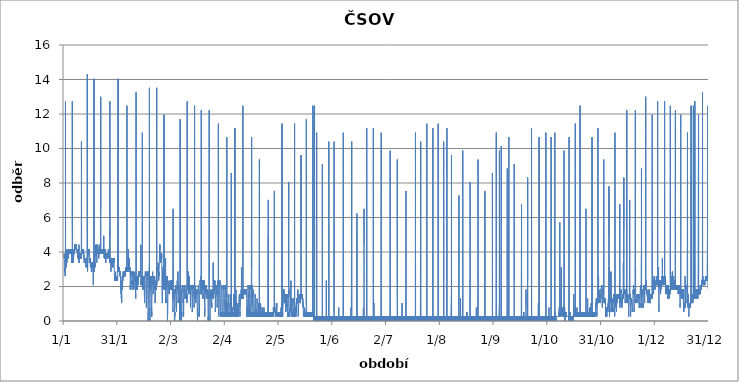
| Category | Series 0 |
|---|---|
| 2019-01-01 01:00:00 | 3.64 |
| 2019-01-01 02:00:00 | 3.64 |
| 2019-01-01 03:00:00 | 3.9 |
| 2019-01-01 04:00:00 | 3.9 |
| 2019-01-01 05:00:00 | 3.64 |
| 2019-01-01 06:00:00 | 3.64 |
| 2019-01-01 07:00:00 | 3.64 |
| 2019-01-01 08:00:00 | 3.64 |
| 2019-01-01 09:00:00 | 3.38 |
| 2019-01-01 10:00:00 | 3.38 |
| 2019-01-01 11:00:00 | 3.38 |
| 2019-01-01 12:00:00 | 3.38 |
| 2019-01-01 13:00:00 | 2.86 |
| 2019-01-01 14:00:00 | 3.12 |
| 2019-01-01 15:00:00 | 2.86 |
| 2019-01-01 16:00:00 | 2.6 |
| 2019-01-01 17:00:00 | 2.86 |
| 2019-01-01 18:00:00 | 2.86 |
| 2019-01-01 19:00:00 | 2.86 |
| 2019-01-01 20:00:00 | 3.12 |
| 2019-01-01 21:00:00 | 12.74 |
| 2019-01-01 22:00:00 | 3.9 |
| 2019-01-01 23:00:00 | 3.12 |
| 2019-01-02 | 3.12 |
| 2019-01-02 01:00:00 | 3.12 |
| 2019-01-02 02:00:00 | 3.12 |
| 2019-01-02 03:00:00 | 3.12 |
| 2019-01-02 04:00:00 | 3.38 |
| 2019-01-02 05:00:00 | 3.38 |
| 2019-01-02 06:00:00 | 3.12 |
| 2019-01-02 07:00:00 | 3.12 |
| 2019-01-02 08:00:00 | 3.38 |
| 2019-01-02 09:00:00 | 3.12 |
| 2019-01-02 10:00:00 | 3.12 |
| 2019-01-02 11:00:00 | 4.16 |
| 2019-01-02 12:00:00 | 3.9 |
| 2019-01-02 13:00:00 | 3.38 |
| 2019-01-02 14:00:00 | 3.64 |
| 2019-01-02 15:00:00 | 3.38 |
| 2019-01-02 16:00:00 | 3.64 |
| 2019-01-02 17:00:00 | 3.64 |
| 2019-01-02 18:00:00 | 3.64 |
| 2019-01-02 19:00:00 | 3.64 |
| 2019-01-02 20:00:00 | 3.64 |
| 2019-01-02 21:00:00 | 3.64 |
| 2019-01-02 22:00:00 | 3.9 |
| 2019-01-02 23:00:00 | 3.64 |
| 2019-01-03 | 3.9 |
| 2019-01-03 01:00:00 | 3.9 |
| 2019-01-03 02:00:00 | 3.9 |
| 2019-01-03 03:00:00 | 3.64 |
| 2019-01-03 04:00:00 | 3.9 |
| 2019-01-03 05:00:00 | 3.9 |
| 2019-01-03 06:00:00 | 3.9 |
| 2019-01-03 07:00:00 | 3.9 |
| 2019-01-03 08:00:00 | 4.16 |
| 2019-01-03 09:00:00 | 3.9 |
| 2019-01-03 10:00:00 | 3.9 |
| 2019-01-03 11:00:00 | 3.9 |
| 2019-01-03 12:00:00 | 3.64 |
| 2019-01-03 13:00:00 | 3.9 |
| 2019-01-03 14:00:00 | 3.64 |
| 2019-01-03 15:00:00 | 3.9 |
| 2019-01-03 16:00:00 | 3.9 |
| 2019-01-03 17:00:00 | 3.9 |
| 2019-01-03 18:00:00 | 3.9 |
| 2019-01-03 19:00:00 | 3.9 |
| 2019-01-03 20:00:00 | 4.16 |
| 2019-01-03 21:00:00 | 3.9 |
| 2019-01-03 22:00:00 | 4.16 |
| 2019-01-03 23:00:00 | 3.9 |
| 2019-01-04 | 4.16 |
| 2019-01-04 01:00:00 | 3.9 |
| 2019-01-04 02:00:00 | 4.16 |
| 2019-01-04 03:00:00 | 4.16 |
| 2019-01-04 04:00:00 | 4.16 |
| 2019-01-04 05:00:00 | 3.9 |
| 2019-01-04 06:00:00 | 4.16 |
| 2019-01-04 07:00:00 | 4.16 |
| 2019-01-04 08:00:00 | 4.16 |
| 2019-01-04 09:00:00 | 4.16 |
| 2019-01-04 10:00:00 | 4.16 |
| 2019-01-04 11:00:00 | 4.16 |
| 2019-01-04 12:00:00 | 3.9 |
| 2019-01-04 13:00:00 | 3.9 |
| 2019-01-04 14:00:00 | 4.16 |
| 2019-01-04 15:00:00 | 3.9 |
| 2019-01-04 16:00:00 | 4.16 |
| 2019-01-04 17:00:00 | 4.16 |
| 2019-01-04 18:00:00 | 4.16 |
| 2019-01-04 19:00:00 | 4.16 |
| 2019-01-04 20:00:00 | 4.16 |
| 2019-01-04 21:00:00 | 4.16 |
| 2019-01-04 22:00:00 | 4.16 |
| 2019-01-04 23:00:00 | 4.16 |
| 2019-01-05 | 3.9 |
| 2019-01-05 01:00:00 | 4.16 |
| 2019-01-05 02:00:00 | 4.16 |
| 2019-01-05 03:00:00 | 3.9 |
| 2019-01-05 04:00:00 | 4.16 |
| 2019-01-05 05:00:00 | 3.9 |
| 2019-01-05 06:00:00 | 4.16 |
| 2019-01-05 07:00:00 | 3.9 |
| 2019-01-05 08:00:00 | 3.9 |
| 2019-01-05 09:00:00 | 3.9 |
| 2019-01-05 10:00:00 | 3.64 |
| 2019-01-05 11:00:00 | 3.9 |
| 2019-01-05 12:00:00 | 3.38 |
| 2019-01-05 13:00:00 | 3.64 |
| 2019-01-05 14:00:00 | 3.38 |
| 2019-01-05 15:00:00 | 3.38 |
| 2019-01-05 16:00:00 | 3.38 |
| 2019-01-05 17:00:00 | 3.64 |
| 2019-01-05 18:00:00 | 12.74 |
| 2019-01-05 19:00:00 | 5.46 |
| 2019-01-05 20:00:00 | 3.64 |
| 2019-01-05 21:00:00 | 3.38 |
| 2019-01-05 22:00:00 | 3.64 |
| 2019-01-05 23:00:00 | 3.64 |
| 2019-01-06 | 3.38 |
| 2019-01-06 01:00:00 | 3.64 |
| 2019-01-06 02:00:00 | 3.38 |
| 2019-01-06 03:00:00 | 3.64 |
| 2019-01-06 04:00:00 | 3.64 |
| 2019-01-06 05:00:00 | 3.64 |
| 2019-01-06 06:00:00 | 3.9 |
| 2019-01-06 07:00:00 | 3.64 |
| 2019-01-06 08:00:00 | 3.64 |
| 2019-01-06 09:00:00 | 3.9 |
| 2019-01-06 10:00:00 | 3.64 |
| 2019-01-06 11:00:00 | 3.64 |
| 2019-01-06 12:00:00 | 3.64 |
| 2019-01-06 13:00:00 | 3.64 |
| 2019-01-06 14:00:00 | 3.9 |
| 2019-01-06 15:00:00 | 3.9 |
| 2019-01-06 16:00:00 | 3.9 |
| 2019-01-06 17:00:00 | 3.9 |
| 2019-01-06 18:00:00 | 4.16 |
| 2019-01-06 19:00:00 | 3.9 |
| 2019-01-06 20:00:00 | 4.16 |
| 2019-01-06 21:00:00 | 3.9 |
| 2019-01-06 22:00:00 | 3.9 |
| 2019-01-06 23:00:00 | 4.16 |
| 2019-01-07 | 3.9 |
| 2019-01-07 01:00:00 | 4.42 |
| 2019-01-07 02:00:00 | 4.16 |
| 2019-01-07 03:00:00 | 4.16 |
| 2019-01-07 04:00:00 | 4.42 |
| 2019-01-07 05:00:00 | 4.16 |
| 2019-01-07 06:00:00 | 4.16 |
| 2019-01-07 07:00:00 | 4.42 |
| 2019-01-07 08:00:00 | 4.16 |
| 2019-01-07 09:00:00 | 4.16 |
| 2019-01-07 10:00:00 | 4.16 |
| 2019-01-07 11:00:00 | 4.16 |
| 2019-01-07 12:00:00 | 4.42 |
| 2019-01-07 13:00:00 | 4.16 |
| 2019-01-07 14:00:00 | 4.16 |
| 2019-01-07 15:00:00 | 4.42 |
| 2019-01-07 16:00:00 | 4.42 |
| 2019-01-07 17:00:00 | 4.16 |
| 2019-01-07 18:00:00 | 4.16 |
| 2019-01-07 19:00:00 | 4.42 |
| 2019-01-07 20:00:00 | 4.16 |
| 2019-01-07 21:00:00 | 4.42 |
| 2019-01-07 22:00:00 | 4.16 |
| 2019-01-07 23:00:00 | 4.42 |
| 2019-01-08 | 4.16 |
| 2019-01-08 01:00:00 | 4.16 |
| 2019-01-08 02:00:00 | 4.42 |
| 2019-01-08 03:00:00 | 4.16 |
| 2019-01-08 04:00:00 | 4.16 |
| 2019-01-08 05:00:00 | 4.16 |
| 2019-01-08 06:00:00 | 4.16 |
| 2019-01-08 07:00:00 | 4.16 |
| 2019-01-08 08:00:00 | 4.16 |
| 2019-01-08 09:00:00 | 4.16 |
| 2019-01-08 10:00:00 | 4.16 |
| 2019-01-08 11:00:00 | 4.16 |
| 2019-01-08 12:00:00 | 4.16 |
| 2019-01-08 13:00:00 | 4.16 |
| 2019-01-08 14:00:00 | 3.9 |
| 2019-01-08 15:00:00 | 4.16 |
| 2019-01-08 16:00:00 | 3.9 |
| 2019-01-08 17:00:00 | 3.9 |
| 2019-01-08 18:00:00 | 3.9 |
| 2019-01-08 19:00:00 | 3.9 |
| 2019-01-08 20:00:00 | 3.9 |
| 2019-01-08 21:00:00 | 3.64 |
| 2019-01-08 22:00:00 | 3.9 |
| 2019-01-08 23:00:00 | 3.64 |
| 2019-01-09 | 3.9 |
| 2019-01-09 01:00:00 | 3.64 |
| 2019-01-09 02:00:00 | 3.64 |
| 2019-01-09 03:00:00 | 3.64 |
| 2019-01-09 04:00:00 | 3.64 |
| 2019-01-09 05:00:00 | 3.9 |
| 2019-01-09 06:00:00 | 3.64 |
| 2019-01-09 07:00:00 | 3.64 |
| 2019-01-09 08:00:00 | 3.64 |
| 2019-01-09 09:00:00 | 3.64 |
| 2019-01-09 10:00:00 | 3.64 |
| 2019-01-09 11:00:00 | 3.64 |
| 2019-01-09 12:00:00 | 4.42 |
| 2019-01-09 13:00:00 | 3.64 |
| 2019-01-09 14:00:00 | 3.38 |
| 2019-01-09 15:00:00 | 3.38 |
| 2019-01-09 16:00:00 | 3.64 |
| 2019-01-09 17:00:00 | 3.38 |
| 2019-01-09 18:00:00 | 3.64 |
| 2019-01-09 19:00:00 | 3.64 |
| 2019-01-09 20:00:00 | 3.64 |
| 2019-01-09 21:00:00 | 3.9 |
| 2019-01-09 22:00:00 | 3.64 |
| 2019-01-09 23:00:00 | 3.64 |
| 2019-01-10 | 3.64 |
| 2019-01-10 01:00:00 | 3.64 |
| 2019-01-10 02:00:00 | 3.9 |
| 2019-01-10 03:00:00 | 3.64 |
| 2019-01-10 04:00:00 | 3.9 |
| 2019-01-10 05:00:00 | 3.64 |
| 2019-01-10 06:00:00 | 3.64 |
| 2019-01-10 07:00:00 | 3.64 |
| 2019-01-10 08:00:00 | 3.64 |
| 2019-01-10 09:00:00 | 3.64 |
| 2019-01-10 10:00:00 | 3.64 |
| 2019-01-10 11:00:00 | 3.64 |
| 2019-01-10 12:00:00 | 3.64 |
| 2019-01-10 13:00:00 | 3.9 |
| 2019-01-10 14:00:00 | 3.64 |
| 2019-01-10 15:00:00 | 3.9 |
| 2019-01-10 16:00:00 | 3.9 |
| 2019-01-10 17:00:00 | 3.64 |
| 2019-01-10 18:00:00 | 3.9 |
| 2019-01-10 19:00:00 | 3.64 |
| 2019-01-10 20:00:00 | 3.9 |
| 2019-01-10 21:00:00 | 3.9 |
| 2019-01-10 22:00:00 | 10.4 |
| 2019-01-10 23:00:00 | 8.32 |
| 2019-01-11 | 4.16 |
| 2019-01-11 01:00:00 | 3.9 |
| 2019-01-11 02:00:00 | 3.9 |
| 2019-01-11 03:00:00 | 4.16 |
| 2019-01-11 04:00:00 | 3.9 |
| 2019-01-11 05:00:00 | 4.16 |
| 2019-01-11 06:00:00 | 4.16 |
| 2019-01-11 07:00:00 | 3.9 |
| 2019-01-11 08:00:00 | 4.16 |
| 2019-01-11 09:00:00 | 4.16 |
| 2019-01-11 10:00:00 | 4.16 |
| 2019-01-11 11:00:00 | 3.9 |
| 2019-01-11 12:00:00 | 4.16 |
| 2019-01-11 13:00:00 | 3.9 |
| 2019-01-11 14:00:00 | 4.16 |
| 2019-01-11 15:00:00 | 3.9 |
| 2019-01-11 16:00:00 | 4.16 |
| 2019-01-11 17:00:00 | 4.16 |
| 2019-01-11 18:00:00 | 3.9 |
| 2019-01-11 19:00:00 | 4.16 |
| 2019-01-11 20:00:00 | 4.16 |
| 2019-01-11 21:00:00 | 4.16 |
| 2019-01-11 22:00:00 | 4.16 |
| 2019-01-11 23:00:00 | 4.16 |
| 2019-01-12 | 4.16 |
| 2019-01-12 01:00:00 | 4.16 |
| 2019-01-12 02:00:00 | 3.9 |
| 2019-01-12 03:00:00 | 4.16 |
| 2019-01-12 04:00:00 | 3.64 |
| 2019-01-12 05:00:00 | 3.9 |
| 2019-01-12 06:00:00 | 3.9 |
| 2019-01-12 07:00:00 | 3.64 |
| 2019-01-12 08:00:00 | 3.64 |
| 2019-01-12 09:00:00 | 3.64 |
| 2019-01-12 10:00:00 | 3.64 |
| 2019-01-12 11:00:00 | 3.38 |
| 2019-01-12 12:00:00 | 3.38 |
| 2019-01-12 13:00:00 | 3.38 |
| 2019-01-12 14:00:00 | 3.38 |
| 2019-01-12 15:00:00 | 3.38 |
| 2019-01-12 16:00:00 | 3.38 |
| 2019-01-12 17:00:00 | 3.38 |
| 2019-01-12 18:00:00 | 3.38 |
| 2019-01-12 19:00:00 | 3.64 |
| 2019-01-12 20:00:00 | 3.64 |
| 2019-01-12 21:00:00 | 3.64 |
| 2019-01-12 22:00:00 | 3.38 |
| 2019-01-12 23:00:00 | 3.64 |
| 2019-01-13 | 3.38 |
| 2019-01-13 01:00:00 | 3.64 |
| 2019-01-13 02:00:00 | 3.38 |
| 2019-01-13 03:00:00 | 3.64 |
| 2019-01-13 04:00:00 | 3.64 |
| 2019-01-13 05:00:00 | 3.38 |
| 2019-01-13 06:00:00 | 3.38 |
| 2019-01-13 07:00:00 | 3.64 |
| 2019-01-13 08:00:00 | 3.38 |
| 2019-01-13 09:00:00 | 3.38 |
| 2019-01-13 10:00:00 | 3.64 |
| 2019-01-13 11:00:00 | 3.38 |
| 2019-01-13 12:00:00 | 3.38 |
| 2019-01-13 13:00:00 | 3.12 |
| 2019-01-13 14:00:00 | 3.12 |
| 2019-01-13 15:00:00 | 3.12 |
| 2019-01-13 16:00:00 | 3.38 |
| 2019-01-13 17:00:00 | 3.12 |
| 2019-01-13 18:00:00 | 3.38 |
| 2019-01-13 19:00:00 | 3.38 |
| 2019-01-13 20:00:00 | 3.12 |
| 2019-01-13 21:00:00 | 3.12 |
| 2019-01-13 22:00:00 | 3.38 |
| 2019-01-13 23:00:00 | 3.12 |
| 2019-01-14 | 3.38 |
| 2019-01-14 01:00:00 | 3.38 |
| 2019-01-14 02:00:00 | 3.12 |
| 2019-01-14 03:00:00 | 3.12 |
| 2019-01-14 04:00:00 | 3.38 |
| 2019-01-14 05:00:00 | 3.12 |
| 2019-01-14 06:00:00 | 14.3 |
| 2019-01-14 07:00:00 | 3.12 |
| 2019-01-14 08:00:00 | 3.12 |
| 2019-01-14 09:00:00 | 2.86 |
| 2019-01-14 10:00:00 | 3.12 |
| 2019-01-14 11:00:00 | 3.12 |
| 2019-01-14 12:00:00 | 3.12 |
| 2019-01-14 13:00:00 | 3.12 |
| 2019-01-14 14:00:00 | 3.12 |
| 2019-01-14 15:00:00 | 3.38 |
| 2019-01-14 16:00:00 | 3.38 |
| 2019-01-14 17:00:00 | 3.64 |
| 2019-01-14 18:00:00 | 3.64 |
| 2019-01-14 19:00:00 | 3.64 |
| 2019-01-14 20:00:00 | 3.64 |
| 2019-01-14 21:00:00 | 3.9 |
| 2019-01-14 22:00:00 | 3.9 |
| 2019-01-14 23:00:00 | 3.9 |
| 2019-01-15 | 3.9 |
| 2019-01-15 01:00:00 | 4.16 |
| 2019-01-15 02:00:00 | 4.16 |
| 2019-01-15 03:00:00 | 4.16 |
| 2019-01-15 04:00:00 | 4.16 |
| 2019-01-15 05:00:00 | 3.9 |
| 2019-01-15 06:00:00 | 4.16 |
| 2019-01-15 07:00:00 | 3.9 |
| 2019-01-15 08:00:00 | 4.16 |
| 2019-01-15 09:00:00 | 3.9 |
| 2019-01-15 10:00:00 | 3.9 |
| 2019-01-15 11:00:00 | 3.9 |
| 2019-01-15 12:00:00 | 3.9 |
| 2019-01-15 13:00:00 | 3.64 |
| 2019-01-15 14:00:00 | 3.64 |
| 2019-01-15 15:00:00 | 3.38 |
| 2019-01-15 16:00:00 | 3.38 |
| 2019-01-15 17:00:00 | 3.64 |
| 2019-01-15 18:00:00 | 3.38 |
| 2019-01-15 19:00:00 | 3.64 |
| 2019-01-15 20:00:00 | 3.38 |
| 2019-01-15 21:00:00 | 3.38 |
| 2019-01-15 22:00:00 | 3.64 |
| 2019-01-15 23:00:00 | 3.38 |
| 2019-01-16 | 3.12 |
| 2019-01-16 01:00:00 | 3.12 |
| 2019-01-16 02:00:00 | 3.12 |
| 2019-01-16 03:00:00 | 3.12 |
| 2019-01-16 04:00:00 | 3.38 |
| 2019-01-16 05:00:00 | 3.38 |
| 2019-01-16 06:00:00 | 3.12 |
| 2019-01-16 07:00:00 | 3.38 |
| 2019-01-16 08:00:00 | 3.38 |
| 2019-01-16 09:00:00 | 3.38 |
| 2019-01-16 10:00:00 | 3.38 |
| 2019-01-16 11:00:00 | 3.12 |
| 2019-01-16 12:00:00 | 3.12 |
| 2019-01-16 13:00:00 | 2.86 |
| 2019-01-16 14:00:00 | 3.12 |
| 2019-01-16 15:00:00 | 2.86 |
| 2019-01-16 16:00:00 | 3.12 |
| 2019-01-16 17:00:00 | 2.86 |
| 2019-01-16 18:00:00 | 3.38 |
| 2019-01-16 19:00:00 | 3.12 |
| 2019-01-16 20:00:00 | 3.12 |
| 2019-01-16 21:00:00 | 3.38 |
| 2019-01-16 22:00:00 | 3.38 |
| 2019-01-16 23:00:00 | 3.12 |
| 2019-01-17 | 3.38 |
| 2019-01-17 01:00:00 | 3.38 |
| 2019-01-17 02:00:00 | 3.38 |
| 2019-01-17 03:00:00 | 3.12 |
| 2019-01-17 04:00:00 | 3.38 |
| 2019-01-17 05:00:00 | 3.38 |
| 2019-01-17 06:00:00 | 3.12 |
| 2019-01-17 07:00:00 | 3.12 |
| 2019-01-17 08:00:00 | 3.38 |
| 2019-01-17 09:00:00 | 3.12 |
| 2019-01-17 10:00:00 | 3.12 |
| 2019-01-17 11:00:00 | 3.12 |
| 2019-01-17 12:00:00 | 2.6 |
| 2019-01-17 13:00:00 | 2.6 |
| 2019-01-17 14:00:00 | 2.34 |
| 2019-01-17 15:00:00 | 2.08 |
| 2019-01-17 16:00:00 | 2.6 |
| 2019-01-17 17:00:00 | 2.6 |
| 2019-01-17 18:00:00 | 2.86 |
| 2019-01-17 19:00:00 | 2.86 |
| 2019-01-17 20:00:00 | 3.12 |
| 2019-01-17 21:00:00 | 2.86 |
| 2019-01-17 22:00:00 | 3.12 |
| 2019-01-17 23:00:00 | 2.86 |
| 2019-01-18 | 14.04 |
| 2019-01-18 01:00:00 | 2.86 |
| 2019-01-18 02:00:00 | 2.86 |
| 2019-01-18 03:00:00 | 3.12 |
| 2019-01-18 04:00:00 | 3.12 |
| 2019-01-18 05:00:00 | 3.12 |
| 2019-01-18 06:00:00 | 2.86 |
| 2019-01-18 07:00:00 | 3.12 |
| 2019-01-18 08:00:00 | 3.12 |
| 2019-01-18 09:00:00 | 3.12 |
| 2019-01-18 10:00:00 | 3.9 |
| 2019-01-18 11:00:00 | 3.38 |
| 2019-01-18 12:00:00 | 3.12 |
| 2019-01-18 13:00:00 | 3.38 |
| 2019-01-18 14:00:00 | 3.12 |
| 2019-01-18 15:00:00 | 3.38 |
| 2019-01-18 16:00:00 | 3.38 |
| 2019-01-18 17:00:00 | 3.64 |
| 2019-01-18 18:00:00 | 3.64 |
| 2019-01-18 19:00:00 | 3.64 |
| 2019-01-18 20:00:00 | 3.9 |
| 2019-01-18 21:00:00 | 3.9 |
| 2019-01-18 22:00:00 | 4.16 |
| 2019-01-18 23:00:00 | 3.9 |
| 2019-01-19 | 4.16 |
| 2019-01-19 01:00:00 | 4.16 |
| 2019-01-19 02:00:00 | 4.42 |
| 2019-01-19 03:00:00 | 4.16 |
| 2019-01-19 04:00:00 | 4.16 |
| 2019-01-19 05:00:00 | 4.16 |
| 2019-01-19 06:00:00 | 4.16 |
| 2019-01-19 07:00:00 | 4.42 |
| 2019-01-19 08:00:00 | 4.16 |
| 2019-01-19 09:00:00 | 4.42 |
| 2019-01-19 10:00:00 | 4.16 |
| 2019-01-19 11:00:00 | 3.9 |
| 2019-01-19 12:00:00 | 3.64 |
| 2019-01-19 13:00:00 | 3.64 |
| 2019-01-19 14:00:00 | 3.38 |
| 2019-01-19 15:00:00 | 3.38 |
| 2019-01-19 16:00:00 | 3.64 |
| 2019-01-19 17:00:00 | 3.9 |
| 2019-01-19 18:00:00 | 3.9 |
| 2019-01-19 19:00:00 | 4.16 |
| 2019-01-19 20:00:00 | 4.16 |
| 2019-01-19 21:00:00 | 3.9 |
| 2019-01-19 22:00:00 | 4.16 |
| 2019-01-19 23:00:00 | 4.42 |
| 2019-01-20 | 4.16 |
| 2019-01-20 01:00:00 | 4.16 |
| 2019-01-20 02:00:00 | 4.16 |
| 2019-01-20 03:00:00 | 4.16 |
| 2019-01-20 04:00:00 | 4.16 |
| 2019-01-20 05:00:00 | 4.16 |
| 2019-01-20 06:00:00 | 4.16 |
| 2019-01-20 07:00:00 | 3.9 |
| 2019-01-20 08:00:00 | 4.16 |
| 2019-01-20 09:00:00 | 4.16 |
| 2019-01-20 10:00:00 | 3.9 |
| 2019-01-20 11:00:00 | 3.9 |
| 2019-01-20 12:00:00 | 3.9 |
| 2019-01-20 13:00:00 | 3.9 |
| 2019-01-20 14:00:00 | 3.64 |
| 2019-01-20 15:00:00 | 3.9 |
| 2019-01-20 16:00:00 | 3.64 |
| 2019-01-20 17:00:00 | 3.9 |
| 2019-01-20 18:00:00 | 3.9 |
| 2019-01-20 19:00:00 | 3.9 |
| 2019-01-20 20:00:00 | 4.16 |
| 2019-01-20 21:00:00 | 3.9 |
| 2019-01-20 22:00:00 | 4.16 |
| 2019-01-20 23:00:00 | 4.42 |
| 2019-01-21 | 4.16 |
| 2019-01-21 01:00:00 | 4.16 |
| 2019-01-21 02:00:00 | 4.16 |
| 2019-01-21 03:00:00 | 4.16 |
| 2019-01-21 04:00:00 | 4.42 |
| 2019-01-21 05:00:00 | 4.16 |
| 2019-01-21 06:00:00 | 4.16 |
| 2019-01-21 07:00:00 | 3.9 |
| 2019-01-21 08:00:00 | 4.16 |
| 2019-01-21 09:00:00 | 3.9 |
| 2019-01-21 10:00:00 | 4.16 |
| 2019-01-21 11:00:00 | 3.9 |
| 2019-01-21 12:00:00 | 4.16 |
| 2019-01-21 13:00:00 | 4.16 |
| 2019-01-21 14:00:00 | 3.9 |
| 2019-01-21 15:00:00 | 4.16 |
| 2019-01-21 16:00:00 | 4.16 |
| 2019-01-21 17:00:00 | 3.9 |
| 2019-01-21 18:00:00 | 4.16 |
| 2019-01-21 19:00:00 | 4.16 |
| 2019-01-21 20:00:00 | 13 |
| 2019-01-21 21:00:00 | 6.5 |
| 2019-01-21 22:00:00 | 4.16 |
| 2019-01-21 23:00:00 | 4.16 |
| 2019-01-22 | 4.16 |
| 2019-01-22 01:00:00 | 4.16 |
| 2019-01-22 02:00:00 | 3.9 |
| 2019-01-22 03:00:00 | 4.16 |
| 2019-01-22 04:00:00 | 4.16 |
| 2019-01-22 05:00:00 | 3.9 |
| 2019-01-22 06:00:00 | 3.9 |
| 2019-01-22 07:00:00 | 4.16 |
| 2019-01-22 08:00:00 | 3.9 |
| 2019-01-22 09:00:00 | 4.16 |
| 2019-01-22 10:00:00 | 4.16 |
| 2019-01-22 11:00:00 | 4.16 |
| 2019-01-22 12:00:00 | 4.16 |
| 2019-01-22 13:00:00 | 3.9 |
| 2019-01-22 14:00:00 | 3.9 |
| 2019-01-22 15:00:00 | 3.9 |
| 2019-01-22 16:00:00 | 3.9 |
| 2019-01-22 17:00:00 | 3.9 |
| 2019-01-22 18:00:00 | 3.9 |
| 2019-01-22 19:00:00 | 4.16 |
| 2019-01-22 20:00:00 | 4.16 |
| 2019-01-22 21:00:00 | 4.16 |
| 2019-01-22 22:00:00 | 4.16 |
| 2019-01-22 23:00:00 | 4.16 |
| 2019-01-23 | 4.16 |
| 2019-01-23 01:00:00 | 4.16 |
| 2019-01-23 02:00:00 | 4.16 |
| 2019-01-23 03:00:00 | 4.16 |
| 2019-01-23 04:00:00 | 3.9 |
| 2019-01-23 05:00:00 | 4.16 |
| 2019-01-23 06:00:00 | 4.16 |
| 2019-01-23 07:00:00 | 3.9 |
| 2019-01-23 08:00:00 | 4.16 |
| 2019-01-23 09:00:00 | 3.9 |
| 2019-01-23 10:00:00 | 4.16 |
| 2019-01-23 11:00:00 | 3.9 |
| 2019-01-23 12:00:00 | 4.94 |
| 2019-01-23 13:00:00 | 4.16 |
| 2019-01-23 14:00:00 | 3.9 |
| 2019-01-23 15:00:00 | 4.16 |
| 2019-01-23 16:00:00 | 3.9 |
| 2019-01-23 17:00:00 | 3.9 |
| 2019-01-23 18:00:00 | 3.9 |
| 2019-01-23 19:00:00 | 3.9 |
| 2019-01-23 20:00:00 | 3.64 |
| 2019-01-23 21:00:00 | 4.16 |
| 2019-01-23 22:00:00 | 3.64 |
| 2019-01-23 23:00:00 | 4.16 |
| 2019-01-24 | 3.64 |
| 2019-01-24 01:00:00 | 4.16 |
| 2019-01-24 02:00:00 | 3.9 |
| 2019-01-24 03:00:00 | 3.9 |
| 2019-01-24 04:00:00 | 3.9 |
| 2019-01-24 05:00:00 | 3.9 |
| 2019-01-24 06:00:00 | 3.9 |
| 2019-01-24 07:00:00 | 3.9 |
| 2019-01-24 08:00:00 | 3.64 |
| 2019-01-24 09:00:00 | 4.16 |
| 2019-01-24 10:00:00 | 3.9 |
| 2019-01-24 11:00:00 | 3.64 |
| 2019-01-24 12:00:00 | 3.64 |
| 2019-01-24 13:00:00 | 3.38 |
| 2019-01-24 14:00:00 | 3.64 |
| 2019-01-24 15:00:00 | 3.38 |
| 2019-01-24 16:00:00 | 3.64 |
| 2019-01-24 17:00:00 | 3.64 |
| 2019-01-24 18:00:00 | 3.64 |
| 2019-01-24 19:00:00 | 3.64 |
| 2019-01-24 20:00:00 | 3.9 |
| 2019-01-24 21:00:00 | 3.64 |
| 2019-01-24 22:00:00 | 3.64 |
| 2019-01-24 23:00:00 | 3.9 |
| 2019-01-25 | 3.9 |
| 2019-01-25 01:00:00 | 3.9 |
| 2019-01-25 02:00:00 | 3.9 |
| 2019-01-25 03:00:00 | 3.9 |
| 2019-01-25 04:00:00 | 3.9 |
| 2019-01-25 05:00:00 | 3.9 |
| 2019-01-25 06:00:00 | 3.9 |
| 2019-01-25 07:00:00 | 3.9 |
| 2019-01-25 08:00:00 | 3.9 |
| 2019-01-25 09:00:00 | 3.9 |
| 2019-01-25 10:00:00 | 3.64 |
| 2019-01-25 11:00:00 | 3.9 |
| 2019-01-25 12:00:00 | 3.9 |
| 2019-01-25 13:00:00 | 3.64 |
| 2019-01-25 14:00:00 | 3.9 |
| 2019-01-25 15:00:00 | 3.64 |
| 2019-01-25 16:00:00 | 3.9 |
| 2019-01-25 17:00:00 | 3.64 |
| 2019-01-25 18:00:00 | 3.64 |
| 2019-01-25 19:00:00 | 3.9 |
| 2019-01-25 20:00:00 | 3.9 |
| 2019-01-25 21:00:00 | 3.9 |
| 2019-01-25 22:00:00 | 3.9 |
| 2019-01-25 23:00:00 | 3.9 |
| 2019-01-26 | 3.9 |
| 2019-01-26 01:00:00 | 3.9 |
| 2019-01-26 02:00:00 | 3.9 |
| 2019-01-26 03:00:00 | 3.9 |
| 2019-01-26 04:00:00 | 4.16 |
| 2019-01-26 05:00:00 | 3.9 |
| 2019-01-26 06:00:00 | 3.9 |
| 2019-01-26 07:00:00 | 3.9 |
| 2019-01-26 08:00:00 | 3.9 |
| 2019-01-26 09:00:00 | 3.9 |
| 2019-01-26 10:00:00 | 3.9 |
| 2019-01-26 11:00:00 | 3.9 |
| 2019-01-26 12:00:00 | 3.64 |
| 2019-01-26 13:00:00 | 3.9 |
| 2019-01-26 14:00:00 | 3.64 |
| 2019-01-26 15:00:00 | 3.9 |
| 2019-01-26 16:00:00 | 3.64 |
| 2019-01-26 17:00:00 | 3.64 |
| 2019-01-26 18:00:00 | 3.9 |
| 2019-01-26 19:00:00 | 3.38 |
| 2019-01-26 20:00:00 | 3.9 |
| 2019-01-26 21:00:00 | 3.64 |
| 2019-01-26 22:00:00 | 3.64 |
| 2019-01-26 23:00:00 | 5.46 |
| 2019-01-27 | 12.74 |
| 2019-01-27 01:00:00 | 3.64 |
| 2019-01-27 02:00:00 | 3.38 |
| 2019-01-27 03:00:00 | 3.64 |
| 2019-01-27 04:00:00 | 3.64 |
| 2019-01-27 05:00:00 | 3.38 |
| 2019-01-27 06:00:00 | 3.64 |
| 2019-01-27 07:00:00 | 3.64 |
| 2019-01-27 08:00:00 | 3.38 |
| 2019-01-27 09:00:00 | 3.38 |
| 2019-01-27 10:00:00 | 3.38 |
| 2019-01-27 11:00:00 | 3.38 |
| 2019-01-27 12:00:00 | 3.38 |
| 2019-01-27 13:00:00 | 3.12 |
| 2019-01-27 14:00:00 | 3.12 |
| 2019-01-27 15:00:00 | 2.86 |
| 2019-01-27 16:00:00 | 2.86 |
| 2019-01-27 17:00:00 | 3.12 |
| 2019-01-27 18:00:00 | 3.64 |
| 2019-01-27 19:00:00 | 3.38 |
| 2019-01-27 20:00:00 | 3.38 |
| 2019-01-27 21:00:00 | 3.38 |
| 2019-01-27 22:00:00 | 3.38 |
| 2019-01-27 23:00:00 | 3.64 |
| 2019-01-28 | 3.38 |
| 2019-01-28 01:00:00 | 3.38 |
| 2019-01-28 02:00:00 | 3.38 |
| 2019-01-28 03:00:00 | 3.38 |
| 2019-01-28 04:00:00 | 3.38 |
| 2019-01-28 05:00:00 | 3.38 |
| 2019-01-28 06:00:00 | 3.38 |
| 2019-01-28 07:00:00 | 3.38 |
| 2019-01-28 08:00:00 | 3.12 |
| 2019-01-28 09:00:00 | 3.64 |
| 2019-01-28 10:00:00 | 3.12 |
| 2019-01-28 11:00:00 | 3.38 |
| 2019-01-28 12:00:00 | 3.38 |
| 2019-01-28 13:00:00 | 3.38 |
| 2019-01-28 14:00:00 | 3.38 |
| 2019-01-28 15:00:00 | 3.38 |
| 2019-01-28 16:00:00 | 3.38 |
| 2019-01-28 17:00:00 | 3.38 |
| 2019-01-28 18:00:00 | 3.38 |
| 2019-01-28 19:00:00 | 3.12 |
| 2019-01-28 20:00:00 | 3.38 |
| 2019-01-28 21:00:00 | 3.38 |
| 2019-01-28 22:00:00 | 3.64 |
| 2019-01-28 23:00:00 | 3.38 |
| 2019-01-29 | 3.64 |
| 2019-01-29 01:00:00 | 3.38 |
| 2019-01-29 02:00:00 | 3.64 |
| 2019-01-29 03:00:00 | 3.38 |
| 2019-01-29 04:00:00 | 3.64 |
| 2019-01-29 05:00:00 | 3.38 |
| 2019-01-29 06:00:00 | 3.64 |
| 2019-01-29 07:00:00 | 3.38 |
| 2019-01-29 08:00:00 | 3.64 |
| 2019-01-29 09:00:00 | 3.38 |
| 2019-01-29 10:00:00 | 3.38 |
| 2019-01-29 11:00:00 | 3.38 |
| 2019-01-29 12:00:00 | 3.38 |
| 2019-01-29 13:00:00 | 3.38 |
| 2019-01-29 14:00:00 | 2.6 |
| 2019-01-29 15:00:00 | 2.34 |
| 2019-01-29 16:00:00 | 2.34 |
| 2019-01-29 17:00:00 | 2.34 |
| 2019-01-29 18:00:00 | 2.34 |
| 2019-01-29 19:00:00 | 2.6 |
| 2019-01-29 20:00:00 | 2.6 |
| 2019-01-29 21:00:00 | 2.34 |
| 2019-01-29 22:00:00 | 2.6 |
| 2019-01-29 23:00:00 | 2.6 |
| 2019-01-30 | 2.34 |
| 2019-01-30 01:00:00 | 2.6 |
| 2019-01-30 02:00:00 | 2.6 |
| 2019-01-30 03:00:00 | 2.6 |
| 2019-01-30 04:00:00 | 2.34 |
| 2019-01-30 05:00:00 | 2.6 |
| 2019-01-30 06:00:00 | 2.86 |
| 2019-01-30 07:00:00 | 2.34 |
| 2019-01-30 08:00:00 | 2.6 |
| 2019-01-30 09:00:00 | 2.6 |
| 2019-01-30 10:00:00 | 2.34 |
| 2019-01-30 11:00:00 | 2.6 |
| 2019-01-30 12:00:00 | 2.6 |
| 2019-01-30 13:00:00 | 2.34 |
| 2019-01-30 14:00:00 | 2.34 |
| 2019-01-30 15:00:00 | 2.34 |
| 2019-01-30 16:00:00 | 2.34 |
| 2019-01-30 17:00:00 | 2.6 |
| 2019-01-30 18:00:00 | 2.34 |
| 2019-01-30 19:00:00 | 2.6 |
| 2019-01-30 20:00:00 | 2.6 |
| 2019-01-30 21:00:00 | 2.6 |
| 2019-01-30 22:00:00 | 2.6 |
| 2019-01-30 23:00:00 | 2.6 |
| 2019-01-31 | 2.34 |
| 2019-01-31 01:00:00 | 2.6 |
| 2019-01-31 02:00:00 | 2.6 |
| 2019-01-31 03:00:00 | 2.6 |
| 2019-01-31 04:00:00 | 2.6 |
| 2019-01-31 05:00:00 | 2.6 |
| 2019-01-31 06:00:00 | 2.6 |
| 2019-01-31 07:00:00 | 2.6 |
| 2019-01-31 08:00:00 | 2.6 |
| 2019-01-31 09:00:00 | 2.34 |
| 2019-01-31 10:00:00 | 2.6 |
| 2019-01-31 11:00:00 | 2.6 |
| 2019-01-31 12:00:00 | 4.16 |
| 2019-01-31 13:00:00 | 3.12 |
| 2019-01-31 14:00:00 | 2.86 |
| 2019-01-31 15:00:00 | 2.86 |
| 2019-01-31 16:00:00 | 14.04 |
| 2019-01-31 17:00:00 | 2.86 |
| 2019-01-31 18:00:00 | 3.12 |
| 2019-01-31 19:00:00 | 2.86 |
| 2019-01-31 20:00:00 | 2.86 |
| 2019-01-31 21:00:00 | 3.12 |
| 2019-01-31 22:00:00 | 2.86 |
| 2019-01-31 23:00:00 | 3.12 |
| 2019-02-01 | 2.86 |
| 2019-02-01 01:00:00 | 3.12 |
| 2019-02-01 02:00:00 | 2.86 |
| 2019-02-01 03:00:00 | 3.12 |
| 2019-02-01 04:00:00 | 2.86 |
| 2019-02-01 05:00:00 | 3.12 |
| 2019-02-01 06:00:00 | 3.12 |
| 2019-02-01 07:00:00 | 2.86 |
| 2019-02-01 08:00:00 | 2.86 |
| 2019-02-01 09:00:00 | 3.12 |
| 2019-02-01 10:00:00 | 2.86 |
| 2019-02-01 11:00:00 | 2.86 |
| 2019-02-01 12:00:00 | 2.86 |
| 2019-02-01 13:00:00 | 2.86 |
| 2019-02-01 14:00:00 | 2.6 |
| 2019-02-01 15:00:00 | 2.6 |
| 2019-02-01 16:00:00 | 2.6 |
| 2019-02-01 17:00:00 | 2.6 |
| 2019-02-01 18:00:00 | 2.86 |
| 2019-02-01 19:00:00 | 2.6 |
| 2019-02-01 20:00:00 | 2.6 |
| 2019-02-01 21:00:00 | 2.86 |
| 2019-02-01 22:00:00 | 2.6 |
| 2019-02-01 23:00:00 | 2.86 |
| 2019-02-02 | 2.6 |
| 2019-02-02 01:00:00 | 2.6 |
| 2019-02-02 02:00:00 | 2.08 |
| 2019-02-02 03:00:00 | 2.08 |
| 2019-02-02 04:00:00 | 2.08 |
| 2019-02-02 05:00:00 | 1.82 |
| 2019-02-02 06:00:00 | 2.08 |
| 2019-02-02 07:00:00 | 2.08 |
| 2019-02-02 08:00:00 | 2.34 |
| 2019-02-02 09:00:00 | 2.34 |
| 2019-02-02 10:00:00 | 1.56 |
| 2019-02-02 11:00:00 | 1.82 |
| 2019-02-02 12:00:00 | 1.3 |
| 2019-02-02 13:00:00 | 1.3 |
| 2019-02-02 14:00:00 | 1.56 |
| 2019-02-02 15:00:00 | 1.3 |
| 2019-02-02 16:00:00 | 1.04 |
| 2019-02-02 17:00:00 | 1.56 |
| 2019-02-02 18:00:00 | 1.56 |
| 2019-02-02 19:00:00 | 1.56 |
| 2019-02-02 20:00:00 | 2.34 |
| 2019-02-02 21:00:00 | 1.82 |
| 2019-02-02 22:00:00 | 2.34 |
| 2019-02-02 23:00:00 | 2.6 |
| 2019-02-03 | 2.6 |
| 2019-02-03 01:00:00 | 2.6 |
| 2019-02-03 02:00:00 | 2.6 |
| 2019-02-03 03:00:00 | 2.6 |
| 2019-02-03 04:00:00 | 2.08 |
| 2019-02-03 05:00:00 | 2.6 |
| 2019-02-03 06:00:00 | 2.6 |
| 2019-02-03 07:00:00 | 2.6 |
| 2019-02-03 08:00:00 | 2.6 |
| 2019-02-03 09:00:00 | 2.34 |
| 2019-02-03 10:00:00 | 2.6 |
| 2019-02-03 11:00:00 | 2.6 |
| 2019-02-03 12:00:00 | 2.86 |
| 2019-02-03 13:00:00 | 2.6 |
| 2019-02-03 14:00:00 | 2.6 |
| 2019-02-03 15:00:00 | 2.6 |
| 2019-02-03 16:00:00 | 2.6 |
| 2019-02-03 17:00:00 | 2.6 |
| 2019-02-03 18:00:00 | 2.6 |
| 2019-02-03 19:00:00 | 2.86 |
| 2019-02-03 20:00:00 | 2.6 |
| 2019-02-03 21:00:00 | 2.86 |
| 2019-02-03 22:00:00 | 2.6 |
| 2019-02-03 23:00:00 | 2.6 |
| 2019-02-04 | 2.86 |
| 2019-02-04 01:00:00 | 2.6 |
| 2019-02-04 02:00:00 | 2.86 |
| 2019-02-04 03:00:00 | 2.6 |
| 2019-02-04 04:00:00 | 2.86 |
| 2019-02-04 05:00:00 | 2.6 |
| 2019-02-04 06:00:00 | 2.86 |
| 2019-02-04 07:00:00 | 2.86 |
| 2019-02-04 08:00:00 | 2.6 |
| 2019-02-04 09:00:00 | 2.86 |
| 2019-02-04 10:00:00 | 2.6 |
| 2019-02-04 11:00:00 | 2.86 |
| 2019-02-04 12:00:00 | 2.6 |
| 2019-02-04 13:00:00 | 2.86 |
| 2019-02-04 14:00:00 | 2.6 |
| 2019-02-04 15:00:00 | 2.6 |
| 2019-02-04 16:00:00 | 2.6 |
| 2019-02-04 17:00:00 | 2.86 |
| 2019-02-04 18:00:00 | 2.6 |
| 2019-02-04 19:00:00 | 2.86 |
| 2019-02-04 20:00:00 | 2.86 |
| 2019-02-04 21:00:00 | 2.86 |
| 2019-02-04 22:00:00 | 2.86 |
| 2019-02-04 23:00:00 | 2.86 |
| 2019-02-05 | 2.86 |
| 2019-02-05 01:00:00 | 2.86 |
| 2019-02-05 02:00:00 | 3.12 |
| 2019-02-05 03:00:00 | 2.86 |
| 2019-02-05 04:00:00 | 3.12 |
| 2019-02-05 05:00:00 | 2.86 |
| 2019-02-05 06:00:00 | 3.12 |
| 2019-02-05 07:00:00 | 2.86 |
| 2019-02-05 08:00:00 | 2.86 |
| 2019-02-05 09:00:00 | 3.12 |
| 2019-02-05 10:00:00 | 2.86 |
| 2019-02-05 11:00:00 | 2.86 |
| 2019-02-05 12:00:00 | 2.86 |
| 2019-02-05 13:00:00 | 2.86 |
| 2019-02-05 14:00:00 | 2.86 |
| 2019-02-05 15:00:00 | 3.9 |
| 2019-02-05 16:00:00 | 12.48 |
| 2019-02-05 17:00:00 | 2.86 |
| 2019-02-05 18:00:00 | 2.86 |
| 2019-02-05 19:00:00 | 3.12 |
| 2019-02-05 20:00:00 | 2.86 |
| 2019-02-05 21:00:00 | 3.12 |
| 2019-02-05 22:00:00 | 2.86 |
| 2019-02-05 23:00:00 | 3.12 |
| 2019-02-06 | 2.86 |
| 2019-02-06 01:00:00 | 2.86 |
| 2019-02-06 02:00:00 | 3.12 |
| 2019-02-06 03:00:00 | 2.86 |
| 2019-02-06 04:00:00 | 2.86 |
| 2019-02-06 05:00:00 | 3.12 |
| 2019-02-06 06:00:00 | 2.86 |
| 2019-02-06 07:00:00 | 2.86 |
| 2019-02-06 08:00:00 | 2.86 |
| 2019-02-06 09:00:00 | 2.86 |
| 2019-02-06 10:00:00 | 2.86 |
| 2019-02-06 11:00:00 | 3.12 |
| 2019-02-06 12:00:00 | 4.16 |
| 2019-02-06 13:00:00 | 2.86 |
| 2019-02-06 14:00:00 | 2.86 |
| 2019-02-06 15:00:00 | 2.86 |
| 2019-02-06 16:00:00 | 2.86 |
| 2019-02-06 17:00:00 | 2.86 |
| 2019-02-06 18:00:00 | 2.86 |
| 2019-02-06 19:00:00 | 2.86 |
| 2019-02-06 20:00:00 | 3.12 |
| 2019-02-06 21:00:00 | 3.12 |
| 2019-02-06 22:00:00 | 3.12 |
| 2019-02-06 23:00:00 | 3.64 |
| 2019-02-07 | 3.38 |
| 2019-02-07 01:00:00 | 3.38 |
| 2019-02-07 02:00:00 | 3.64 |
| 2019-02-07 03:00:00 | 3.12 |
| 2019-02-07 04:00:00 | 3.12 |
| 2019-02-07 05:00:00 | 3.12 |
| 2019-02-07 06:00:00 | 2.86 |
| 2019-02-07 07:00:00 | 2.86 |
| 2019-02-07 08:00:00 | 3.12 |
| 2019-02-07 09:00:00 | 2.86 |
| 2019-02-07 10:00:00 | 2.86 |
| 2019-02-07 11:00:00 | 2.6 |
| 2019-02-07 12:00:00 | 2.34 |
| 2019-02-07 13:00:00 | 1.82 |
| 2019-02-07 14:00:00 | 2.08 |
| 2019-02-07 15:00:00 | 1.82 |
| 2019-02-07 16:00:00 | 2.34 |
| 2019-02-07 17:00:00 | 2.6 |
| 2019-02-07 18:00:00 | 2.6 |
| 2019-02-07 19:00:00 | 2.86 |
| 2019-02-07 20:00:00 | 2.6 |
| 2019-02-07 21:00:00 | 2.6 |
| 2019-02-07 22:00:00 | 2.86 |
| 2019-02-07 23:00:00 | 2.86 |
| 2019-02-08 | 2.86 |
| 2019-02-08 01:00:00 | 2.86 |
| 2019-02-08 02:00:00 | 2.86 |
| 2019-02-08 03:00:00 | 2.86 |
| 2019-02-08 04:00:00 | 2.6 |
| 2019-02-08 05:00:00 | 2.86 |
| 2019-02-08 06:00:00 | 2.86 |
| 2019-02-08 07:00:00 | 2.86 |
| 2019-02-08 08:00:00 | 2.6 |
| 2019-02-08 09:00:00 | 2.86 |
| 2019-02-08 10:00:00 | 2.86 |
| 2019-02-08 11:00:00 | 2.6 |
| 2019-02-08 12:00:00 | 2.08 |
| 2019-02-08 13:00:00 | 2.34 |
| 2019-02-08 14:00:00 | 2.08 |
| 2019-02-08 15:00:00 | 1.82 |
| 2019-02-08 16:00:00 | 2.08 |
| 2019-02-08 17:00:00 | 2.6 |
| 2019-02-08 18:00:00 | 2.6 |
| 2019-02-08 19:00:00 | 2.6 |
| 2019-02-08 20:00:00 | 2.86 |
| 2019-02-08 21:00:00 | 2.86 |
| 2019-02-08 22:00:00 | 2.86 |
| 2019-02-08 23:00:00 | 2.86 |
| 2019-02-09 | 2.86 |
| 2019-02-09 01:00:00 | 2.86 |
| 2019-02-09 02:00:00 | 2.86 |
| 2019-02-09 03:00:00 | 2.86 |
| 2019-02-09 04:00:00 | 2.86 |
| 2019-02-09 05:00:00 | 2.86 |
| 2019-02-09 06:00:00 | 2.86 |
| 2019-02-09 07:00:00 | 2.6 |
| 2019-02-09 08:00:00 | 2.86 |
| 2019-02-09 09:00:00 | 2.6 |
| 2019-02-09 10:00:00 | 2.34 |
| 2019-02-09 11:00:00 | 2.08 |
| 2019-02-09 12:00:00 | 2.34 |
| 2019-02-09 13:00:00 | 2.08 |
| 2019-02-09 14:00:00 | 1.82 |
| 2019-02-09 15:00:00 | 1.82 |
| 2019-02-09 16:00:00 | 1.82 |
| 2019-02-09 17:00:00 | 2.08 |
| 2019-02-09 18:00:00 | 2.6 |
| 2019-02-09 19:00:00 | 2.34 |
| 2019-02-09 20:00:00 | 2.34 |
| 2019-02-09 21:00:00 | 2.6 |
| 2019-02-09 22:00:00 | 2.34 |
| 2019-02-09 23:00:00 | 2.6 |
| 2019-02-10 | 2.34 |
| 2019-02-10 01:00:00 | 2.6 |
| 2019-02-10 02:00:00 | 2.6 |
| 2019-02-10 03:00:00 | 2.86 |
| 2019-02-10 04:00:00 | 2.34 |
| 2019-02-10 05:00:00 | 2.6 |
| 2019-02-10 06:00:00 | 2.6 |
| 2019-02-10 07:00:00 | 2.6 |
| 2019-02-10 08:00:00 | 2.6 |
| 2019-02-10 09:00:00 | 2.34 |
| 2019-02-10 10:00:00 | 2.34 |
| 2019-02-10 11:00:00 | 1.82 |
| 2019-02-10 12:00:00 | 1.82 |
| 2019-02-10 13:00:00 | 1.82 |
| 2019-02-10 14:00:00 | 1.56 |
| 2019-02-10 15:00:00 | 1.3 |
| 2019-02-10 16:00:00 | 1.56 |
| 2019-02-10 17:00:00 | 1.82 |
| 2019-02-10 18:00:00 | 2.08 |
| 2019-02-10 19:00:00 | 2.34 |
| 2019-02-10 20:00:00 | 13.26 |
| 2019-02-10 21:00:00 | 2.08 |
| 2019-02-10 22:00:00 | 1.82 |
| 2019-02-10 23:00:00 | 2.08 |
| 2019-02-11 | 2.08 |
| 2019-02-11 01:00:00 | 2.08 |
| 2019-02-11 02:00:00 | 1.82 |
| 2019-02-11 03:00:00 | 2.08 |
| 2019-02-11 04:00:00 | 2.34 |
| 2019-02-11 05:00:00 | 2.34 |
| 2019-02-11 06:00:00 | 2.08 |
| 2019-02-11 07:00:00 | 2.6 |
| 2019-02-11 08:00:00 | 2.34 |
| 2019-02-11 09:00:00 | 2.34 |
| 2019-02-11 10:00:00 | 2.08 |
| 2019-02-11 11:00:00 | 1.82 |
| 2019-02-11 12:00:00 | 2.34 |
| 2019-02-11 13:00:00 | 2.34 |
| 2019-02-11 14:00:00 | 2.08 |
| 2019-02-11 15:00:00 | 1.82 |
| 2019-02-11 16:00:00 | 2.34 |
| 2019-02-11 17:00:00 | 2.08 |
| 2019-02-11 18:00:00 | 2.6 |
| 2019-02-11 19:00:00 | 2.34 |
| 2019-02-11 20:00:00 | 2.6 |
| 2019-02-11 21:00:00 | 2.34 |
| 2019-02-11 22:00:00 | 2.08 |
| 2019-02-11 23:00:00 | 2.6 |
| 2019-02-12 | 2.6 |
| 2019-02-12 01:00:00 | 2.6 |
| 2019-02-12 02:00:00 | 2.6 |
| 2019-02-12 03:00:00 | 2.6 |
| 2019-02-12 04:00:00 | 2.6 |
| 2019-02-12 05:00:00 | 2.6 |
| 2019-02-12 06:00:00 | 2.86 |
| 2019-02-12 07:00:00 | 2.6 |
| 2019-02-12 08:00:00 | 2.6 |
| 2019-02-12 09:00:00 | 2.86 |
| 2019-02-12 10:00:00 | 2.6 |
| 2019-02-12 11:00:00 | 2.86 |
| 2019-02-12 12:00:00 | 2.6 |
| 2019-02-12 13:00:00 | 2.6 |
| 2019-02-12 14:00:00 | 2.86 |
| 2019-02-12 15:00:00 | 2.6 |
| 2019-02-12 16:00:00 | 2.6 |
| 2019-02-12 17:00:00 | 2.6 |
| 2019-02-12 18:00:00 | 2.86 |
| 2019-02-12 19:00:00 | 2.6 |
| 2019-02-12 20:00:00 | 2.6 |
| 2019-02-12 21:00:00 | 2.86 |
| 2019-02-12 22:00:00 | 2.6 |
| 2019-02-12 23:00:00 | 2.6 |
| 2019-02-13 | 2.86 |
| 2019-02-13 01:00:00 | 2.6 |
| 2019-02-13 02:00:00 | 2.86 |
| 2019-02-13 03:00:00 | 2.86 |
| 2019-02-13 04:00:00 | 2.86 |
| 2019-02-13 05:00:00 | 2.86 |
| 2019-02-13 06:00:00 | 2.86 |
| 2019-02-13 07:00:00 | 2.86 |
| 2019-02-13 08:00:00 | 2.86 |
| 2019-02-13 09:00:00 | 2.86 |
| 2019-02-13 10:00:00 | 2.86 |
| 2019-02-13 11:00:00 | 2.6 |
| 2019-02-13 12:00:00 | 4.42 |
| 2019-02-13 13:00:00 | 3.64 |
| 2019-02-13 14:00:00 | 3.12 |
| 2019-02-13 15:00:00 | 2.08 |
| 2019-02-13 16:00:00 | 2.34 |
| 2019-02-13 17:00:00 | 2.34 |
| 2019-02-13 18:00:00 | 2.08 |
| 2019-02-13 19:00:00 | 2.6 |
| 2019-02-13 20:00:00 | 2.34 |
| 2019-02-13 21:00:00 | 2.6 |
| 2019-02-13 22:00:00 | 2.08 |
| 2019-02-13 23:00:00 | 2.34 |
| 2019-02-14 | 2.6 |
| 2019-02-14 01:00:00 | 2.6 |
| 2019-02-14 02:00:00 | 2.6 |
| 2019-02-14 03:00:00 | 2.08 |
| 2019-02-14 04:00:00 | 2.6 |
| 2019-02-14 05:00:00 | 2.34 |
| 2019-02-14 06:00:00 | 2.6 |
| 2019-02-14 07:00:00 | 2.6 |
| 2019-02-14 08:00:00 | 2.6 |
| 2019-02-14 09:00:00 | 10.92 |
| 2019-02-14 10:00:00 | 4.42 |
| 2019-02-14 11:00:00 | 2.08 |
| 2019-02-14 12:00:00 | 1.82 |
| 2019-02-14 13:00:00 | 2.08 |
| 2019-02-14 14:00:00 | 1.82 |
| 2019-02-14 15:00:00 | 2.34 |
| 2019-02-14 16:00:00 | 1.82 |
| 2019-02-14 17:00:00 | 2.34 |
| 2019-02-14 18:00:00 | 2.08 |
| 2019-02-14 19:00:00 | 2.08 |
| 2019-02-14 20:00:00 | 2.08 |
| 2019-02-14 21:00:00 | 2.34 |
| 2019-02-14 22:00:00 | 2.08 |
| 2019-02-14 23:00:00 | 2.08 |
| 2019-02-15 | 2.34 |
| 2019-02-15 01:00:00 | 2.08 |
| 2019-02-15 02:00:00 | 2.34 |
| 2019-02-15 03:00:00 | 2.6 |
| 2019-02-15 04:00:00 | 2.34 |
| 2019-02-15 05:00:00 | 2.08 |
| 2019-02-15 06:00:00 | 2.34 |
| 2019-02-15 07:00:00 | 2.6 |
| 2019-02-15 08:00:00 | 2.34 |
| 2019-02-15 09:00:00 | 2.08 |
| 2019-02-15 10:00:00 | 2.08 |
| 2019-02-15 11:00:00 | 1.82 |
| 2019-02-15 12:00:00 | 1.56 |
| 2019-02-15 13:00:00 | 1.56 |
| 2019-02-15 14:00:00 | 1.3 |
| 2019-02-15 15:00:00 | 1.04 |
| 2019-02-15 16:00:00 | 1.04 |
| 2019-02-15 17:00:00 | 1.04 |
| 2019-02-15 18:00:00 | 2.08 |
| 2019-02-15 19:00:00 | 2.08 |
| 2019-02-15 20:00:00 | 2.34 |
| 2019-02-15 21:00:00 | 2.6 |
| 2019-02-15 22:00:00 | 2.6 |
| 2019-02-15 23:00:00 | 2.6 |
| 2019-02-16 | 2.6 |
| 2019-02-16 01:00:00 | 2.6 |
| 2019-02-16 02:00:00 | 2.86 |
| 2019-02-16 03:00:00 | 2.6 |
| 2019-02-16 04:00:00 | 2.6 |
| 2019-02-16 05:00:00 | 2.86 |
| 2019-02-16 06:00:00 | 2.86 |
| 2019-02-16 07:00:00 | 2.6 |
| 2019-02-16 08:00:00 | 2.86 |
| 2019-02-16 09:00:00 | 2.86 |
| 2019-02-16 10:00:00 | 2.6 |
| 2019-02-16 11:00:00 | 1.82 |
| 2019-02-16 12:00:00 | 1.82 |
| 2019-02-16 13:00:00 | 1.56 |
| 2019-02-16 14:00:00 | 1.3 |
| 2019-02-16 15:00:00 | 0.78 |
| 2019-02-16 16:00:00 | 0.78 |
| 2019-02-16 17:00:00 | 0.78 |
| 2019-02-16 18:00:00 | 1.56 |
| 2019-02-16 19:00:00 | 2.08 |
| 2019-02-16 20:00:00 | 2.34 |
| 2019-02-16 21:00:00 | 2.34 |
| 2019-02-16 22:00:00 | 2.6 |
| 2019-02-16 23:00:00 | 2.6 |
| 2019-02-17 | 2.6 |
| 2019-02-17 01:00:00 | 2.6 |
| 2019-02-17 02:00:00 | 2.6 |
| 2019-02-17 03:00:00 | 2.86 |
| 2019-02-17 04:00:00 | 2.6 |
| 2019-02-17 05:00:00 | 2.6 |
| 2019-02-17 06:00:00 | 2.86 |
| 2019-02-17 07:00:00 | 2.6 |
| 2019-02-17 08:00:00 | 2.6 |
| 2019-02-17 09:00:00 | 2.6 |
| 2019-02-17 10:00:00 | 2.08 |
| 2019-02-17 11:00:00 | 1.82 |
| 2019-02-17 12:00:00 | 1.56 |
| 2019-02-17 13:00:00 | 1.04 |
| 2019-02-17 14:00:00 | 0.78 |
| 2019-02-17 15:00:00 | 0.26 |
| 2019-02-17 16:00:00 | 0 |
| 2019-02-17 17:00:00 | 0.52 |
| 2019-02-17 18:00:00 | 1.04 |
| 2019-02-17 19:00:00 | 1.82 |
| 2019-02-17 20:00:00 | 2.34 |
| 2019-02-17 21:00:00 | 2.34 |
| 2019-02-17 22:00:00 | 2.6 |
| 2019-02-17 23:00:00 | 2.6 |
| 2019-02-18 | 2.6 |
| 2019-02-18 01:00:00 | 2.86 |
| 2019-02-18 02:00:00 | 2.6 |
| 2019-02-18 03:00:00 | 2.86 |
| 2019-02-18 04:00:00 | 2.86 |
| 2019-02-18 05:00:00 | 2.6 |
| 2019-02-18 06:00:00 | 2.86 |
| 2019-02-18 07:00:00 | 2.6 |
| 2019-02-18 08:00:00 | 3.38 |
| 2019-02-18 09:00:00 | 13.52 |
| 2019-02-18 10:00:00 | 2.08 |
| 2019-02-18 11:00:00 | 1.82 |
| 2019-02-18 12:00:00 | 1.56 |
| 2019-02-18 13:00:00 | 1.3 |
| 2019-02-18 14:00:00 | 0.78 |
| 2019-02-18 15:00:00 | 0.26 |
| 2019-02-18 16:00:00 | 0 |
| 2019-02-18 17:00:00 | 0.78 |
| 2019-02-18 18:00:00 | 1.3 |
| 2019-02-18 19:00:00 | 1.56 |
| 2019-02-18 20:00:00 | 2.34 |
| 2019-02-18 21:00:00 | 2.34 |
| 2019-02-18 22:00:00 | 2.34 |
| 2019-02-18 23:00:00 | 2.08 |
| 2019-02-19 | 2.34 |
| 2019-02-19 01:00:00 | 2.6 |
| 2019-02-19 02:00:00 | 2.6 |
| 2019-02-19 03:00:00 | 1.82 |
| 2019-02-19 04:00:00 | 2.08 |
| 2019-02-19 05:00:00 | 2.6 |
| 2019-02-19 06:00:00 | 2.34 |
| 2019-02-19 07:00:00 | 2.6 |
| 2019-02-19 08:00:00 | 1.82 |
| 2019-02-19 09:00:00 | 1.82 |
| 2019-02-19 10:00:00 | 1.56 |
| 2019-02-19 11:00:00 | 1.3 |
| 2019-02-19 12:00:00 | 1.04 |
| 2019-02-19 13:00:00 | 0.52 |
| 2019-02-19 14:00:00 | 0.26 |
| 2019-02-19 15:00:00 | 0.52 |
| 2019-02-19 16:00:00 | 0.26 |
| 2019-02-19 17:00:00 | 0.78 |
| 2019-02-19 18:00:00 | 1.04 |
| 2019-02-19 19:00:00 | 1.3 |
| 2019-02-19 20:00:00 | 1.82 |
| 2019-02-19 21:00:00 | 1.82 |
| 2019-02-19 22:00:00 | 2.34 |
| 2019-02-19 23:00:00 | 2.08 |
| 2019-02-20 | 2.34 |
| 2019-02-20 01:00:00 | 2.34 |
| 2019-02-20 02:00:00 | 2.34 |
| 2019-02-20 03:00:00 | 2.34 |
| 2019-02-20 04:00:00 | 2.6 |
| 2019-02-20 05:00:00 | 2.86 |
| 2019-02-20 06:00:00 | 2.6 |
| 2019-02-20 07:00:00 | 2.6 |
| 2019-02-20 08:00:00 | 2.6 |
| 2019-02-20 09:00:00 | 2.6 |
| 2019-02-20 10:00:00 | 2.34 |
| 2019-02-20 11:00:00 | 1.82 |
| 2019-02-20 12:00:00 | 1.56 |
| 2019-02-20 13:00:00 | 1.82 |
| 2019-02-20 14:00:00 | 1.82 |
| 2019-02-20 15:00:00 | 1.82 |
| 2019-02-20 16:00:00 | 1.56 |
| 2019-02-20 17:00:00 | 2.08 |
| 2019-02-20 18:00:00 | 1.82 |
| 2019-02-20 19:00:00 | 2.08 |
| 2019-02-20 20:00:00 | 2.08 |
| 2019-02-20 21:00:00 | 2.34 |
| 2019-02-20 22:00:00 | 2.6 |
| 2019-02-20 23:00:00 | 2.34 |
| 2019-02-21 | 2.08 |
| 2019-02-21 01:00:00 | 2.34 |
| 2019-02-21 02:00:00 | 2.08 |
| 2019-02-21 03:00:00 | 2.08 |
| 2019-02-21 04:00:00 | 2.34 |
| 2019-02-21 05:00:00 | 2.08 |
| 2019-02-21 06:00:00 | 2.08 |
| 2019-02-21 07:00:00 | 2.34 |
| 2019-02-21 08:00:00 | 2.6 |
| 2019-02-21 09:00:00 | 2.34 |
| 2019-02-21 10:00:00 | 1.82 |
| 2019-02-21 11:00:00 | 2.34 |
| 2019-02-21 12:00:00 | 1.82 |
| 2019-02-21 13:00:00 | 1.3 |
| 2019-02-21 14:00:00 | 1.04 |
| 2019-02-21 15:00:00 | 1.04 |
| 2019-02-21 16:00:00 | 1.04 |
| 2019-02-21 17:00:00 | 1.56 |
| 2019-02-21 18:00:00 | 1.56 |
| 2019-02-21 19:00:00 | 2.08 |
| 2019-02-21 20:00:00 | 1.56 |
| 2019-02-21 21:00:00 | 2.08 |
| 2019-02-21 22:00:00 | 2.08 |
| 2019-02-21 23:00:00 | 1.82 |
| 2019-02-22 | 2.08 |
| 2019-02-22 01:00:00 | 2.08 |
| 2019-02-22 02:00:00 | 1.82 |
| 2019-02-22 03:00:00 | 2.08 |
| 2019-02-22 04:00:00 | 1.82 |
| 2019-02-22 05:00:00 | 2.08 |
| 2019-02-22 06:00:00 | 1.82 |
| 2019-02-22 07:00:00 | 2.34 |
| 2019-02-22 08:00:00 | 2.08 |
| 2019-02-22 09:00:00 | 2.6 |
| 2019-02-22 10:00:00 | 2.6 |
| 2019-02-22 11:00:00 | 2.6 |
| 2019-02-22 12:00:00 | 13.52 |
| 2019-02-22 13:00:00 | 2.34 |
| 2019-02-22 14:00:00 | 2.08 |
| 2019-02-22 15:00:00 | 2.08 |
| 2019-02-22 16:00:00 | 2.34 |
| 2019-02-22 17:00:00 | 2.6 |
| 2019-02-22 18:00:00 | 2.6 |
| 2019-02-22 19:00:00 | 2.86 |
| 2019-02-22 20:00:00 | 2.86 |
| 2019-02-22 21:00:00 | 3.12 |
| 2019-02-22 22:00:00 | 2.86 |
| 2019-02-22 23:00:00 | 3.12 |
| 2019-02-23 | 2.86 |
| 2019-02-23 01:00:00 | 3.12 |
| 2019-02-23 02:00:00 | 3.12 |
| 2019-02-23 03:00:00 | 2.86 |
| 2019-02-23 04:00:00 | 3.12 |
| 2019-02-23 05:00:00 | 3.12 |
| 2019-02-23 06:00:00 | 3.12 |
| 2019-02-23 07:00:00 | 3.12 |
| 2019-02-23 08:00:00 | 3.38 |
| 2019-02-23 09:00:00 | 3.38 |
| 2019-02-23 10:00:00 | 3.12 |
| 2019-02-23 11:00:00 | 2.86 |
| 2019-02-23 12:00:00 | 2.86 |
| 2019-02-23 13:00:00 | 2.6 |
| 2019-02-23 14:00:00 | 2.6 |
| 2019-02-23 15:00:00 | 2.34 |
| 2019-02-23 16:00:00 | 2.34 |
| 2019-02-23 17:00:00 | 2.6 |
| 2019-02-23 18:00:00 | 2.86 |
| 2019-02-23 19:00:00 | 2.6 |
| 2019-02-23 20:00:00 | 2.86 |
| 2019-02-23 21:00:00 | 2.86 |
| 2019-02-23 22:00:00 | 2.86 |
| 2019-02-23 23:00:00 | 2.86 |
| 2019-02-24 | 3.38 |
| 2019-02-24 01:00:00 | 3.38 |
| 2019-02-24 02:00:00 | 3.9 |
| 2019-02-24 03:00:00 | 3.64 |
| 2019-02-24 04:00:00 | 4.16 |
| 2019-02-24 05:00:00 | 4.42 |
| 2019-02-24 06:00:00 | 4.16 |
| 2019-02-24 07:00:00 | 4.16 |
| 2019-02-24 08:00:00 | 4.42 |
| 2019-02-24 09:00:00 | 4.16 |
| 2019-02-24 10:00:00 | 4.16 |
| 2019-02-24 11:00:00 | 4.16 |
| 2019-02-24 12:00:00 | 4.16 |
| 2019-02-24 13:00:00 | 3.9 |
| 2019-02-24 14:00:00 | 3.9 |
| 2019-02-24 15:00:00 | 3.64 |
| 2019-02-24 16:00:00 | 3.38 |
| 2019-02-24 17:00:00 | 3.38 |
| 2019-02-24 18:00:00 | 3.64 |
| 2019-02-24 19:00:00 | 3.38 |
| 2019-02-24 20:00:00 | 3.38 |
| 2019-02-24 21:00:00 | 3.64 |
| 2019-02-24 22:00:00 | 3.9 |
| 2019-02-24 23:00:00 | 3.64 |
| 2019-02-25 | 3.64 |
| 2019-02-25 01:00:00 | 3.64 |
| 2019-02-25 02:00:00 | 3.64 |
| 2019-02-25 03:00:00 | 3.64 |
| 2019-02-25 04:00:00 | 3.64 |
| 2019-02-25 05:00:00 | 3.9 |
| 2019-02-25 06:00:00 | 3.64 |
| 2019-02-25 07:00:00 | 3.9 |
| 2019-02-25 08:00:00 | 3.9 |
| 2019-02-25 09:00:00 | 3.64 |
| 2019-02-25 10:00:00 | 3.38 |
| 2019-02-25 11:00:00 | 2.08 |
| 2019-02-25 12:00:00 | 1.82 |
| 2019-02-25 13:00:00 | 1.82 |
| 2019-02-25 14:00:00 | 1.56 |
| 2019-02-25 15:00:00 | 1.3 |
| 2019-02-25 16:00:00 | 1.3 |
| 2019-02-25 17:00:00 | 1.04 |
| 2019-02-25 18:00:00 | 1.82 |
| 2019-02-25 19:00:00 | 2.08 |
| 2019-02-25 20:00:00 | 2.6 |
| 2019-02-25 21:00:00 | 2.34 |
| 2019-02-25 22:00:00 | 2.6 |
| 2019-02-25 23:00:00 | 2.6 |
| 2019-02-26 | 2.6 |
| 2019-02-26 01:00:00 | 2.86 |
| 2019-02-26 02:00:00 | 2.6 |
| 2019-02-26 03:00:00 | 3.12 |
| 2019-02-26 04:00:00 | 2.86 |
| 2019-02-26 05:00:00 | 3.12 |
| 2019-02-26 06:00:00 | 2.86 |
| 2019-02-26 07:00:00 | 2.08 |
| 2019-02-26 08:00:00 | 2.6 |
| 2019-02-26 09:00:00 | 2.08 |
| 2019-02-26 10:00:00 | 2.08 |
| 2019-02-26 11:00:00 | 2.34 |
| 2019-02-26 12:00:00 | 2.08 |
| 2019-02-26 13:00:00 | 2.08 |
| 2019-02-26 14:00:00 | 1.82 |
| 2019-02-26 15:00:00 | 11.96 |
| 2019-02-26 16:00:00 | 2.6 |
| 2019-02-26 17:00:00 | 2.08 |
| 2019-02-26 18:00:00 | 1.82 |
| 2019-02-26 19:00:00 | 1.82 |
| 2019-02-26 20:00:00 | 2.34 |
| 2019-02-26 21:00:00 | 2.08 |
| 2019-02-26 22:00:00 | 2.34 |
| 2019-02-26 23:00:00 | 2.6 |
| 2019-02-27 | 2.34 |
| 2019-02-27 01:00:00 | 2.6 |
| 2019-02-27 02:00:00 | 2.6 |
| 2019-02-27 03:00:00 | 2.6 |
| 2019-02-27 04:00:00 | 2.6 |
| 2019-02-27 05:00:00 | 2.34 |
| 2019-02-27 06:00:00 | 2.08 |
| 2019-02-27 07:00:00 | 2.6 |
| 2019-02-27 08:00:00 | 2.34 |
| 2019-02-27 09:00:00 | 2.08 |
| 2019-02-27 10:00:00 | 2.08 |
| 2019-02-27 11:00:00 | 1.82 |
| 2019-02-27 12:00:00 | 3.64 |
| 2019-02-27 13:00:00 | 1.56 |
| 2019-02-27 14:00:00 | 1.56 |
| 2019-02-27 15:00:00 | 1.04 |
| 2019-02-27 16:00:00 | 1.3 |
| 2019-02-27 17:00:00 | 1.04 |
| 2019-02-27 18:00:00 | 1.56 |
| 2019-02-27 19:00:00 | 2.08 |
| 2019-02-27 20:00:00 | 1.82 |
| 2019-02-27 21:00:00 | 2.08 |
| 2019-02-27 22:00:00 | 2.08 |
| 2019-02-27 23:00:00 | 2.08 |
| 2019-02-28 | 2.34 |
| 2019-02-28 01:00:00 | 2.34 |
| 2019-02-28 02:00:00 | 2.34 |
| 2019-02-28 03:00:00 | 2.34 |
| 2019-02-28 04:00:00 | 2.08 |
| 2019-02-28 05:00:00 | 2.6 |
| 2019-02-28 06:00:00 | 2.08 |
| 2019-02-28 07:00:00 | 2.6 |
| 2019-02-28 08:00:00 | 2.34 |
| 2019-02-28 09:00:00 | 2.08 |
| 2019-02-28 10:00:00 | 1.82 |
| 2019-02-28 11:00:00 | 1.82 |
| 2019-02-28 12:00:00 | 1.04 |
| 2019-02-28 13:00:00 | 0.52 |
| 2019-02-28 14:00:00 | 0 |
| 2019-02-28 15:00:00 | 0.26 |
| 2019-02-28 16:00:00 | 0.26 |
| 2019-02-28 17:00:00 | 0.26 |
| 2019-02-28 18:00:00 | 0.52 |
| 2019-02-28 19:00:00 | 1.04 |
| 2019-02-28 20:00:00 | 1.56 |
| 2019-02-28 21:00:00 | 1.82 |
| 2019-02-28 22:00:00 | 2.08 |
| 2019-02-28 23:00:00 | 2.08 |
| 2019-03-01 | 2.34 |
| 2019-03-01 01:00:00 | 2.08 |
| 2019-03-01 02:00:00 | 2.08 |
| 2019-03-01 03:00:00 | 1.82 |
| 2019-03-01 04:00:00 | 2.08 |
| 2019-03-01 05:00:00 | 2.08 |
| 2019-03-01 06:00:00 | 2.08 |
| 2019-03-01 07:00:00 | 2.08 |
| 2019-03-01 08:00:00 | 2.08 |
| 2019-03-01 09:00:00 | 2.08 |
| 2019-03-01 10:00:00 | 1.82 |
| 2019-03-01 11:00:00 | 1.82 |
| 2019-03-01 12:00:00 | 1.82 |
| 2019-03-01 13:00:00 | 1.82 |
| 2019-03-01 14:00:00 | 1.56 |
| 2019-03-01 15:00:00 | 2.08 |
| 2019-03-01 16:00:00 | 1.56 |
| 2019-03-01 17:00:00 | 1.82 |
| 2019-03-01 18:00:00 | 2.08 |
| 2019-03-01 19:00:00 | 1.82 |
| 2019-03-01 20:00:00 | 2.08 |
| 2019-03-01 21:00:00 | 2.08 |
| 2019-03-01 22:00:00 | 1.82 |
| 2019-03-01 23:00:00 | 2.08 |
| 2019-03-02 | 1.82 |
| 2019-03-02 01:00:00 | 2.08 |
| 2019-03-02 02:00:00 | 2.34 |
| 2019-03-02 03:00:00 | 2.08 |
| 2019-03-02 04:00:00 | 2.08 |
| 2019-03-02 05:00:00 | 2.34 |
| 2019-03-02 06:00:00 | 2.34 |
| 2019-03-02 07:00:00 | 2.34 |
| 2019-03-02 08:00:00 | 2.08 |
| 2019-03-02 09:00:00 | 2.34 |
| 2019-03-02 10:00:00 | 2.08 |
| 2019-03-02 11:00:00 | 2.34 |
| 2019-03-02 12:00:00 | 2.08 |
| 2019-03-02 13:00:00 | 2.08 |
| 2019-03-02 14:00:00 | 2.08 |
| 2019-03-02 15:00:00 | 2.08 |
| 2019-03-02 16:00:00 | 1.82 |
| 2019-03-02 17:00:00 | 2.34 |
| 2019-03-02 18:00:00 | 1.82 |
| 2019-03-02 19:00:00 | 2.08 |
| 2019-03-02 20:00:00 | 2.08 |
| 2019-03-02 21:00:00 | 2.34 |
| 2019-03-02 22:00:00 | 2.08 |
| 2019-03-02 23:00:00 | 2.08 |
| 2019-03-03 | 2.08 |
| 2019-03-03 01:00:00 | 2.08 |
| 2019-03-03 02:00:00 | 2.34 |
| 2019-03-03 03:00:00 | 2.08 |
| 2019-03-03 04:00:00 | 2.08 |
| 2019-03-03 05:00:00 | 2.08 |
| 2019-03-03 06:00:00 | 2.08 |
| 2019-03-03 07:00:00 | 2.08 |
| 2019-03-03 08:00:00 | 1.82 |
| 2019-03-03 09:00:00 | 2.34 |
| 2019-03-03 10:00:00 | 1.56 |
| 2019-03-03 11:00:00 | 1.82 |
| 2019-03-03 12:00:00 | 1.3 |
| 2019-03-03 13:00:00 | 1.3 |
| 2019-03-03 14:00:00 | 1.04 |
| 2019-03-03 15:00:00 | 0.78 |
| 2019-03-03 16:00:00 | 0.52 |
| 2019-03-03 17:00:00 | 0.78 |
| 2019-03-03 18:00:00 | 6.5 |
| 2019-03-03 19:00:00 | 6.5 |
| 2019-03-03 20:00:00 | 1.3 |
| 2019-03-03 21:00:00 | 1.56 |
| 2019-03-03 22:00:00 | 1.56 |
| 2019-03-03 23:00:00 | 1.82 |
| 2019-03-04 | 1.56 |
| 2019-03-04 01:00:00 | 1.56 |
| 2019-03-04 02:00:00 | 1.82 |
| 2019-03-04 03:00:00 | 1.56 |
| 2019-03-04 04:00:00 | 1.82 |
| 2019-03-04 05:00:00 | 1.56 |
| 2019-03-04 06:00:00 | 1.56 |
| 2019-03-04 07:00:00 | 1.56 |
| 2019-03-04 08:00:00 | 1.82 |
| 2019-03-04 09:00:00 | 1.82 |
| 2019-03-04 10:00:00 | 1.04 |
| 2019-03-04 11:00:00 | 1.04 |
| 2019-03-04 12:00:00 | 0.52 |
| 2019-03-04 13:00:00 | 0 |
| 2019-03-04 14:00:00 | 0.52 |
| 2019-03-04 15:00:00 | 0 |
| 2019-03-04 16:00:00 | 0.52 |
| 2019-03-04 17:00:00 | 0.26 |
| 2019-03-04 18:00:00 | 0.52 |
| 2019-03-04 19:00:00 | 0.52 |
| 2019-03-04 20:00:00 | 1.04 |
| 2019-03-04 21:00:00 | 1.3 |
| 2019-03-04 22:00:00 | 1.56 |
| 2019-03-04 23:00:00 | 1.56 |
| 2019-03-05 | 1.82 |
| 2019-03-05 01:00:00 | 1.82 |
| 2019-03-05 02:00:00 | 1.56 |
| 2019-03-05 03:00:00 | 2.08 |
| 2019-03-05 04:00:00 | 1.56 |
| 2019-03-05 05:00:00 | 2.08 |
| 2019-03-05 06:00:00 | 1.82 |
| 2019-03-05 07:00:00 | 2.08 |
| 2019-03-05 08:00:00 | 1.82 |
| 2019-03-05 09:00:00 | 1.56 |
| 2019-03-05 10:00:00 | 1.56 |
| 2019-03-05 11:00:00 | 1.56 |
| 2019-03-05 12:00:00 | 1.3 |
| 2019-03-05 13:00:00 | 1.3 |
| 2019-03-05 14:00:00 | 1.04 |
| 2019-03-05 15:00:00 | 0.78 |
| 2019-03-05 16:00:00 | 1.04 |
| 2019-03-05 17:00:00 | 0.52 |
| 2019-03-05 18:00:00 | 1.04 |
| 2019-03-05 19:00:00 | 1.56 |
| 2019-03-05 20:00:00 | 1.56 |
| 2019-03-05 21:00:00 | 1.82 |
| 2019-03-05 22:00:00 | 1.82 |
| 2019-03-05 23:00:00 | 1.82 |
| 2019-03-06 | 2.08 |
| 2019-03-06 01:00:00 | 2.08 |
| 2019-03-06 02:00:00 | 2.08 |
| 2019-03-06 03:00:00 | 2.34 |
| 2019-03-06 04:00:00 | 2.08 |
| 2019-03-06 05:00:00 | 2.08 |
| 2019-03-06 06:00:00 | 2.08 |
| 2019-03-06 07:00:00 | 2.08 |
| 2019-03-06 08:00:00 | 1.82 |
| 2019-03-06 09:00:00 | 2.08 |
| 2019-03-06 10:00:00 | 1.82 |
| 2019-03-06 11:00:00 | 2.86 |
| 2019-03-06 12:00:00 | 2.86 |
| 2019-03-06 13:00:00 | 1.56 |
| 2019-03-06 14:00:00 | 1.3 |
| 2019-03-06 15:00:00 | 1.04 |
| 2019-03-06 16:00:00 | 1.04 |
| 2019-03-06 17:00:00 | 1.04 |
| 2019-03-06 18:00:00 | 1.3 |
| 2019-03-06 19:00:00 | 1.56 |
| 2019-03-06 20:00:00 | 1.82 |
| 2019-03-06 21:00:00 | 1.82 |
| 2019-03-06 22:00:00 | 1.82 |
| 2019-03-06 23:00:00 | 2.08 |
| 2019-03-07 | 2.08 |
| 2019-03-07 01:00:00 | 2.08 |
| 2019-03-07 02:00:00 | 1.82 |
| 2019-03-07 03:00:00 | 1.82 |
| 2019-03-07 04:00:00 | 1.82 |
| 2019-03-07 05:00:00 | 1.82 |
| 2019-03-07 06:00:00 | 1.82 |
| 2019-03-07 07:00:00 | 1.56 |
| 2019-03-07 08:00:00 | 1.56 |
| 2019-03-07 09:00:00 | 1.56 |
| 2019-03-07 10:00:00 | 1.04 |
| 2019-03-07 11:00:00 | 0.78 |
| 2019-03-07 12:00:00 | 0.52 |
| 2019-03-07 13:00:00 | 0.52 |
| 2019-03-07 14:00:00 | 0 |
| 2019-03-07 15:00:00 | 0.52 |
| 2019-03-07 16:00:00 | 0 |
| 2019-03-07 17:00:00 | 0.52 |
| 2019-03-07 18:00:00 | 0.26 |
| 2019-03-07 19:00:00 | 11.7 |
| 2019-03-07 20:00:00 | 0.52 |
| 2019-03-07 21:00:00 | 0.78 |
| 2019-03-07 22:00:00 | 1.04 |
| 2019-03-07 23:00:00 | 1.04 |
| 2019-03-08 | 1.3 |
| 2019-03-08 01:00:00 | 1.56 |
| 2019-03-08 02:00:00 | 1.56 |
| 2019-03-08 03:00:00 | 1.56 |
| 2019-03-08 04:00:00 | 1.82 |
| 2019-03-08 05:00:00 | 1.56 |
| 2019-03-08 06:00:00 | 1.56 |
| 2019-03-08 07:00:00 | 1.56 |
| 2019-03-08 08:00:00 | 1.82 |
| 2019-03-08 09:00:00 | 1.3 |
| 2019-03-08 10:00:00 | 1.3 |
| 2019-03-08 11:00:00 | 0.52 |
| 2019-03-08 12:00:00 | 0.52 |
| 2019-03-08 13:00:00 | 0 |
| 2019-03-08 14:00:00 | 0.26 |
| 2019-03-08 15:00:00 | 0.52 |
| 2019-03-08 16:00:00 | 0.26 |
| 2019-03-08 17:00:00 | 0.26 |
| 2019-03-08 18:00:00 | 0.52 |
| 2019-03-08 19:00:00 | 1.04 |
| 2019-03-08 20:00:00 | 1.04 |
| 2019-03-08 21:00:00 | 1.82 |
| 2019-03-08 22:00:00 | 1.82 |
| 2019-03-08 23:00:00 | 1.82 |
| 2019-03-09 | 2.08 |
| 2019-03-09 01:00:00 | 1.82 |
| 2019-03-09 02:00:00 | 2.08 |
| 2019-03-09 03:00:00 | 2.08 |
| 2019-03-09 04:00:00 | 2.08 |
| 2019-03-09 05:00:00 | 1.82 |
| 2019-03-09 06:00:00 | 2.08 |
| 2019-03-09 07:00:00 | 1.82 |
| 2019-03-09 08:00:00 | 1.82 |
| 2019-03-09 09:00:00 | 1.56 |
| 2019-03-09 10:00:00 | 1.56 |
| 2019-03-09 11:00:00 | 1.3 |
| 2019-03-09 12:00:00 | 1.04 |
| 2019-03-09 13:00:00 | 1.3 |
| 2019-03-09 14:00:00 | 1.04 |
| 2019-03-09 15:00:00 | 0.52 |
| 2019-03-09 16:00:00 | 0.52 |
| 2019-03-09 17:00:00 | 0.26 |
| 2019-03-09 18:00:00 | 0.52 |
| 2019-03-09 19:00:00 | 0.78 |
| 2019-03-09 20:00:00 | 1.3 |
| 2019-03-09 21:00:00 | 1.3 |
| 2019-03-09 22:00:00 | 1.3 |
| 2019-03-09 23:00:00 | 1.82 |
| 2019-03-10 | 1.56 |
| 2019-03-10 01:00:00 | 1.56 |
| 2019-03-10 02:00:00 | 1.82 |
| 2019-03-10 03:00:00 | 1.56 |
| 2019-03-10 04:00:00 | 2.08 |
| 2019-03-10 05:00:00 | 1.82 |
| 2019-03-10 06:00:00 | 2.08 |
| 2019-03-10 07:00:00 | 1.82 |
| 2019-03-10 08:00:00 | 1.82 |
| 2019-03-10 09:00:00 | 1.56 |
| 2019-03-10 10:00:00 | 1.56 |
| 2019-03-10 11:00:00 | 1.56 |
| 2019-03-10 12:00:00 | 1.56 |
| 2019-03-10 13:00:00 | 1.3 |
| 2019-03-10 14:00:00 | 1.3 |
| 2019-03-10 15:00:00 | 1.56 |
| 2019-03-10 16:00:00 | 1.56 |
| 2019-03-10 17:00:00 | 1.3 |
| 2019-03-10 18:00:00 | 1.3 |
| 2019-03-10 19:00:00 | 1.3 |
| 2019-03-10 20:00:00 | 1.56 |
| 2019-03-10 21:00:00 | 1.56 |
| 2019-03-10 22:00:00 | 1.3 |
| 2019-03-10 23:00:00 | 1.3 |
| 2019-03-11 | 1.3 |
| 2019-03-11 01:00:00 | 1.3 |
| 2019-03-11 02:00:00 | 1.56 |
| 2019-03-11 03:00:00 | 1.82 |
| 2019-03-11 04:00:00 | 1.82 |
| 2019-03-11 05:00:00 | 1.56 |
| 2019-03-11 06:00:00 | 2.08 |
| 2019-03-11 07:00:00 | 1.82 |
| 2019-03-11 08:00:00 | 1.82 |
| 2019-03-11 09:00:00 | 1.82 |
| 2019-03-11 10:00:00 | 1.82 |
| 2019-03-11 11:00:00 | 1.56 |
| 2019-03-11 12:00:00 | 1.3 |
| 2019-03-11 13:00:00 | 1.56 |
| 2019-03-11 14:00:00 | 1.3 |
| 2019-03-11 15:00:00 | 1.04 |
| 2019-03-11 16:00:00 | 1.56 |
| 2019-03-11 17:00:00 | 1.56 |
| 2019-03-11 18:00:00 | 12.74 |
| 2019-03-11 19:00:00 | 1.82 |
| 2019-03-11 20:00:00 | 1.82 |
| 2019-03-11 21:00:00 | 2.08 |
| 2019-03-11 22:00:00 | 2.08 |
| 2019-03-11 23:00:00 | 2.08 |
| 2019-03-12 | 2.08 |
| 2019-03-12 01:00:00 | 2.08 |
| 2019-03-12 02:00:00 | 1.82 |
| 2019-03-12 03:00:00 | 2.08 |
| 2019-03-12 04:00:00 | 2.08 |
| 2019-03-12 05:00:00 | 2.08 |
| 2019-03-12 06:00:00 | 2.08 |
| 2019-03-12 07:00:00 | 2.08 |
| 2019-03-12 08:00:00 | 2.08 |
| 2019-03-12 09:00:00 | 2.08 |
| 2019-03-12 10:00:00 | 1.82 |
| 2019-03-12 11:00:00 | 2.86 |
| 2019-03-12 12:00:00 | 2.86 |
| 2019-03-12 13:00:00 | 2.08 |
| 2019-03-12 14:00:00 | 1.56 |
| 2019-03-12 15:00:00 | 1.56 |
| 2019-03-12 16:00:00 | 1.56 |
| 2019-03-12 17:00:00 | 1.82 |
| 2019-03-12 18:00:00 | 1.56 |
| 2019-03-12 19:00:00 | 2.34 |
| 2019-03-12 20:00:00 | 2.34 |
| 2019-03-12 21:00:00 | 2.34 |
| 2019-03-12 22:00:00 | 2.6 |
| 2019-03-12 23:00:00 | 2.6 |
| 2019-03-13 | 2.08 |
| 2019-03-13 01:00:00 | 2.08 |
| 2019-03-13 02:00:00 | 2.08 |
| 2019-03-13 03:00:00 | 2.08 |
| 2019-03-13 04:00:00 | 1.82 |
| 2019-03-13 05:00:00 | 2.08 |
| 2019-03-13 06:00:00 | 2.08 |
| 2019-03-13 07:00:00 | 1.82 |
| 2019-03-13 08:00:00 | 1.82 |
| 2019-03-13 09:00:00 | 1.56 |
| 2019-03-13 10:00:00 | 2.08 |
| 2019-03-13 11:00:00 | 1.82 |
| 2019-03-13 12:00:00 | 1.56 |
| 2019-03-13 13:00:00 | 1.56 |
| 2019-03-13 14:00:00 | 1.04 |
| 2019-03-13 15:00:00 | 0.78 |
| 2019-03-13 16:00:00 | 0.78 |
| 2019-03-13 17:00:00 | 1.04 |
| 2019-03-13 18:00:00 | 1.3 |
| 2019-03-13 19:00:00 | 1.3 |
| 2019-03-13 20:00:00 | 1.56 |
| 2019-03-13 21:00:00 | 1.82 |
| 2019-03-13 22:00:00 | 2.08 |
| 2019-03-13 23:00:00 | 2.08 |
| 2019-03-14 | 1.82 |
| 2019-03-14 01:00:00 | 2.08 |
| 2019-03-14 02:00:00 | 2.08 |
| 2019-03-14 03:00:00 | 2.08 |
| 2019-03-14 04:00:00 | 2.08 |
| 2019-03-14 05:00:00 | 1.82 |
| 2019-03-14 06:00:00 | 2.08 |
| 2019-03-14 07:00:00 | 2.08 |
| 2019-03-14 08:00:00 | 2.08 |
| 2019-03-14 09:00:00 | 1.82 |
| 2019-03-14 10:00:00 | 1.82 |
| 2019-03-14 11:00:00 | 1.56 |
| 2019-03-14 12:00:00 | 1.3 |
| 2019-03-14 13:00:00 | 1.3 |
| 2019-03-14 14:00:00 | 1.04 |
| 2019-03-14 15:00:00 | 0.52 |
| 2019-03-14 16:00:00 | 0.78 |
| 2019-03-14 17:00:00 | 0.78 |
| 2019-03-14 18:00:00 | 0.78 |
| 2019-03-14 19:00:00 | 1.3 |
| 2019-03-14 20:00:00 | 1.82 |
| 2019-03-14 21:00:00 | 1.82 |
| 2019-03-14 22:00:00 | 1.82 |
| 2019-03-14 23:00:00 | 2.08 |
| 2019-03-15 | 1.82 |
| 2019-03-15 01:00:00 | 1.82 |
| 2019-03-15 02:00:00 | 2.08 |
| 2019-03-15 03:00:00 | 1.82 |
| 2019-03-15 04:00:00 | 1.82 |
| 2019-03-15 05:00:00 | 1.82 |
| 2019-03-15 06:00:00 | 1.82 |
| 2019-03-15 07:00:00 | 1.82 |
| 2019-03-15 08:00:00 | 1.82 |
| 2019-03-15 09:00:00 | 1.82 |
| 2019-03-15 10:00:00 | 1.56 |
| 2019-03-15 11:00:00 | 1.56 |
| 2019-03-15 12:00:00 | 1.3 |
| 2019-03-15 13:00:00 | 1.3 |
| 2019-03-15 14:00:00 | 1.3 |
| 2019-03-15 15:00:00 | 1.04 |
| 2019-03-15 16:00:00 | 0.78 |
| 2019-03-15 17:00:00 | 0.78 |
| 2019-03-15 18:00:00 | 1.04 |
| 2019-03-15 19:00:00 | 1.04 |
| 2019-03-15 20:00:00 | 1.56 |
| 2019-03-15 21:00:00 | 1.3 |
| 2019-03-15 22:00:00 | 12.48 |
| 2019-03-15 23:00:00 | 1.56 |
| 2019-03-16 | 1.56 |
| 2019-03-16 01:00:00 | 1.82 |
| 2019-03-16 02:00:00 | 1.56 |
| 2019-03-16 03:00:00 | 1.82 |
| 2019-03-16 04:00:00 | 1.82 |
| 2019-03-16 05:00:00 | 1.82 |
| 2019-03-16 06:00:00 | 2.08 |
| 2019-03-16 07:00:00 | 1.56 |
| 2019-03-16 08:00:00 | 1.82 |
| 2019-03-16 09:00:00 | 1.82 |
| 2019-03-16 10:00:00 | 1.56 |
| 2019-03-16 11:00:00 | 1.82 |
| 2019-03-16 12:00:00 | 1.3 |
| 2019-03-16 13:00:00 | 1.56 |
| 2019-03-16 14:00:00 | 1.3 |
| 2019-03-16 15:00:00 | 1.04 |
| 2019-03-16 16:00:00 | 1.04 |
| 2019-03-16 17:00:00 | 1.04 |
| 2019-03-16 18:00:00 | 1.3 |
| 2019-03-16 19:00:00 | 1.3 |
| 2019-03-16 20:00:00 | 1.56 |
| 2019-03-16 21:00:00 | 1.82 |
| 2019-03-16 22:00:00 | 1.56 |
| 2019-03-16 23:00:00 | 1.82 |
| 2019-03-17 | 1.56 |
| 2019-03-17 01:00:00 | 1.56 |
| 2019-03-17 02:00:00 | 1.82 |
| 2019-03-17 03:00:00 | 1.82 |
| 2019-03-17 04:00:00 | 1.56 |
| 2019-03-17 05:00:00 | 1.82 |
| 2019-03-17 06:00:00 | 1.82 |
| 2019-03-17 07:00:00 | 1.82 |
| 2019-03-17 08:00:00 | 1.82 |
| 2019-03-17 09:00:00 | 1.56 |
| 2019-03-17 10:00:00 | 1.04 |
| 2019-03-17 11:00:00 | 0.52 |
| 2019-03-17 12:00:00 | 0.26 |
| 2019-03-17 13:00:00 | 0.26 |
| 2019-03-17 14:00:00 | 0 |
| 2019-03-17 15:00:00 | 0.26 |
| 2019-03-17 16:00:00 | 0.26 |
| 2019-03-17 17:00:00 | 0.26 |
| 2019-03-17 18:00:00 | 0.26 |
| 2019-03-17 19:00:00 | 0.52 |
| 2019-03-17 20:00:00 | 0.26 |
| 2019-03-17 21:00:00 | 0.78 |
| 2019-03-17 22:00:00 | 1.04 |
| 2019-03-17 23:00:00 | 1.56 |
| 2019-03-18 | 1.82 |
| 2019-03-18 01:00:00 | 2.08 |
| 2019-03-18 02:00:00 | 1.82 |
| 2019-03-18 03:00:00 | 1.82 |
| 2019-03-18 04:00:00 | 1.82 |
| 2019-03-18 05:00:00 | 1.56 |
| 2019-03-18 06:00:00 | 1.82 |
| 2019-03-18 07:00:00 | 1.82 |
| 2019-03-18 08:00:00 | 1.82 |
| 2019-03-18 09:00:00 | 1.56 |
| 2019-03-18 10:00:00 | 1.56 |
| 2019-03-18 11:00:00 | 1.3 |
| 2019-03-18 12:00:00 | 1.04 |
| 2019-03-18 13:00:00 | 0.78 |
| 2019-03-18 14:00:00 | 0.78 |
| 2019-03-18 15:00:00 | 0.52 |
| 2019-03-18 16:00:00 | 0.52 |
| 2019-03-18 17:00:00 | 0.26 |
| 2019-03-18 18:00:00 | 1.04 |
| 2019-03-18 19:00:00 | 1.04 |
| 2019-03-18 20:00:00 | 1.56 |
| 2019-03-18 21:00:00 | 1.82 |
| 2019-03-18 22:00:00 | 1.82 |
| 2019-03-18 23:00:00 | 1.82 |
| 2019-03-19 | 2.08 |
| 2019-03-19 01:00:00 | 2.34 |
| 2019-03-19 02:00:00 | 2.08 |
| 2019-03-19 03:00:00 | 2.08 |
| 2019-03-19 04:00:00 | 2.34 |
| 2019-03-19 05:00:00 | 2.34 |
| 2019-03-19 06:00:00 | 2.34 |
| 2019-03-19 07:00:00 | 2.08 |
| 2019-03-19 08:00:00 | 2.34 |
| 2019-03-19 09:00:00 | 2.08 |
| 2019-03-19 10:00:00 | 1.82 |
| 2019-03-19 11:00:00 | 1.82 |
| 2019-03-19 12:00:00 | 1.82 |
| 2019-03-19 13:00:00 | 1.56 |
| 2019-03-19 14:00:00 | 1.56 |
| 2019-03-19 15:00:00 | 2.6 |
| 2019-03-19 16:00:00 | 2.08 |
| 2019-03-19 17:00:00 | 1.56 |
| 2019-03-19 18:00:00 | 12.22 |
| 2019-03-19 19:00:00 | 1.56 |
| 2019-03-19 20:00:00 | 1.82 |
| 2019-03-19 21:00:00 | 1.56 |
| 2019-03-19 22:00:00 | 1.82 |
| 2019-03-19 23:00:00 | 1.82 |
| 2019-03-20 | 1.82 |
| 2019-03-20 01:00:00 | 1.82 |
| 2019-03-20 02:00:00 | 2.08 |
| 2019-03-20 03:00:00 | 1.82 |
| 2019-03-20 04:00:00 | 2.08 |
| 2019-03-20 05:00:00 | 1.82 |
| 2019-03-20 06:00:00 | 2.34 |
| 2019-03-20 07:00:00 | 2.08 |
| 2019-03-20 08:00:00 | 2.08 |
| 2019-03-20 09:00:00 | 2.08 |
| 2019-03-20 10:00:00 | 1.82 |
| 2019-03-20 11:00:00 | 1.82 |
| 2019-03-20 12:00:00 | 2.34 |
| 2019-03-20 13:00:00 | 1.82 |
| 2019-03-20 14:00:00 | 1.3 |
| 2019-03-20 15:00:00 | 1.56 |
| 2019-03-20 16:00:00 | 1.56 |
| 2019-03-20 17:00:00 | 1.3 |
| 2019-03-20 18:00:00 | 1.56 |
| 2019-03-20 19:00:00 | 1.56 |
| 2019-03-20 20:00:00 | 1.82 |
| 2019-03-20 21:00:00 | 1.82 |
| 2019-03-20 22:00:00 | 2.08 |
| 2019-03-20 23:00:00 | 1.82 |
| 2019-03-21 | 2.08 |
| 2019-03-21 01:00:00 | 2.08 |
| 2019-03-21 02:00:00 | 2.08 |
| 2019-03-21 03:00:00 | 2.08 |
| 2019-03-21 04:00:00 | 2.34 |
| 2019-03-21 05:00:00 | 2.08 |
| 2019-03-21 06:00:00 | 2.34 |
| 2019-03-21 07:00:00 | 2.08 |
| 2019-03-21 08:00:00 | 2.34 |
| 2019-03-21 09:00:00 | 2.08 |
| 2019-03-21 10:00:00 | 1.82 |
| 2019-03-21 11:00:00 | 2.08 |
| 2019-03-21 12:00:00 | 1.56 |
| 2019-03-21 13:00:00 | 1.56 |
| 2019-03-21 14:00:00 | 1.56 |
| 2019-03-21 15:00:00 | 0.78 |
| 2019-03-21 16:00:00 | 0.26 |
| 2019-03-21 17:00:00 | 0.26 |
| 2019-03-21 18:00:00 | 0.26 |
| 2019-03-21 19:00:00 | 0.78 |
| 2019-03-21 20:00:00 | 1.3 |
| 2019-03-21 21:00:00 | 1.56 |
| 2019-03-21 22:00:00 | 1.82 |
| 2019-03-21 23:00:00 | 1.82 |
| 2019-03-22 | 2.08 |
| 2019-03-22 01:00:00 | 2.08 |
| 2019-03-22 02:00:00 | 2.08 |
| 2019-03-22 03:00:00 | 2.08 |
| 2019-03-22 04:00:00 | 2.08 |
| 2019-03-22 05:00:00 | 2.08 |
| 2019-03-22 06:00:00 | 2.08 |
| 2019-03-22 07:00:00 | 1.82 |
| 2019-03-22 08:00:00 | 2.08 |
| 2019-03-22 09:00:00 | 2.08 |
| 2019-03-22 10:00:00 | 1.56 |
| 2019-03-22 11:00:00 | 1.82 |
| 2019-03-22 12:00:00 | 1.56 |
| 2019-03-22 13:00:00 | 1.56 |
| 2019-03-22 14:00:00 | 1.56 |
| 2019-03-22 15:00:00 | 1.3 |
| 2019-03-22 16:00:00 | 1.3 |
| 2019-03-22 17:00:00 | 1.3 |
| 2019-03-22 18:00:00 | 1.3 |
| 2019-03-22 19:00:00 | 1.3 |
| 2019-03-22 20:00:00 | 1.56 |
| 2019-03-22 21:00:00 | 1.3 |
| 2019-03-22 22:00:00 | 1.56 |
| 2019-03-22 23:00:00 | 1.56 |
| 2019-03-23 | 1.56 |
| 2019-03-23 01:00:00 | 1.56 |
| 2019-03-23 02:00:00 | 1.56 |
| 2019-03-23 03:00:00 | 1.82 |
| 2019-03-23 04:00:00 | 1.56 |
| 2019-03-23 05:00:00 | 1.82 |
| 2019-03-23 06:00:00 | 1.82 |
| 2019-03-23 07:00:00 | 1.82 |
| 2019-03-23 08:00:00 | 1.82 |
| 2019-03-23 09:00:00 | 1.82 |
| 2019-03-23 10:00:00 | 1.82 |
| 2019-03-23 11:00:00 | 1.56 |
| 2019-03-23 12:00:00 | 1.04 |
| 2019-03-23 13:00:00 | 0.52 |
| 2019-03-23 14:00:00 | 0.26 |
| 2019-03-23 15:00:00 | 0 |
| 2019-03-23 16:00:00 | 0.26 |
| 2019-03-23 17:00:00 | 0.26 |
| 2019-03-23 18:00:00 | 0.26 |
| 2019-03-23 19:00:00 | 0 |
| 2019-03-23 20:00:00 | 0.52 |
| 2019-03-23 21:00:00 | 0.78 |
| 2019-03-23 22:00:00 | 1.04 |
| 2019-03-23 23:00:00 | 1.56 |
| 2019-03-24 | 1.3 |
| 2019-03-24 01:00:00 | 1.82 |
| 2019-03-24 02:00:00 | 1.82 |
| 2019-03-24 03:00:00 | 1.82 |
| 2019-03-24 04:00:00 | 1.82 |
| 2019-03-24 05:00:00 | 12.22 |
| 2019-03-24 06:00:00 | 2.08 |
| 2019-03-24 07:00:00 | 1.56 |
| 2019-03-24 08:00:00 | 1.56 |
| 2019-03-24 09:00:00 | 1.56 |
| 2019-03-24 10:00:00 | 1.56 |
| 2019-03-24 11:00:00 | 1.3 |
| 2019-03-24 12:00:00 | 1.04 |
| 2019-03-24 13:00:00 | 0.78 |
| 2019-03-24 14:00:00 | 0.52 |
| 2019-03-24 15:00:00 | 0 |
| 2019-03-24 16:00:00 | 0.26 |
| 2019-03-24 17:00:00 | 0.26 |
| 2019-03-24 18:00:00 | 0.52 |
| 2019-03-24 19:00:00 | 1.04 |
| 2019-03-24 20:00:00 | 1.04 |
| 2019-03-24 21:00:00 | 1.3 |
| 2019-03-24 22:00:00 | 1.3 |
| 2019-03-24 23:00:00 | 1.56 |
| 2019-03-25 | 1.56 |
| 2019-03-25 01:00:00 | 1.56 |
| 2019-03-25 02:00:00 | 1.82 |
| 2019-03-25 03:00:00 | 1.56 |
| 2019-03-25 04:00:00 | 1.56 |
| 2019-03-25 05:00:00 | 1.56 |
| 2019-03-25 06:00:00 | 1.56 |
| 2019-03-25 07:00:00 | 1.3 |
| 2019-03-25 08:00:00 | 1.56 |
| 2019-03-25 09:00:00 | 1.56 |
| 2019-03-25 10:00:00 | 1.56 |
| 2019-03-25 11:00:00 | 1.3 |
| 2019-03-25 12:00:00 | 1.04 |
| 2019-03-25 13:00:00 | 0.78 |
| 2019-03-25 14:00:00 | 1.04 |
| 2019-03-25 15:00:00 | 0.78 |
| 2019-03-25 16:00:00 | 1.04 |
| 2019-03-25 17:00:00 | 1.04 |
| 2019-03-25 18:00:00 | 1.56 |
| 2019-03-25 19:00:00 | 1.3 |
| 2019-03-25 20:00:00 | 1.56 |
| 2019-03-25 21:00:00 | 1.82 |
| 2019-03-25 22:00:00 | 1.56 |
| 2019-03-25 23:00:00 | 1.82 |
| 2019-03-26 | 1.82 |
| 2019-03-26 01:00:00 | 1.82 |
| 2019-03-26 02:00:00 | 1.82 |
| 2019-03-26 03:00:00 | 1.82 |
| 2019-03-26 04:00:00 | 1.56 |
| 2019-03-26 05:00:00 | 1.82 |
| 2019-03-26 06:00:00 | 1.82 |
| 2019-03-26 07:00:00 | 1.82 |
| 2019-03-26 08:00:00 | 1.82 |
| 2019-03-26 09:00:00 | 1.56 |
| 2019-03-26 10:00:00 | 1.82 |
| 2019-03-26 11:00:00 | 1.56 |
| 2019-03-26 12:00:00 | 3.38 |
| 2019-03-26 13:00:00 | 2.34 |
| 2019-03-26 14:00:00 | 1.82 |
| 2019-03-26 15:00:00 | 1.82 |
| 2019-03-26 16:00:00 | 1.3 |
| 2019-03-26 17:00:00 | 1.3 |
| 2019-03-26 18:00:00 | 1.82 |
| 2019-03-26 19:00:00 | 1.56 |
| 2019-03-26 20:00:00 | 1.82 |
| 2019-03-26 21:00:00 | 1.82 |
| 2019-03-26 22:00:00 | 2.08 |
| 2019-03-26 23:00:00 | 2.08 |
| 2019-03-27 | 1.82 |
| 2019-03-27 01:00:00 | 2.34 |
| 2019-03-27 02:00:00 | 2.08 |
| 2019-03-27 03:00:00 | 2.08 |
| 2019-03-27 04:00:00 | 2.08 |
| 2019-03-27 05:00:00 | 2.08 |
| 2019-03-27 06:00:00 | 2.34 |
| 2019-03-27 07:00:00 | 2.08 |
| 2019-03-27 08:00:00 | 2.08 |
| 2019-03-27 09:00:00 | 2.08 |
| 2019-03-27 10:00:00 | 2.34 |
| 2019-03-27 11:00:00 | 1.82 |
| 2019-03-27 12:00:00 | 1.82 |
| 2019-03-27 13:00:00 | 1.82 |
| 2019-03-27 14:00:00 | 1.82 |
| 2019-03-27 15:00:00 | 1.3 |
| 2019-03-27 16:00:00 | 0.52 |
| 2019-03-27 17:00:00 | 0.52 |
| 2019-03-27 18:00:00 | 0.78 |
| 2019-03-27 19:00:00 | 0.78 |
| 2019-03-27 20:00:00 | 1.04 |
| 2019-03-27 21:00:00 | 1.56 |
| 2019-03-27 22:00:00 | 1.56 |
| 2019-03-27 23:00:00 | 1.82 |
| 2019-03-28 | 2.08 |
| 2019-03-28 01:00:00 | 2.08 |
| 2019-03-28 02:00:00 | 1.82 |
| 2019-03-28 03:00:00 | 2.08 |
| 2019-03-28 04:00:00 | 1.82 |
| 2019-03-28 05:00:00 | 2.08 |
| 2019-03-28 06:00:00 | 1.82 |
| 2019-03-28 07:00:00 | 1.82 |
| 2019-03-28 08:00:00 | 2.08 |
| 2019-03-28 09:00:00 | 1.56 |
| 2019-03-28 10:00:00 | 1.82 |
| 2019-03-28 11:00:00 | 1.56 |
| 2019-03-28 12:00:00 | 1.56 |
| 2019-03-28 13:00:00 | 1.3 |
| 2019-03-28 14:00:00 | 1.3 |
| 2019-03-28 15:00:00 | 1.3 |
| 2019-03-28 16:00:00 | 1.04 |
| 2019-03-28 17:00:00 | 0.78 |
| 2019-03-28 18:00:00 | 1.04 |
| 2019-03-28 19:00:00 | 1.04 |
| 2019-03-28 20:00:00 | 1.04 |
| 2019-03-28 21:00:00 | 1.56 |
| 2019-03-28 22:00:00 | 1.56 |
| 2019-03-28 23:00:00 | 1.82 |
| 2019-03-29 | 1.82 |
| 2019-03-29 01:00:00 | 1.82 |
| 2019-03-29 02:00:00 | 2.08 |
| 2019-03-29 03:00:00 | 2.08 |
| 2019-03-29 04:00:00 | 2.08 |
| 2019-03-29 05:00:00 | 2.34 |
| 2019-03-29 06:00:00 | 2.08 |
| 2019-03-29 07:00:00 | 2.34 |
| 2019-03-29 08:00:00 | 2.08 |
| 2019-03-29 09:00:00 | 1.82 |
| 2019-03-29 10:00:00 | 11.44 |
| 2019-03-29 11:00:00 | 2.6 |
| 2019-03-29 12:00:00 | 1.3 |
| 2019-03-29 13:00:00 | 1.04 |
| 2019-03-29 14:00:00 | 0.52 |
| 2019-03-29 15:00:00 | 0.52 |
| 2019-03-29 16:00:00 | 0.26 |
| 2019-03-29 17:00:00 | 0.52 |
| 2019-03-29 18:00:00 | 0.52 |
| 2019-03-29 19:00:00 | 0.52 |
| 2019-03-29 20:00:00 | 0.78 |
| 2019-03-29 21:00:00 | 1.3 |
| 2019-03-29 22:00:00 | 1.56 |
| 2019-03-29 23:00:00 | 1.82 |
| 2019-03-30 | 1.82 |
| 2019-03-30 01:00:00 | 2.08 |
| 2019-03-30 02:00:00 | 2.08 |
| 2019-03-30 03:00:00 | 2.08 |
| 2019-03-30 04:00:00 | 2.34 |
| 2019-03-30 05:00:00 | 2.08 |
| 2019-03-30 06:00:00 | 2.34 |
| 2019-03-30 07:00:00 | 2.08 |
| 2019-03-30 08:00:00 | 2.08 |
| 2019-03-30 09:00:00 | 2.08 |
| 2019-03-30 10:00:00 | 1.56 |
| 2019-03-30 11:00:00 | 1.3 |
| 2019-03-30 12:00:00 | 0.52 |
| 2019-03-30 13:00:00 | 0.52 |
| 2019-03-30 14:00:00 | 0.52 |
| 2019-03-30 15:00:00 | 0.26 |
| 2019-03-30 16:00:00 | 0.52 |
| 2019-03-30 17:00:00 | 0.26 |
| 2019-03-30 18:00:00 | 0.52 |
| 2019-03-30 19:00:00 | 0.52 |
| 2019-03-30 20:00:00 | 0.52 |
| 2019-03-30 21:00:00 | 1.04 |
| 2019-03-30 22:00:00 | 1.04 |
| 2019-03-30 23:00:00 | 1.56 |
| 2019-03-31 | 1.56 |
| 2019-03-31 01:00:00 | 1.82 |
| 2019-03-31 03:00:00 | 2.08 |
| 2019-03-31 04:00:00 | 1.82 |
| 2019-03-31 05:00:00 | 2.08 |
| 2019-03-31 06:00:00 | 2.08 |
| 2019-03-31 07:00:00 | 2.08 |
| 2019-03-31 08:00:00 | 1.82 |
| 2019-03-31 09:00:00 | 2.08 |
| 2019-03-31 10:00:00 | 1.82 |
| 2019-03-31 11:00:00 | 1.3 |
| 2019-03-31 12:00:00 | 0.52 |
| 2019-03-31 13:00:00 | 0.26 |
| 2019-03-31 14:00:00 | 0.52 |
| 2019-03-31 15:00:00 | 0.26 |
| 2019-03-31 16:00:00 | 0.52 |
| 2019-03-31 17:00:00 | 0.52 |
| 2019-03-31 18:00:00 | 0.26 |
| 2019-03-31 19:00:00 | 0.52 |
| 2019-03-31 20:00:00 | 0.52 |
| 2019-03-31 21:00:00 | 0.52 |
| 2019-03-31 22:00:00 | 0.78 |
| 2019-03-31 23:00:00 | 1.04 |
| 2019-04-01 | 1.3 |
| 2019-04-01 01:00:00 | 1.3 |
| 2019-04-01 02:00:00 | 1.56 |
| 2019-04-01 03:00:00 | 1.56 |
| 2019-04-01 04:00:00 | 1.56 |
| 2019-04-01 05:00:00 | 1.82 |
| 2019-04-01 06:00:00 | 1.82 |
| 2019-04-01 07:00:00 | 1.82 |
| 2019-04-01 08:00:00 | 2.08 |
| 2019-04-01 09:00:00 | 1.82 |
| 2019-04-01 10:00:00 | 1.82 |
| 2019-04-01 11:00:00 | 1.56 |
| 2019-04-01 12:00:00 | 1.3 |
| 2019-04-01 13:00:00 | 0.78 |
| 2019-04-01 14:00:00 | 0.26 |
| 2019-04-01 15:00:00 | 0.52 |
| 2019-04-01 16:00:00 | 0.52 |
| 2019-04-01 17:00:00 | 0.26 |
| 2019-04-01 18:00:00 | 0.52 |
| 2019-04-01 19:00:00 | 0.52 |
| 2019-04-01 20:00:00 | 0.52 |
| 2019-04-01 21:00:00 | 0.52 |
| 2019-04-01 22:00:00 | 1.04 |
| 2019-04-01 23:00:00 | 1.3 |
| 2019-04-02 | 1.3 |
| 2019-04-02 01:00:00 | 1.56 |
| 2019-04-02 02:00:00 | 1.56 |
| 2019-04-02 03:00:00 | 1.82 |
| 2019-04-02 04:00:00 | 1.82 |
| 2019-04-02 05:00:00 | 2.08 |
| 2019-04-02 06:00:00 | 2.08 |
| 2019-04-02 07:00:00 | 1.82 |
| 2019-04-02 08:00:00 | 2.08 |
| 2019-04-02 09:00:00 | 2.08 |
| 2019-04-02 10:00:00 | 1.82 |
| 2019-04-02 11:00:00 | 1.56 |
| 2019-04-02 12:00:00 | 1.3 |
| 2019-04-02 13:00:00 | 0.52 |
| 2019-04-02 14:00:00 | 0.52 |
| 2019-04-02 15:00:00 | 0.26 |
| 2019-04-02 16:00:00 | 0.52 |
| 2019-04-02 17:00:00 | 0.52 |
| 2019-04-02 18:00:00 | 0.26 |
| 2019-04-02 19:00:00 | 0.52 |
| 2019-04-02 20:00:00 | 0.26 |
| 2019-04-02 21:00:00 | 0.78 |
| 2019-04-02 22:00:00 | 0.52 |
| 2019-04-02 23:00:00 | 1.04 |
| 2019-04-03 | 1.04 |
| 2019-04-03 01:00:00 | 1.3 |
| 2019-04-03 02:00:00 | 1.56 |
| 2019-04-03 03:00:00 | 1.82 |
| 2019-04-03 04:00:00 | 4.16 |
| 2019-04-03 05:00:00 | 10.66 |
| 2019-04-03 06:00:00 | 1.82 |
| 2019-04-03 07:00:00 | 1.82 |
| 2019-04-03 08:00:00 | 1.82 |
| 2019-04-03 09:00:00 | 1.82 |
| 2019-04-03 10:00:00 | 1.56 |
| 2019-04-03 11:00:00 | 1.04 |
| 2019-04-03 12:00:00 | 0.78 |
| 2019-04-03 13:00:00 | 0.26 |
| 2019-04-03 14:00:00 | 1.04 |
| 2019-04-03 15:00:00 | 0.26 |
| 2019-04-03 16:00:00 | 0.52 |
| 2019-04-03 17:00:00 | 0.26 |
| 2019-04-03 18:00:00 | 0.52 |
| 2019-04-03 19:00:00 | 0.26 |
| 2019-04-03 20:00:00 | 0.52 |
| 2019-04-03 21:00:00 | 0.52 |
| 2019-04-03 22:00:00 | 0.52 |
| 2019-04-03 23:00:00 | 0.52 |
| 2019-04-04 | 0.52 |
| 2019-04-04 01:00:00 | 0.78 |
| 2019-04-04 02:00:00 | 1.04 |
| 2019-04-04 03:00:00 | 1.04 |
| 2019-04-04 04:00:00 | 1.04 |
| 2019-04-04 05:00:00 | 1.3 |
| 2019-04-04 06:00:00 | 1.3 |
| 2019-04-04 07:00:00 | 1.56 |
| 2019-04-04 08:00:00 | 1.56 |
| 2019-04-04 09:00:00 | 1.3 |
| 2019-04-04 10:00:00 | 1.04 |
| 2019-04-04 11:00:00 | 0.52 |
| 2019-04-04 12:00:00 | 0.52 |
| 2019-04-04 13:00:00 | 0.26 |
| 2019-04-04 14:00:00 | 0.52 |
| 2019-04-04 15:00:00 | 0.26 |
| 2019-04-04 16:00:00 | 0.52 |
| 2019-04-04 17:00:00 | 0.26 |
| 2019-04-04 18:00:00 | 0.52 |
| 2019-04-04 19:00:00 | 0.52 |
| 2019-04-04 20:00:00 | 0.26 |
| 2019-04-04 21:00:00 | 0.52 |
| 2019-04-04 22:00:00 | 0.52 |
| 2019-04-04 23:00:00 | 0.52 |
| 2019-04-05 | 0.52 |
| 2019-04-05 01:00:00 | 0.52 |
| 2019-04-05 02:00:00 | 1.04 |
| 2019-04-05 03:00:00 | 0.78 |
| 2019-04-05 04:00:00 | 1.04 |
| 2019-04-05 05:00:00 | 1.3 |
| 2019-04-05 06:00:00 | 1.3 |
| 2019-04-05 07:00:00 | 1.3 |
| 2019-04-05 08:00:00 | 1.56 |
| 2019-04-05 09:00:00 | 1.3 |
| 2019-04-05 10:00:00 | 1.04 |
| 2019-04-05 11:00:00 | 0.26 |
| 2019-04-05 12:00:00 | 0.52 |
| 2019-04-05 13:00:00 | 0.26 |
| 2019-04-05 14:00:00 | 0.52 |
| 2019-04-05 15:00:00 | 0.26 |
| 2019-04-05 16:00:00 | 0.52 |
| 2019-04-05 17:00:00 | 3.12 |
| 2019-04-05 18:00:00 | 8.58 |
| 2019-04-05 19:00:00 | 0.52 |
| 2019-04-05 20:00:00 | 0.26 |
| 2019-04-05 21:00:00 | 0.52 |
| 2019-04-05 22:00:00 | 0.26 |
| 2019-04-05 23:00:00 | 0.52 |
| 2019-04-06 | 0.52 |
| 2019-04-06 01:00:00 | 0.52 |
| 2019-04-06 02:00:00 | 0.78 |
| 2019-04-06 03:00:00 | 0.78 |
| 2019-04-06 04:00:00 | 0.52 |
| 2019-04-06 05:00:00 | 0.78 |
| 2019-04-06 06:00:00 | 0.78 |
| 2019-04-06 07:00:00 | 0.78 |
| 2019-04-06 08:00:00 | 0.78 |
| 2019-04-06 09:00:00 | 0.78 |
| 2019-04-06 10:00:00 | 0.52 |
| 2019-04-06 11:00:00 | 0.26 |
| 2019-04-06 12:00:00 | 0.52 |
| 2019-04-06 13:00:00 | 0.52 |
| 2019-04-06 14:00:00 | 0.26 |
| 2019-04-06 15:00:00 | 0.52 |
| 2019-04-06 16:00:00 | 0.52 |
| 2019-04-06 17:00:00 | 0.26 |
| 2019-04-06 18:00:00 | 0.52 |
| 2019-04-06 19:00:00 | 0.52 |
| 2019-04-06 20:00:00 | 0.52 |
| 2019-04-06 21:00:00 | 0.52 |
| 2019-04-06 22:00:00 | 0.52 |
| 2019-04-06 23:00:00 | 0.78 |
| 2019-04-07 | 1.04 |
| 2019-04-07 01:00:00 | 0.78 |
| 2019-04-07 02:00:00 | 1.3 |
| 2019-04-07 03:00:00 | 1.3 |
| 2019-04-07 04:00:00 | 1.3 |
| 2019-04-07 05:00:00 | 1.56 |
| 2019-04-07 06:00:00 | 1.3 |
| 2019-04-07 07:00:00 | 1.56 |
| 2019-04-07 08:00:00 | 1.56 |
| 2019-04-07 09:00:00 | 1.56 |
| 2019-04-07 10:00:00 | 1.3 |
| 2019-04-07 11:00:00 | 0.78 |
| 2019-04-07 12:00:00 | 0.52 |
| 2019-04-07 13:00:00 | 0.26 |
| 2019-04-07 14:00:00 | 0.52 |
| 2019-04-07 15:00:00 | 0.52 |
| 2019-04-07 16:00:00 | 0.26 |
| 2019-04-07 17:00:00 | 0.52 |
| 2019-04-07 18:00:00 | 0.26 |
| 2019-04-07 19:00:00 | 11.18 |
| 2019-04-07 20:00:00 | 0.52 |
| 2019-04-07 21:00:00 | 0.26 |
| 2019-04-07 22:00:00 | 0.52 |
| 2019-04-07 23:00:00 | 0.78 |
| 2019-04-08 | 0.52 |
| 2019-04-08 01:00:00 | 0.78 |
| 2019-04-08 02:00:00 | 0.78 |
| 2019-04-08 03:00:00 | 1.04 |
| 2019-04-08 04:00:00 | 0.78 |
| 2019-04-08 05:00:00 | 1.3 |
| 2019-04-08 06:00:00 | 1.04 |
| 2019-04-08 07:00:00 | 1.3 |
| 2019-04-08 08:00:00 | 1.3 |
| 2019-04-08 09:00:00 | 1.82 |
| 2019-04-08 10:00:00 | 1.82 |
| 2019-04-08 11:00:00 | 1.3 |
| 2019-04-08 12:00:00 | 0.52 |
| 2019-04-08 13:00:00 | 0.52 |
| 2019-04-08 14:00:00 | 0.26 |
| 2019-04-08 15:00:00 | 0.52 |
| 2019-04-08 16:00:00 | 0.26 |
| 2019-04-08 17:00:00 | 0.52 |
| 2019-04-08 18:00:00 | 0.26 |
| 2019-04-08 19:00:00 | 0.52 |
| 2019-04-08 20:00:00 | 0.26 |
| 2019-04-08 21:00:00 | 0.52 |
| 2019-04-08 22:00:00 | 0.26 |
| 2019-04-08 23:00:00 | 0.52 |
| 2019-04-09 | 0.52 |
| 2019-04-09 01:00:00 | 0.78 |
| 2019-04-09 02:00:00 | 0.52 |
| 2019-04-09 03:00:00 | 1.04 |
| 2019-04-09 04:00:00 | 0.78 |
| 2019-04-09 05:00:00 | 1.04 |
| 2019-04-09 06:00:00 | 0.78 |
| 2019-04-09 07:00:00 | 1.04 |
| 2019-04-09 08:00:00 | 1.04 |
| 2019-04-09 09:00:00 | 1.04 |
| 2019-04-09 10:00:00 | 1.04 |
| 2019-04-09 11:00:00 | 0.78 |
| 2019-04-09 12:00:00 | 0.78 |
| 2019-04-09 13:00:00 | 0.52 |
| 2019-04-09 14:00:00 | 0.26 |
| 2019-04-09 15:00:00 | 0.52 |
| 2019-04-09 16:00:00 | 0.26 |
| 2019-04-09 17:00:00 | 0.52 |
| 2019-04-09 18:00:00 | 0.26 |
| 2019-04-09 19:00:00 | 0.52 |
| 2019-04-09 20:00:00 | 0.52 |
| 2019-04-09 21:00:00 | 0.78 |
| 2019-04-09 22:00:00 | 0.78 |
| 2019-04-09 23:00:00 | 0.78 |
| 2019-04-10 | 1.04 |
| 2019-04-10 01:00:00 | 1.3 |
| 2019-04-10 02:00:00 | 1.3 |
| 2019-04-10 03:00:00 | 1.3 |
| 2019-04-10 04:00:00 | 1.3 |
| 2019-04-10 05:00:00 | 1.3 |
| 2019-04-10 06:00:00 | 1.3 |
| 2019-04-10 07:00:00 | 1.3 |
| 2019-04-10 08:00:00 | 1.56 |
| 2019-04-10 09:00:00 | 1.3 |
| 2019-04-10 10:00:00 | 1.04 |
| 2019-04-10 11:00:00 | 1.3 |
| 2019-04-10 12:00:00 | 0.78 |
| 2019-04-10 13:00:00 | 0.52 |
| 2019-04-10 14:00:00 | 0.52 |
| 2019-04-10 15:00:00 | 0.52 |
| 2019-04-10 16:00:00 | 0.26 |
| 2019-04-10 17:00:00 | 0.52 |
| 2019-04-10 18:00:00 | 0.52 |
| 2019-04-10 19:00:00 | 0.78 |
| 2019-04-10 20:00:00 | 0.78 |
| 2019-04-10 21:00:00 | 0.78 |
| 2019-04-10 22:00:00 | 1.04 |
| 2019-04-10 23:00:00 | 1.3 |
| 2019-04-11 | 1.3 |
| 2019-04-11 01:00:00 | 1.3 |
| 2019-04-11 02:00:00 | 1.3 |
| 2019-04-11 03:00:00 | 1.56 |
| 2019-04-11 04:00:00 | 1.3 |
| 2019-04-11 05:00:00 | 1.56 |
| 2019-04-11 06:00:00 | 1.56 |
| 2019-04-11 07:00:00 | 1.56 |
| 2019-04-11 08:00:00 | 1.56 |
| 2019-04-11 09:00:00 | 1.82 |
| 2019-04-11 10:00:00 | 1.56 |
| 2019-04-11 11:00:00 | 1.82 |
| 2019-04-11 12:00:00 | 3.12 |
| 2019-04-11 13:00:00 | 2.34 |
| 2019-04-11 14:00:00 | 1.82 |
| 2019-04-11 15:00:00 | 1.82 |
| 2019-04-11 16:00:00 | 1.56 |
| 2019-04-11 17:00:00 | 1.56 |
| 2019-04-11 18:00:00 | 1.3 |
| 2019-04-11 19:00:00 | 1.56 |
| 2019-04-11 20:00:00 | 1.3 |
| 2019-04-11 21:00:00 | 1.3 |
| 2019-04-11 22:00:00 | 1.56 |
| 2019-04-11 23:00:00 | 1.3 |
| 2019-04-12 | 1.56 |
| 2019-04-12 01:00:00 | 1.56 |
| 2019-04-12 02:00:00 | 1.3 |
| 2019-04-12 03:00:00 | 1.82 |
| 2019-04-12 04:00:00 | 1.56 |
| 2019-04-12 05:00:00 | 1.56 |
| 2019-04-12 06:00:00 | 1.82 |
| 2019-04-12 07:00:00 | 12.48 |
| 2019-04-12 08:00:00 | 1.56 |
| 2019-04-12 09:00:00 | 1.82 |
| 2019-04-12 10:00:00 | 1.56 |
| 2019-04-12 11:00:00 | 1.82 |
| 2019-04-12 12:00:00 | 1.56 |
| 2019-04-12 13:00:00 | 1.56 |
| 2019-04-12 14:00:00 | 1.3 |
| 2019-04-12 15:00:00 | 1.56 |
| 2019-04-12 16:00:00 | 1.56 |
| 2019-04-12 17:00:00 | 1.56 |
| 2019-04-12 18:00:00 | 1.56 |
| 2019-04-12 19:00:00 | 1.56 |
| 2019-04-12 20:00:00 | 1.56 |
| 2019-04-12 21:00:00 | 1.56 |
| 2019-04-12 22:00:00 | 1.56 |
| 2019-04-12 23:00:00 | 1.56 |
| 2019-04-13 | 1.56 |
| 2019-04-13 01:00:00 | 1.82 |
| 2019-04-13 02:00:00 | 1.56 |
| 2019-04-13 03:00:00 | 1.82 |
| 2019-04-13 04:00:00 | 1.82 |
| 2019-04-13 05:00:00 | 1.56 |
| 2019-04-13 06:00:00 | 1.82 |
| 2019-04-13 07:00:00 | 1.82 |
| 2019-04-13 08:00:00 | 1.82 |
| 2019-04-13 09:00:00 | 1.82 |
| 2019-04-13 10:00:00 | 1.82 |
| 2019-04-13 11:00:00 | 1.56 |
| 2019-04-13 12:00:00 | 1.82 |
| 2019-04-13 13:00:00 | 1.82 |
| 2019-04-13 14:00:00 | 1.56 |
| 2019-04-13 15:00:00 | 1.82 |
| 2019-04-13 16:00:00 | 1.82 |
| 2019-04-13 17:00:00 | 1.56 |
| 2019-04-13 18:00:00 | 1.56 |
| 2019-04-13 19:00:00 | 1.82 |
| 2019-04-13 20:00:00 | 1.56 |
| 2019-04-13 21:00:00 | 1.56 |
| 2019-04-13 22:00:00 | 1.82 |
| 2019-04-13 23:00:00 | 1.56 |
| 2019-04-14 | 1.82 |
| 2019-04-14 01:00:00 | 1.56 |
| 2019-04-14 02:00:00 | 1.56 |
| 2019-04-14 03:00:00 | 1.56 |
| 2019-04-14 04:00:00 | 1.82 |
| 2019-04-14 05:00:00 | 1.56 |
| 2019-04-14 06:00:00 | 1.82 |
| 2019-04-14 07:00:00 | 1.56 |
| 2019-04-14 08:00:00 | 1.56 |
| 2019-04-14 09:00:00 | 1.56 |
| 2019-04-14 10:00:00 | 1.56 |
| 2019-04-14 11:00:00 | 1.3 |
| 2019-04-14 12:00:00 | 1.3 |
| 2019-04-14 13:00:00 | 0.52 |
| 2019-04-14 14:00:00 | 0.78 |
| 2019-04-14 15:00:00 | 0.26 |
| 2019-04-14 16:00:00 | 0.52 |
| 2019-04-14 17:00:00 | 0.26 |
| 2019-04-14 18:00:00 | 0.52 |
| 2019-04-14 19:00:00 | 0.52 |
| 2019-04-14 20:00:00 | 0.26 |
| 2019-04-14 21:00:00 | 0.78 |
| 2019-04-14 22:00:00 | 0.78 |
| 2019-04-14 23:00:00 | 0.78 |
| 2019-04-15 | 1.04 |
| 2019-04-15 01:00:00 | 1.3 |
| 2019-04-15 02:00:00 | 1.56 |
| 2019-04-15 03:00:00 | 1.56 |
| 2019-04-15 04:00:00 | 1.82 |
| 2019-04-15 05:00:00 | 1.82 |
| 2019-04-15 06:00:00 | 2.08 |
| 2019-04-15 07:00:00 | 1.82 |
| 2019-04-15 08:00:00 | 1.82 |
| 2019-04-15 09:00:00 | 1.82 |
| 2019-04-15 10:00:00 | 1.82 |
| 2019-04-15 11:00:00 | 1.56 |
| 2019-04-15 12:00:00 | 1.56 |
| 2019-04-15 13:00:00 | 0.78 |
| 2019-04-15 14:00:00 | 0.52 |
| 2019-04-15 15:00:00 | 0.26 |
| 2019-04-15 16:00:00 | 0.52 |
| 2019-04-15 17:00:00 | 0.52 |
| 2019-04-15 18:00:00 | 0.26 |
| 2019-04-15 19:00:00 | 0.52 |
| 2019-04-15 20:00:00 | 0.26 |
| 2019-04-15 21:00:00 | 0.78 |
| 2019-04-15 22:00:00 | 0.52 |
| 2019-04-15 23:00:00 | 1.04 |
| 2019-04-16 | 1.3 |
| 2019-04-16 01:00:00 | 1.3 |
| 2019-04-16 02:00:00 | 1.82 |
| 2019-04-16 03:00:00 | 1.82 |
| 2019-04-16 04:00:00 | 1.82 |
| 2019-04-16 05:00:00 | 2.08 |
| 2019-04-16 06:00:00 | 2.08 |
| 2019-04-16 07:00:00 | 1.82 |
| 2019-04-16 08:00:00 | 2.08 |
| 2019-04-16 09:00:00 | 1.82 |
| 2019-04-16 10:00:00 | 1.82 |
| 2019-04-16 11:00:00 | 1.56 |
| 2019-04-16 12:00:00 | 1.3 |
| 2019-04-16 13:00:00 | 0.52 |
| 2019-04-16 14:00:00 | 0.52 |
| 2019-04-16 15:00:00 | 0.26 |
| 2019-04-16 16:00:00 | 0.52 |
| 2019-04-16 17:00:00 | 0.52 |
| 2019-04-16 18:00:00 | 0.26 |
| 2019-04-16 19:00:00 | 0.52 |
| 2019-04-16 20:00:00 | 0.26 |
| 2019-04-16 21:00:00 | 0.52 |
| 2019-04-16 22:00:00 | 0.78 |
| 2019-04-16 23:00:00 | 0.78 |
| 2019-04-17 | 1.04 |
| 2019-04-17 01:00:00 | 1.04 |
| 2019-04-17 02:00:00 | 1.56 |
| 2019-04-17 03:00:00 | 1.56 |
| 2019-04-17 04:00:00 | 1.56 |
| 2019-04-17 05:00:00 | 1.56 |
| 2019-04-17 06:00:00 | 10.66 |
| 2019-04-17 07:00:00 | 3.12 |
| 2019-04-17 08:00:00 | 1.56 |
| 2019-04-17 09:00:00 | 1.56 |
| 2019-04-17 10:00:00 | 1.3 |
| 2019-04-17 11:00:00 | 2.08 |
| 2019-04-17 12:00:00 | 0.78 |
| 2019-04-17 13:00:00 | 0.52 |
| 2019-04-17 14:00:00 | 0.26 |
| 2019-04-17 15:00:00 | 0.52 |
| 2019-04-17 16:00:00 | 0.26 |
| 2019-04-17 17:00:00 | 0.52 |
| 2019-04-17 18:00:00 | 0.26 |
| 2019-04-17 19:00:00 | 0.52 |
| 2019-04-17 20:00:00 | 0.26 |
| 2019-04-17 21:00:00 | 0.52 |
| 2019-04-17 22:00:00 | 0.52 |
| 2019-04-17 23:00:00 | 0.78 |
| 2019-04-18 | 0.78 |
| 2019-04-18 01:00:00 | 1.3 |
| 2019-04-18 02:00:00 | 1.3 |
| 2019-04-18 03:00:00 | 1.3 |
| 2019-04-18 04:00:00 | 1.56 |
| 2019-04-18 05:00:00 | 1.82 |
| 2019-04-18 06:00:00 | 1.82 |
| 2019-04-18 07:00:00 | 1.82 |
| 2019-04-18 08:00:00 | 1.82 |
| 2019-04-18 09:00:00 | 1.82 |
| 2019-04-18 10:00:00 | 1.56 |
| 2019-04-18 11:00:00 | 1.3 |
| 2019-04-18 12:00:00 | 0.52 |
| 2019-04-18 13:00:00 | 0.26 |
| 2019-04-18 14:00:00 | 0.52 |
| 2019-04-18 15:00:00 | 0.26 |
| 2019-04-18 16:00:00 | 0.52 |
| 2019-04-18 17:00:00 | 0.26 |
| 2019-04-18 18:00:00 | 0.52 |
| 2019-04-18 19:00:00 | 0.26 |
| 2019-04-18 20:00:00 | 0.52 |
| 2019-04-18 21:00:00 | 0.26 |
| 2019-04-18 22:00:00 | 0.52 |
| 2019-04-18 23:00:00 | 0.52 |
| 2019-04-19 | 0.52 |
| 2019-04-19 01:00:00 | 0.78 |
| 2019-04-19 02:00:00 | 0.78 |
| 2019-04-19 03:00:00 | 0.78 |
| 2019-04-19 04:00:00 | 1.04 |
| 2019-04-19 05:00:00 | 1.3 |
| 2019-04-19 06:00:00 | 1.56 |
| 2019-04-19 07:00:00 | 1.56 |
| 2019-04-19 08:00:00 | 1.56 |
| 2019-04-19 09:00:00 | 1.3 |
| 2019-04-19 10:00:00 | 1.3 |
| 2019-04-19 11:00:00 | 0.78 |
| 2019-04-19 12:00:00 | 0.26 |
| 2019-04-19 13:00:00 | 0.52 |
| 2019-04-19 14:00:00 | 0.26 |
| 2019-04-19 15:00:00 | 0.52 |
| 2019-04-19 16:00:00 | 0.26 |
| 2019-04-19 17:00:00 | 0.52 |
| 2019-04-19 18:00:00 | 0.26 |
| 2019-04-19 19:00:00 | 0.52 |
| 2019-04-19 20:00:00 | 0.26 |
| 2019-04-19 21:00:00 | 0.52 |
| 2019-04-19 22:00:00 | 0.26 |
| 2019-04-19 23:00:00 | 0.52 |
| 2019-04-20 | 0.52 |
| 2019-04-20 01:00:00 | 0.52 |
| 2019-04-20 02:00:00 | 0.52 |
| 2019-04-20 03:00:00 | 0.52 |
| 2019-04-20 04:00:00 | 0.78 |
| 2019-04-20 05:00:00 | 1.04 |
| 2019-04-20 06:00:00 | 1.04 |
| 2019-04-20 07:00:00 | 1.3 |
| 2019-04-20 08:00:00 | 1.3 |
| 2019-04-20 09:00:00 | 1.3 |
| 2019-04-20 10:00:00 | 1.04 |
| 2019-04-20 11:00:00 | 0.52 |
| 2019-04-20 12:00:00 | 0.26 |
| 2019-04-20 13:00:00 | 0.52 |
| 2019-04-20 14:00:00 | 0.26 |
| 2019-04-20 15:00:00 | 0.52 |
| 2019-04-20 16:00:00 | 0.26 |
| 2019-04-20 17:00:00 | 0.26 |
| 2019-04-20 18:00:00 | 0.52 |
| 2019-04-20 19:00:00 | 0.26 |
| 2019-04-20 20:00:00 | 0.52 |
| 2019-04-20 21:00:00 | 0.26 |
| 2019-04-20 22:00:00 | 0.52 |
| 2019-04-20 23:00:00 | 0.26 |
| 2019-04-21 | 0.52 |
| 2019-04-21 01:00:00 | 0.52 |
| 2019-04-21 02:00:00 | 0.52 |
| 2019-04-21 03:00:00 | 0.52 |
| 2019-04-21 04:00:00 | 0.78 |
| 2019-04-21 05:00:00 | 0.78 |
| 2019-04-21 06:00:00 | 1.04 |
| 2019-04-21 07:00:00 | 0.78 |
| 2019-04-21 08:00:00 | 1.04 |
| 2019-04-21 09:00:00 | 1.04 |
| 2019-04-21 10:00:00 | 0.78 |
| 2019-04-21 11:00:00 | 0.52 |
| 2019-04-21 12:00:00 | 0.26 |
| 2019-04-21 13:00:00 | 0.52 |
| 2019-04-21 14:00:00 | 0.26 |
| 2019-04-21 15:00:00 | 0.26 |
| 2019-04-21 16:00:00 | 9.36 |
| 2019-04-21 17:00:00 | 2.34 |
| 2019-04-21 18:00:00 | 0.26 |
| 2019-04-21 19:00:00 | 0.52 |
| 2019-04-21 20:00:00 | 0.26 |
| 2019-04-21 21:00:00 | 0.52 |
| 2019-04-21 22:00:00 | 0.26 |
| 2019-04-21 23:00:00 | 0.52 |
| 2019-04-22 | 0.26 |
| 2019-04-22 01:00:00 | 0.52 |
| 2019-04-22 02:00:00 | 0.78 |
| 2019-04-22 03:00:00 | 0.52 |
| 2019-04-22 04:00:00 | 0.78 |
| 2019-04-22 05:00:00 | 0.78 |
| 2019-04-22 06:00:00 | 0.78 |
| 2019-04-22 07:00:00 | 1.04 |
| 2019-04-22 08:00:00 | 1.04 |
| 2019-04-22 09:00:00 | 1.04 |
| 2019-04-22 10:00:00 | 0.78 |
| 2019-04-22 11:00:00 | 0.52 |
| 2019-04-22 12:00:00 | 0.52 |
| 2019-04-22 13:00:00 | 0.26 |
| 2019-04-22 14:00:00 | 0.52 |
| 2019-04-22 15:00:00 | 0.26 |
| 2019-04-22 16:00:00 | 0.52 |
| 2019-04-22 17:00:00 | 0.26 |
| 2019-04-22 18:00:00 | 0.52 |
| 2019-04-22 19:00:00 | 0.26 |
| 2019-04-22 20:00:00 | 0.26 |
| 2019-04-22 21:00:00 | 0.52 |
| 2019-04-22 22:00:00 | 0.26 |
| 2019-04-22 23:00:00 | 0.52 |
| 2019-04-23 | 0.52 |
| 2019-04-23 01:00:00 | 0.26 |
| 2019-04-23 02:00:00 | 0.52 |
| 2019-04-23 03:00:00 | 0.52 |
| 2019-04-23 04:00:00 | 0.52 |
| 2019-04-23 05:00:00 | 0.52 |
| 2019-04-23 06:00:00 | 0.78 |
| 2019-04-23 07:00:00 | 0.78 |
| 2019-04-23 08:00:00 | 0.52 |
| 2019-04-23 09:00:00 | 0.78 |
| 2019-04-23 10:00:00 | 0.26 |
| 2019-04-23 11:00:00 | 0.52 |
| 2019-04-23 12:00:00 | 0.26 |
| 2019-04-23 13:00:00 | 0.26 |
| 2019-04-23 14:00:00 | 0.52 |
| 2019-04-23 15:00:00 | 0.52 |
| 2019-04-23 16:00:00 | 0.26 |
| 2019-04-23 17:00:00 | 0.52 |
| 2019-04-23 18:00:00 | 0.26 |
| 2019-04-23 19:00:00 | 0.26 |
| 2019-04-23 20:00:00 | 0.52 |
| 2019-04-23 21:00:00 | 0.52 |
| 2019-04-23 22:00:00 | 0.26 |
| 2019-04-23 23:00:00 | 0.52 |
| 2019-04-24 | 0.26 |
| 2019-04-24 01:00:00 | 0.52 |
| 2019-04-24 02:00:00 | 0.52 |
| 2019-04-24 03:00:00 | 0.52 |
| 2019-04-24 04:00:00 | 0.52 |
| 2019-04-24 05:00:00 | 0.52 |
| 2019-04-24 06:00:00 | 0.78 |
| 2019-04-24 07:00:00 | 0.78 |
| 2019-04-24 08:00:00 | 0.52 |
| 2019-04-24 09:00:00 | 0.52 |
| 2019-04-24 10:00:00 | 0.52 |
| 2019-04-24 11:00:00 | 0.26 |
| 2019-04-24 12:00:00 | 0.52 |
| 2019-04-24 13:00:00 | 0.26 |
| 2019-04-24 14:00:00 | 0.52 |
| 2019-04-24 15:00:00 | 0.26 |
| 2019-04-24 16:00:00 | 0.52 |
| 2019-04-24 17:00:00 | 0.26 |
| 2019-04-24 18:00:00 | 0.26 |
| 2019-04-24 19:00:00 | 0.52 |
| 2019-04-24 20:00:00 | 0.26 |
| 2019-04-24 21:00:00 | 0.52 |
| 2019-04-24 22:00:00 | 0.26 |
| 2019-04-24 23:00:00 | 0.52 |
| 2019-04-25 | 0.26 |
| 2019-04-25 01:00:00 | 0.52 |
| 2019-04-25 02:00:00 | 0.26 |
| 2019-04-25 03:00:00 | 0.52 |
| 2019-04-25 04:00:00 | 0.52 |
| 2019-04-25 05:00:00 | 0.52 |
| 2019-04-25 06:00:00 | 0.52 |
| 2019-04-25 07:00:00 | 0.52 |
| 2019-04-25 08:00:00 | 0.26 |
| 2019-04-25 09:00:00 | 0.52 |
| 2019-04-25 10:00:00 | 0.26 |
| 2019-04-25 11:00:00 | 0.52 |
| 2019-04-25 12:00:00 | 0.26 |
| 2019-04-25 13:00:00 | 0.52 |
| 2019-04-25 14:00:00 | 0.26 |
| 2019-04-25 15:00:00 | 0.26 |
| 2019-04-25 16:00:00 | 0.52 |
| 2019-04-25 17:00:00 | 0.26 |
| 2019-04-25 18:00:00 | 0.52 |
| 2019-04-25 19:00:00 | 0.26 |
| 2019-04-25 20:00:00 | 0.26 |
| 2019-04-25 21:00:00 | 0.26 |
| 2019-04-25 22:00:00 | 0.52 |
| 2019-04-25 23:00:00 | 0.26 |
| 2019-04-26 | 0.26 |
| 2019-04-26 01:00:00 | 0.52 |
| 2019-04-26 02:00:00 | 0.52 |
| 2019-04-26 03:00:00 | 0.26 |
| 2019-04-26 04:00:00 | 0.52 |
| 2019-04-26 05:00:00 | 0.26 |
| 2019-04-26 06:00:00 | 0.26 |
| 2019-04-26 07:00:00 | 0.52 |
| 2019-04-26 08:00:00 | 0.26 |
| 2019-04-26 09:00:00 | 0.52 |
| 2019-04-26 10:00:00 | 0.26 |
| 2019-04-26 11:00:00 | 0.52 |
| 2019-04-26 12:00:00 | 0.26 |
| 2019-04-26 13:00:00 | 0.26 |
| 2019-04-26 14:00:00 | 0.26 |
| 2019-04-26 15:00:00 | 4.94 |
| 2019-04-26 16:00:00 | 7.02 |
| 2019-04-26 17:00:00 | 0.26 |
| 2019-04-26 18:00:00 | 0.26 |
| 2019-04-26 19:00:00 | 0.26 |
| 2019-04-26 20:00:00 | 0.52 |
| 2019-04-26 21:00:00 | 0.26 |
| 2019-04-26 22:00:00 | 0.26 |
| 2019-04-26 23:00:00 | 0.52 |
| 2019-04-27 | 0.26 |
| 2019-04-27 01:00:00 | 0.26 |
| 2019-04-27 02:00:00 | 0.52 |
| 2019-04-27 03:00:00 | 0.26 |
| 2019-04-27 04:00:00 | 0.26 |
| 2019-04-27 05:00:00 | 0.52 |
| 2019-04-27 06:00:00 | 0.26 |
| 2019-04-27 07:00:00 | 0.52 |
| 2019-04-27 08:00:00 | 0.26 |
| 2019-04-27 09:00:00 | 0.26 |
| 2019-04-27 10:00:00 | 0.26 |
| 2019-04-27 11:00:00 | 0.52 |
| 2019-04-27 12:00:00 | 0.26 |
| 2019-04-27 13:00:00 | 0.26 |
| 2019-04-27 14:00:00 | 0.52 |
| 2019-04-27 15:00:00 | 0.26 |
| 2019-04-27 16:00:00 | 0.52 |
| 2019-04-27 17:00:00 | 0.26 |
| 2019-04-27 18:00:00 | 0.26 |
| 2019-04-27 19:00:00 | 0.26 |
| 2019-04-27 20:00:00 | 0.52 |
| 2019-04-27 21:00:00 | 0.26 |
| 2019-04-27 22:00:00 | 0.52 |
| 2019-04-27 23:00:00 | 0.26 |
| 2019-04-28 | 0.26 |
| 2019-04-28 01:00:00 | 0.52 |
| 2019-04-28 02:00:00 | 0.26 |
| 2019-04-28 03:00:00 | 0.52 |
| 2019-04-28 04:00:00 | 0.26 |
| 2019-04-28 05:00:00 | 0.52 |
| 2019-04-28 06:00:00 | 0.26 |
| 2019-04-28 07:00:00 | 0.52 |
| 2019-04-28 08:00:00 | 0.26 |
| 2019-04-28 09:00:00 | 0.52 |
| 2019-04-28 10:00:00 | 0.26 |
| 2019-04-28 11:00:00 | 0.26 |
| 2019-04-28 12:00:00 | 0.52 |
| 2019-04-28 13:00:00 | 0.26 |
| 2019-04-28 14:00:00 | 0.52 |
| 2019-04-28 15:00:00 | 0.26 |
| 2019-04-28 16:00:00 | 0.52 |
| 2019-04-28 17:00:00 | 0.26 |
| 2019-04-28 18:00:00 | 0.26 |
| 2019-04-28 19:00:00 | 0.52 |
| 2019-04-28 20:00:00 | 0.52 |
| 2019-04-28 21:00:00 | 0.26 |
| 2019-04-28 22:00:00 | 0.52 |
| 2019-04-28 23:00:00 | 0.26 |
| 2019-04-29 | 0.52 |
| 2019-04-29 01:00:00 | 0.26 |
| 2019-04-29 02:00:00 | 0.52 |
| 2019-04-29 03:00:00 | 0.52 |
| 2019-04-29 04:00:00 | 0.26 |
| 2019-04-29 05:00:00 | 0.52 |
| 2019-04-29 06:00:00 | 0.52 |
| 2019-04-29 07:00:00 | 0.52 |
| 2019-04-29 08:00:00 | 0.26 |
| 2019-04-29 09:00:00 | 0.52 |
| 2019-04-29 10:00:00 | 0.52 |
| 2019-04-29 11:00:00 | 0.26 |
| 2019-04-29 12:00:00 | 0.52 |
| 2019-04-29 13:00:00 | 0.78 |
| 2019-04-29 14:00:00 | 0.78 |
| 2019-04-29 15:00:00 | 0.52 |
| 2019-04-29 16:00:00 | 0.52 |
| 2019-04-29 17:00:00 | 0.78 |
| 2019-04-29 18:00:00 | 0.52 |
| 2019-04-29 19:00:00 | 0.78 |
| 2019-04-29 20:00:00 | 0.52 |
| 2019-04-29 21:00:00 | 0.52 |
| 2019-04-29 22:00:00 | 0.52 |
| 2019-04-29 23:00:00 | 0.52 |
| 2019-04-30 | 0.78 |
| 2019-04-30 01:00:00 | 0.52 |
| 2019-04-30 02:00:00 | 0.52 |
| 2019-04-30 03:00:00 | 7.54 |
| 2019-04-30 04:00:00 | 4.42 |
| 2019-04-30 05:00:00 | 0.52 |
| 2019-04-30 06:00:00 | 0.78 |
| 2019-04-30 07:00:00 | 0.52 |
| 2019-04-30 08:00:00 | 0.78 |
| 2019-04-30 09:00:00 | 0.78 |
| 2019-04-30 10:00:00 | 0.78 |
| 2019-04-30 11:00:00 | 0.78 |
| 2019-04-30 12:00:00 | 0.78 |
| 2019-04-30 13:00:00 | 0.78 |
| 2019-04-30 14:00:00 | 0.78 |
| 2019-04-30 15:00:00 | 0.78 |
| 2019-04-30 16:00:00 | 0.78 |
| 2019-04-30 17:00:00 | 0.26 |
| 2019-04-30 18:00:00 | 0.52 |
| 2019-04-30 19:00:00 | 0.26 |
| 2019-04-30 20:00:00 | 0.52 |
| 2019-04-30 21:00:00 | 0.26 |
| 2019-04-30 22:00:00 | 0.52 |
| 2019-04-30 23:00:00 | 0.52 |
| 2019-05-01 | 0.52 |
| 2019-05-01 01:00:00 | 0.52 |
| 2019-05-01 02:00:00 | 0.52 |
| 2019-05-01 03:00:00 | 0.52 |
| 2019-05-01 04:00:00 | 0.78 |
| 2019-05-01 05:00:00 | 0.78 |
| 2019-05-01 06:00:00 | 1.04 |
| 2019-05-01 07:00:00 | 0.78 |
| 2019-05-01 08:00:00 | 1.04 |
| 2019-05-01 09:00:00 | 1.04 |
| 2019-05-01 10:00:00 | 0.78 |
| 2019-05-01 11:00:00 | 1.04 |
| 2019-05-01 12:00:00 | 0.52 |
| 2019-05-01 13:00:00 | 0.52 |
| 2019-05-01 14:00:00 | 0.52 |
| 2019-05-01 15:00:00 | 0.26 |
| 2019-05-01 16:00:00 | 0.52 |
| 2019-05-01 17:00:00 | 0.26 |
| 2019-05-01 18:00:00 | 0.26 |
| 2019-05-01 19:00:00 | 0.52 |
| 2019-05-01 20:00:00 | 0.52 |
| 2019-05-01 21:00:00 | 0.26 |
| 2019-05-01 22:00:00 | 0.26 |
| 2019-05-01 23:00:00 | 0.52 |
| 2019-05-02 | 0.26 |
| 2019-05-02 01:00:00 | 0.52 |
| 2019-05-02 02:00:00 | 0.26 |
| 2019-05-02 03:00:00 | 0.52 |
| 2019-05-02 04:00:00 | 0.52 |
| 2019-05-02 05:00:00 | 0.52 |
| 2019-05-02 06:00:00 | 0.52 |
| 2019-05-02 07:00:00 | 0.52 |
| 2019-05-02 08:00:00 | 0.52 |
| 2019-05-02 09:00:00 | 0.52 |
| 2019-05-02 10:00:00 | 0.26 |
| 2019-05-02 11:00:00 | 0.52 |
| 2019-05-02 12:00:00 | 0.26 |
| 2019-05-02 13:00:00 | 0.52 |
| 2019-05-02 14:00:00 | 0.26 |
| 2019-05-02 15:00:00 | 0.52 |
| 2019-05-02 16:00:00 | 0.26 |
| 2019-05-02 17:00:00 | 0.52 |
| 2019-05-02 18:00:00 | 0.26 |
| 2019-05-02 19:00:00 | 0.26 |
| 2019-05-02 20:00:00 | 0.52 |
| 2019-05-02 21:00:00 | 0.26 |
| 2019-05-02 22:00:00 | 0.52 |
| 2019-05-02 23:00:00 | 0.26 |
| 2019-05-03 | 0.26 |
| 2019-05-03 01:00:00 | 0.52 |
| 2019-05-03 02:00:00 | 0.52 |
| 2019-05-03 03:00:00 | 0.26 |
| 2019-05-03 04:00:00 | 0.52 |
| 2019-05-03 05:00:00 | 0.26 |
| 2019-05-03 06:00:00 | 0.52 |
| 2019-05-03 07:00:00 | 0.26 |
| 2019-05-03 08:00:00 | 0.26 |
| 2019-05-03 09:00:00 | 0.52 |
| 2019-05-03 10:00:00 | 0.26 |
| 2019-05-03 11:00:00 | 0.52 |
| 2019-05-03 12:00:00 | 0.26 |
| 2019-05-03 13:00:00 | 0.52 |
| 2019-05-03 14:00:00 | 0.52 |
| 2019-05-03 15:00:00 | 0.26 |
| 2019-05-03 16:00:00 | 0.52 |
| 2019-05-03 17:00:00 | 0.26 |
| 2019-05-03 18:00:00 | 0.52 |
| 2019-05-03 19:00:00 | 0.26 |
| 2019-05-03 20:00:00 | 0.52 |
| 2019-05-03 21:00:00 | 0.26 |
| 2019-05-03 22:00:00 | 0.52 |
| 2019-05-03 23:00:00 | 0.52 |
| 2019-05-04 | 0.78 |
| 2019-05-04 01:00:00 | 0.52 |
| 2019-05-04 02:00:00 | 0.78 |
| 2019-05-04 03:00:00 | 0.52 |
| 2019-05-04 04:00:00 | 0.78 |
| 2019-05-04 05:00:00 | 0.78 |
| 2019-05-04 06:00:00 | 1.04 |
| 2019-05-04 07:00:00 | 0.78 |
| 2019-05-04 08:00:00 | 1.04 |
| 2019-05-04 09:00:00 | 0.78 |
| 2019-05-04 10:00:00 | 0.52 |
| 2019-05-04 11:00:00 | 11.44 |
| 2019-05-04 12:00:00 | 0.52 |
| 2019-05-04 13:00:00 | 0.52 |
| 2019-05-04 14:00:00 | 0.26 |
| 2019-05-04 15:00:00 | 0.52 |
| 2019-05-04 16:00:00 | 0.26 |
| 2019-05-04 17:00:00 | 0.26 |
| 2019-05-04 18:00:00 | 0.52 |
| 2019-05-04 19:00:00 | 0.26 |
| 2019-05-04 20:00:00 | 0.52 |
| 2019-05-04 21:00:00 | 0.52 |
| 2019-05-04 22:00:00 | 0.52 |
| 2019-05-04 23:00:00 | 0.52 |
| 2019-05-05 | 0.78 |
| 2019-05-05 01:00:00 | 0.78 |
| 2019-05-05 02:00:00 | 0.78 |
| 2019-05-05 03:00:00 | 1.04 |
| 2019-05-05 04:00:00 | 1.04 |
| 2019-05-05 05:00:00 | 1.56 |
| 2019-05-05 06:00:00 | 1.56 |
| 2019-05-05 07:00:00 | 1.82 |
| 2019-05-05 08:00:00 | 1.56 |
| 2019-05-05 09:00:00 | 1.82 |
| 2019-05-05 10:00:00 | 1.82 |
| 2019-05-05 11:00:00 | 1.56 |
| 2019-05-05 12:00:00 | 1.82 |
| 2019-05-05 13:00:00 | 1.56 |
| 2019-05-05 14:00:00 | 1.3 |
| 2019-05-05 15:00:00 | 1.56 |
| 2019-05-05 16:00:00 | 1.3 |
| 2019-05-05 17:00:00 | 1.3 |
| 2019-05-05 18:00:00 | 1.04 |
| 2019-05-05 19:00:00 | 1.3 |
| 2019-05-05 20:00:00 | 1.04 |
| 2019-05-05 21:00:00 | 1.3 |
| 2019-05-05 22:00:00 | 1.3 |
| 2019-05-05 23:00:00 | 1.04 |
| 2019-05-06 | 1.3 |
| 2019-05-06 01:00:00 | 1.3 |
| 2019-05-06 02:00:00 | 1.04 |
| 2019-05-06 03:00:00 | 1.3 |
| 2019-05-06 04:00:00 | 1.3 |
| 2019-05-06 05:00:00 | 1.56 |
| 2019-05-06 06:00:00 | 1.3 |
| 2019-05-06 07:00:00 | 1.56 |
| 2019-05-06 08:00:00 | 1.3 |
| 2019-05-06 09:00:00 | 1.56 |
| 2019-05-06 10:00:00 | 1.3 |
| 2019-05-06 11:00:00 | 1.3 |
| 2019-05-06 12:00:00 | 1.3 |
| 2019-05-06 13:00:00 | 1.04 |
| 2019-05-06 14:00:00 | 1.04 |
| 2019-05-06 15:00:00 | 0.78 |
| 2019-05-06 16:00:00 | 0.52 |
| 2019-05-06 17:00:00 | 0.78 |
| 2019-05-06 18:00:00 | 0.78 |
| 2019-05-06 19:00:00 | 1.04 |
| 2019-05-06 20:00:00 | 0.78 |
| 2019-05-06 21:00:00 | 1.04 |
| 2019-05-06 22:00:00 | 1.04 |
| 2019-05-06 23:00:00 | 1.3 |
| 2019-05-07 | 1.04 |
| 2019-05-07 01:00:00 | 1.3 |
| 2019-05-07 02:00:00 | 1.56 |
| 2019-05-07 03:00:00 | 1.3 |
| 2019-05-07 04:00:00 | 1.56 |
| 2019-05-07 05:00:00 | 1.3 |
| 2019-05-07 06:00:00 | 1.56 |
| 2019-05-07 07:00:00 | 1.56 |
| 2019-05-07 08:00:00 | 1.56 |
| 2019-05-07 09:00:00 | 1.56 |
| 2019-05-07 10:00:00 | 1.3 |
| 2019-05-07 11:00:00 | 1.3 |
| 2019-05-07 12:00:00 | 1.3 |
| 2019-05-07 13:00:00 | 0.78 |
| 2019-05-07 14:00:00 | 0.78 |
| 2019-05-07 15:00:00 | 0.52 |
| 2019-05-07 16:00:00 | 0.26 |
| 2019-05-07 17:00:00 | 0.52 |
| 2019-05-07 18:00:00 | 0.26 |
| 2019-05-07 19:00:00 | 0.52 |
| 2019-05-07 20:00:00 | 0.26 |
| 2019-05-07 21:00:00 | 0.52 |
| 2019-05-07 22:00:00 | 0.78 |
| 2019-05-07 23:00:00 | 0.78 |
| 2019-05-08 | 1.04 |
| 2019-05-08 01:00:00 | 1.3 |
| 2019-05-08 02:00:00 | 1.3 |
| 2019-05-08 03:00:00 | 1.82 |
| 2019-05-08 04:00:00 | 1.56 |
| 2019-05-08 05:00:00 | 8.06 |
| 2019-05-08 06:00:00 | 7.02 |
| 2019-05-08 07:00:00 | 1.82 |
| 2019-05-08 08:00:00 | 1.56 |
| 2019-05-08 09:00:00 | 1.82 |
| 2019-05-08 10:00:00 | 1.3 |
| 2019-05-08 11:00:00 | 1.04 |
| 2019-05-08 12:00:00 | 0.78 |
| 2019-05-08 13:00:00 | 0.52 |
| 2019-05-08 14:00:00 | 0.26 |
| 2019-05-08 15:00:00 | 0.52 |
| 2019-05-08 16:00:00 | 0.26 |
| 2019-05-08 17:00:00 | 0.26 |
| 2019-05-08 18:00:00 | 0.52 |
| 2019-05-08 19:00:00 | 0.26 |
| 2019-05-08 20:00:00 | 0.26 |
| 2019-05-08 21:00:00 | 0.52 |
| 2019-05-08 22:00:00 | 0.52 |
| 2019-05-08 23:00:00 | 0.52 |
| 2019-05-09 | 0.52 |
| 2019-05-09 01:00:00 | 0.78 |
| 2019-05-09 02:00:00 | 0.78 |
| 2019-05-09 03:00:00 | 0.52 |
| 2019-05-09 04:00:00 | 0.78 |
| 2019-05-09 05:00:00 | 0.78 |
| 2019-05-09 06:00:00 | 0.78 |
| 2019-05-09 07:00:00 | 0.78 |
| 2019-05-09 08:00:00 | 0.78 |
| 2019-05-09 09:00:00 | 0.78 |
| 2019-05-09 10:00:00 | 0.78 |
| 2019-05-09 11:00:00 | 0.78 |
| 2019-05-09 12:00:00 | 2.34 |
| 2019-05-09 13:00:00 | 0.78 |
| 2019-05-09 14:00:00 | 1.04 |
| 2019-05-09 15:00:00 | 0.78 |
| 2019-05-09 16:00:00 | 0.78 |
| 2019-05-09 17:00:00 | 0.52 |
| 2019-05-09 18:00:00 | 0.52 |
| 2019-05-09 19:00:00 | 0.26 |
| 2019-05-09 20:00:00 | 0.52 |
| 2019-05-09 21:00:00 | 0.52 |
| 2019-05-09 22:00:00 | 0.52 |
| 2019-05-09 23:00:00 | 0.78 |
| 2019-05-10 | 0.78 |
| 2019-05-10 01:00:00 | 0.78 |
| 2019-05-10 02:00:00 | 1.04 |
| 2019-05-10 03:00:00 | 1.04 |
| 2019-05-10 04:00:00 | 1.04 |
| 2019-05-10 05:00:00 | 1.3 |
| 2019-05-10 06:00:00 | 1.04 |
| 2019-05-10 07:00:00 | 1.3 |
| 2019-05-10 08:00:00 | 1.04 |
| 2019-05-10 09:00:00 | 1.04 |
| 2019-05-10 10:00:00 | 0.78 |
| 2019-05-10 11:00:00 | 0.52 |
| 2019-05-10 12:00:00 | 0.26 |
| 2019-05-10 13:00:00 | 0.52 |
| 2019-05-10 14:00:00 | 0.26 |
| 2019-05-10 15:00:00 | 0.52 |
| 2019-05-10 16:00:00 | 0.26 |
| 2019-05-10 17:00:00 | 0.52 |
| 2019-05-10 18:00:00 | 0.26 |
| 2019-05-10 19:00:00 | 0.52 |
| 2019-05-10 20:00:00 | 0.26 |
| 2019-05-10 21:00:00 | 0.52 |
| 2019-05-10 22:00:00 | 0.26 |
| 2019-05-10 23:00:00 | 0.52 |
| 2019-05-11 | 0.52 |
| 2019-05-11 01:00:00 | 0.78 |
| 2019-05-11 02:00:00 | 0.78 |
| 2019-05-11 03:00:00 | 0.78 |
| 2019-05-11 04:00:00 | 1.04 |
| 2019-05-11 05:00:00 | 1.3 |
| 2019-05-11 06:00:00 | 1.04 |
| 2019-05-11 07:00:00 | 1.3 |
| 2019-05-11 08:00:00 | 1.3 |
| 2019-05-11 09:00:00 | 1.3 |
| 2019-05-11 10:00:00 | 1.04 |
| 2019-05-11 11:00:00 | 0.52 |
| 2019-05-11 12:00:00 | 0.26 |
| 2019-05-11 13:00:00 | 11.44 |
| 2019-05-11 14:00:00 | 0.52 |
| 2019-05-11 15:00:00 | 0.26 |
| 2019-05-11 16:00:00 | 0.52 |
| 2019-05-11 17:00:00 | 0.26 |
| 2019-05-11 18:00:00 | 0.26 |
| 2019-05-11 19:00:00 | 0.52 |
| 2019-05-11 20:00:00 | 0.26 |
| 2019-05-11 21:00:00 | 0.26 |
| 2019-05-11 22:00:00 | 0.52 |
| 2019-05-11 23:00:00 | 0.52 |
| 2019-05-12 | 0.26 |
| 2019-05-12 01:00:00 | 0.52 |
| 2019-05-12 02:00:00 | 0.52 |
| 2019-05-12 03:00:00 | 0.52 |
| 2019-05-12 04:00:00 | 0.78 |
| 2019-05-12 05:00:00 | 0.52 |
| 2019-05-12 06:00:00 | 0.52 |
| 2019-05-12 07:00:00 | 0.78 |
| 2019-05-12 08:00:00 | 0.52 |
| 2019-05-12 09:00:00 | 0.26 |
| 2019-05-12 10:00:00 | 0.52 |
| 2019-05-12 11:00:00 | 0.78 |
| 2019-05-12 12:00:00 | 0.52 |
| 2019-05-12 13:00:00 | 1.04 |
| 2019-05-12 14:00:00 | 0.78 |
| 2019-05-12 15:00:00 | 1.04 |
| 2019-05-12 16:00:00 | 1.04 |
| 2019-05-12 17:00:00 | 1.3 |
| 2019-05-12 18:00:00 | 1.04 |
| 2019-05-12 19:00:00 | 1.3 |
| 2019-05-12 20:00:00 | 1.3 |
| 2019-05-12 21:00:00 | 1.04 |
| 2019-05-12 22:00:00 | 1.3 |
| 2019-05-12 23:00:00 | 1.3 |
| 2019-05-13 | 1.04 |
| 2019-05-13 01:00:00 | 1.3 |
| 2019-05-13 02:00:00 | 1.3 |
| 2019-05-13 03:00:00 | 1.04 |
| 2019-05-13 04:00:00 | 1.3 |
| 2019-05-13 05:00:00 | 1.3 |
| 2019-05-13 06:00:00 | 1.04 |
| 2019-05-13 07:00:00 | 1.3 |
| 2019-05-13 08:00:00 | 1.04 |
| 2019-05-13 09:00:00 | 1.56 |
| 2019-05-13 10:00:00 | 1.82 |
| 2019-05-13 11:00:00 | 1.3 |
| 2019-05-13 12:00:00 | 1.04 |
| 2019-05-13 13:00:00 | 0.78 |
| 2019-05-13 14:00:00 | 0.52 |
| 2019-05-13 15:00:00 | 0.26 |
| 2019-05-13 16:00:00 | 0.52 |
| 2019-05-13 17:00:00 | 0.78 |
| 2019-05-13 18:00:00 | 0.52 |
| 2019-05-13 19:00:00 | 0.78 |
| 2019-05-13 20:00:00 | 0.78 |
| 2019-05-13 21:00:00 | 0.78 |
| 2019-05-13 22:00:00 | 0.78 |
| 2019-05-13 23:00:00 | 1.04 |
| 2019-05-14 | 1.04 |
| 2019-05-14 01:00:00 | 1.04 |
| 2019-05-14 02:00:00 | 1.3 |
| 2019-05-14 03:00:00 | 1.3 |
| 2019-05-14 04:00:00 | 1.3 |
| 2019-05-14 05:00:00 | 1.56 |
| 2019-05-14 06:00:00 | 1.3 |
| 2019-05-14 07:00:00 | 1.56 |
| 2019-05-14 08:00:00 | 1.56 |
| 2019-05-14 09:00:00 | 1.56 |
| 2019-05-14 10:00:00 | 1.56 |
| 2019-05-14 11:00:00 | 1.3 |
| 2019-05-14 12:00:00 | 1.56 |
| 2019-05-14 13:00:00 | 1.3 |
| 2019-05-14 14:00:00 | 1.3 |
| 2019-05-14 15:00:00 | 1.3 |
| 2019-05-14 16:00:00 | 1.3 |
| 2019-05-14 17:00:00 | 1.04 |
| 2019-05-14 18:00:00 | 1.3 |
| 2019-05-14 19:00:00 | 1.04 |
| 2019-05-14 20:00:00 | 1.3 |
| 2019-05-14 21:00:00 | 1.3 |
| 2019-05-14 22:00:00 | 1.3 |
| 2019-05-14 23:00:00 | 1.3 |
| 2019-05-15 | 1.56 |
| 2019-05-15 01:00:00 | 1.3 |
| 2019-05-15 02:00:00 | 1.3 |
| 2019-05-15 03:00:00 | 1.56 |
| 2019-05-15 04:00:00 | 1.3 |
| 2019-05-15 05:00:00 | 9.62 |
| 2019-05-15 06:00:00 | 4.68 |
| 2019-05-15 07:00:00 | 1.3 |
| 2019-05-15 08:00:00 | 1.3 |
| 2019-05-15 09:00:00 | 1.56 |
| 2019-05-15 10:00:00 | 1.3 |
| 2019-05-15 11:00:00 | 1.3 |
| 2019-05-15 12:00:00 | 1.56 |
| 2019-05-15 13:00:00 | 1.3 |
| 2019-05-15 14:00:00 | 1.56 |
| 2019-05-15 15:00:00 | 1.3 |
| 2019-05-15 16:00:00 | 1.3 |
| 2019-05-15 17:00:00 | 1.56 |
| 2019-05-15 18:00:00 | 1.3 |
| 2019-05-15 19:00:00 | 1.3 |
| 2019-05-15 20:00:00 | 1.56 |
| 2019-05-15 21:00:00 | 1.3 |
| 2019-05-15 22:00:00 | 1.3 |
| 2019-05-15 23:00:00 | 1.3 |
| 2019-05-16 | 1.3 |
| 2019-05-16 01:00:00 | 1.3 |
| 2019-05-16 02:00:00 | 1.3 |
| 2019-05-16 03:00:00 | 1.3 |
| 2019-05-16 04:00:00 | 1.04 |
| 2019-05-16 05:00:00 | 1.3 |
| 2019-05-16 06:00:00 | 1.04 |
| 2019-05-16 07:00:00 | 1.04 |
| 2019-05-16 08:00:00 | 1.04 |
| 2019-05-16 09:00:00 | 0.78 |
| 2019-05-16 10:00:00 | 1.04 |
| 2019-05-16 11:00:00 | 0.78 |
| 2019-05-16 12:00:00 | 0.78 |
| 2019-05-16 13:00:00 | 0.78 |
| 2019-05-16 14:00:00 | 0.26 |
| 2019-05-16 15:00:00 | 0.52 |
| 2019-05-16 16:00:00 | 0.26 |
| 2019-05-16 17:00:00 | 0.52 |
| 2019-05-16 18:00:00 | 0.52 |
| 2019-05-16 19:00:00 | 0.26 |
| 2019-05-16 20:00:00 | 0.52 |
| 2019-05-16 21:00:00 | 0.26 |
| 2019-05-16 22:00:00 | 0.52 |
| 2019-05-16 23:00:00 | 0.52 |
| 2019-05-17 | 0.52 |
| 2019-05-17 01:00:00 | 0.52 |
| 2019-05-17 02:00:00 | 0.52 |
| 2019-05-17 03:00:00 | 0.78 |
| 2019-05-17 04:00:00 | 0.78 |
| 2019-05-17 05:00:00 | 0.78 |
| 2019-05-17 06:00:00 | 0.78 |
| 2019-05-17 07:00:00 | 0.78 |
| 2019-05-17 08:00:00 | 0.78 |
| 2019-05-17 09:00:00 | 0.78 |
| 2019-05-17 10:00:00 | 0.52 |
| 2019-05-17 11:00:00 | 0.52 |
| 2019-05-17 12:00:00 | 0.26 |
| 2019-05-17 13:00:00 | 0.52 |
| 2019-05-17 14:00:00 | 0.26 |
| 2019-05-17 15:00:00 | 0.52 |
| 2019-05-17 16:00:00 | 0.26 |
| 2019-05-17 17:00:00 | 0.52 |
| 2019-05-17 18:00:00 | 0.26 |
| 2019-05-17 19:00:00 | 0.26 |
| 2019-05-17 20:00:00 | 0.52 |
| 2019-05-17 21:00:00 | 0.26 |
| 2019-05-17 22:00:00 | 0.52 |
| 2019-05-17 23:00:00 | 0.52 |
| 2019-05-18 | 0.52 |
| 2019-05-18 01:00:00 | 0.52 |
| 2019-05-18 02:00:00 | 0.52 |
| 2019-05-18 03:00:00 | 0.78 |
| 2019-05-18 04:00:00 | 0.78 |
| 2019-05-18 05:00:00 | 11.7 |
| 2019-05-18 06:00:00 | 1.04 |
| 2019-05-18 07:00:00 | 1.04 |
| 2019-05-18 08:00:00 | 1.04 |
| 2019-05-18 09:00:00 | 0.78 |
| 2019-05-18 10:00:00 | 0.52 |
| 2019-05-18 11:00:00 | 0.52 |
| 2019-05-18 12:00:00 | 0.26 |
| 2019-05-18 13:00:00 | 0.52 |
| 2019-05-18 14:00:00 | 0.26 |
| 2019-05-18 15:00:00 | 0.52 |
| 2019-05-18 16:00:00 | 0.26 |
| 2019-05-18 17:00:00 | 0.26 |
| 2019-05-18 18:00:00 | 0.26 |
| 2019-05-18 19:00:00 | 0.52 |
| 2019-05-18 20:00:00 | 0.26 |
| 2019-05-18 21:00:00 | 0.52 |
| 2019-05-18 22:00:00 | 0.26 |
| 2019-05-18 23:00:00 | 0.52 |
| 2019-05-19 | 0.26 |
| 2019-05-19 01:00:00 | 0.52 |
| 2019-05-19 02:00:00 | 0.26 |
| 2019-05-19 03:00:00 | 0.26 |
| 2019-05-19 04:00:00 | 0.52 |
| 2019-05-19 05:00:00 | 0.52 |
| 2019-05-19 06:00:00 | 0.26 |
| 2019-05-19 07:00:00 | 0.52 |
| 2019-05-19 08:00:00 | 0.26 |
| 2019-05-19 09:00:00 | 0.52 |
| 2019-05-19 10:00:00 | 0.26 |
| 2019-05-19 11:00:00 | 0.26 |
| 2019-05-19 12:00:00 | 0.52 |
| 2019-05-19 13:00:00 | 0.26 |
| 2019-05-19 14:00:00 | 0.52 |
| 2019-05-19 15:00:00 | 0.26 |
| 2019-05-19 16:00:00 | 0.26 |
| 2019-05-19 17:00:00 | 0.52 |
| 2019-05-19 18:00:00 | 0.26 |
| 2019-05-19 19:00:00 | 0.26 |
| 2019-05-19 20:00:00 | 0.52 |
| 2019-05-19 21:00:00 | 0.26 |
| 2019-05-19 22:00:00 | 0.26 |
| 2019-05-19 23:00:00 | 0.52 |
| 2019-05-20 | 0.26 |
| 2019-05-20 01:00:00 | 0.26 |
| 2019-05-20 02:00:00 | 0.52 |
| 2019-05-20 03:00:00 | 0.52 |
| 2019-05-20 04:00:00 | 0.26 |
| 2019-05-20 05:00:00 | 0.26 |
| 2019-05-20 06:00:00 | 0.52 |
| 2019-05-20 07:00:00 | 0.26 |
| 2019-05-20 08:00:00 | 0.26 |
| 2019-05-20 09:00:00 | 0.52 |
| 2019-05-20 10:00:00 | 0.26 |
| 2019-05-20 11:00:00 | 0.52 |
| 2019-05-20 12:00:00 | 0.26 |
| 2019-05-20 13:00:00 | 0.26 |
| 2019-05-20 14:00:00 | 0.52 |
| 2019-05-20 15:00:00 | 0.26 |
| 2019-05-20 16:00:00 | 0.26 |
| 2019-05-20 17:00:00 | 0.52 |
| 2019-05-20 18:00:00 | 0.26 |
| 2019-05-20 19:00:00 | 0.26 |
| 2019-05-20 20:00:00 | 0.26 |
| 2019-05-20 21:00:00 | 0.52 |
| 2019-05-20 22:00:00 | 0.26 |
| 2019-05-20 23:00:00 | 0.26 |
| 2019-05-21 | 0.52 |
| 2019-05-21 01:00:00 | 0.26 |
| 2019-05-21 02:00:00 | 0.52 |
| 2019-05-21 03:00:00 | 0.26 |
| 2019-05-21 04:00:00 | 0.52 |
| 2019-05-21 05:00:00 | 0.26 |
| 2019-05-21 06:00:00 | 0.26 |
| 2019-05-21 07:00:00 | 0.52 |
| 2019-05-21 08:00:00 | 0.52 |
| 2019-05-21 09:00:00 | 0.26 |
| 2019-05-21 10:00:00 | 0.26 |
| 2019-05-21 11:00:00 | 0.52 |
| 2019-05-21 12:00:00 | 0.26 |
| 2019-05-21 13:00:00 | 0.26 |
| 2019-05-21 14:00:00 | 0.52 |
| 2019-05-21 15:00:00 | 0.26 |
| 2019-05-21 16:00:00 | 0.52 |
| 2019-05-21 17:00:00 | 0.26 |
| 2019-05-21 18:00:00 | 0.26 |
| 2019-05-21 19:00:00 | 0.26 |
| 2019-05-21 20:00:00 | 0.52 |
| 2019-05-21 21:00:00 | 0.26 |
| 2019-05-21 22:00:00 | 0.26 |
| 2019-05-21 23:00:00 | 12.48 |
| 2019-05-22 | 0.26 |
| 2019-05-22 01:00:00 | 0.26 |
| 2019-05-22 02:00:00 | 0.52 |
| 2019-05-22 03:00:00 | 0.26 |
| 2019-05-22 04:00:00 | 0.26 |
| 2019-05-22 05:00:00 | 0.52 |
| 2019-05-22 06:00:00 | 0.26 |
| 2019-05-22 07:00:00 | 0.52 |
| 2019-05-22 08:00:00 | 0.26 |
| 2019-05-22 09:00:00 | 0.26 |
| 2019-05-22 10:00:00 | 0.52 |
| 2019-05-22 11:00:00 | 0.52 |
| 2019-05-22 12:00:00 | 0 |
| 2019-05-22 13:00:00 | 0.26 |
| 2019-05-22 14:00:00 | 0.26 |
| 2019-05-22 15:00:00 | 0.26 |
| 2019-05-22 16:00:00 | 0 |
| 2019-05-22 17:00:00 | 0.26 |
| 2019-05-22 18:00:00 | 0.26 |
| 2019-05-22 19:00:00 | 0 |
| 2019-05-22 20:00:00 | 12.48 |
| 2019-05-22 21:00:00 | 0 |
| 2019-05-22 22:00:00 | 0.26 |
| 2019-05-22 23:00:00 | 0.26 |
| 2019-05-23 | 0.26 |
| 2019-05-23 01:00:00 | 0.26 |
| 2019-05-23 02:00:00 | 0 |
| 2019-05-23 03:00:00 | 0.26 |
| 2019-05-23 04:00:00 | 0.26 |
| 2019-05-23 05:00:00 | 0.26 |
| 2019-05-23 06:00:00 | 0 |
| 2019-05-23 07:00:00 | 0.26 |
| 2019-05-23 08:00:00 | 0.26 |
| 2019-05-23 09:00:00 | 0 |
| 2019-05-23 10:00:00 | 0.26 |
| 2019-05-23 11:00:00 | 0.26 |
| 2019-05-23 12:00:00 | 0.26 |
| 2019-05-23 13:00:00 | 0 |
| 2019-05-23 14:00:00 | 0.26 |
| 2019-05-23 15:00:00 | 0.26 |
| 2019-05-23 16:00:00 | 0 |
| 2019-05-23 17:00:00 | 0.26 |
| 2019-05-23 18:00:00 | 0.26 |
| 2019-05-23 19:00:00 | 0.26 |
| 2019-05-23 20:00:00 | 0 |
| 2019-05-23 21:00:00 | 0.26 |
| 2019-05-23 22:00:00 | 0.26 |
| 2019-05-23 23:00:00 | 0 |
| 2019-05-24 | 0.26 |
| 2019-05-24 01:00:00 | 10.92 |
| 2019-05-24 02:00:00 | 0.26 |
| 2019-05-24 03:00:00 | 0.26 |
| 2019-05-24 04:00:00 | 0.26 |
| 2019-05-24 05:00:00 | 0 |
| 2019-05-24 06:00:00 | 0.26 |
| 2019-05-24 07:00:00 | 0.26 |
| 2019-05-24 08:00:00 | 0 |
| 2019-05-24 09:00:00 | 0.26 |
| 2019-05-24 10:00:00 | 0.26 |
| 2019-05-24 11:00:00 | 0.26 |
| 2019-05-24 12:00:00 | 0 |
| 2019-05-24 13:00:00 | 0.26 |
| 2019-05-24 14:00:00 | 0.26 |
| 2019-05-24 15:00:00 | 0 |
| 2019-05-24 16:00:00 | 0.26 |
| 2019-05-24 17:00:00 | 0.26 |
| 2019-05-24 18:00:00 | 0.26 |
| 2019-05-24 19:00:00 | 0 |
| 2019-05-24 20:00:00 | 0.26 |
| 2019-05-24 21:00:00 | 0.26 |
| 2019-05-24 22:00:00 | 0.26 |
| 2019-05-24 23:00:00 | 0 |
| 2019-05-25 | 0.26 |
| 2019-05-25 01:00:00 | 0.26 |
| 2019-05-25 02:00:00 | 0.26 |
| 2019-05-25 03:00:00 | 0 |
| 2019-05-25 04:00:00 | 0.26 |
| 2019-05-25 05:00:00 | 0.26 |
| 2019-05-25 06:00:00 | 0.26 |
| 2019-05-25 07:00:00 | 0 |
| 2019-05-25 08:00:00 | 0.26 |
| 2019-05-25 09:00:00 | 0.26 |
| 2019-05-25 10:00:00 | 0.26 |
| 2019-05-25 11:00:00 | 0 |
| 2019-05-25 12:00:00 | 0.26 |
| 2019-05-25 13:00:00 | 0.26 |
| 2019-05-25 14:00:00 | 0.26 |
| 2019-05-25 15:00:00 | 0.26 |
| 2019-05-25 16:00:00 | 0 |
| 2019-05-25 17:00:00 | 0.26 |
| 2019-05-25 18:00:00 | 0.26 |
| 2019-05-25 19:00:00 | 0 |
| 2019-05-25 20:00:00 | 0.26 |
| 2019-05-25 21:00:00 | 0.26 |
| 2019-05-25 22:00:00 | 0.26 |
| 2019-05-25 23:00:00 | 0.26 |
| 2019-05-26 | 0 |
| 2019-05-26 01:00:00 | 0.26 |
| 2019-05-26 02:00:00 | 0.26 |
| 2019-05-26 03:00:00 | 0.26 |
| 2019-05-26 04:00:00 | 0 |
| 2019-05-26 05:00:00 | 0.26 |
| 2019-05-26 06:00:00 | 0.26 |
| 2019-05-26 07:00:00 | 0.26 |
| 2019-05-26 08:00:00 | 0 |
| 2019-05-26 09:00:00 | 0.26 |
| 2019-05-26 10:00:00 | 0.26 |
| 2019-05-26 11:00:00 | 0 |
| 2019-05-26 12:00:00 | 0.26 |
| 2019-05-26 13:00:00 | 0.26 |
| 2019-05-26 14:00:00 | 0.26 |
| 2019-05-26 15:00:00 | 0.26 |
| 2019-05-26 16:00:00 | 0.26 |
| 2019-05-26 17:00:00 | 0 |
| 2019-05-26 18:00:00 | 0.26 |
| 2019-05-26 19:00:00 | 0.26 |
| 2019-05-26 20:00:00 | 0.26 |
| 2019-05-26 21:00:00 | 0 |
| 2019-05-26 22:00:00 | 0.26 |
| 2019-05-26 23:00:00 | 0.26 |
| 2019-05-27 | 0.26 |
| 2019-05-27 01:00:00 | 0 |
| 2019-05-27 02:00:00 | 0.26 |
| 2019-05-27 03:00:00 | 0.26 |
| 2019-05-27 04:00:00 | 0.26 |
| 2019-05-27 05:00:00 | 0.26 |
| 2019-05-27 06:00:00 | 0 |
| 2019-05-27 07:00:00 | 9.1 |
| 2019-05-27 08:00:00 | 2.34 |
| 2019-05-27 09:00:00 | 0.26 |
| 2019-05-27 10:00:00 | 0.26 |
| 2019-05-27 11:00:00 | 0.26 |
| 2019-05-27 12:00:00 | 0 |
| 2019-05-27 13:00:00 | 0.26 |
| 2019-05-27 14:00:00 | 0.26 |
| 2019-05-27 15:00:00 | 0.26 |
| 2019-05-27 16:00:00 | 0.26 |
| 2019-05-27 17:00:00 | 0 |
| 2019-05-27 18:00:00 | 0.26 |
| 2019-05-27 19:00:00 | 0.26 |
| 2019-05-27 20:00:00 | 0.26 |
| 2019-05-27 21:00:00 | 0 |
| 2019-05-27 22:00:00 | 0.26 |
| 2019-05-27 23:00:00 | 0.26 |
| 2019-05-28 | 0.26 |
| 2019-05-28 01:00:00 | 0.26 |
| 2019-05-28 02:00:00 | 0.26 |
| 2019-05-28 03:00:00 | 0 |
| 2019-05-28 04:00:00 | 0.26 |
| 2019-05-28 05:00:00 | 0.26 |
| 2019-05-28 06:00:00 | 0.26 |
| 2019-05-28 07:00:00 | 0 |
| 2019-05-28 08:00:00 | 0.26 |
| 2019-05-28 09:00:00 | 0.26 |
| 2019-05-28 10:00:00 | 0.26 |
| 2019-05-28 11:00:00 | 0 |
| 2019-05-28 12:00:00 | 0.26 |
| 2019-05-28 13:00:00 | 0.26 |
| 2019-05-28 14:00:00 | 0.26 |
| 2019-05-28 15:00:00 | 0 |
| 2019-05-28 16:00:00 | 0.26 |
| 2019-05-28 17:00:00 | 0.26 |
| 2019-05-28 18:00:00 | 0.26 |
| 2019-05-28 19:00:00 | 0 |
| 2019-05-28 20:00:00 | 0.26 |
| 2019-05-28 21:00:00 | 0.26 |
| 2019-05-28 22:00:00 | 0.26 |
| 2019-05-28 23:00:00 | 0 |
| 2019-05-29 | 0.26 |
| 2019-05-29 01:00:00 | 0.26 |
| 2019-05-29 02:00:00 | 0.26 |
| 2019-05-29 03:00:00 | 0.26 |
| 2019-05-29 04:00:00 | 0 |
| 2019-05-29 05:00:00 | 0 |
| 2019-05-29 06:00:00 | 0 |
| 2019-05-29 07:00:00 | 0.26 |
| 2019-05-29 08:00:00 | 0 |
| 2019-05-29 09:00:00 | 0.26 |
| 2019-05-29 10:00:00 | 0 |
| 2019-05-29 11:00:00 | 0.26 |
| 2019-05-29 12:00:00 | 0 |
| 2019-05-29 13:00:00 | 2.34 |
| 2019-05-29 14:00:00 | 0 |
| 2019-05-29 15:00:00 | 0.26 |
| 2019-05-29 16:00:00 | 0.26 |
| 2019-05-29 17:00:00 | 0.26 |
| 2019-05-29 18:00:00 | 0 |
| 2019-05-29 19:00:00 | 0.26 |
| 2019-05-29 20:00:00 | 0.26 |
| 2019-05-29 21:00:00 | 0.26 |
| 2019-05-29 22:00:00 | 0 |
| 2019-05-29 23:00:00 | 0.26 |
| 2019-05-30 | 0.26 |
| 2019-05-30 01:00:00 | 0.26 |
| 2019-05-30 02:00:00 | 0 |
| 2019-05-30 03:00:00 | 0.26 |
| 2019-05-30 04:00:00 | 0.26 |
| 2019-05-30 05:00:00 | 0.26 |
| 2019-05-30 06:00:00 | 0 |
| 2019-05-30 07:00:00 | 0.26 |
| 2019-05-30 08:00:00 | 0.26 |
| 2019-05-30 09:00:00 | 0.26 |
| 2019-05-30 10:00:00 | 0 |
| 2019-05-30 11:00:00 | 0.26 |
| 2019-05-30 12:00:00 | 0.26 |
| 2019-05-30 13:00:00 | 0.26 |
| 2019-05-30 14:00:00 | 0.26 |
| 2019-05-30 15:00:00 | 0.26 |
| 2019-05-30 16:00:00 | 0 |
| 2019-05-30 17:00:00 | 0.26 |
| 2019-05-30 18:00:00 | 0.26 |
| 2019-05-30 19:00:00 | 0 |
| 2019-05-30 20:00:00 | 0.26 |
| 2019-05-30 21:00:00 | 1.04 |
| 2019-05-30 22:00:00 | 10.4 |
| 2019-05-30 23:00:00 | 0 |
| 2019-05-31 | 0.26 |
| 2019-05-31 01:00:00 | 0.26 |
| 2019-05-31 02:00:00 | 0.26 |
| 2019-05-31 03:00:00 | 0.26 |
| 2019-05-31 04:00:00 | 0 |
| 2019-05-31 05:00:00 | 0.26 |
| 2019-05-31 06:00:00 | 0.26 |
| 2019-05-31 07:00:00 | 0.26 |
| 2019-05-31 08:00:00 | 0 |
| 2019-05-31 09:00:00 | 0.26 |
| 2019-05-31 10:00:00 | 0.26 |
| 2019-05-31 11:00:00 | 0 |
| 2019-05-31 12:00:00 | 0.26 |
| 2019-05-31 13:00:00 | 0.26 |
| 2019-05-31 14:00:00 | 0 |
| 2019-05-31 15:00:00 | 0.26 |
| 2019-05-31 16:00:00 | 0.26 |
| 2019-05-31 17:00:00 | 0.26 |
| 2019-05-31 18:00:00 | 0 |
| 2019-05-31 19:00:00 | 0.26 |
| 2019-05-31 20:00:00 | 0.26 |
| 2019-05-31 21:00:00 | 0 |
| 2019-05-31 22:00:00 | 0.26 |
| 2019-05-31 23:00:00 | 0.26 |
| 2019-06-01 | 0.26 |
| 2019-06-01 01:00:00 | 0.26 |
| 2019-06-01 02:00:00 | 0 |
| 2019-06-01 03:00:00 | 0.26 |
| 2019-06-01 04:00:00 | 0.26 |
| 2019-06-01 05:00:00 | 0.26 |
| 2019-06-01 06:00:00 | 0 |
| 2019-06-01 07:00:00 | 0.26 |
| 2019-06-01 08:00:00 | 0.26 |
| 2019-06-01 09:00:00 | 0.26 |
| 2019-06-01 10:00:00 | 0 |
| 2019-06-01 11:00:00 | 0.26 |
| 2019-06-01 12:00:00 | 0.26 |
| 2019-06-01 13:00:00 | 0 |
| 2019-06-01 14:00:00 | 0.26 |
| 2019-06-01 15:00:00 | 0.26 |
| 2019-06-01 16:00:00 | 0.26 |
| 2019-06-01 17:00:00 | 0 |
| 2019-06-01 18:00:00 | 0.26 |
| 2019-06-01 19:00:00 | 0.26 |
| 2019-06-01 20:00:00 | 0 |
| 2019-06-01 21:00:00 | 0.26 |
| 2019-06-01 22:00:00 | 0.26 |
| 2019-06-01 23:00:00 | 0.26 |
| 2019-06-02 | 0 |
| 2019-06-02 01:00:00 | 0.26 |
| 2019-06-02 02:00:00 | 0.26 |
| 2019-06-02 03:00:00 | 0.26 |
| 2019-06-02 04:00:00 | 0 |
| 2019-06-02 05:00:00 | 0.26 |
| 2019-06-02 06:00:00 | 0.26 |
| 2019-06-02 07:00:00 | 0.26 |
| 2019-06-02 08:00:00 | 0 |
| 2019-06-02 09:00:00 | 0.26 |
| 2019-06-02 10:00:00 | 0.26 |
| 2019-06-02 11:00:00 | 0 |
| 2019-06-02 12:00:00 | 0.26 |
| 2019-06-02 13:00:00 | 0.26 |
| 2019-06-02 14:00:00 | 0.26 |
| 2019-06-02 15:00:00 | 0 |
| 2019-06-02 16:00:00 | 0.26 |
| 2019-06-02 17:00:00 | 0.26 |
| 2019-06-02 18:00:00 | 0 |
| 2019-06-02 19:00:00 | 0.26 |
| 2019-06-02 20:00:00 | 0.26 |
| 2019-06-02 21:00:00 | 0.26 |
| 2019-06-02 22:00:00 | 10.4 |
| 2019-06-02 23:00:00 | 0.52 |
| 2019-06-03 | 0.26 |
| 2019-06-03 01:00:00 | 0.26 |
| 2019-06-03 02:00:00 | 0.26 |
| 2019-06-03 03:00:00 | 0 |
| 2019-06-03 04:00:00 | 0.26 |
| 2019-06-03 05:00:00 | 0.26 |
| 2019-06-03 06:00:00 | 0.26 |
| 2019-06-03 07:00:00 | 0 |
| 2019-06-03 08:00:00 | 0.26 |
| 2019-06-03 09:00:00 | 0.26 |
| 2019-06-03 10:00:00 | 0 |
| 2019-06-03 11:00:00 | 0.26 |
| 2019-06-03 12:00:00 | 0.26 |
| 2019-06-03 13:00:00 | 0.26 |
| 2019-06-03 14:00:00 | 0 |
| 2019-06-03 15:00:00 | 0.26 |
| 2019-06-03 16:00:00 | 0.26 |
| 2019-06-03 17:00:00 | 0 |
| 2019-06-03 18:00:00 | 0.26 |
| 2019-06-03 19:00:00 | 0.26 |
| 2019-06-03 20:00:00 | 0.26 |
| 2019-06-03 21:00:00 | 0 |
| 2019-06-03 22:00:00 | 0.26 |
| 2019-06-03 23:00:00 | 0.26 |
| 2019-06-04 | 0.26 |
| 2019-06-04 01:00:00 | 0.26 |
| 2019-06-04 02:00:00 | 0 |
| 2019-06-04 03:00:00 | 0.26 |
| 2019-06-04 04:00:00 | 0.26 |
| 2019-06-04 05:00:00 | 0.26 |
| 2019-06-04 06:00:00 | 0 |
| 2019-06-04 07:00:00 | 0.26 |
| 2019-06-04 08:00:00 | 0.26 |
| 2019-06-04 09:00:00 | 0.26 |
| 2019-06-04 10:00:00 | 0 |
| 2019-06-04 11:00:00 | 0.26 |
| 2019-06-04 12:00:00 | 0.26 |
| 2019-06-04 13:00:00 | 0.26 |
| 2019-06-04 14:00:00 | 0 |
| 2019-06-04 15:00:00 | 0.26 |
| 2019-06-04 16:00:00 | 0.26 |
| 2019-06-04 17:00:00 | 0.26 |
| 2019-06-04 18:00:00 | 0 |
| 2019-06-04 19:00:00 | 0.26 |
| 2019-06-04 20:00:00 | 0.26 |
| 2019-06-04 21:00:00 | 0.26 |
| 2019-06-04 22:00:00 | 0 |
| 2019-06-04 23:00:00 | 0.26 |
| 2019-06-05 | 0.26 |
| 2019-06-05 01:00:00 | 0.26 |
| 2019-06-05 02:00:00 | 0.26 |
| 2019-06-05 03:00:00 | 0 |
| 2019-06-05 04:00:00 | 0.26 |
| 2019-06-05 05:00:00 | 0.26 |
| 2019-06-05 06:00:00 | 0.26 |
| 2019-06-05 07:00:00 | 0 |
| 2019-06-05 08:00:00 | 0.26 |
| 2019-06-05 09:00:00 | 0.26 |
| 2019-06-05 10:00:00 | 0.26 |
| 2019-06-05 11:00:00 | 0 |
| 2019-06-05 12:00:00 | 0.78 |
| 2019-06-05 13:00:00 | 0.26 |
| 2019-06-05 14:00:00 | 0.26 |
| 2019-06-05 15:00:00 | 0 |
| 2019-06-05 16:00:00 | 0.26 |
| 2019-06-05 17:00:00 | 0.26 |
| 2019-06-05 18:00:00 | 0.26 |
| 2019-06-05 19:00:00 | 0 |
| 2019-06-05 20:00:00 | 0.26 |
| 2019-06-05 21:00:00 | 0.26 |
| 2019-06-05 22:00:00 | 0.26 |
| 2019-06-05 23:00:00 | 0.26 |
| 2019-06-06 | 0 |
| 2019-06-06 01:00:00 | 0.26 |
| 2019-06-06 02:00:00 | 0.26 |
| 2019-06-06 03:00:00 | 0.26 |
| 2019-06-06 04:00:00 | 0.26 |
| 2019-06-06 05:00:00 | 0 |
| 2019-06-06 06:00:00 | 0.26 |
| 2019-06-06 07:00:00 | 0.26 |
| 2019-06-06 08:00:00 | 0 |
| 2019-06-06 09:00:00 | 0.26 |
| 2019-06-06 10:00:00 | 0.26 |
| 2019-06-06 11:00:00 | 0.26 |
| 2019-06-06 12:00:00 | 0.26 |
| 2019-06-06 13:00:00 | 0 |
| 2019-06-06 14:00:00 | 0.26 |
| 2019-06-06 15:00:00 | 0.26 |
| 2019-06-06 16:00:00 | 0.26 |
| 2019-06-06 17:00:00 | 0 |
| 2019-06-06 18:00:00 | 0.26 |
| 2019-06-06 19:00:00 | 0.26 |
| 2019-06-06 20:00:00 | 0.26 |
| 2019-06-06 21:00:00 | 0.26 |
| 2019-06-06 22:00:00 | 0 |
| 2019-06-06 23:00:00 | 0.26 |
| 2019-06-07 | 0.26 |
| 2019-06-07 01:00:00 | 0.26 |
| 2019-06-07 02:00:00 | 0.26 |
| 2019-06-07 03:00:00 | 0.26 |
| 2019-06-07 04:00:00 | 0 |
| 2019-06-07 05:00:00 | 0.26 |
| 2019-06-07 06:00:00 | 0.26 |
| 2019-06-07 07:00:00 | 0.26 |
| 2019-06-07 08:00:00 | 0 |
| 2019-06-07 09:00:00 | 0.26 |
| 2019-06-07 10:00:00 | 0.26 |
| 2019-06-07 11:00:00 | 0.26 |
| 2019-06-07 12:00:00 | 0 |
| 2019-06-07 13:00:00 | 0.26 |
| 2019-06-07 14:00:00 | 0.26 |
| 2019-06-07 15:00:00 | 0 |
| 2019-06-07 16:00:00 | 0.26 |
| 2019-06-07 17:00:00 | 0.26 |
| 2019-06-07 18:00:00 | 0.26 |
| 2019-06-07 19:00:00 | 0 |
| 2019-06-07 20:00:00 | 0.26 |
| 2019-06-07 21:00:00 | 0.26 |
| 2019-06-07 22:00:00 | 0.26 |
| 2019-06-07 23:00:00 | 0 |
| 2019-06-08 | 0.26 |
| 2019-06-08 01:00:00 | 0.26 |
| 2019-06-08 02:00:00 | 0.26 |
| 2019-06-08 03:00:00 | 10.92 |
| 2019-06-08 04:00:00 | 0.26 |
| 2019-06-08 05:00:00 | 0.26 |
| 2019-06-08 06:00:00 | 0.26 |
| 2019-06-08 07:00:00 | 0 |
| 2019-06-08 08:00:00 | 0.26 |
| 2019-06-08 09:00:00 | 0.26 |
| 2019-06-08 10:00:00 | 0 |
| 2019-06-08 11:00:00 | 0.26 |
| 2019-06-08 12:00:00 | 0.26 |
| 2019-06-08 13:00:00 | 0.26 |
| 2019-06-08 14:00:00 | 0 |
| 2019-06-08 15:00:00 | 0.26 |
| 2019-06-08 16:00:00 | 0.26 |
| 2019-06-08 17:00:00 | 0 |
| 2019-06-08 18:00:00 | 0.26 |
| 2019-06-08 19:00:00 | 0.26 |
| 2019-06-08 20:00:00 | 0.26 |
| 2019-06-08 21:00:00 | 0 |
| 2019-06-08 22:00:00 | 0.26 |
| 2019-06-08 23:00:00 | 0.26 |
| 2019-06-09 | 0.26 |
| 2019-06-09 01:00:00 | 0 |
| 2019-06-09 02:00:00 | 0.26 |
| 2019-06-09 03:00:00 | 0.26 |
| 2019-06-09 04:00:00 | 0.26 |
| 2019-06-09 05:00:00 | 0 |
| 2019-06-09 06:00:00 | 0.26 |
| 2019-06-09 07:00:00 | 0.26 |
| 2019-06-09 08:00:00 | 0.26 |
| 2019-06-09 09:00:00 | 0 |
| 2019-06-09 10:00:00 | 0.26 |
| 2019-06-09 11:00:00 | 0.26 |
| 2019-06-09 12:00:00 | 0 |
| 2019-06-09 13:00:00 | 0.26 |
| 2019-06-09 14:00:00 | 0.26 |
| 2019-06-09 15:00:00 | 0.26 |
| 2019-06-09 16:00:00 | 0 |
| 2019-06-09 17:00:00 | 0.26 |
| 2019-06-09 18:00:00 | 0.26 |
| 2019-06-09 19:00:00 | 0 |
| 2019-06-09 20:00:00 | 0.26 |
| 2019-06-09 21:00:00 | 0.26 |
| 2019-06-09 22:00:00 | 0 |
| 2019-06-09 23:00:00 | 0.26 |
| 2019-06-10 | 0.26 |
| 2019-06-10 01:00:00 | 0.26 |
| 2019-06-10 02:00:00 | 0.26 |
| 2019-06-10 03:00:00 | 0 |
| 2019-06-10 04:00:00 | 0.26 |
| 2019-06-10 05:00:00 | 0.26 |
| 2019-06-10 06:00:00 | 0.26 |
| 2019-06-10 07:00:00 | 0 |
| 2019-06-10 08:00:00 | 0.26 |
| 2019-06-10 09:00:00 | 0.26 |
| 2019-06-10 10:00:00 | 0.26 |
| 2019-06-10 11:00:00 | 0 |
| 2019-06-10 12:00:00 | 0.26 |
| 2019-06-10 13:00:00 | 0.26 |
| 2019-06-10 14:00:00 | 0 |
| 2019-06-10 15:00:00 | 0.26 |
| 2019-06-10 16:00:00 | 0.26 |
| 2019-06-10 17:00:00 | 0.26 |
| 2019-06-10 18:00:00 | 0.26 |
| 2019-06-10 19:00:00 | 0 |
| 2019-06-10 20:00:00 | 0.26 |
| 2019-06-10 21:00:00 | 0.26 |
| 2019-06-10 22:00:00 | 0.26 |
| 2019-06-10 23:00:00 | 0.26 |
| 2019-06-11 | 0 |
| 2019-06-11 01:00:00 | 0.26 |
| 2019-06-11 02:00:00 | 0.26 |
| 2019-06-11 03:00:00 | 0.26 |
| 2019-06-11 04:00:00 | 0 |
| 2019-06-11 05:00:00 | 0.26 |
| 2019-06-11 06:00:00 | 0.26 |
| 2019-06-11 07:00:00 | 0.26 |
| 2019-06-11 08:00:00 | 0 |
| 2019-06-11 09:00:00 | 0.26 |
| 2019-06-11 10:00:00 | 0.26 |
| 2019-06-11 11:00:00 | 0 |
| 2019-06-11 12:00:00 | 0.26 |
| 2019-06-11 13:00:00 | 0.26 |
| 2019-06-11 14:00:00 | 0.26 |
| 2019-06-11 15:00:00 | 0.26 |
| 2019-06-11 16:00:00 | 0 |
| 2019-06-11 17:00:00 | 0.26 |
| 2019-06-11 18:00:00 | 0.26 |
| 2019-06-11 19:00:00 | 0.26 |
| 2019-06-11 20:00:00 | 0.26 |
| 2019-06-11 21:00:00 | 0 |
| 2019-06-11 22:00:00 | 0.26 |
| 2019-06-11 23:00:00 | 0.26 |
| 2019-06-12 | 0.26 |
| 2019-06-12 01:00:00 | 0.26 |
| 2019-06-12 02:00:00 | 0.26 |
| 2019-06-12 03:00:00 | 0 |
| 2019-06-12 04:00:00 | 0.26 |
| 2019-06-12 05:00:00 | 0.26 |
| 2019-06-12 06:00:00 | 0.26 |
| 2019-06-12 07:00:00 | 0 |
| 2019-06-12 08:00:00 | 0.26 |
| 2019-06-12 09:00:00 | 0.26 |
| 2019-06-12 10:00:00 | 0 |
| 2019-06-12 11:00:00 | 0.26 |
| 2019-06-12 12:00:00 | 0.78 |
| 2019-06-12 13:00:00 | 0.26 |
| 2019-06-12 14:00:00 | 0.26 |
| 2019-06-12 15:00:00 | 0 |
| 2019-06-12 16:00:00 | 0.26 |
| 2019-06-12 17:00:00 | 0.26 |
| 2019-06-12 18:00:00 | 0.26 |
| 2019-06-12 19:00:00 | 0.26 |
| 2019-06-12 20:00:00 | 0.26 |
| 2019-06-12 21:00:00 | 10.4 |
| 2019-06-12 22:00:00 | 0.26 |
| 2019-06-12 23:00:00 | 0.26 |
| 2019-06-13 | 0.26 |
| 2019-06-13 01:00:00 | 0.26 |
| 2019-06-13 02:00:00 | 0.26 |
| 2019-06-13 03:00:00 | 0.26 |
| 2019-06-13 04:00:00 | 0 |
| 2019-06-13 05:00:00 | 0.26 |
| 2019-06-13 06:00:00 | 0.26 |
| 2019-06-13 07:00:00 | 0.26 |
| 2019-06-13 08:00:00 | 0.26 |
| 2019-06-13 09:00:00 | 0 |
| 2019-06-13 10:00:00 | 0.26 |
| 2019-06-13 11:00:00 | 0.26 |
| 2019-06-13 12:00:00 | 0.26 |
| 2019-06-13 13:00:00 | 0.26 |
| 2019-06-13 14:00:00 | 0.26 |
| 2019-06-13 15:00:00 | 0 |
| 2019-06-13 16:00:00 | 0.26 |
| 2019-06-13 17:00:00 | 0.26 |
| 2019-06-13 18:00:00 | 0.26 |
| 2019-06-13 19:00:00 | 0.26 |
| 2019-06-13 20:00:00 | 0 |
| 2019-06-13 21:00:00 | 0.26 |
| 2019-06-13 22:00:00 | 0.26 |
| 2019-06-13 23:00:00 | 0.26 |
| 2019-06-14 | 0.26 |
| 2019-06-14 01:00:00 | 0.26 |
| 2019-06-14 02:00:00 | 0.26 |
| 2019-06-14 03:00:00 | 0 |
| 2019-06-14 04:00:00 | 0.26 |
| 2019-06-14 05:00:00 | 0.26 |
| 2019-06-14 06:00:00 | 0.26 |
| 2019-06-14 07:00:00 | 0.26 |
| 2019-06-14 08:00:00 | 0.26 |
| 2019-06-14 09:00:00 | 0 |
| 2019-06-14 10:00:00 | 0.26 |
| 2019-06-14 11:00:00 | 0.26 |
| 2019-06-14 12:00:00 | 0.26 |
| 2019-06-14 13:00:00 | 0.26 |
| 2019-06-14 14:00:00 | 0 |
| 2019-06-14 15:00:00 | 0.26 |
| 2019-06-14 16:00:00 | 0.26 |
| 2019-06-14 17:00:00 | 0.26 |
| 2019-06-14 18:00:00 | 0.26 |
| 2019-06-14 19:00:00 | 0 |
| 2019-06-14 20:00:00 | 0.26 |
| 2019-06-14 21:00:00 | 0.26 |
| 2019-06-14 22:00:00 | 0.26 |
| 2019-06-14 23:00:00 | 0.26 |
| 2019-06-15 | 0.26 |
| 2019-06-15 01:00:00 | 0 |
| 2019-06-15 02:00:00 | 0.26 |
| 2019-06-15 03:00:00 | 0.26 |
| 2019-06-15 04:00:00 | 0.26 |
| 2019-06-15 05:00:00 | 0.26 |
| 2019-06-15 06:00:00 | 0.26 |
| 2019-06-15 07:00:00 | 0 |
| 2019-06-15 08:00:00 | 0.26 |
| 2019-06-15 09:00:00 | 0.26 |
| 2019-06-15 10:00:00 | 0.26 |
| 2019-06-15 11:00:00 | 0.26 |
| 2019-06-15 12:00:00 | 0 |
| 2019-06-15 13:00:00 | 0.26 |
| 2019-06-15 14:00:00 | 0.26 |
| 2019-06-15 15:00:00 | 0.26 |
| 2019-06-15 16:00:00 | 0.26 |
| 2019-06-15 17:00:00 | 0.26 |
| 2019-06-15 18:00:00 | 0 |
| 2019-06-15 19:00:00 | 5.2 |
| 2019-06-15 20:00:00 | 6.24 |
| 2019-06-15 21:00:00 | 0.26 |
| 2019-06-15 22:00:00 | 0.26 |
| 2019-06-15 23:00:00 | 0.26 |
| 2019-06-16 | 0 |
| 2019-06-16 01:00:00 | 0.26 |
| 2019-06-16 02:00:00 | 0.26 |
| 2019-06-16 03:00:00 | 0.26 |
| 2019-06-16 04:00:00 | 0.26 |
| 2019-06-16 05:00:00 | 0.26 |
| 2019-06-16 06:00:00 | 0 |
| 2019-06-16 07:00:00 | 0.26 |
| 2019-06-16 08:00:00 | 0.26 |
| 2019-06-16 09:00:00 | 0.26 |
| 2019-06-16 10:00:00 | 0.26 |
| 2019-06-16 11:00:00 | 0 |
| 2019-06-16 12:00:00 | 0.26 |
| 2019-06-16 13:00:00 | 0.26 |
| 2019-06-16 14:00:00 | 0.26 |
| 2019-06-16 15:00:00 | 0.26 |
| 2019-06-16 16:00:00 | 0.26 |
| 2019-06-16 17:00:00 | 0 |
| 2019-06-16 18:00:00 | 0.26 |
| 2019-06-16 19:00:00 | 0.26 |
| 2019-06-16 20:00:00 | 0.26 |
| 2019-06-16 21:00:00 | 0.26 |
| 2019-06-16 22:00:00 | 0.26 |
| 2019-06-16 23:00:00 | 0 |
| 2019-06-17 | 0.26 |
| 2019-06-17 01:00:00 | 0.26 |
| 2019-06-17 02:00:00 | 0.26 |
| 2019-06-17 03:00:00 | 0.26 |
| 2019-06-17 04:00:00 | 0.26 |
| 2019-06-17 05:00:00 | 0 |
| 2019-06-17 06:00:00 | 0.26 |
| 2019-06-17 07:00:00 | 0.26 |
| 2019-06-17 08:00:00 | 0.26 |
| 2019-06-17 09:00:00 | 0.26 |
| 2019-06-17 10:00:00 | 0.26 |
| 2019-06-17 11:00:00 | 0 |
| 2019-06-17 12:00:00 | 0.26 |
| 2019-06-17 13:00:00 | 0.26 |
| 2019-06-17 14:00:00 | 0.26 |
| 2019-06-17 15:00:00 | 0.26 |
| 2019-06-17 16:00:00 | 0 |
| 2019-06-17 17:00:00 | 0.26 |
| 2019-06-17 18:00:00 | 0.26 |
| 2019-06-17 19:00:00 | 0.26 |
| 2019-06-17 20:00:00 | 0.26 |
| 2019-06-17 21:00:00 | 0.26 |
| 2019-06-17 22:00:00 | 0 |
| 2019-06-17 23:00:00 | 0.26 |
| 2019-06-18 | 0.26 |
| 2019-06-18 01:00:00 | 0.26 |
| 2019-06-18 02:00:00 | 0.26 |
| 2019-06-18 03:00:00 | 0.26 |
| 2019-06-18 04:00:00 | 0 |
| 2019-06-18 05:00:00 | 0.26 |
| 2019-06-18 06:00:00 | 0.26 |
| 2019-06-18 07:00:00 | 0.26 |
| 2019-06-18 08:00:00 | 0.26 |
| 2019-06-18 09:00:00 | 0.26 |
| 2019-06-18 10:00:00 | 0 |
| 2019-06-18 11:00:00 | 0.26 |
| 2019-06-18 12:00:00 | 0.26 |
| 2019-06-18 13:00:00 | 0.26 |
| 2019-06-18 14:00:00 | 0.26 |
| 2019-06-18 15:00:00 | 0.26 |
| 2019-06-18 16:00:00 | 0 |
| 2019-06-18 17:00:00 | 0.26 |
| 2019-06-18 18:00:00 | 0.26 |
| 2019-06-18 19:00:00 | 0.26 |
| 2019-06-18 20:00:00 | 0 |
| 2019-06-18 21:00:00 | 0.26 |
| 2019-06-18 22:00:00 | 0.26 |
| 2019-06-18 23:00:00 | 0.26 |
| 2019-06-19 | 0.26 |
| 2019-06-19 01:00:00 | 0.26 |
| 2019-06-19 02:00:00 | 0 |
| 2019-06-19 03:00:00 | 0.26 |
| 2019-06-19 04:00:00 | 0.26 |
| 2019-06-19 05:00:00 | 0.26 |
| 2019-06-19 06:00:00 | 0.26 |
| 2019-06-19 07:00:00 | 0.26 |
| 2019-06-19 08:00:00 | 0 |
| 2019-06-19 09:00:00 | 0.26 |
| 2019-06-19 10:00:00 | 0.26 |
| 2019-06-19 11:00:00 | 0.26 |
| 2019-06-19 12:00:00 | 0.78 |
| 2019-06-19 13:00:00 | 0 |
| 2019-06-19 14:00:00 | 0.26 |
| 2019-06-19 15:00:00 | 0.26 |
| 2019-06-19 16:00:00 | 0.26 |
| 2019-06-19 17:00:00 | 0.26 |
| 2019-06-19 18:00:00 | 0 |
| 2019-06-19 19:00:00 | 0.26 |
| 2019-06-19 20:00:00 | 6.5 |
| 2019-06-19 21:00:00 | 4.42 |
| 2019-06-19 22:00:00 | 0.26 |
| 2019-06-19 23:00:00 | 0.26 |
| 2019-06-20 | 0.26 |
| 2019-06-20 01:00:00 | 0.26 |
| 2019-06-20 02:00:00 | 0 |
| 2019-06-20 03:00:00 | 0.26 |
| 2019-06-20 04:00:00 | 0.26 |
| 2019-06-20 05:00:00 | 0.26 |
| 2019-06-20 06:00:00 | 0.26 |
| 2019-06-20 07:00:00 | 0 |
| 2019-06-20 08:00:00 | 0.26 |
| 2019-06-20 09:00:00 | 0.26 |
| 2019-06-20 10:00:00 | 0.26 |
| 2019-06-20 11:00:00 | 0.26 |
| 2019-06-20 12:00:00 | 0.26 |
| 2019-06-20 13:00:00 | 0 |
| 2019-06-20 14:00:00 | 0.26 |
| 2019-06-20 15:00:00 | 0.26 |
| 2019-06-20 16:00:00 | 0.26 |
| 2019-06-20 17:00:00 | 0.26 |
| 2019-06-20 18:00:00 | 0.26 |
| 2019-06-20 19:00:00 | 0 |
| 2019-06-20 20:00:00 | 0.26 |
| 2019-06-20 21:00:00 | 0.26 |
| 2019-06-20 22:00:00 | 0.26 |
| 2019-06-20 23:00:00 | 0.26 |
| 2019-06-21 | 0.26 |
| 2019-06-21 01:00:00 | 0 |
| 2019-06-21 02:00:00 | 0.26 |
| 2019-06-21 03:00:00 | 0.26 |
| 2019-06-21 04:00:00 | 0.26 |
| 2019-06-21 05:00:00 | 0.26 |
| 2019-06-21 06:00:00 | 0.26 |
| 2019-06-21 07:00:00 | 0 |
| 2019-06-21 08:00:00 | 0.26 |
| 2019-06-21 09:00:00 | 11.18 |
| 2019-06-21 10:00:00 | 0.26 |
| 2019-06-21 11:00:00 | 0.26 |
| 2019-06-21 12:00:00 | 0.26 |
| 2019-06-21 13:00:00 | 0.26 |
| 2019-06-21 14:00:00 | 0 |
| 2019-06-21 15:00:00 | 0.26 |
| 2019-06-21 16:00:00 | 0.26 |
| 2019-06-21 17:00:00 | 0.26 |
| 2019-06-21 18:00:00 | 0.26 |
| 2019-06-21 19:00:00 | 0.26 |
| 2019-06-21 20:00:00 | 0 |
| 2019-06-21 21:00:00 | 0.26 |
| 2019-06-21 22:00:00 | 0.26 |
| 2019-06-21 23:00:00 | 0.26 |
| 2019-06-22 | 0.26 |
| 2019-06-22 01:00:00 | 0.26 |
| 2019-06-22 02:00:00 | 0 |
| 2019-06-22 03:00:00 | 0.26 |
| 2019-06-22 04:00:00 | 0.26 |
| 2019-06-22 05:00:00 | 0.26 |
| 2019-06-22 06:00:00 | 0.26 |
| 2019-06-22 07:00:00 | 0 |
| 2019-06-22 08:00:00 | 0.26 |
| 2019-06-22 09:00:00 | 0.26 |
| 2019-06-22 10:00:00 | 0.26 |
| 2019-06-22 11:00:00 | 0.26 |
| 2019-06-22 12:00:00 | 0.26 |
| 2019-06-22 13:00:00 | 0 |
| 2019-06-22 14:00:00 | 0.26 |
| 2019-06-22 15:00:00 | 0.26 |
| 2019-06-22 16:00:00 | 0.26 |
| 2019-06-22 17:00:00 | 0.26 |
| 2019-06-22 18:00:00 | 0.26 |
| 2019-06-22 19:00:00 | 0 |
| 2019-06-22 20:00:00 | 0.26 |
| 2019-06-22 21:00:00 | 0.26 |
| 2019-06-22 22:00:00 | 0.26 |
| 2019-06-22 23:00:00 | 0.26 |
| 2019-06-23 | 0.26 |
| 2019-06-23 01:00:00 | 0 |
| 2019-06-23 02:00:00 | 0.26 |
| 2019-06-23 03:00:00 | 0.26 |
| 2019-06-23 04:00:00 | 0.26 |
| 2019-06-23 05:00:00 | 0.26 |
| 2019-06-23 06:00:00 | 0.26 |
| 2019-06-23 07:00:00 | 0.26 |
| 2019-06-23 08:00:00 | 0 |
| 2019-06-23 09:00:00 | 0.26 |
| 2019-06-23 10:00:00 | 0.26 |
| 2019-06-23 11:00:00 | 0.26 |
| 2019-06-23 12:00:00 | 0.26 |
| 2019-06-23 13:00:00 | 0 |
| 2019-06-23 14:00:00 | 0.26 |
| 2019-06-23 15:00:00 | 0.26 |
| 2019-06-23 16:00:00 | 0.26 |
| 2019-06-23 17:00:00 | 0.26 |
| 2019-06-23 18:00:00 | 0.26 |
| 2019-06-23 19:00:00 | 0 |
| 2019-06-23 20:00:00 | 0.26 |
| 2019-06-23 21:00:00 | 0.26 |
| 2019-06-23 22:00:00 | 0.26 |
| 2019-06-23 23:00:00 | 0.26 |
| 2019-06-24 | 0.26 |
| 2019-06-24 01:00:00 | 0 |
| 2019-06-24 02:00:00 | 0.26 |
| 2019-06-24 03:00:00 | 0.26 |
| 2019-06-24 04:00:00 | 0.26 |
| 2019-06-24 05:00:00 | 0.26 |
| 2019-06-24 06:00:00 | 0.26 |
| 2019-06-24 07:00:00 | 0 |
| 2019-06-24 08:00:00 | 0.26 |
| 2019-06-24 09:00:00 | 0.26 |
| 2019-06-24 10:00:00 | 0.26 |
| 2019-06-24 11:00:00 | 0.26 |
| 2019-06-24 12:00:00 | 0.26 |
| 2019-06-24 13:00:00 | 0 |
| 2019-06-24 14:00:00 | 0.26 |
| 2019-06-24 15:00:00 | 0.26 |
| 2019-06-24 16:00:00 | 0.26 |
| 2019-06-24 17:00:00 | 0.26 |
| 2019-06-24 18:00:00 | 0 |
| 2019-06-24 19:00:00 | 0.26 |
| 2019-06-24 20:00:00 | 0.26 |
| 2019-06-24 21:00:00 | 0.26 |
| 2019-06-24 22:00:00 | 0.26 |
| 2019-06-24 23:00:00 | 0.26 |
| 2019-06-25 | 0 |
| 2019-06-25 01:00:00 | 0.26 |
| 2019-06-25 02:00:00 | 0.26 |
| 2019-06-25 03:00:00 | 11.18 |
| 2019-06-25 04:00:00 | 0.26 |
| 2019-06-25 05:00:00 | 0.26 |
| 2019-06-25 06:00:00 | 0 |
| 2019-06-25 07:00:00 | 0.26 |
| 2019-06-25 08:00:00 | 0.26 |
| 2019-06-25 09:00:00 | 0.26 |
| 2019-06-25 10:00:00 | 0.26 |
| 2019-06-25 11:00:00 | 1.04 |
| 2019-06-25 12:00:00 | 0.26 |
| 2019-06-25 13:00:00 | 0.26 |
| 2019-06-25 14:00:00 | 0 |
| 2019-06-25 15:00:00 | 0.26 |
| 2019-06-25 16:00:00 | 0.26 |
| 2019-06-25 17:00:00 | 0.26 |
| 2019-06-25 18:00:00 | 0.26 |
| 2019-06-25 19:00:00 | 0.26 |
| 2019-06-25 20:00:00 | 0 |
| 2019-06-25 21:00:00 | 0.26 |
| 2019-06-25 22:00:00 | 0.26 |
| 2019-06-25 23:00:00 | 0.26 |
| 2019-06-26 | 0.26 |
| 2019-06-26 01:00:00 | 0.26 |
| 2019-06-26 02:00:00 | 0.26 |
| 2019-06-26 03:00:00 | 0 |
| 2019-06-26 04:00:00 | 0.26 |
| 2019-06-26 05:00:00 | 0.26 |
| 2019-06-26 06:00:00 | 0.26 |
| 2019-06-26 07:00:00 | 0.26 |
| 2019-06-26 08:00:00 | 0 |
| 2019-06-26 09:00:00 | 0.26 |
| 2019-06-26 10:00:00 | 0.26 |
| 2019-06-26 11:00:00 | 0.26 |
| 2019-06-26 12:00:00 | 0.26 |
| 2019-06-26 13:00:00 | 0.26 |
| 2019-06-26 14:00:00 | 0.26 |
| 2019-06-26 15:00:00 | 0.26 |
| 2019-06-26 16:00:00 | 0 |
| 2019-06-26 17:00:00 | 0.26 |
| 2019-06-26 18:00:00 | 0.26 |
| 2019-06-26 19:00:00 | 0.26 |
| 2019-06-26 20:00:00 | 0.26 |
| 2019-06-26 21:00:00 | 0 |
| 2019-06-26 22:00:00 | 0.26 |
| 2019-06-26 23:00:00 | 0.26 |
| 2019-06-27 | 0.26 |
| 2019-06-27 01:00:00 | 0.26 |
| 2019-06-27 02:00:00 | 0.26 |
| 2019-06-27 03:00:00 | 0.26 |
| 2019-06-27 04:00:00 | 0 |
| 2019-06-27 05:00:00 | 0.26 |
| 2019-06-27 06:00:00 | 0.26 |
| 2019-06-27 07:00:00 | 0.26 |
| 2019-06-27 08:00:00 | 0.26 |
| 2019-06-27 09:00:00 | 0.26 |
| 2019-06-27 10:00:00 | 0 |
| 2019-06-27 11:00:00 | 0.26 |
| 2019-06-27 12:00:00 | 0.26 |
| 2019-06-27 13:00:00 | 0.26 |
| 2019-06-27 14:00:00 | 0.26 |
| 2019-06-27 15:00:00 | 0.26 |
| 2019-06-27 16:00:00 | 0 |
| 2019-06-27 17:00:00 | 0.26 |
| 2019-06-27 18:00:00 | 0.26 |
| 2019-06-27 19:00:00 | 0.26 |
| 2019-06-27 20:00:00 | 0.26 |
| 2019-06-27 21:00:00 | 0 |
| 2019-06-27 22:00:00 | 0.26 |
| 2019-06-27 23:00:00 | 0.26 |
| 2019-06-28 | 0.26 |
| 2019-06-28 01:00:00 | 0.26 |
| 2019-06-28 02:00:00 | 0.26 |
| 2019-06-28 03:00:00 | 0.26 |
| 2019-06-28 04:00:00 | 0 |
| 2019-06-28 05:00:00 | 0.26 |
| 2019-06-28 06:00:00 | 0.26 |
| 2019-06-28 07:00:00 | 0.26 |
| 2019-06-28 08:00:00 | 0.26 |
| 2019-06-28 09:00:00 | 0.26 |
| 2019-06-28 10:00:00 | 0 |
| 2019-06-28 11:00:00 | 0.26 |
| 2019-06-28 12:00:00 | 0.26 |
| 2019-06-28 13:00:00 | 0.26 |
| 2019-06-28 14:00:00 | 0.26 |
| 2019-06-28 15:00:00 | 0 |
| 2019-06-28 16:00:00 | 0.26 |
| 2019-06-28 17:00:00 | 0.26 |
| 2019-06-28 18:00:00 | 0.26 |
| 2019-06-28 19:00:00 | 0.26 |
| 2019-06-28 20:00:00 | 0.26 |
| 2019-06-28 21:00:00 | 0 |
| 2019-06-28 22:00:00 | 0.26 |
| 2019-06-28 23:00:00 | 0.26 |
| 2019-06-29 | 0.26 |
| 2019-06-29 01:00:00 | 0.26 |
| 2019-06-29 02:00:00 | 0.26 |
| 2019-06-29 03:00:00 | 0.26 |
| 2019-06-29 04:00:00 | 0 |
| 2019-06-29 05:00:00 | 0.26 |
| 2019-06-29 06:00:00 | 0.26 |
| 2019-06-29 07:00:00 | 0.26 |
| 2019-06-29 08:00:00 | 0.26 |
| 2019-06-29 09:00:00 | 0 |
| 2019-06-29 10:00:00 | 0.26 |
| 2019-06-29 11:00:00 | 0.26 |
| 2019-06-29 12:00:00 | 0.26 |
| 2019-06-29 13:00:00 | 0.26 |
| 2019-06-29 14:00:00 | 10.92 |
| 2019-06-29 15:00:00 | 0.26 |
| 2019-06-29 16:00:00 | 0.26 |
| 2019-06-29 17:00:00 | 0 |
| 2019-06-29 18:00:00 | 0.26 |
| 2019-06-29 19:00:00 | 0.26 |
| 2019-06-29 20:00:00 | 0.26 |
| 2019-06-29 21:00:00 | 0.26 |
| 2019-06-29 22:00:00 | 0.26 |
| 2019-06-29 23:00:00 | 0 |
| 2019-06-30 | 0.26 |
| 2019-06-30 01:00:00 | 0.26 |
| 2019-06-30 02:00:00 | 0.26 |
| 2019-06-30 03:00:00 | 0.26 |
| 2019-06-30 04:00:00 | 0.26 |
| 2019-06-30 05:00:00 | 0.26 |
| 2019-06-30 06:00:00 | 0 |
| 2019-06-30 07:00:00 | 0.26 |
| 2019-06-30 08:00:00 | 0.26 |
| 2019-06-30 09:00:00 | 0.26 |
| 2019-06-30 10:00:00 | 0.26 |
| 2019-06-30 11:00:00 | 0.26 |
| 2019-06-30 12:00:00 | 0 |
| 2019-06-30 13:00:00 | 0.26 |
| 2019-06-30 14:00:00 | 0.26 |
| 2019-06-30 15:00:00 | 0.26 |
| 2019-06-30 16:00:00 | 0.26 |
| 2019-06-30 17:00:00 | 0.26 |
| 2019-06-30 18:00:00 | 0 |
| 2019-06-30 19:00:00 | 0.26 |
| 2019-06-30 20:00:00 | 0.26 |
| 2019-06-30 21:00:00 | 0.26 |
| 2019-06-30 22:00:00 | 0.26 |
| 2019-06-30 23:00:00 | 0.26 |
| 2019-07-01 | 0 |
| 2019-07-01 01:00:00 | 0.26 |
| 2019-07-01 02:00:00 | 0.26 |
| 2019-07-01 03:00:00 | 0.26 |
| 2019-07-01 04:00:00 | 0.26 |
| 2019-07-01 05:00:00 | 0.26 |
| 2019-07-01 06:00:00 | 0 |
| 2019-07-01 07:00:00 | 0.26 |
| 2019-07-01 08:00:00 | 0.26 |
| 2019-07-01 09:00:00 | 0.26 |
| 2019-07-01 10:00:00 | 0.26 |
| 2019-07-01 11:00:00 | 0 |
| 2019-07-01 12:00:00 | 0.26 |
| 2019-07-01 13:00:00 | 0.26 |
| 2019-07-01 14:00:00 | 0.26 |
| 2019-07-01 15:00:00 | 0.26 |
| 2019-07-01 16:00:00 | 0 |
| 2019-07-01 17:00:00 | 0.26 |
| 2019-07-01 18:00:00 | 0.26 |
| 2019-07-01 19:00:00 | 0.26 |
| 2019-07-01 20:00:00 | 0.26 |
| 2019-07-01 21:00:00 | 0 |
| 2019-07-01 22:00:00 | 0.26 |
| 2019-07-01 23:00:00 | 0.26 |
| 2019-07-02 | 0.26 |
| 2019-07-02 01:00:00 | 0.26 |
| 2019-07-02 02:00:00 | 0.26 |
| 2019-07-02 03:00:00 | 0 |
| 2019-07-02 04:00:00 | 0.26 |
| 2019-07-02 05:00:00 | 0.26 |
| 2019-07-02 06:00:00 | 0.26 |
| 2019-07-02 07:00:00 | 0.26 |
| 2019-07-02 08:00:00 | 0.26 |
| 2019-07-02 09:00:00 | 0 |
| 2019-07-02 10:00:00 | 0.26 |
| 2019-07-02 11:00:00 | 0.26 |
| 2019-07-02 12:00:00 | 0.26 |
| 2019-07-02 13:00:00 | 0.26 |
| 2019-07-02 14:00:00 | 0 |
| 2019-07-02 15:00:00 | 0.26 |
| 2019-07-02 16:00:00 | 0.26 |
| 2019-07-02 17:00:00 | 0.26 |
| 2019-07-02 18:00:00 | 0.26 |
| 2019-07-02 19:00:00 | 0 |
| 2019-07-02 20:00:00 | 0.26 |
| 2019-07-02 21:00:00 | 0.26 |
| 2019-07-02 22:00:00 | 0.26 |
| 2019-07-02 23:00:00 | 0.26 |
| 2019-07-03 | 0 |
| 2019-07-03 01:00:00 | 0.26 |
| 2019-07-03 02:00:00 | 0.26 |
| 2019-07-03 03:00:00 | 0.26 |
| 2019-07-03 04:00:00 | 0.26 |
| 2019-07-03 05:00:00 | 0.26 |
| 2019-07-03 06:00:00 | 0.26 |
| 2019-07-03 07:00:00 | 0 |
| 2019-07-03 08:00:00 | 0.26 |
| 2019-07-03 09:00:00 | 0.26 |
| 2019-07-03 10:00:00 | 0.26 |
| 2019-07-03 11:00:00 | 0.26 |
| 2019-07-03 12:00:00 | 0 |
| 2019-07-03 13:00:00 | 0.26 |
| 2019-07-03 14:00:00 | 0.26 |
| 2019-07-03 15:00:00 | 0.26 |
| 2019-07-03 16:00:00 | 0.26 |
| 2019-07-03 17:00:00 | 0.26 |
| 2019-07-03 18:00:00 | 0 |
| 2019-07-03 19:00:00 | 0.26 |
| 2019-07-03 20:00:00 | 0.26 |
| 2019-07-03 21:00:00 | 0.26 |
| 2019-07-03 22:00:00 | 0.26 |
| 2019-07-03 23:00:00 | 0 |
| 2019-07-04 | 0.26 |
| 2019-07-04 01:00:00 | 0.26 |
| 2019-07-04 02:00:00 | 0.26 |
| 2019-07-04 03:00:00 | 0.26 |
| 2019-07-04 04:00:00 | 0.26 |
| 2019-07-04 05:00:00 | 0.26 |
| 2019-07-04 06:00:00 | 0 |
| 2019-07-04 07:00:00 | 0.26 |
| 2019-07-04 08:00:00 | 0.26 |
| 2019-07-04 09:00:00 | 0.26 |
| 2019-07-04 10:00:00 | 0.26 |
| 2019-07-04 11:00:00 | 0.26 |
| 2019-07-04 12:00:00 | 0 |
| 2019-07-04 13:00:00 | 0.26 |
| 2019-07-04 14:00:00 | 0.78 |
| 2019-07-04 15:00:00 | 9.88 |
| 2019-07-04 16:00:00 | 0.26 |
| 2019-07-04 17:00:00 | 0.26 |
| 2019-07-04 18:00:00 | 0.26 |
| 2019-07-04 19:00:00 | 0 |
| 2019-07-04 20:00:00 | 0.26 |
| 2019-07-04 21:00:00 | 0.26 |
| 2019-07-04 22:00:00 | 0.26 |
| 2019-07-04 23:00:00 | 0.26 |
| 2019-07-05 | 0.26 |
| 2019-07-05 01:00:00 | 0.26 |
| 2019-07-05 02:00:00 | 0 |
| 2019-07-05 03:00:00 | 0.26 |
| 2019-07-05 04:00:00 | 0.26 |
| 2019-07-05 05:00:00 | 0.26 |
| 2019-07-05 06:00:00 | 0.26 |
| 2019-07-05 07:00:00 | 0.26 |
| 2019-07-05 08:00:00 | 0 |
| 2019-07-05 09:00:00 | 0.26 |
| 2019-07-05 10:00:00 | 0.26 |
| 2019-07-05 11:00:00 | 0.26 |
| 2019-07-05 12:00:00 | 0.26 |
| 2019-07-05 13:00:00 | 0.26 |
| 2019-07-05 14:00:00 | 0 |
| 2019-07-05 15:00:00 | 0.26 |
| 2019-07-05 16:00:00 | 0.26 |
| 2019-07-05 17:00:00 | 0.26 |
| 2019-07-05 18:00:00 | 0.26 |
| 2019-07-05 19:00:00 | 0 |
| 2019-07-05 20:00:00 | 0.26 |
| 2019-07-05 21:00:00 | 0.26 |
| 2019-07-05 22:00:00 | 0.26 |
| 2019-07-05 23:00:00 | 0.26 |
| 2019-07-06 | 0.26 |
| 2019-07-06 01:00:00 | 0.26 |
| 2019-07-06 02:00:00 | 0 |
| 2019-07-06 03:00:00 | 0.26 |
| 2019-07-06 04:00:00 | 0.26 |
| 2019-07-06 05:00:00 | 0.26 |
| 2019-07-06 06:00:00 | 0.26 |
| 2019-07-06 07:00:00 | 0.26 |
| 2019-07-06 08:00:00 | 0 |
| 2019-07-06 09:00:00 | 0.26 |
| 2019-07-06 10:00:00 | 0.26 |
| 2019-07-06 11:00:00 | 0.26 |
| 2019-07-06 12:00:00 | 0.26 |
| 2019-07-06 13:00:00 | 0.26 |
| 2019-07-06 14:00:00 | 0 |
| 2019-07-06 15:00:00 | 0.26 |
| 2019-07-06 16:00:00 | 0.26 |
| 2019-07-06 17:00:00 | 0.26 |
| 2019-07-06 18:00:00 | 0.26 |
| 2019-07-06 19:00:00 | 0.26 |
| 2019-07-06 20:00:00 | 0 |
| 2019-07-06 21:00:00 | 0.26 |
| 2019-07-06 22:00:00 | 0.26 |
| 2019-07-06 23:00:00 | 0.26 |
| 2019-07-07 | 0.26 |
| 2019-07-07 01:00:00 | 0.26 |
| 2019-07-07 02:00:00 | 0.26 |
| 2019-07-07 03:00:00 | 0 |
| 2019-07-07 04:00:00 | 0.26 |
| 2019-07-07 05:00:00 | 0.26 |
| 2019-07-07 06:00:00 | 0.26 |
| 2019-07-07 07:00:00 | 0.26 |
| 2019-07-07 08:00:00 | 0.26 |
| 2019-07-07 09:00:00 | 0.26 |
| 2019-07-07 10:00:00 | 0 |
| 2019-07-07 11:00:00 | 0.26 |
| 2019-07-07 12:00:00 | 0.26 |
| 2019-07-07 13:00:00 | 0.26 |
| 2019-07-07 14:00:00 | 0.26 |
| 2019-07-07 15:00:00 | 0 |
| 2019-07-07 16:00:00 | 0.26 |
| 2019-07-07 17:00:00 | 0.26 |
| 2019-07-07 18:00:00 | 0.26 |
| 2019-07-07 19:00:00 | 0.26 |
| 2019-07-07 20:00:00 | 0.26 |
| 2019-07-07 21:00:00 | 0 |
| 2019-07-07 22:00:00 | 0.26 |
| 2019-07-07 23:00:00 | 0.26 |
| 2019-07-08 | 0.26 |
| 2019-07-08 01:00:00 | 0.26 |
| 2019-07-08 02:00:00 | 0.26 |
| 2019-07-08 03:00:00 | 0 |
| 2019-07-08 04:00:00 | 0.26 |
| 2019-07-08 05:00:00 | 0.26 |
| 2019-07-08 06:00:00 | 0.26 |
| 2019-07-08 07:00:00 | 0.26 |
| 2019-07-08 08:00:00 | 0.26 |
| 2019-07-08 09:00:00 | 0 |
| 2019-07-08 10:00:00 | 0.26 |
| 2019-07-08 11:00:00 | 0.26 |
| 2019-07-08 12:00:00 | 0.26 |
| 2019-07-08 13:00:00 | 0.26 |
| 2019-07-08 14:00:00 | 0 |
| 2019-07-08 15:00:00 | 0.26 |
| 2019-07-08 16:00:00 | 9.36 |
| 2019-07-08 17:00:00 | 1.82 |
| 2019-07-08 18:00:00 | 0.26 |
| 2019-07-08 19:00:00 | 0.26 |
| 2019-07-08 20:00:00 | 0.26 |
| 2019-07-08 21:00:00 | 0.26 |
| 2019-07-08 22:00:00 | 0.26 |
| 2019-07-08 23:00:00 | 0 |
| 2019-07-09 | 0.26 |
| 2019-07-09 01:00:00 | 0.26 |
| 2019-07-09 02:00:00 | 0.26 |
| 2019-07-09 03:00:00 | 0.26 |
| 2019-07-09 04:00:00 | 0.26 |
| 2019-07-09 05:00:00 | 0.26 |
| 2019-07-09 06:00:00 | 0 |
| 2019-07-09 07:00:00 | 0.26 |
| 2019-07-09 08:00:00 | 0.26 |
| 2019-07-09 09:00:00 | 0.26 |
| 2019-07-09 10:00:00 | 0.26 |
| 2019-07-09 11:00:00 | 0 |
| 2019-07-09 12:00:00 | 0.26 |
| 2019-07-09 13:00:00 | 0.26 |
| 2019-07-09 14:00:00 | 0.26 |
| 2019-07-09 15:00:00 | 0.26 |
| 2019-07-09 16:00:00 | 0.26 |
| 2019-07-09 17:00:00 | 0 |
| 2019-07-09 18:00:00 | 0.26 |
| 2019-07-09 19:00:00 | 0.26 |
| 2019-07-09 20:00:00 | 0.26 |
| 2019-07-09 21:00:00 | 0.26 |
| 2019-07-09 22:00:00 | 0.26 |
| 2019-07-09 23:00:00 | 0 |
| 2019-07-10 | 0.26 |
| 2019-07-10 01:00:00 | 0.26 |
| 2019-07-10 02:00:00 | 0.26 |
| 2019-07-10 03:00:00 | 0.26 |
| 2019-07-10 04:00:00 | 0.26 |
| 2019-07-10 05:00:00 | 0.26 |
| 2019-07-10 06:00:00 | 0.26 |
| 2019-07-10 07:00:00 | 0 |
| 2019-07-10 08:00:00 | 0.26 |
| 2019-07-10 09:00:00 | 0.26 |
| 2019-07-10 10:00:00 | 0.26 |
| 2019-07-10 11:00:00 | 0.26 |
| 2019-07-10 12:00:00 | 0.26 |
| 2019-07-10 13:00:00 | 0 |
| 2019-07-10 14:00:00 | 0.26 |
| 2019-07-10 15:00:00 | 0.26 |
| 2019-07-10 16:00:00 | 0.26 |
| 2019-07-10 17:00:00 | 0.26 |
| 2019-07-10 18:00:00 | 0 |
| 2019-07-10 19:00:00 | 0.26 |
| 2019-07-10 20:00:00 | 0.26 |
| 2019-07-10 21:00:00 | 0.26 |
| 2019-07-10 22:00:00 | 0.26 |
| 2019-07-10 23:00:00 | 0.26 |
| 2019-07-11 | 0 |
| 2019-07-11 01:00:00 | 0.26 |
| 2019-07-11 02:00:00 | 0.26 |
| 2019-07-11 03:00:00 | 0.26 |
| 2019-07-11 04:00:00 | 0.26 |
| 2019-07-11 05:00:00 | 0.26 |
| 2019-07-11 06:00:00 | 0.26 |
| 2019-07-11 07:00:00 | 0 |
| 2019-07-11 08:00:00 | 0.26 |
| 2019-07-11 09:00:00 | 1.04 |
| 2019-07-11 10:00:00 | 0.26 |
| 2019-07-11 11:00:00 | 0 |
| 2019-07-11 12:00:00 | 0.26 |
| 2019-07-11 13:00:00 | 0.26 |
| 2019-07-11 14:00:00 | 0.26 |
| 2019-07-11 15:00:00 | 0.26 |
| 2019-07-11 16:00:00 | 0.26 |
| 2019-07-11 17:00:00 | 0 |
| 2019-07-11 18:00:00 | 0.26 |
| 2019-07-11 19:00:00 | 0.26 |
| 2019-07-11 20:00:00 | 0.26 |
| 2019-07-11 21:00:00 | 0.26 |
| 2019-07-11 22:00:00 | 0 |
| 2019-07-11 23:00:00 | 0.26 |
| 2019-07-12 | 0.26 |
| 2019-07-12 01:00:00 | 0.26 |
| 2019-07-12 02:00:00 | 0.26 |
| 2019-07-12 03:00:00 | 0.26 |
| 2019-07-12 04:00:00 | 0.26 |
| 2019-07-12 05:00:00 | 0 |
| 2019-07-12 06:00:00 | 0.26 |
| 2019-07-12 07:00:00 | 0.26 |
| 2019-07-12 08:00:00 | 0.26 |
| 2019-07-12 09:00:00 | 0.26 |
| 2019-07-12 10:00:00 | 0.26 |
| 2019-07-12 11:00:00 | 0 |
| 2019-07-12 12:00:00 | 0.26 |
| 2019-07-12 13:00:00 | 0.26 |
| 2019-07-12 14:00:00 | 0.26 |
| 2019-07-12 15:00:00 | 0.26 |
| 2019-07-12 16:00:00 | 0.26 |
| 2019-07-12 17:00:00 | 0 |
| 2019-07-12 18:00:00 | 0.26 |
| 2019-07-12 19:00:00 | 0.26 |
| 2019-07-12 20:00:00 | 0.26 |
| 2019-07-12 21:00:00 | 0.26 |
| 2019-07-12 22:00:00 | 0.26 |
| 2019-07-12 23:00:00 | 0 |
| 2019-07-13 | 0.26 |
| 2019-07-13 01:00:00 | 0.26 |
| 2019-07-13 02:00:00 | 0.26 |
| 2019-07-13 03:00:00 | 0.26 |
| 2019-07-13 04:00:00 | 0.26 |
| 2019-07-13 05:00:00 | 0.26 |
| 2019-07-13 06:00:00 | 0 |
| 2019-07-13 07:00:00 | 0.26 |
| 2019-07-13 08:00:00 | 0.26 |
| 2019-07-13 09:00:00 | 0.26 |
| 2019-07-13 10:00:00 | 0 |
| 2019-07-13 11:00:00 | 0.26 |
| 2019-07-13 12:00:00 | 0.26 |
| 2019-07-13 13:00:00 | 3.64 |
| 2019-07-13 14:00:00 | 7.54 |
| 2019-07-13 15:00:00 | 0 |
| 2019-07-13 16:00:00 | 0.26 |
| 2019-07-13 17:00:00 | 0.26 |
| 2019-07-13 18:00:00 | 0.26 |
| 2019-07-13 19:00:00 | 0.26 |
| 2019-07-13 20:00:00 | 0.26 |
| 2019-07-13 21:00:00 | 0 |
| 2019-07-13 22:00:00 | 0.26 |
| 2019-07-13 23:00:00 | 0.26 |
| 2019-07-14 | 0.26 |
| 2019-07-14 01:00:00 | 0.26 |
| 2019-07-14 02:00:00 | 0.26 |
| 2019-07-14 03:00:00 | 0.26 |
| 2019-07-14 04:00:00 | 0 |
| 2019-07-14 05:00:00 | 0.26 |
| 2019-07-14 06:00:00 | 0.26 |
| 2019-07-14 07:00:00 | 0.26 |
| 2019-07-14 08:00:00 | 0.26 |
| 2019-07-14 09:00:00 | 0 |
| 2019-07-14 10:00:00 | 0.26 |
| 2019-07-14 11:00:00 | 0.26 |
| 2019-07-14 12:00:00 | 0.26 |
| 2019-07-14 13:00:00 | 0.26 |
| 2019-07-14 14:00:00 | 0.26 |
| 2019-07-14 15:00:00 | 0 |
| 2019-07-14 16:00:00 | 0.26 |
| 2019-07-14 17:00:00 | 0.26 |
| 2019-07-14 18:00:00 | 0.26 |
| 2019-07-14 19:00:00 | 0.26 |
| 2019-07-14 20:00:00 | 0.26 |
| 2019-07-14 21:00:00 | 0 |
| 2019-07-14 22:00:00 | 0.26 |
| 2019-07-14 23:00:00 | 0.26 |
| 2019-07-15 | 0.26 |
| 2019-07-15 01:00:00 | 0.26 |
| 2019-07-15 02:00:00 | 0.26 |
| 2019-07-15 03:00:00 | 0 |
| 2019-07-15 04:00:00 | 0.26 |
| 2019-07-15 05:00:00 | 0.26 |
| 2019-07-15 06:00:00 | 0.26 |
| 2019-07-15 07:00:00 | 0.26 |
| 2019-07-15 08:00:00 | 0.26 |
| 2019-07-15 09:00:00 | 0 |
| 2019-07-15 10:00:00 | 0.26 |
| 2019-07-15 11:00:00 | 0.26 |
| 2019-07-15 12:00:00 | 0.26 |
| 2019-07-15 13:00:00 | 0.26 |
| 2019-07-15 14:00:00 | 0 |
| 2019-07-15 15:00:00 | 0.26 |
| 2019-07-15 16:00:00 | 0.26 |
| 2019-07-15 17:00:00 | 0.26 |
| 2019-07-15 18:00:00 | 0.26 |
| 2019-07-15 19:00:00 | 0.26 |
| 2019-07-15 20:00:00 | 0 |
| 2019-07-15 21:00:00 | 0.26 |
| 2019-07-15 22:00:00 | 0.26 |
| 2019-07-15 23:00:00 | 0.26 |
| 2019-07-16 | 0.26 |
| 2019-07-16 01:00:00 | 0.26 |
| 2019-07-16 02:00:00 | 0.26 |
| 2019-07-16 03:00:00 | 0 |
| 2019-07-16 04:00:00 | 0.26 |
| 2019-07-16 05:00:00 | 0.26 |
| 2019-07-16 06:00:00 | 0.26 |
| 2019-07-16 07:00:00 | 0.26 |
| 2019-07-16 08:00:00 | 0.26 |
| 2019-07-16 09:00:00 | 0 |
| 2019-07-16 10:00:00 | 0.26 |
| 2019-07-16 11:00:00 | 0.26 |
| 2019-07-16 12:00:00 | 0.26 |
| 2019-07-16 13:00:00 | 0.26 |
| 2019-07-16 14:00:00 | 0.26 |
| 2019-07-16 15:00:00 | 0 |
| 2019-07-16 16:00:00 | 0.26 |
| 2019-07-16 17:00:00 | 0.26 |
| 2019-07-16 18:00:00 | 0.26 |
| 2019-07-16 19:00:00 | 0.26 |
| 2019-07-16 20:00:00 | 0 |
| 2019-07-16 21:00:00 | 0.26 |
| 2019-07-16 22:00:00 | 0.26 |
| 2019-07-16 23:00:00 | 0.26 |
| 2019-07-17 | 0.26 |
| 2019-07-17 01:00:00 | 0.26 |
| 2019-07-17 02:00:00 | 0.26 |
| 2019-07-17 03:00:00 | 0 |
| 2019-07-17 04:00:00 | 0.26 |
| 2019-07-17 05:00:00 | 0.26 |
| 2019-07-17 06:00:00 | 0.26 |
| 2019-07-17 07:00:00 | 0.26 |
| 2019-07-17 08:00:00 | 0.26 |
| 2019-07-17 09:00:00 | 0 |
| 2019-07-17 10:00:00 | 0.26 |
| 2019-07-17 11:00:00 | 0.26 |
| 2019-07-17 12:00:00 | 0.26 |
| 2019-07-17 13:00:00 | 0.26 |
| 2019-07-17 14:00:00 | 0.26 |
| 2019-07-17 15:00:00 | 0 |
| 2019-07-17 16:00:00 | 0.26 |
| 2019-07-17 17:00:00 | 0.26 |
| 2019-07-17 18:00:00 | 0.26 |
| 2019-07-17 19:00:00 | 0.26 |
| 2019-07-17 20:00:00 | 0 |
| 2019-07-17 21:00:00 | 0.26 |
| 2019-07-17 22:00:00 | 0.26 |
| 2019-07-17 23:00:00 | 0.26 |
| 2019-07-18 | 0.26 |
| 2019-07-18 01:00:00 | 0.26 |
| 2019-07-18 02:00:00 | 0 |
| 2019-07-18 03:00:00 | 0.26 |
| 2019-07-18 04:00:00 | 0.26 |
| 2019-07-18 05:00:00 | 0.26 |
| 2019-07-18 06:00:00 | 0.26 |
| 2019-07-18 07:00:00 | 0.26 |
| 2019-07-18 08:00:00 | 0 |
| 2019-07-18 09:00:00 | 0.26 |
| 2019-07-18 10:00:00 | 0.26 |
| 2019-07-18 11:00:00 | 0.26 |
| 2019-07-18 12:00:00 | 0.26 |
| 2019-07-18 13:00:00 | 0.26 |
| 2019-07-18 14:00:00 | 0 |
| 2019-07-18 15:00:00 | 0.26 |
| 2019-07-18 16:00:00 | 0.26 |
| 2019-07-18 17:00:00 | 0.26 |
| 2019-07-18 18:00:00 | 0.26 |
| 2019-07-18 19:00:00 | 0.26 |
| 2019-07-18 20:00:00 | 0 |
| 2019-07-18 21:00:00 | 0.26 |
| 2019-07-18 22:00:00 | 0.26 |
| 2019-07-18 23:00:00 | 10.92 |
| 2019-07-19 | 0.26 |
| 2019-07-19 01:00:00 | 0.26 |
| 2019-07-19 02:00:00 | 0.26 |
| 2019-07-19 03:00:00 | 0.26 |
| 2019-07-19 04:00:00 | 0.26 |
| 2019-07-19 05:00:00 | 0.26 |
| 2019-07-19 06:00:00 | 0 |
| 2019-07-19 07:00:00 | 0.26 |
| 2019-07-19 08:00:00 | 0.26 |
| 2019-07-19 09:00:00 | 0.26 |
| 2019-07-19 10:00:00 | 0.26 |
| 2019-07-19 11:00:00 | 0.26 |
| 2019-07-19 12:00:00 | 0 |
| 2019-07-19 13:00:00 | 0.26 |
| 2019-07-19 14:00:00 | 0.26 |
| 2019-07-19 15:00:00 | 0.26 |
| 2019-07-19 16:00:00 | 0.26 |
| 2019-07-19 17:00:00 | 0.26 |
| 2019-07-19 18:00:00 | 0 |
| 2019-07-19 19:00:00 | 0.26 |
| 2019-07-19 20:00:00 | 0.26 |
| 2019-07-19 21:00:00 | 0.26 |
| 2019-07-19 22:00:00 | 0.26 |
| 2019-07-19 23:00:00 | 0.26 |
| 2019-07-20 | 0 |
| 2019-07-20 01:00:00 | 0.26 |
| 2019-07-20 02:00:00 | 0.26 |
| 2019-07-20 03:00:00 | 0.26 |
| 2019-07-20 04:00:00 | 0.26 |
| 2019-07-20 05:00:00 | 0.26 |
| 2019-07-20 06:00:00 | 0.26 |
| 2019-07-20 07:00:00 | 0 |
| 2019-07-20 08:00:00 | 0.26 |
| 2019-07-20 09:00:00 | 0.26 |
| 2019-07-20 10:00:00 | 0.26 |
| 2019-07-20 11:00:00 | 0.26 |
| 2019-07-20 12:00:00 | 0 |
| 2019-07-20 13:00:00 | 0.26 |
| 2019-07-20 14:00:00 | 0.26 |
| 2019-07-20 15:00:00 | 0.26 |
| 2019-07-20 16:00:00 | 0.26 |
| 2019-07-20 17:00:00 | 0.26 |
| 2019-07-20 18:00:00 | 0 |
| 2019-07-20 19:00:00 | 0.26 |
| 2019-07-20 20:00:00 | 0.26 |
| 2019-07-20 21:00:00 | 0.26 |
| 2019-07-20 22:00:00 | 0.26 |
| 2019-07-20 23:00:00 | 0.26 |
| 2019-07-21 | 0 |
| 2019-07-21 01:00:00 | 0.26 |
| 2019-07-21 02:00:00 | 0.26 |
| 2019-07-21 03:00:00 | 0.26 |
| 2019-07-21 04:00:00 | 0.26 |
| 2019-07-21 05:00:00 | 0.26 |
| 2019-07-21 06:00:00 | 0 |
| 2019-07-21 07:00:00 | 0.26 |
| 2019-07-21 08:00:00 | 0.26 |
| 2019-07-21 09:00:00 | 0.26 |
| 2019-07-21 10:00:00 | 0.26 |
| 2019-07-21 11:00:00 | 0.26 |
| 2019-07-21 12:00:00 | 0 |
| 2019-07-21 13:00:00 | 0.26 |
| 2019-07-21 14:00:00 | 0.26 |
| 2019-07-21 15:00:00 | 0.26 |
| 2019-07-21 16:00:00 | 0.26 |
| 2019-07-21 17:00:00 | 0 |
| 2019-07-21 18:00:00 | 0.26 |
| 2019-07-21 19:00:00 | 0.26 |
| 2019-07-21 20:00:00 | 0.26 |
| 2019-07-21 21:00:00 | 0.26 |
| 2019-07-21 22:00:00 | 10.4 |
| 2019-07-21 23:00:00 | 0.26 |
| 2019-07-22 | 0.26 |
| 2019-07-22 01:00:00 | 0.26 |
| 2019-07-22 02:00:00 | 0.26 |
| 2019-07-22 03:00:00 | 0 |
| 2019-07-22 04:00:00 | 0.26 |
| 2019-07-22 05:00:00 | 0.26 |
| 2019-07-22 06:00:00 | 0.26 |
| 2019-07-22 07:00:00 | 0.26 |
| 2019-07-22 08:00:00 | 0 |
| 2019-07-22 09:00:00 | 0.26 |
| 2019-07-22 10:00:00 | 0.26 |
| 2019-07-22 11:00:00 | 0.26 |
| 2019-07-22 12:00:00 | 0.26 |
| 2019-07-22 13:00:00 | 0.26 |
| 2019-07-22 14:00:00 | 0 |
| 2019-07-22 15:00:00 | 0.26 |
| 2019-07-22 16:00:00 | 0.26 |
| 2019-07-22 17:00:00 | 0.26 |
| 2019-07-22 18:00:00 | 0.26 |
| 2019-07-22 19:00:00 | 0 |
| 2019-07-22 20:00:00 | 0.26 |
| 2019-07-22 21:00:00 | 0.26 |
| 2019-07-22 22:00:00 | 0.26 |
| 2019-07-22 23:00:00 | 0.26 |
| 2019-07-23 | 0.26 |
| 2019-07-23 01:00:00 | 0.26 |
| 2019-07-23 02:00:00 | 0 |
| 2019-07-23 03:00:00 | 0.26 |
| 2019-07-23 04:00:00 | 0.26 |
| 2019-07-23 05:00:00 | 0.26 |
| 2019-07-23 06:00:00 | 0.26 |
| 2019-07-23 07:00:00 | 0.26 |
| 2019-07-23 08:00:00 | 0.26 |
| 2019-07-23 09:00:00 | 0 |
| 2019-07-23 10:00:00 | 0.26 |
| 2019-07-23 11:00:00 | 0.26 |
| 2019-07-23 12:00:00 | 0.26 |
| 2019-07-23 13:00:00 | 0.26 |
| 2019-07-23 14:00:00 | 0 |
| 2019-07-23 15:00:00 | 0.26 |
| 2019-07-23 16:00:00 | 0.26 |
| 2019-07-23 17:00:00 | 0.26 |
| 2019-07-23 18:00:00 | 0.26 |
| 2019-07-23 19:00:00 | 0.26 |
| 2019-07-23 20:00:00 | 0 |
| 2019-07-23 21:00:00 | 0.26 |
| 2019-07-23 22:00:00 | 0.26 |
| 2019-07-23 23:00:00 | 0.26 |
| 2019-07-24 | 0.26 |
| 2019-07-24 01:00:00 | 0.26 |
| 2019-07-24 02:00:00 | 0.26 |
| 2019-07-24 03:00:00 | 0 |
| 2019-07-24 04:00:00 | 0.26 |
| 2019-07-24 05:00:00 | 0.26 |
| 2019-07-24 06:00:00 | 0.26 |
| 2019-07-24 07:00:00 | 0.26 |
| 2019-07-24 08:00:00 | 0.26 |
| 2019-07-24 09:00:00 | 0 |
| 2019-07-24 10:00:00 | 0.26 |
| 2019-07-24 11:00:00 | 0.26 |
| 2019-07-24 12:00:00 | 0.26 |
| 2019-07-24 13:00:00 | 0.26 |
| 2019-07-24 14:00:00 | 0.26 |
| 2019-07-24 15:00:00 | 0 |
| 2019-07-24 16:00:00 | 0.26 |
| 2019-07-24 17:00:00 | 0.26 |
| 2019-07-24 18:00:00 | 0.26 |
| 2019-07-24 19:00:00 | 0.26 |
| 2019-07-24 20:00:00 | 0.26 |
| 2019-07-24 21:00:00 | 0 |
| 2019-07-24 22:00:00 | 0.26 |
| 2019-07-24 23:00:00 | 0.26 |
| 2019-07-25 | 0.26 |
| 2019-07-25 01:00:00 | 0.26 |
| 2019-07-25 02:00:00 | 0.26 |
| 2019-07-25 03:00:00 | 0.26 |
| 2019-07-25 04:00:00 | 0.26 |
| 2019-07-25 05:00:00 | 0 |
| 2019-07-25 06:00:00 | 0.26 |
| 2019-07-25 07:00:00 | 0.26 |
| 2019-07-25 08:00:00 | 0.26 |
| 2019-07-25 09:00:00 | 11.44 |
| 2019-07-25 10:00:00 | 0.26 |
| 2019-07-25 11:00:00 | 0.26 |
| 2019-07-25 12:00:00 | 0.26 |
| 2019-07-25 13:00:00 | 0.26 |
| 2019-07-25 14:00:00 | 0 |
| 2019-07-25 15:00:00 | 0.26 |
| 2019-07-25 16:00:00 | 0.26 |
| 2019-07-25 17:00:00 | 0.26 |
| 2019-07-25 18:00:00 | 0.26 |
| 2019-07-25 19:00:00 | 0.26 |
| 2019-07-25 20:00:00 | 0 |
| 2019-07-25 21:00:00 | 0.26 |
| 2019-07-25 22:00:00 | 0.26 |
| 2019-07-25 23:00:00 | 0.26 |
| 2019-07-26 | 0.26 |
| 2019-07-26 01:00:00 | 0.26 |
| 2019-07-26 02:00:00 | 0.26 |
| 2019-07-26 03:00:00 | 0.26 |
| 2019-07-26 04:00:00 | 0 |
| 2019-07-26 05:00:00 | 0.26 |
| 2019-07-26 06:00:00 | 0.26 |
| 2019-07-26 07:00:00 | 0.26 |
| 2019-07-26 08:00:00 | 0.26 |
| 2019-07-26 09:00:00 | 0.26 |
| 2019-07-26 10:00:00 | 0 |
| 2019-07-26 11:00:00 | 0.26 |
| 2019-07-26 12:00:00 | 0.26 |
| 2019-07-26 13:00:00 | 0.26 |
| 2019-07-26 14:00:00 | 0.26 |
| 2019-07-26 15:00:00 | 0 |
| 2019-07-26 16:00:00 | 0.26 |
| 2019-07-26 17:00:00 | 0.26 |
| 2019-07-26 18:00:00 | 0.26 |
| 2019-07-26 19:00:00 | 0.26 |
| 2019-07-26 20:00:00 | 0.26 |
| 2019-07-26 21:00:00 | 0 |
| 2019-07-26 22:00:00 | 0.26 |
| 2019-07-26 23:00:00 | 0.26 |
| 2019-07-27 | 0.26 |
| 2019-07-27 01:00:00 | 0.26 |
| 2019-07-27 02:00:00 | 0.26 |
| 2019-07-27 03:00:00 | 0.26 |
| 2019-07-27 04:00:00 | 0.26 |
| 2019-07-27 05:00:00 | 0 |
| 2019-07-27 06:00:00 | 0.26 |
| 2019-07-27 07:00:00 | 0.26 |
| 2019-07-27 08:00:00 | 0.26 |
| 2019-07-27 09:00:00 | 0.26 |
| 2019-07-27 10:00:00 | 0 |
| 2019-07-27 11:00:00 | 0.26 |
| 2019-07-27 12:00:00 | 0.26 |
| 2019-07-27 13:00:00 | 0.26 |
| 2019-07-27 14:00:00 | 0.26 |
| 2019-07-27 15:00:00 | 0 |
| 2019-07-27 16:00:00 | 0.26 |
| 2019-07-27 17:00:00 | 0.26 |
| 2019-07-27 18:00:00 | 0.26 |
| 2019-07-27 19:00:00 | 0.26 |
| 2019-07-27 20:00:00 | 0.26 |
| 2019-07-27 21:00:00 | 0 |
| 2019-07-27 22:00:00 | 0.26 |
| 2019-07-27 23:00:00 | 0.26 |
| 2019-07-28 | 0.26 |
| 2019-07-28 01:00:00 | 0.26 |
| 2019-07-28 02:00:00 | 0.26 |
| 2019-07-28 03:00:00 | 0.26 |
| 2019-07-28 04:00:00 | 0 |
| 2019-07-28 05:00:00 | 0.26 |
| 2019-07-28 06:00:00 | 0.26 |
| 2019-07-28 07:00:00 | 0.26 |
| 2019-07-28 08:00:00 | 0.26 |
| 2019-07-28 09:00:00 | 0.26 |
| 2019-07-28 10:00:00 | 0 |
| 2019-07-28 11:00:00 | 0.26 |
| 2019-07-28 12:00:00 | 0.26 |
| 2019-07-28 13:00:00 | 0.26 |
| 2019-07-28 14:00:00 | 0.26 |
| 2019-07-28 15:00:00 | 0.26 |
| 2019-07-28 16:00:00 | 0 |
| 2019-07-28 17:00:00 | 0.26 |
| 2019-07-28 18:00:00 | 0.26 |
| 2019-07-28 19:00:00 | 0.26 |
| 2019-07-28 20:00:00 | 11.18 |
| 2019-07-28 21:00:00 | 0.26 |
| 2019-07-28 22:00:00 | 0.26 |
| 2019-07-28 23:00:00 | 0.26 |
| 2019-07-29 | 0.26 |
| 2019-07-29 01:00:00 | 0.26 |
| 2019-07-29 02:00:00 | 0 |
| 2019-07-29 03:00:00 | 0.26 |
| 2019-07-29 04:00:00 | 0.26 |
| 2019-07-29 05:00:00 | 0.26 |
| 2019-07-29 06:00:00 | 0.26 |
| 2019-07-29 07:00:00 | 0.26 |
| 2019-07-29 08:00:00 | 0.26 |
| 2019-07-29 09:00:00 | 0 |
| 2019-07-29 10:00:00 | 0.26 |
| 2019-07-29 11:00:00 | 0.26 |
| 2019-07-29 12:00:00 | 0.26 |
| 2019-07-29 13:00:00 | 0.26 |
| 2019-07-29 14:00:00 | 0 |
| 2019-07-29 15:00:00 | 0.26 |
| 2019-07-29 16:00:00 | 0.26 |
| 2019-07-29 17:00:00 | 0.26 |
| 2019-07-29 18:00:00 | 0.26 |
| 2019-07-29 19:00:00 | 0.26 |
| 2019-07-29 20:00:00 | 0 |
| 2019-07-29 21:00:00 | 0.26 |
| 2019-07-29 22:00:00 | 0.26 |
| 2019-07-29 23:00:00 | 0.26 |
| 2019-07-30 | 0.26 |
| 2019-07-30 01:00:00 | 0.26 |
| 2019-07-30 02:00:00 | 0 |
| 2019-07-30 03:00:00 | 0.26 |
| 2019-07-30 04:00:00 | 0.26 |
| 2019-07-30 05:00:00 | 0.26 |
| 2019-07-30 06:00:00 | 0.26 |
| 2019-07-30 07:00:00 | 0.26 |
| 2019-07-30 08:00:00 | 0.26 |
| 2019-07-30 09:00:00 | 0 |
| 2019-07-30 10:00:00 | 0.26 |
| 2019-07-30 11:00:00 | 0.26 |
| 2019-07-30 12:00:00 | 0.26 |
| 2019-07-30 13:00:00 | 0.26 |
| 2019-07-30 14:00:00 | 0 |
| 2019-07-30 15:00:00 | 0.26 |
| 2019-07-30 16:00:00 | 0.26 |
| 2019-07-30 17:00:00 | 0.26 |
| 2019-07-30 18:00:00 | 0.26 |
| 2019-07-30 19:00:00 | 0.26 |
| 2019-07-30 20:00:00 | 0 |
| 2019-07-30 21:00:00 | 0.26 |
| 2019-07-30 22:00:00 | 0.26 |
| 2019-07-30 23:00:00 | 0.26 |
| 2019-07-31 | 0.26 |
| 2019-07-31 01:00:00 | 0.26 |
| 2019-07-31 02:00:00 | 0.26 |
| 2019-07-31 03:00:00 | 0.26 |
| 2019-07-31 04:00:00 | 0 |
| 2019-07-31 05:00:00 | 0.26 |
| 2019-07-31 06:00:00 | 0.26 |
| 2019-07-31 07:00:00 | 0.26 |
| 2019-07-31 08:00:00 | 0.26 |
| 2019-07-31 09:00:00 | 0.26 |
| 2019-07-31 10:00:00 | 0.26 |
| 2019-07-31 11:00:00 | 0 |
| 2019-07-31 12:00:00 | 0.26 |
| 2019-07-31 13:00:00 | 0.26 |
| 2019-07-31 14:00:00 | 0.26 |
| 2019-07-31 15:00:00 | 0.26 |
| 2019-07-31 16:00:00 | 0.26 |
| 2019-07-31 17:00:00 | 0 |
| 2019-07-31 18:00:00 | 0.26 |
| 2019-07-31 19:00:00 | 11.44 |
| 2019-07-31 20:00:00 | 0.26 |
| 2019-07-31 21:00:00 | 0.26 |
| 2019-07-31 22:00:00 | 0 |
| 2019-07-31 23:00:00 | 0.26 |
| 2019-08-01 | 0.26 |
| 2019-08-01 01:00:00 | 0.26 |
| 2019-08-01 02:00:00 | 0.26 |
| 2019-08-01 03:00:00 | 0.26 |
| 2019-08-01 04:00:00 | 0.26 |
| 2019-08-01 05:00:00 | 0.26 |
| 2019-08-01 06:00:00 | 0 |
| 2019-08-01 07:00:00 | 0.26 |
| 2019-08-01 08:00:00 | 0.26 |
| 2019-08-01 09:00:00 | 0.26 |
| 2019-08-01 10:00:00 | 0.26 |
| 2019-08-01 11:00:00 | 0.26 |
| 2019-08-01 12:00:00 | 0 |
| 2019-08-01 13:00:00 | 0.26 |
| 2019-08-01 14:00:00 | 0.26 |
| 2019-08-01 15:00:00 | 0.26 |
| 2019-08-01 16:00:00 | 0.26 |
| 2019-08-01 17:00:00 | 0.26 |
| 2019-08-01 18:00:00 | 0 |
| 2019-08-01 19:00:00 | 0.26 |
| 2019-08-01 20:00:00 | 0.26 |
| 2019-08-01 21:00:00 | 0.26 |
| 2019-08-01 22:00:00 | 0.26 |
| 2019-08-01 23:00:00 | 0.26 |
| 2019-08-02 | 0 |
| 2019-08-02 01:00:00 | 0.26 |
| 2019-08-02 02:00:00 | 0.26 |
| 2019-08-02 03:00:00 | 0.26 |
| 2019-08-02 04:00:00 | 0.26 |
| 2019-08-02 05:00:00 | 0.26 |
| 2019-08-02 06:00:00 | 0.26 |
| 2019-08-02 07:00:00 | 0.26 |
| 2019-08-02 08:00:00 | 0 |
| 2019-08-02 09:00:00 | 0.26 |
| 2019-08-02 10:00:00 | 0.26 |
| 2019-08-02 11:00:00 | 0.26 |
| 2019-08-02 12:00:00 | 0.26 |
| 2019-08-02 13:00:00 | 0 |
| 2019-08-02 14:00:00 | 0.26 |
| 2019-08-02 15:00:00 | 0.26 |
| 2019-08-02 16:00:00 | 0.26 |
| 2019-08-02 17:00:00 | 0.26 |
| 2019-08-02 18:00:00 | 0 |
| 2019-08-02 19:00:00 | 0.26 |
| 2019-08-02 20:00:00 | 0.26 |
| 2019-08-02 21:00:00 | 0.26 |
| 2019-08-02 22:00:00 | 0.26 |
| 2019-08-02 23:00:00 | 0.26 |
| 2019-08-03 | 0.26 |
| 2019-08-03 01:00:00 | 0.26 |
| 2019-08-03 02:00:00 | 0 |
| 2019-08-03 03:00:00 | 0.26 |
| 2019-08-03 04:00:00 | 0.26 |
| 2019-08-03 05:00:00 | 0.26 |
| 2019-08-03 06:00:00 | 0.26 |
| 2019-08-03 07:00:00 | 0.26 |
| 2019-08-03 08:00:00 | 0.26 |
| 2019-08-03 09:00:00 | 0 |
| 2019-08-03 10:00:00 | 0.26 |
| 2019-08-03 11:00:00 | 0.26 |
| 2019-08-03 12:00:00 | 0.26 |
| 2019-08-03 13:00:00 | 0.26 |
| 2019-08-03 14:00:00 | 0 |
| 2019-08-03 15:00:00 | 0.26 |
| 2019-08-03 16:00:00 | 0.26 |
| 2019-08-03 17:00:00 | 0.26 |
| 2019-08-03 18:00:00 | 0.26 |
| 2019-08-03 19:00:00 | 0.26 |
| 2019-08-03 20:00:00 | 0 |
| 2019-08-03 21:00:00 | 0.26 |
| 2019-08-03 22:00:00 | 10.4 |
| 2019-08-03 23:00:00 | 0.26 |
| 2019-08-04 | 0.26 |
| 2019-08-04 01:00:00 | 0.26 |
| 2019-08-04 02:00:00 | 0.26 |
| 2019-08-04 03:00:00 | 0.26 |
| 2019-08-04 04:00:00 | 0.26 |
| 2019-08-04 05:00:00 | 0.26 |
| 2019-08-04 06:00:00 | 0 |
| 2019-08-04 07:00:00 | 0.26 |
| 2019-08-04 08:00:00 | 0.26 |
| 2019-08-04 09:00:00 | 0.26 |
| 2019-08-04 10:00:00 | 0.26 |
| 2019-08-04 11:00:00 | 0.26 |
| 2019-08-04 12:00:00 | 0 |
| 2019-08-04 13:00:00 | 0.26 |
| 2019-08-04 14:00:00 | 0.26 |
| 2019-08-04 15:00:00 | 0.26 |
| 2019-08-04 16:00:00 | 0.26 |
| 2019-08-04 17:00:00 | 0.26 |
| 2019-08-04 18:00:00 | 0 |
| 2019-08-04 19:00:00 | 0.26 |
| 2019-08-04 20:00:00 | 0.26 |
| 2019-08-04 21:00:00 | 0.26 |
| 2019-08-04 22:00:00 | 0.26 |
| 2019-08-04 23:00:00 | 0.26 |
| 2019-08-05 | 0.26 |
| 2019-08-05 01:00:00 | 0 |
| 2019-08-05 02:00:00 | 0.26 |
| 2019-08-05 03:00:00 | 0.26 |
| 2019-08-05 04:00:00 | 0.26 |
| 2019-08-05 05:00:00 | 0.26 |
| 2019-08-05 06:00:00 | 0.26 |
| 2019-08-05 07:00:00 | 0.26 |
| 2019-08-05 08:00:00 | 0 |
| 2019-08-05 09:00:00 | 0.26 |
| 2019-08-05 10:00:00 | 0.26 |
| 2019-08-05 11:00:00 | 0.26 |
| 2019-08-05 12:00:00 | 0.26 |
| 2019-08-05 13:00:00 | 0 |
| 2019-08-05 14:00:00 | 0.26 |
| 2019-08-05 15:00:00 | 0.26 |
| 2019-08-05 16:00:00 | 0.26 |
| 2019-08-05 17:00:00 | 0.26 |
| 2019-08-05 18:00:00 | 11.18 |
| 2019-08-05 19:00:00 | 0.26 |
| 2019-08-05 20:00:00 | 0.26 |
| 2019-08-05 21:00:00 | 0.26 |
| 2019-08-05 22:00:00 | 0.26 |
| 2019-08-05 23:00:00 | 0.26 |
| 2019-08-06 | 0.26 |
| 2019-08-06 01:00:00 | 0.26 |
| 2019-08-06 02:00:00 | 0.26 |
| 2019-08-06 03:00:00 | 0.26 |
| 2019-08-06 04:00:00 | 0 |
| 2019-08-06 05:00:00 | 0.26 |
| 2019-08-06 06:00:00 | 0.26 |
| 2019-08-06 07:00:00 | 0.26 |
| 2019-08-06 08:00:00 | 0.26 |
| 2019-08-06 09:00:00 | 0.26 |
| 2019-08-06 10:00:00 | 0 |
| 2019-08-06 11:00:00 | 0.26 |
| 2019-08-06 12:00:00 | 0.26 |
| 2019-08-06 13:00:00 | 0.26 |
| 2019-08-06 14:00:00 | 0.26 |
| 2019-08-06 15:00:00 | 0 |
| 2019-08-06 16:00:00 | 0.26 |
| 2019-08-06 17:00:00 | 0.26 |
| 2019-08-06 18:00:00 | 0.26 |
| 2019-08-06 19:00:00 | 0.26 |
| 2019-08-06 20:00:00 | 0.26 |
| 2019-08-06 21:00:00 | 0 |
| 2019-08-06 22:00:00 | 0.26 |
| 2019-08-06 23:00:00 | 0.26 |
| 2019-08-07 | 0.26 |
| 2019-08-07 01:00:00 | 0.26 |
| 2019-08-07 02:00:00 | 0.26 |
| 2019-08-07 03:00:00 | 0.26 |
| 2019-08-07 04:00:00 | 0.26 |
| 2019-08-07 05:00:00 | 0 |
| 2019-08-07 06:00:00 | 0.26 |
| 2019-08-07 07:00:00 | 0.26 |
| 2019-08-07 08:00:00 | 0.26 |
| 2019-08-07 09:00:00 | 0.26 |
| 2019-08-07 10:00:00 | 0 |
| 2019-08-07 11:00:00 | 0.26 |
| 2019-08-07 12:00:00 | 0.26 |
| 2019-08-07 13:00:00 | 0.26 |
| 2019-08-07 14:00:00 | 0.26 |
| 2019-08-07 15:00:00 | 0.26 |
| 2019-08-07 16:00:00 | 0 |
| 2019-08-07 17:00:00 | 0.26 |
| 2019-08-07 18:00:00 | 0.26 |
| 2019-08-07 19:00:00 | 0.26 |
| 2019-08-07 20:00:00 | 0.26 |
| 2019-08-07 21:00:00 | 0.26 |
| 2019-08-07 22:00:00 | 0.26 |
| 2019-08-07 23:00:00 | 0 |
| 2019-08-08 | 0.26 |
| 2019-08-08 01:00:00 | 0.26 |
| 2019-08-08 02:00:00 | 0.26 |
| 2019-08-08 03:00:00 | 0.26 |
| 2019-08-08 04:00:00 | 0.26 |
| 2019-08-08 05:00:00 | 0.26 |
| 2019-08-08 06:00:00 | 0.26 |
| 2019-08-08 07:00:00 | 1.56 |
| 2019-08-08 08:00:00 | 9.62 |
| 2019-08-08 09:00:00 | 0.26 |
| 2019-08-08 10:00:00 | 0 |
| 2019-08-08 11:00:00 | 0.26 |
| 2019-08-08 12:00:00 | 0.26 |
| 2019-08-08 13:00:00 | 0.26 |
| 2019-08-08 14:00:00 | 0.26 |
| 2019-08-08 15:00:00 | 0 |
| 2019-08-08 16:00:00 | 0.26 |
| 2019-08-08 17:00:00 | 0.26 |
| 2019-08-08 18:00:00 | 0.26 |
| 2019-08-08 19:00:00 | 0.26 |
| 2019-08-08 20:00:00 | 0.26 |
| 2019-08-08 21:00:00 | 0 |
| 2019-08-08 22:00:00 | 0.26 |
| 2019-08-08 23:00:00 | 0.26 |
| 2019-08-09 | 0.26 |
| 2019-08-09 01:00:00 | 0.26 |
| 2019-08-09 02:00:00 | 0.26 |
| 2019-08-09 03:00:00 | 0.26 |
| 2019-08-09 04:00:00 | 0 |
| 2019-08-09 05:00:00 | 0.26 |
| 2019-08-09 06:00:00 | 0.26 |
| 2019-08-09 07:00:00 | 0.26 |
| 2019-08-09 08:00:00 | 0.26 |
| 2019-08-09 09:00:00 | 0.26 |
| 2019-08-09 10:00:00 | 0.26 |
| 2019-08-09 11:00:00 | 0 |
| 2019-08-09 12:00:00 | 0.26 |
| 2019-08-09 13:00:00 | 0.26 |
| 2019-08-09 14:00:00 | 0.26 |
| 2019-08-09 15:00:00 | 0.26 |
| 2019-08-09 16:00:00 | 0.26 |
| 2019-08-09 17:00:00 | 0 |
| 2019-08-09 18:00:00 | 0.26 |
| 2019-08-09 19:00:00 | 0.26 |
| 2019-08-09 20:00:00 | 0.26 |
| 2019-08-09 21:00:00 | 0.26 |
| 2019-08-09 22:00:00 | 0.26 |
| 2019-08-09 23:00:00 | 0 |
| 2019-08-10 | 0.26 |
| 2019-08-10 01:00:00 | 0.26 |
| 2019-08-10 02:00:00 | 0.26 |
| 2019-08-10 03:00:00 | 0.26 |
| 2019-08-10 04:00:00 | 0.26 |
| 2019-08-10 05:00:00 | 0.26 |
| 2019-08-10 06:00:00 | 0 |
| 2019-08-10 07:00:00 | 0.26 |
| 2019-08-10 08:00:00 | 0.26 |
| 2019-08-10 09:00:00 | 0.26 |
| 2019-08-10 10:00:00 | 0.26 |
| 2019-08-10 11:00:00 | 0 |
| 2019-08-10 12:00:00 | 0.26 |
| 2019-08-10 13:00:00 | 0.26 |
| 2019-08-10 14:00:00 | 0.26 |
| 2019-08-10 15:00:00 | 0.26 |
| 2019-08-10 16:00:00 | 0.26 |
| 2019-08-10 17:00:00 | 0 |
| 2019-08-10 18:00:00 | 0.26 |
| 2019-08-10 19:00:00 | 0.26 |
| 2019-08-10 20:00:00 | 0.26 |
| 2019-08-10 21:00:00 | 0.26 |
| 2019-08-10 22:00:00 | 0.26 |
| 2019-08-10 23:00:00 | 0 |
| 2019-08-11 | 0.26 |
| 2019-08-11 01:00:00 | 0.26 |
| 2019-08-11 02:00:00 | 0.26 |
| 2019-08-11 03:00:00 | 0.26 |
| 2019-08-11 04:00:00 | 0.26 |
| 2019-08-11 05:00:00 | 0.26 |
| 2019-08-11 06:00:00 | 0.26 |
| 2019-08-11 07:00:00 | 0 |
| 2019-08-11 08:00:00 | 0.26 |
| 2019-08-11 09:00:00 | 0.26 |
| 2019-08-11 10:00:00 | 0.26 |
| 2019-08-11 11:00:00 | 0.26 |
| 2019-08-11 12:00:00 | 0.26 |
| 2019-08-11 13:00:00 | 0 |
| 2019-08-11 14:00:00 | 0.26 |
| 2019-08-11 15:00:00 | 0.26 |
| 2019-08-11 16:00:00 | 0.26 |
| 2019-08-11 17:00:00 | 0.26 |
| 2019-08-11 18:00:00 | 0.26 |
| 2019-08-11 19:00:00 | 0 |
| 2019-08-11 20:00:00 | 0.26 |
| 2019-08-11 21:00:00 | 0.26 |
| 2019-08-11 22:00:00 | 0.26 |
| 2019-08-11 23:00:00 | 0.26 |
| 2019-08-12 | 0.26 |
| 2019-08-12 01:00:00 | 0.26 |
| 2019-08-12 02:00:00 | 0.26 |
| 2019-08-12 03:00:00 | 0 |
| 2019-08-12 04:00:00 | 0.26 |
| 2019-08-12 05:00:00 | 0.26 |
| 2019-08-12 06:00:00 | 0.26 |
| 2019-08-12 07:00:00 | 0.26 |
| 2019-08-12 08:00:00 | 0.26 |
| 2019-08-12 09:00:00 | 0.26 |
| 2019-08-12 10:00:00 | 0 |
| 2019-08-12 11:00:00 | 0.26 |
| 2019-08-12 12:00:00 | 3.38 |
| 2019-08-12 13:00:00 | 7.28 |
| 2019-08-12 14:00:00 | 0.26 |
| 2019-08-12 15:00:00 | 0.26 |
| 2019-08-12 16:00:00 | 0.26 |
| 2019-08-12 17:00:00 | 0.26 |
| 2019-08-12 18:00:00 | 0 |
| 2019-08-12 19:00:00 | 0.26 |
| 2019-08-12 20:00:00 | 0.26 |
| 2019-08-12 21:00:00 | 0.26 |
| 2019-08-12 22:00:00 | 0.26 |
| 2019-08-12 23:00:00 | 0.26 |
| 2019-08-13 | 0.26 |
| 2019-08-13 01:00:00 | 0.26 |
| 2019-08-13 02:00:00 | 0 |
| 2019-08-13 03:00:00 | 0.26 |
| 2019-08-13 04:00:00 | 0.26 |
| 2019-08-13 05:00:00 | 0.26 |
| 2019-08-13 06:00:00 | 0.26 |
| 2019-08-13 07:00:00 | 0.26 |
| 2019-08-13 08:00:00 | 0.26 |
| 2019-08-13 09:00:00 | 0 |
| 2019-08-13 10:00:00 | 0.26 |
| 2019-08-13 11:00:00 | 1.3 |
| 2019-08-13 12:00:00 | 0 |
| 2019-08-13 13:00:00 | 0.26 |
| 2019-08-13 14:00:00 | 0.26 |
| 2019-08-13 15:00:00 | 0.26 |
| 2019-08-13 16:00:00 | 0.26 |
| 2019-08-13 17:00:00 | 0 |
| 2019-08-13 18:00:00 | 0.26 |
| 2019-08-13 19:00:00 | 0.26 |
| 2019-08-13 20:00:00 | 0.26 |
| 2019-08-13 21:00:00 | 0.26 |
| 2019-08-13 22:00:00 | 0.26 |
| 2019-08-13 23:00:00 | 0 |
| 2019-08-14 | 0.26 |
| 2019-08-14 01:00:00 | 0.26 |
| 2019-08-14 02:00:00 | 0.26 |
| 2019-08-14 03:00:00 | 0.26 |
| 2019-08-14 04:00:00 | 0.26 |
| 2019-08-14 05:00:00 | 0.26 |
| 2019-08-14 06:00:00 | 0.26 |
| 2019-08-14 07:00:00 | 0 |
| 2019-08-14 08:00:00 | 0.26 |
| 2019-08-14 09:00:00 | 0.26 |
| 2019-08-14 10:00:00 | 0.26 |
| 2019-08-14 11:00:00 | 0.26 |
| 2019-08-14 12:00:00 | 0.26 |
| 2019-08-14 13:00:00 | 0 |
| 2019-08-14 14:00:00 | 0.26 |
| 2019-08-14 15:00:00 | 0.26 |
| 2019-08-14 16:00:00 | 1.3 |
| 2019-08-14 17:00:00 | 9.88 |
| 2019-08-14 18:00:00 | 0.26 |
| 2019-08-14 19:00:00 | 0 |
| 2019-08-14 20:00:00 | 0.26 |
| 2019-08-14 21:00:00 | 0.26 |
| 2019-08-14 22:00:00 | 0.26 |
| 2019-08-14 23:00:00 | 0.26 |
| 2019-08-15 | 0.26 |
| 2019-08-15 01:00:00 | 0.26 |
| 2019-08-15 02:00:00 | 0 |
| 2019-08-15 03:00:00 | 0.26 |
| 2019-08-15 04:00:00 | 0.26 |
| 2019-08-15 05:00:00 | 0.26 |
| 2019-08-15 06:00:00 | 0.26 |
| 2019-08-15 07:00:00 | 0.26 |
| 2019-08-15 08:00:00 | 0 |
| 2019-08-15 09:00:00 | 0.26 |
| 2019-08-15 10:00:00 | 0.26 |
| 2019-08-15 11:00:00 | 0.26 |
| 2019-08-15 12:00:00 | 0.26 |
| 2019-08-15 13:00:00 | 0 |
| 2019-08-15 14:00:00 | 0.26 |
| 2019-08-15 15:00:00 | 0.26 |
| 2019-08-15 16:00:00 | 0.26 |
| 2019-08-15 17:00:00 | 0.26 |
| 2019-08-15 18:00:00 | 0.26 |
| 2019-08-15 19:00:00 | 0 |
| 2019-08-15 20:00:00 | 0.26 |
| 2019-08-15 21:00:00 | 0.26 |
| 2019-08-15 22:00:00 | 0.26 |
| 2019-08-15 23:00:00 | 0.26 |
| 2019-08-16 | 0.26 |
| 2019-08-16 01:00:00 | 0.26 |
| 2019-08-16 02:00:00 | 0 |
| 2019-08-16 03:00:00 | 0.26 |
| 2019-08-16 04:00:00 | 0.26 |
| 2019-08-16 05:00:00 | 0.26 |
| 2019-08-16 06:00:00 | 0.26 |
| 2019-08-16 07:00:00 | 0.26 |
| 2019-08-16 08:00:00 | 0.26 |
| 2019-08-16 09:00:00 | 0 |
| 2019-08-16 10:00:00 | 0.26 |
| 2019-08-16 11:00:00 | 0.26 |
| 2019-08-16 12:00:00 | 0.26 |
| 2019-08-16 13:00:00 | 0.26 |
| 2019-08-16 14:00:00 | 0 |
| 2019-08-16 15:00:00 | 0.26 |
| 2019-08-16 16:00:00 | 0.26 |
| 2019-08-16 17:00:00 | 0.26 |
| 2019-08-16 18:00:00 | 0.26 |
| 2019-08-16 19:00:00 | 0 |
| 2019-08-16 20:00:00 | 0.26 |
| 2019-08-16 21:00:00 | 0.26 |
| 2019-08-16 22:00:00 | 0.26 |
| 2019-08-16 23:00:00 | 0.26 |
| 2019-08-17 | 0.26 |
| 2019-08-17 01:00:00 | 0.26 |
| 2019-08-17 02:00:00 | 0 |
| 2019-08-17 03:00:00 | 0.52 |
| 2019-08-17 04:00:00 | 0 |
| 2019-08-17 05:00:00 | 0.26 |
| 2019-08-17 06:00:00 | 0.26 |
| 2019-08-17 07:00:00 | 0.26 |
| 2019-08-17 08:00:00 | 0.26 |
| 2019-08-17 09:00:00 | 0 |
| 2019-08-17 10:00:00 | 0.26 |
| 2019-08-17 11:00:00 | 0.26 |
| 2019-08-17 12:00:00 | 0.26 |
| 2019-08-17 13:00:00 | 0.26 |
| 2019-08-17 14:00:00 | 0.26 |
| 2019-08-17 15:00:00 | 0 |
| 2019-08-17 16:00:00 | 0.26 |
| 2019-08-17 17:00:00 | 0.26 |
| 2019-08-17 18:00:00 | 0.26 |
| 2019-08-17 19:00:00 | 0.26 |
| 2019-08-17 20:00:00 | 0.26 |
| 2019-08-17 21:00:00 | 0 |
| 2019-08-17 22:00:00 | 0.26 |
| 2019-08-17 23:00:00 | 0.26 |
| 2019-08-18 | 0.26 |
| 2019-08-18 01:00:00 | 0.26 |
| 2019-08-18 02:00:00 | 0.26 |
| 2019-08-18 03:00:00 | 0.26 |
| 2019-08-18 04:00:00 | 0.26 |
| 2019-08-18 05:00:00 | 0 |
| 2019-08-18 06:00:00 | 0.26 |
| 2019-08-18 07:00:00 | 0.26 |
| 2019-08-18 08:00:00 | 0.26 |
| 2019-08-18 09:00:00 | 0.26 |
| 2019-08-18 10:00:00 | 0.26 |
| 2019-08-18 11:00:00 | 0 |
| 2019-08-18 12:00:00 | 0.26 |
| 2019-08-18 13:00:00 | 0.26 |
| 2019-08-18 14:00:00 | 0.26 |
| 2019-08-18 15:00:00 | 0.26 |
| 2019-08-18 16:00:00 | 0 |
| 2019-08-18 17:00:00 | 0.26 |
| 2019-08-18 18:00:00 | 0.26 |
| 2019-08-18 19:00:00 | 0.26 |
| 2019-08-18 20:00:00 | 2.6 |
| 2019-08-18 21:00:00 | 8.06 |
| 2019-08-18 22:00:00 | 0.26 |
| 2019-08-18 23:00:00 | 0.26 |
| 2019-08-19 | 0.26 |
| 2019-08-19 01:00:00 | 0 |
| 2019-08-19 02:00:00 | 0.26 |
| 2019-08-19 03:00:00 | 0.26 |
| 2019-08-19 04:00:00 | 0.26 |
| 2019-08-19 05:00:00 | 0.26 |
| 2019-08-19 06:00:00 | 0.26 |
| 2019-08-19 07:00:00 | 0.26 |
| 2019-08-19 08:00:00 | 0 |
| 2019-08-19 09:00:00 | 0.26 |
| 2019-08-19 10:00:00 | 0.26 |
| 2019-08-19 11:00:00 | 0.26 |
| 2019-08-19 12:00:00 | 0.26 |
| 2019-08-19 13:00:00 | 0 |
| 2019-08-19 14:00:00 | 0.26 |
| 2019-08-19 15:00:00 | 0.26 |
| 2019-08-19 16:00:00 | 0.26 |
| 2019-08-19 17:00:00 | 0.26 |
| 2019-08-19 18:00:00 | 0.26 |
| 2019-08-19 19:00:00 | 0 |
| 2019-08-19 20:00:00 | 0.26 |
| 2019-08-19 21:00:00 | 0.26 |
| 2019-08-19 22:00:00 | 0.26 |
| 2019-08-19 23:00:00 | 0.26 |
| 2019-08-20 | 0.26 |
| 2019-08-20 01:00:00 | 0.26 |
| 2019-08-20 02:00:00 | 0 |
| 2019-08-20 03:00:00 | 0.26 |
| 2019-08-20 04:00:00 | 0.26 |
| 2019-08-20 05:00:00 | 0.26 |
| 2019-08-20 06:00:00 | 0.26 |
| 2019-08-20 07:00:00 | 0.26 |
| 2019-08-20 08:00:00 | 0.26 |
| 2019-08-20 09:00:00 | 0 |
| 2019-08-20 10:00:00 | 0.26 |
| 2019-08-20 11:00:00 | 0.26 |
| 2019-08-20 12:00:00 | 0.26 |
| 2019-08-20 13:00:00 | 0.26 |
| 2019-08-20 14:00:00 | 0.26 |
| 2019-08-20 15:00:00 | 0 |
| 2019-08-20 16:00:00 | 0.26 |
| 2019-08-20 17:00:00 | 0.26 |
| 2019-08-20 18:00:00 | 0.26 |
| 2019-08-20 19:00:00 | 0.26 |
| 2019-08-20 20:00:00 | 0.26 |
| 2019-08-20 21:00:00 | 0 |
| 2019-08-20 22:00:00 | 0.26 |
| 2019-08-20 23:00:00 | 0.26 |
| 2019-08-21 | 0.26 |
| 2019-08-21 01:00:00 | 0.26 |
| 2019-08-21 02:00:00 | 0.26 |
| 2019-08-21 03:00:00 | 0.26 |
| 2019-08-21 04:00:00 | 0.26 |
| 2019-08-21 05:00:00 | 0 |
| 2019-08-21 06:00:00 | 0.26 |
| 2019-08-21 07:00:00 | 0.26 |
| 2019-08-21 08:00:00 | 0.26 |
| 2019-08-21 09:00:00 | 0.26 |
| 2019-08-21 10:00:00 | 0.26 |
| 2019-08-21 11:00:00 | 0 |
| 2019-08-21 12:00:00 | 0.26 |
| 2019-08-21 13:00:00 | 0.26 |
| 2019-08-21 14:00:00 | 0.26 |
| 2019-08-21 15:00:00 | 0.26 |
| 2019-08-21 16:00:00 | 0 |
| 2019-08-21 17:00:00 | 0.26 |
| 2019-08-21 18:00:00 | 0.26 |
| 2019-08-21 19:00:00 | 0.26 |
| 2019-08-21 20:00:00 | 0.26 |
| 2019-08-21 21:00:00 | 0.26 |
| 2019-08-21 22:00:00 | 0 |
| 2019-08-21 23:00:00 | 0.26 |
| 2019-08-22 | 0.26 |
| 2019-08-22 01:00:00 | 0.26 |
| 2019-08-22 02:00:00 | 0.26 |
| 2019-08-22 03:00:00 | 0.26 |
| 2019-08-22 04:00:00 | 0.26 |
| 2019-08-22 05:00:00 | 0.26 |
| 2019-08-22 06:00:00 | 0 |
| 2019-08-22 07:00:00 | 0.26 |
| 2019-08-22 08:00:00 | 0.26 |
| 2019-08-22 09:00:00 | 0.26 |
| 2019-08-22 10:00:00 | 0.78 |
| 2019-08-22 11:00:00 | 0.26 |
| 2019-08-22 12:00:00 | 0.26 |
| 2019-08-22 13:00:00 | 0.26 |
| 2019-08-22 14:00:00 | 0 |
| 2019-08-22 15:00:00 | 0.26 |
| 2019-08-22 16:00:00 | 0.26 |
| 2019-08-22 17:00:00 | 0.26 |
| 2019-08-22 18:00:00 | 0.26 |
| 2019-08-22 19:00:00 | 0.26 |
| 2019-08-22 20:00:00 | 0 |
| 2019-08-22 21:00:00 | 0.26 |
| 2019-08-22 22:00:00 | 0.26 |
| 2019-08-22 23:00:00 | 0.26 |
| 2019-08-23 | 0.26 |
| 2019-08-23 01:00:00 | 0.26 |
| 2019-08-23 02:00:00 | 0.26 |
| 2019-08-23 03:00:00 | 0.26 |
| 2019-08-23 04:00:00 | 0 |
| 2019-08-23 05:00:00 | 0.26 |
| 2019-08-23 06:00:00 | 0.26 |
| 2019-08-23 07:00:00 | 0.26 |
| 2019-08-23 08:00:00 | 1.82 |
| 2019-08-23 09:00:00 | 9.36 |
| 2019-08-23 10:00:00 | 0.26 |
| 2019-08-23 11:00:00 | 0 |
| 2019-08-23 12:00:00 | 0.26 |
| 2019-08-23 13:00:00 | 0.26 |
| 2019-08-23 14:00:00 | 0.26 |
| 2019-08-23 15:00:00 | 0.26 |
| 2019-08-23 16:00:00 | 0.26 |
| 2019-08-23 17:00:00 | 0 |
| 2019-08-23 18:00:00 | 0.26 |
| 2019-08-23 19:00:00 | 0.26 |
| 2019-08-23 20:00:00 | 0.26 |
| 2019-08-23 21:00:00 | 0.26 |
| 2019-08-23 22:00:00 | 0.26 |
| 2019-08-23 23:00:00 | 0 |
| 2019-08-24 | 0.26 |
| 2019-08-24 01:00:00 | 0.26 |
| 2019-08-24 02:00:00 | 0.26 |
| 2019-08-24 03:00:00 | 0.26 |
| 2019-08-24 04:00:00 | 0.26 |
| 2019-08-24 05:00:00 | 0.26 |
| 2019-08-24 06:00:00 | 0.26 |
| 2019-08-24 07:00:00 | 0.26 |
| 2019-08-24 08:00:00 | 0 |
| 2019-08-24 09:00:00 | 0.26 |
| 2019-08-24 10:00:00 | 0.26 |
| 2019-08-24 11:00:00 | 0.26 |
| 2019-08-24 12:00:00 | 0.26 |
| 2019-08-24 13:00:00 | 0 |
| 2019-08-24 14:00:00 | 0.26 |
| 2019-08-24 15:00:00 | 0.26 |
| 2019-08-24 16:00:00 | 0.26 |
| 2019-08-24 17:00:00 | 0.26 |
| 2019-08-24 18:00:00 | 0 |
| 2019-08-24 19:00:00 | 0.26 |
| 2019-08-24 20:00:00 | 0.26 |
| 2019-08-24 21:00:00 | 0.26 |
| 2019-08-24 22:00:00 | 0.26 |
| 2019-08-24 23:00:00 | 0.26 |
| 2019-08-25 | 0.26 |
| 2019-08-25 01:00:00 | 0.26 |
| 2019-08-25 02:00:00 | 0 |
| 2019-08-25 03:00:00 | 0.26 |
| 2019-08-25 04:00:00 | 0.26 |
| 2019-08-25 05:00:00 | 0.26 |
| 2019-08-25 06:00:00 | 0.26 |
| 2019-08-25 07:00:00 | 0.26 |
| 2019-08-25 08:00:00 | 0.26 |
| 2019-08-25 09:00:00 | 0 |
| 2019-08-25 10:00:00 | 0.26 |
| 2019-08-25 11:00:00 | 0.26 |
| 2019-08-25 12:00:00 | 0.26 |
| 2019-08-25 13:00:00 | 0.26 |
| 2019-08-25 14:00:00 | 0.26 |
| 2019-08-25 15:00:00 | 0 |
| 2019-08-25 16:00:00 | 0.26 |
| 2019-08-25 17:00:00 | 0.26 |
| 2019-08-25 18:00:00 | 0.26 |
| 2019-08-25 19:00:00 | 0.26 |
| 2019-08-25 20:00:00 | 0.26 |
| 2019-08-25 21:00:00 | 0 |
| 2019-08-25 22:00:00 | 0.26 |
| 2019-08-25 23:00:00 | 0.26 |
| 2019-08-26 | 0.26 |
| 2019-08-26 01:00:00 | 0.26 |
| 2019-08-26 02:00:00 | 0.26 |
| 2019-08-26 03:00:00 | 0.26 |
| 2019-08-26 04:00:00 | 0.26 |
| 2019-08-26 05:00:00 | 0.26 |
| 2019-08-26 06:00:00 | 0 |
| 2019-08-26 07:00:00 | 0.26 |
| 2019-08-26 08:00:00 | 0.26 |
| 2019-08-26 09:00:00 | 0.26 |
| 2019-08-26 10:00:00 | 0.26 |
| 2019-08-26 11:00:00 | 0.26 |
| 2019-08-26 12:00:00 | 0 |
| 2019-08-26 13:00:00 | 0.26 |
| 2019-08-26 14:00:00 | 0.26 |
| 2019-08-26 15:00:00 | 0.26 |
| 2019-08-26 16:00:00 | 0.26 |
| 2019-08-26 17:00:00 | 0.26 |
| 2019-08-26 18:00:00 | 0 |
| 2019-08-26 19:00:00 | 0.26 |
| 2019-08-26 20:00:00 | 0.26 |
| 2019-08-26 21:00:00 | 0.26 |
| 2019-08-26 22:00:00 | 0.26 |
| 2019-08-26 23:00:00 | 0.26 |
| 2019-08-27 | 0.26 |
| 2019-08-27 01:00:00 | 0.26 |
| 2019-08-27 02:00:00 | 0 |
| 2019-08-27 03:00:00 | 0.26 |
| 2019-08-27 04:00:00 | 0.26 |
| 2019-08-27 05:00:00 | 3.12 |
| 2019-08-27 06:00:00 | 7.54 |
| 2019-08-27 07:00:00 | 0.26 |
| 2019-08-27 08:00:00 | 0.26 |
| 2019-08-27 09:00:00 | 0.26 |
| 2019-08-27 10:00:00 | 0.26 |
| 2019-08-27 11:00:00 | 0.26 |
| 2019-08-27 12:00:00 | 0 |
| 2019-08-27 13:00:00 | 0.26 |
| 2019-08-27 14:00:00 | 0.26 |
| 2019-08-27 15:00:00 | 0.26 |
| 2019-08-27 16:00:00 | 0.26 |
| 2019-08-27 17:00:00 | 0.26 |
| 2019-08-27 18:00:00 | 0 |
| 2019-08-27 19:00:00 | 0.26 |
| 2019-08-27 20:00:00 | 0.26 |
| 2019-08-27 21:00:00 | 0.26 |
| 2019-08-27 22:00:00 | 0.26 |
| 2019-08-27 23:00:00 | 0.26 |
| 2019-08-28 | 0.26 |
| 2019-08-28 01:00:00 | 0 |
| 2019-08-28 02:00:00 | 0.26 |
| 2019-08-28 03:00:00 | 0.26 |
| 2019-08-28 04:00:00 | 0.26 |
| 2019-08-28 05:00:00 | 0.26 |
| 2019-08-28 06:00:00 | 0.26 |
| 2019-08-28 07:00:00 | 0.26 |
| 2019-08-28 08:00:00 | 0.26 |
| 2019-08-28 09:00:00 | 0 |
| 2019-08-28 10:00:00 | 0.26 |
| 2019-08-28 11:00:00 | 0.26 |
| 2019-08-28 12:00:00 | 0.26 |
| 2019-08-28 13:00:00 | 0.26 |
| 2019-08-28 14:00:00 | 0.26 |
| 2019-08-28 15:00:00 | 0 |
| 2019-08-28 16:00:00 | 0.26 |
| 2019-08-28 17:00:00 | 0.26 |
| 2019-08-28 18:00:00 | 0.26 |
| 2019-08-28 19:00:00 | 0.26 |
| 2019-08-28 20:00:00 | 0.26 |
| 2019-08-28 21:00:00 | 0 |
| 2019-08-28 22:00:00 | 0.26 |
| 2019-08-28 23:00:00 | 0.26 |
| 2019-08-29 | 0.26 |
| 2019-08-29 01:00:00 | 0.26 |
| 2019-08-29 02:00:00 | 0.26 |
| 2019-08-29 03:00:00 | 0.26 |
| 2019-08-29 04:00:00 | 0.26 |
| 2019-08-29 05:00:00 | 0.26 |
| 2019-08-29 06:00:00 | 0 |
| 2019-08-29 07:00:00 | 0.26 |
| 2019-08-29 08:00:00 | 0.26 |
| 2019-08-29 09:00:00 | 0.26 |
| 2019-08-29 10:00:00 | 0.26 |
| 2019-08-29 11:00:00 | 0.26 |
| 2019-08-29 12:00:00 | 0 |
| 2019-08-29 13:00:00 | 0.26 |
| 2019-08-29 14:00:00 | 0.26 |
| 2019-08-29 15:00:00 | 0.26 |
| 2019-08-29 16:00:00 | 0.26 |
| 2019-08-29 17:00:00 | 0 |
| 2019-08-29 18:00:00 | 0.26 |
| 2019-08-29 19:00:00 | 0.26 |
| 2019-08-29 20:00:00 | 0.26 |
| 2019-08-29 21:00:00 | 0.26 |
| 2019-08-29 22:00:00 | 0.26 |
| 2019-08-29 23:00:00 | 0.26 |
| 2019-08-30 | 0 |
| 2019-08-30 01:00:00 | 0.26 |
| 2019-08-30 02:00:00 | 0.26 |
| 2019-08-30 03:00:00 | 0.26 |
| 2019-08-30 04:00:00 | 0.26 |
| 2019-08-30 05:00:00 | 0.26 |
| 2019-08-30 06:00:00 | 0.26 |
| 2019-08-30 07:00:00 | 0.26 |
| 2019-08-30 08:00:00 | 0 |
| 2019-08-30 09:00:00 | 0.26 |
| 2019-08-30 10:00:00 | 0.26 |
| 2019-08-30 11:00:00 | 0.26 |
| 2019-08-30 12:00:00 | 0.26 |
| 2019-08-30 13:00:00 | 0 |
| 2019-08-30 14:00:00 | 0.26 |
| 2019-08-30 15:00:00 | 0.26 |
| 2019-08-30 16:00:00 | 0.26 |
| 2019-08-30 17:00:00 | 0.26 |
| 2019-08-30 18:00:00 | 0.26 |
| 2019-08-30 19:00:00 | 0 |
| 2019-08-30 20:00:00 | 0.26 |
| 2019-08-30 21:00:00 | 0.26 |
| 2019-08-30 22:00:00 | 0.26 |
| 2019-08-30 23:00:00 | 0.26 |
| 2019-08-31 | 0.26 |
| 2019-08-31 01:00:00 | 0.26 |
| 2019-08-31 02:00:00 | 0.26 |
| 2019-08-31 03:00:00 | 0 |
| 2019-08-31 04:00:00 | 0.26 |
| 2019-08-31 05:00:00 | 0.26 |
| 2019-08-31 06:00:00 | 0.26 |
| 2019-08-31 07:00:00 | 0.26 |
| 2019-08-31 08:00:00 | 0.26 |
| 2019-08-31 09:00:00 | 0.26 |
| 2019-08-31 10:00:00 | 0 |
| 2019-08-31 11:00:00 | 0.26 |
| 2019-08-31 12:00:00 | 8.58 |
| 2019-08-31 13:00:00 | 2.6 |
| 2019-08-31 14:00:00 | 0.26 |
| 2019-08-31 15:00:00 | 0.26 |
| 2019-08-31 16:00:00 | 0.26 |
| 2019-08-31 17:00:00 | 0 |
| 2019-08-31 18:00:00 | 0.26 |
| 2019-08-31 19:00:00 | 0.26 |
| 2019-08-31 20:00:00 | 0.26 |
| 2019-08-31 21:00:00 | 0.26 |
| 2019-08-31 22:00:00 | 0.26 |
| 2019-08-31 23:00:00 | 0.26 |
| 2019-09-01 | 0 |
| 2019-09-01 01:00:00 | 0.26 |
| 2019-09-01 02:00:00 | 0.26 |
| 2019-09-01 03:00:00 | 0.26 |
| 2019-09-01 04:00:00 | 0.26 |
| 2019-09-01 05:00:00 | 0.26 |
| 2019-09-01 06:00:00 | 0.26 |
| 2019-09-01 07:00:00 | 0.26 |
| 2019-09-01 08:00:00 | 0 |
| 2019-09-01 09:00:00 | 0.26 |
| 2019-09-01 10:00:00 | 0.26 |
| 2019-09-01 11:00:00 | 0.26 |
| 2019-09-01 12:00:00 | 0.26 |
| 2019-09-01 13:00:00 | 0.26 |
| 2019-09-01 14:00:00 | 0 |
| 2019-09-01 15:00:00 | 0.26 |
| 2019-09-01 16:00:00 | 0.26 |
| 2019-09-01 17:00:00 | 0.26 |
| 2019-09-01 18:00:00 | 0.26 |
| 2019-09-01 19:00:00 | 0.26 |
| 2019-09-01 20:00:00 | 0 |
| 2019-09-01 21:00:00 | 0.26 |
| 2019-09-01 22:00:00 | 0.26 |
| 2019-09-01 23:00:00 | 0.26 |
| 2019-09-02 | 0.26 |
| 2019-09-02 01:00:00 | 0.26 |
| 2019-09-02 02:00:00 | 0.26 |
| 2019-09-02 03:00:00 | 0.26 |
| 2019-09-02 04:00:00 | 0 |
| 2019-09-02 05:00:00 | 0.26 |
| 2019-09-02 06:00:00 | 0.26 |
| 2019-09-02 07:00:00 | 0.26 |
| 2019-09-02 08:00:00 | 0.26 |
| 2019-09-02 09:00:00 | 0.26 |
| 2019-09-02 10:00:00 | 0 |
| 2019-09-02 11:00:00 | 0.26 |
| 2019-09-02 12:00:00 | 0.26 |
| 2019-09-02 13:00:00 | 0.26 |
| 2019-09-02 14:00:00 | 0.26 |
| 2019-09-02 15:00:00 | 0.26 |
| 2019-09-02 16:00:00 | 0 |
| 2019-09-02 17:00:00 | 10.92 |
| 2019-09-02 18:00:00 | 0.26 |
| 2019-09-02 19:00:00 | 0.26 |
| 2019-09-02 20:00:00 | 0.26 |
| 2019-09-02 21:00:00 | 0.26 |
| 2019-09-02 22:00:00 | 0.26 |
| 2019-09-02 23:00:00 | 0.26 |
| 2019-09-03 | 0.26 |
| 2019-09-03 01:00:00 | 0 |
| 2019-09-03 02:00:00 | 0.26 |
| 2019-09-03 03:00:00 | 0.26 |
| 2019-09-03 04:00:00 | 0.26 |
| 2019-09-03 05:00:00 | 0.26 |
| 2019-09-03 06:00:00 | 0.26 |
| 2019-09-03 07:00:00 | 0.26 |
| 2019-09-03 08:00:00 | 0.26 |
| 2019-09-03 09:00:00 | 0 |
| 2019-09-03 10:00:00 | 0.26 |
| 2019-09-03 11:00:00 | 0.26 |
| 2019-09-03 12:00:00 | 0.26 |
| 2019-09-03 13:00:00 | 0.26 |
| 2019-09-03 14:00:00 | 0 |
| 2019-09-03 15:00:00 | 0.26 |
| 2019-09-03 16:00:00 | 0.26 |
| 2019-09-03 17:00:00 | 0.26 |
| 2019-09-03 18:00:00 | 0.26 |
| 2019-09-03 19:00:00 | 0.26 |
| 2019-09-03 20:00:00 | 0 |
| 2019-09-03 21:00:00 | 0.26 |
| 2019-09-03 22:00:00 | 0.26 |
| 2019-09-03 23:00:00 | 0.26 |
| 2019-09-04 | 0.26 |
| 2019-09-04 01:00:00 | 0.26 |
| 2019-09-04 02:00:00 | 0.26 |
| 2019-09-04 03:00:00 | 0 |
| 2019-09-04 04:00:00 | 0.26 |
| 2019-09-04 05:00:00 | 0.26 |
| 2019-09-04 06:00:00 | 0.26 |
| 2019-09-04 07:00:00 | 0.26 |
| 2019-09-04 08:00:00 | 0.26 |
| 2019-09-04 09:00:00 | 0.26 |
| 2019-09-04 10:00:00 | 1.04 |
| 2019-09-04 11:00:00 | 9.88 |
| 2019-09-04 12:00:00 | 0.26 |
| 2019-09-04 13:00:00 | 0.26 |
| 2019-09-04 14:00:00 | 0.26 |
| 2019-09-04 15:00:00 | 0 |
| 2019-09-04 16:00:00 | 0.26 |
| 2019-09-04 17:00:00 | 0.26 |
| 2019-09-04 18:00:00 | 0.26 |
| 2019-09-04 19:00:00 | 0.26 |
| 2019-09-04 20:00:00 | 0.26 |
| 2019-09-04 21:00:00 | 0.26 |
| 2019-09-04 22:00:00 | 0 |
| 2019-09-04 23:00:00 | 0.26 |
| 2019-09-05 | 0.26 |
| 2019-09-05 01:00:00 | 0.26 |
| 2019-09-05 02:00:00 | 0.26 |
| 2019-09-05 03:00:00 | 0.26 |
| 2019-09-05 04:00:00 | 0.26 |
| 2019-09-05 05:00:00 | 0.26 |
| 2019-09-05 06:00:00 | 0 |
| 2019-09-05 07:00:00 | 0.26 |
| 2019-09-05 08:00:00 | 0.26 |
| 2019-09-05 09:00:00 | 0.26 |
| 2019-09-05 10:00:00 | 0.26 |
| 2019-09-05 11:00:00 | 0.26 |
| 2019-09-05 12:00:00 | 10.14 |
| 2019-09-05 13:00:00 | 0.26 |
| 2019-09-05 14:00:00 | 0.26 |
| 2019-09-05 15:00:00 | 0 |
| 2019-09-05 16:00:00 | 0.26 |
| 2019-09-05 17:00:00 | 0.26 |
| 2019-09-05 18:00:00 | 0.26 |
| 2019-09-05 19:00:00 | 0.26 |
| 2019-09-05 20:00:00 | 0.26 |
| 2019-09-05 21:00:00 | 0.26 |
| 2019-09-05 22:00:00 | 0 |
| 2019-09-05 23:00:00 | 0.26 |
| 2019-09-06 | 0.26 |
| 2019-09-06 01:00:00 | 0.26 |
| 2019-09-06 02:00:00 | 0.26 |
| 2019-09-06 03:00:00 | 0.26 |
| 2019-09-06 04:00:00 | 0.26 |
| 2019-09-06 05:00:00 | 0.26 |
| 2019-09-06 06:00:00 | 0 |
| 2019-09-06 07:00:00 | 0.26 |
| 2019-09-06 08:00:00 | 0.26 |
| 2019-09-06 09:00:00 | 0.26 |
| 2019-09-06 10:00:00 | 0.26 |
| 2019-09-06 11:00:00 | 0 |
| 2019-09-06 12:00:00 | 0.26 |
| 2019-09-06 13:00:00 | 0.26 |
| 2019-09-06 14:00:00 | 0.26 |
| 2019-09-06 15:00:00 | 0.26 |
| 2019-09-06 16:00:00 | 0.26 |
| 2019-09-06 17:00:00 | 0 |
| 2019-09-06 18:00:00 | 0.26 |
| 2019-09-06 19:00:00 | 0.26 |
| 2019-09-06 20:00:00 | 0.26 |
| 2019-09-06 21:00:00 | 0.26 |
| 2019-09-06 22:00:00 | 0.26 |
| 2019-09-06 23:00:00 | 0 |
| 2019-09-07 | 0.26 |
| 2019-09-07 01:00:00 | 0.26 |
| 2019-09-07 02:00:00 | 0.26 |
| 2019-09-07 03:00:00 | 0.26 |
| 2019-09-07 04:00:00 | 0.26 |
| 2019-09-07 05:00:00 | 0.26 |
| 2019-09-07 06:00:00 | 0.26 |
| 2019-09-07 07:00:00 | 0.26 |
| 2019-09-07 08:00:00 | 0 |
| 2019-09-07 09:00:00 | 0.26 |
| 2019-09-07 10:00:00 | 0.26 |
| 2019-09-07 11:00:00 | 0.26 |
| 2019-09-07 12:00:00 | 0.26 |
| 2019-09-07 13:00:00 | 0.26 |
| 2019-09-07 14:00:00 | 0 |
| 2019-09-07 15:00:00 | 0.26 |
| 2019-09-07 16:00:00 | 0.26 |
| 2019-09-07 17:00:00 | 0.26 |
| 2019-09-07 18:00:00 | 0.26 |
| 2019-09-07 19:00:00 | 0 |
| 2019-09-07 20:00:00 | 0.26 |
| 2019-09-07 21:00:00 | 0.26 |
| 2019-09-07 22:00:00 | 0.26 |
| 2019-09-07 23:00:00 | 0.26 |
| 2019-09-08 | 0.26 |
| 2019-09-08 01:00:00 | 0.26 |
| 2019-09-08 02:00:00 | 0.26 |
| 2019-09-08 03:00:00 | 0 |
| 2019-09-08 04:00:00 | 0.26 |
| 2019-09-08 05:00:00 | 0.26 |
| 2019-09-08 06:00:00 | 0.26 |
| 2019-09-08 07:00:00 | 0.26 |
| 2019-09-08 08:00:00 | 0.26 |
| 2019-09-08 09:00:00 | 0.26 |
| 2019-09-08 10:00:00 | 0 |
| 2019-09-08 11:00:00 | 0.26 |
| 2019-09-08 12:00:00 | 0.26 |
| 2019-09-08 13:00:00 | 0.26 |
| 2019-09-08 14:00:00 | 0.26 |
| 2019-09-08 15:00:00 | 0.26 |
| 2019-09-08 16:00:00 | 0 |
| 2019-09-08 17:00:00 | 0.26 |
| 2019-09-08 18:00:00 | 0.26 |
| 2019-09-08 19:00:00 | 0.26 |
| 2019-09-08 20:00:00 | 0.26 |
| 2019-09-08 21:00:00 | 0.26 |
| 2019-09-08 22:00:00 | 8.84 |
| 2019-09-08 23:00:00 | 2.34 |
| 2019-09-09 | 0 |
| 2019-09-09 01:00:00 | 0.26 |
| 2019-09-09 02:00:00 | 0.26 |
| 2019-09-09 03:00:00 | 0.26 |
| 2019-09-09 04:00:00 | 0.26 |
| 2019-09-09 05:00:00 | 0.26 |
| 2019-09-09 06:00:00 | 0.26 |
| 2019-09-09 07:00:00 | 0.26 |
| 2019-09-09 08:00:00 | 0 |
| 2019-09-09 09:00:00 | 0.26 |
| 2019-09-09 10:00:00 | 0.26 |
| 2019-09-09 11:00:00 | 0.26 |
| 2019-09-09 12:00:00 | 0.26 |
| 2019-09-09 13:00:00 | 0.26 |
| 2019-09-09 14:00:00 | 0 |
| 2019-09-09 15:00:00 | 0.26 |
| 2019-09-09 16:00:00 | 0.26 |
| 2019-09-09 17:00:00 | 0.26 |
| 2019-09-09 18:00:00 | 0.26 |
| 2019-09-09 19:00:00 | 10.66 |
| 2019-09-09 20:00:00 | 0 |
| 2019-09-09 21:00:00 | 0.26 |
| 2019-09-09 22:00:00 | 0.26 |
| 2019-09-09 23:00:00 | 0.26 |
| 2019-09-10 | 0.26 |
| 2019-09-10 01:00:00 | 0.26 |
| 2019-09-10 02:00:00 | 0.26 |
| 2019-09-10 03:00:00 | 0.26 |
| 2019-09-10 04:00:00 | 0.26 |
| 2019-09-10 05:00:00 | 0 |
| 2019-09-10 06:00:00 | 0.26 |
| 2019-09-10 07:00:00 | 0.26 |
| 2019-09-10 08:00:00 | 0.26 |
| 2019-09-10 09:00:00 | 0.26 |
| 2019-09-10 10:00:00 | 0.26 |
| 2019-09-10 11:00:00 | 0.26 |
| 2019-09-10 12:00:00 | 0 |
| 2019-09-10 13:00:00 | 0.26 |
| 2019-09-10 14:00:00 | 0.26 |
| 2019-09-10 15:00:00 | 0.26 |
| 2019-09-10 16:00:00 | 0.26 |
| 2019-09-10 17:00:00 | 0 |
| 2019-09-10 18:00:00 | 0.26 |
| 2019-09-10 19:00:00 | 0.26 |
| 2019-09-10 20:00:00 | 0.26 |
| 2019-09-10 21:00:00 | 0.26 |
| 2019-09-10 22:00:00 | 0.26 |
| 2019-09-10 23:00:00 | 0.26 |
| 2019-09-11 | 0.26 |
| 2019-09-11 01:00:00 | 0 |
| 2019-09-11 02:00:00 | 0.26 |
| 2019-09-11 03:00:00 | 0.26 |
| 2019-09-11 04:00:00 | 0.26 |
| 2019-09-11 05:00:00 | 0.26 |
| 2019-09-11 06:00:00 | 0.26 |
| 2019-09-11 07:00:00 | 0.26 |
| 2019-09-11 08:00:00 | 0.26 |
| 2019-09-11 09:00:00 | 0 |
| 2019-09-11 10:00:00 | 0.26 |
| 2019-09-11 11:00:00 | 0.26 |
| 2019-09-11 12:00:00 | 0.26 |
| 2019-09-11 13:00:00 | 0.26 |
| 2019-09-11 14:00:00 | 0 |
| 2019-09-11 15:00:00 | 0.26 |
| 2019-09-11 16:00:00 | 0.26 |
| 2019-09-11 17:00:00 | 0.26 |
| 2019-09-11 18:00:00 | 0.26 |
| 2019-09-11 19:00:00 | 0 |
| 2019-09-11 20:00:00 | 0.26 |
| 2019-09-11 21:00:00 | 0.26 |
| 2019-09-11 22:00:00 | 0.26 |
| 2019-09-11 23:00:00 | 0.26 |
| 2019-09-12 | 0.26 |
| 2019-09-12 01:00:00 | 0.26 |
| 2019-09-12 02:00:00 | 0.26 |
| 2019-09-12 03:00:00 | 0.26 |
| 2019-09-12 04:00:00 | 0.26 |
| 2019-09-12 05:00:00 | 0 |
| 2019-09-12 06:00:00 | 0.26 |
| 2019-09-12 07:00:00 | 0.26 |
| 2019-09-12 08:00:00 | 0.26 |
| 2019-09-12 09:00:00 | 0.26 |
| 2019-09-12 10:00:00 | 0.26 |
| 2019-09-12 11:00:00 | 0 |
| 2019-09-12 12:00:00 | 0.26 |
| 2019-09-12 13:00:00 | 0.26 |
| 2019-09-12 14:00:00 | 0.26 |
| 2019-09-12 15:00:00 | 0.26 |
| 2019-09-12 16:00:00 | 0 |
| 2019-09-12 17:00:00 | 0.26 |
| 2019-09-12 18:00:00 | 0.26 |
| 2019-09-12 19:00:00 | 0.26 |
| 2019-09-12 20:00:00 | 9.1 |
| 2019-09-12 21:00:00 | 2.34 |
| 2019-09-12 22:00:00 | 0.26 |
| 2019-09-12 23:00:00 | 0.26 |
| 2019-09-13 | 0.26 |
| 2019-09-13 01:00:00 | 0.26 |
| 2019-09-13 02:00:00 | 0.26 |
| 2019-09-13 03:00:00 | 0.26 |
| 2019-09-13 04:00:00 | 0.26 |
| 2019-09-13 05:00:00 | 0.26 |
| 2019-09-13 06:00:00 | 0 |
| 2019-09-13 07:00:00 | 0.26 |
| 2019-09-13 08:00:00 | 0.26 |
| 2019-09-13 09:00:00 | 0.26 |
| 2019-09-13 10:00:00 | 0.26 |
| 2019-09-13 11:00:00 | 0.26 |
| 2019-09-13 12:00:00 | 0 |
| 2019-09-13 13:00:00 | 0.26 |
| 2019-09-13 14:00:00 | 0.26 |
| 2019-09-13 15:00:00 | 0.26 |
| 2019-09-13 16:00:00 | 0.26 |
| 2019-09-13 17:00:00 | 0.26 |
| 2019-09-13 18:00:00 | 0 |
| 2019-09-13 19:00:00 | 0.26 |
| 2019-09-13 20:00:00 | 0.26 |
| 2019-09-13 21:00:00 | 0.26 |
| 2019-09-13 22:00:00 | 0.26 |
| 2019-09-13 23:00:00 | 0.26 |
| 2019-09-14 | 0.26 |
| 2019-09-14 01:00:00 | 0.26 |
| 2019-09-14 02:00:00 | 0 |
| 2019-09-14 03:00:00 | 0.26 |
| 2019-09-14 04:00:00 | 0.26 |
| 2019-09-14 05:00:00 | 0.26 |
| 2019-09-14 06:00:00 | 0.26 |
| 2019-09-14 07:00:00 | 0.26 |
| 2019-09-14 08:00:00 | 0.26 |
| 2019-09-14 09:00:00 | 0.26 |
| 2019-09-14 10:00:00 | 0 |
| 2019-09-14 11:00:00 | 0.26 |
| 2019-09-14 12:00:00 | 0.26 |
| 2019-09-14 13:00:00 | 0.26 |
| 2019-09-14 14:00:00 | 0.26 |
| 2019-09-14 15:00:00 | 0.26 |
| 2019-09-14 16:00:00 | 0 |
| 2019-09-14 17:00:00 | 0.26 |
| 2019-09-14 18:00:00 | 0.26 |
| 2019-09-14 19:00:00 | 0.26 |
| 2019-09-14 20:00:00 | 0.26 |
| 2019-09-14 21:00:00 | 0.26 |
| 2019-09-14 22:00:00 | 0.26 |
| 2019-09-14 23:00:00 | 0 |
| 2019-09-15 | 0.26 |
| 2019-09-15 01:00:00 | 0.26 |
| 2019-09-15 02:00:00 | 0.26 |
| 2019-09-15 03:00:00 | 0.26 |
| 2019-09-15 04:00:00 | 0.26 |
| 2019-09-15 05:00:00 | 0.26 |
| 2019-09-15 06:00:00 | 0.26 |
| 2019-09-15 07:00:00 | 0 |
| 2019-09-15 08:00:00 | 0.26 |
| 2019-09-15 09:00:00 | 0.26 |
| 2019-09-15 10:00:00 | 0.26 |
| 2019-09-15 11:00:00 | 0.26 |
| 2019-09-15 12:00:00 | 0.26 |
| 2019-09-15 13:00:00 | 0 |
| 2019-09-15 14:00:00 | 0.26 |
| 2019-09-15 15:00:00 | 0.26 |
| 2019-09-15 16:00:00 | 0.26 |
| 2019-09-15 17:00:00 | 0.26 |
| 2019-09-15 18:00:00 | 0 |
| 2019-09-15 19:00:00 | 0.26 |
| 2019-09-15 20:00:00 | 0.26 |
| 2019-09-15 21:00:00 | 0.26 |
| 2019-09-15 22:00:00 | 0.26 |
| 2019-09-15 23:00:00 | 0.26 |
| 2019-09-16 | 0.26 |
| 2019-09-16 01:00:00 | 0.26 |
| 2019-09-16 02:00:00 | 0.26 |
| 2019-09-16 03:00:00 | 0 |
| 2019-09-16 04:00:00 | 0.26 |
| 2019-09-16 05:00:00 | 0.26 |
| 2019-09-16 06:00:00 | 0.26 |
| 2019-09-16 07:00:00 | 0.26 |
| 2019-09-16 08:00:00 | 0.26 |
| 2019-09-16 09:00:00 | 0 |
| 2019-09-16 10:00:00 | 0.26 |
| 2019-09-16 11:00:00 | 0.26 |
| 2019-09-16 12:00:00 | 0.26 |
| 2019-09-16 13:00:00 | 0.26 |
| 2019-09-16 14:00:00 | 0.26 |
| 2019-09-16 15:00:00 | 0 |
| 2019-09-16 16:00:00 | 0.26 |
| 2019-09-16 17:00:00 | 0.26 |
| 2019-09-16 18:00:00 | 0.26 |
| 2019-09-16 19:00:00 | 0.26 |
| 2019-09-16 20:00:00 | 0.26 |
| 2019-09-16 21:00:00 | 0 |
| 2019-09-16 22:00:00 | 4.16 |
| 2019-09-16 23:00:00 | 6.76 |
| 2019-09-17 | 0.26 |
| 2019-09-17 01:00:00 | 0 |
| 2019-09-17 02:00:00 | 0.26 |
| 2019-09-17 03:00:00 | 0.26 |
| 2019-09-17 04:00:00 | 0.26 |
| 2019-09-17 05:00:00 | 0.26 |
| 2019-09-17 06:00:00 | 0.26 |
| 2019-09-17 07:00:00 | 0.26 |
| 2019-09-17 08:00:00 | 0.26 |
| 2019-09-17 09:00:00 | 0 |
| 2019-09-17 10:00:00 | 0.26 |
| 2019-09-17 11:00:00 | 0.26 |
| 2019-09-17 12:00:00 | 0.26 |
| 2019-09-17 13:00:00 | 0.26 |
| 2019-09-17 14:00:00 | 0 |
| 2019-09-17 15:00:00 | 0.26 |
| 2019-09-17 16:00:00 | 0.26 |
| 2019-09-17 17:00:00 | 0.26 |
| 2019-09-17 18:00:00 | 0.26 |
| 2019-09-17 19:00:00 | 0.26 |
| 2019-09-17 20:00:00 | 0 |
| 2019-09-17 21:00:00 | 0.26 |
| 2019-09-17 22:00:00 | 0.26 |
| 2019-09-17 23:00:00 | 0.26 |
| 2019-09-18 | 0.26 |
| 2019-09-18 01:00:00 | 0.26 |
| 2019-09-18 02:00:00 | 0.26 |
| 2019-09-18 03:00:00 | 0.26 |
| 2019-09-18 04:00:00 | 0.26 |
| 2019-09-18 05:00:00 | 0 |
| 2019-09-18 06:00:00 | 0.52 |
| 2019-09-18 07:00:00 | 0 |
| 2019-09-18 08:00:00 | 0.26 |
| 2019-09-18 09:00:00 | 0 |
| 2019-09-18 10:00:00 | 0 |
| 2019-09-18 11:00:00 | 0 |
| 2019-09-18 12:00:00 | 0 |
| 2019-09-18 13:00:00 | 0 |
| 2019-09-18 14:00:00 | 0 |
| 2019-09-18 15:00:00 | 0.26 |
| 2019-09-18 16:00:00 | 0 |
| 2019-09-18 17:00:00 | 0.26 |
| 2019-09-18 18:00:00 | 0.26 |
| 2019-09-18 19:00:00 | 0 |
| 2019-09-18 20:00:00 | 0.26 |
| 2019-09-18 21:00:00 | 0 |
| 2019-09-18 22:00:00 | 0.26 |
| 2019-09-18 23:00:00 | 0.26 |
| 2019-09-19 | 0 |
| 2019-09-19 01:00:00 | 0.26 |
| 2019-09-19 02:00:00 | 0.26 |
| 2019-09-19 03:00:00 | 0 |
| 2019-09-19 04:00:00 | 0.26 |
| 2019-09-19 05:00:00 | 0.26 |
| 2019-09-19 06:00:00 | 0 |
| 2019-09-19 07:00:00 | 0.26 |
| 2019-09-19 08:00:00 | 0 |
| 2019-09-19 09:00:00 | 0.26 |
| 2019-09-19 10:00:00 | 0 |
| 2019-09-19 11:00:00 | 0.26 |
| 2019-09-19 12:00:00 | 1.82 |
| 2019-09-19 13:00:00 | 0.78 |
| 2019-09-19 14:00:00 | 0.26 |
| 2019-09-19 15:00:00 | 0 |
| 2019-09-19 16:00:00 | 0.26 |
| 2019-09-19 17:00:00 | 0 |
| 2019-09-19 18:00:00 | 0.26 |
| 2019-09-19 19:00:00 | 0 |
| 2019-09-19 20:00:00 | 0.26 |
| 2019-09-19 21:00:00 | 0 |
| 2019-09-19 22:00:00 | 0.26 |
| 2019-09-19 23:00:00 | 0 |
| 2019-09-20 | 0.26 |
| 2019-09-20 01:00:00 | 0 |
| 2019-09-20 02:00:00 | 0.26 |
| 2019-09-20 03:00:00 | 0 |
| 2019-09-20 04:00:00 | 0.26 |
| 2019-09-20 05:00:00 | 0.26 |
| 2019-09-20 06:00:00 | 0 |
| 2019-09-20 07:00:00 | 0 |
| 2019-09-20 08:00:00 | 0.26 |
| 2019-09-20 09:00:00 | 0 |
| 2019-09-20 10:00:00 | 8.32 |
| 2019-09-20 11:00:00 | 2.34 |
| 2019-09-20 12:00:00 | 0.26 |
| 2019-09-20 13:00:00 | 0 |
| 2019-09-20 14:00:00 | 0.26 |
| 2019-09-20 15:00:00 | 0 |
| 2019-09-20 16:00:00 | 0.26 |
| 2019-09-20 17:00:00 | 0 |
| 2019-09-20 18:00:00 | 0.26 |
| 2019-09-20 19:00:00 | 0 |
| 2019-09-20 20:00:00 | 0.26 |
| 2019-09-20 21:00:00 | 0 |
| 2019-09-20 22:00:00 | 0.26 |
| 2019-09-20 23:00:00 | 0 |
| 2019-09-21 | 0.26 |
| 2019-09-21 01:00:00 | 0 |
| 2019-09-21 02:00:00 | 0.26 |
| 2019-09-21 03:00:00 | 0 |
| 2019-09-21 04:00:00 | 0.26 |
| 2019-09-21 05:00:00 | 0 |
| 2019-09-21 06:00:00 | 0.26 |
| 2019-09-21 07:00:00 | 0 |
| 2019-09-21 08:00:00 | 0.26 |
| 2019-09-21 09:00:00 | 0.26 |
| 2019-09-21 10:00:00 | 0 |
| 2019-09-21 11:00:00 | 0.26 |
| 2019-09-21 12:00:00 | 0 |
| 2019-09-21 13:00:00 | 0.26 |
| 2019-09-21 14:00:00 | 0 |
| 2019-09-21 15:00:00 | 0.26 |
| 2019-09-21 16:00:00 | 0 |
| 2019-09-21 17:00:00 | 0.26 |
| 2019-09-21 18:00:00 | 0.26 |
| 2019-09-21 19:00:00 | 0 |
| 2019-09-21 20:00:00 | 0.26 |
| 2019-09-21 21:00:00 | 0 |
| 2019-09-21 22:00:00 | 0.26 |
| 2019-09-21 23:00:00 | 0 |
| 2019-09-22 | 0.26 |
| 2019-09-22 01:00:00 | 0 |
| 2019-09-22 02:00:00 | 0.26 |
| 2019-09-22 03:00:00 | 0 |
| 2019-09-22 04:00:00 | 0.26 |
| 2019-09-22 05:00:00 | 0 |
| 2019-09-22 06:00:00 | 0.26 |
| 2019-09-22 07:00:00 | 0 |
| 2019-09-22 08:00:00 | 0.26 |
| 2019-09-22 09:00:00 | 0 |
| 2019-09-22 10:00:00 | 0.26 |
| 2019-09-22 11:00:00 | 0 |
| 2019-09-22 12:00:00 | 0.26 |
| 2019-09-22 13:00:00 | 0 |
| 2019-09-22 14:00:00 | 0.26 |
| 2019-09-22 15:00:00 | 11.18 |
| 2019-09-22 16:00:00 | 0.26 |
| 2019-09-22 17:00:00 | 0.26 |
| 2019-09-22 18:00:00 | 0 |
| 2019-09-22 19:00:00 | 0.26 |
| 2019-09-22 20:00:00 | 0 |
| 2019-09-22 21:00:00 | 0.26 |
| 2019-09-22 22:00:00 | 0 |
| 2019-09-22 23:00:00 | 0.26 |
| 2019-09-23 | 0 |
| 2019-09-23 01:00:00 | 0.26 |
| 2019-09-23 02:00:00 | 0 |
| 2019-09-23 03:00:00 | 0.26 |
| 2019-09-23 04:00:00 | 0 |
| 2019-09-23 05:00:00 | 0.26 |
| 2019-09-23 06:00:00 | 0 |
| 2019-09-23 07:00:00 | 0.26 |
| 2019-09-23 08:00:00 | 0 |
| 2019-09-23 09:00:00 | 0.26 |
| 2019-09-23 10:00:00 | 0 |
| 2019-09-23 11:00:00 | 0.26 |
| 2019-09-23 12:00:00 | 0 |
| 2019-09-23 13:00:00 | 0.26 |
| 2019-09-23 14:00:00 | 0 |
| 2019-09-23 15:00:00 | 0.26 |
| 2019-09-23 16:00:00 | 0 |
| 2019-09-23 17:00:00 | 0.26 |
| 2019-09-23 18:00:00 | 0 |
| 2019-09-23 19:00:00 | 0.26 |
| 2019-09-23 20:00:00 | 0.26 |
| 2019-09-23 21:00:00 | 0 |
| 2019-09-23 22:00:00 | 0 |
| 2019-09-23 23:00:00 | 0.26 |
| 2019-09-24 | 0 |
| 2019-09-24 01:00:00 | 0.26 |
| 2019-09-24 02:00:00 | 0 |
| 2019-09-24 03:00:00 | 0.26 |
| 2019-09-24 04:00:00 | 0.26 |
| 2019-09-24 05:00:00 | 0 |
| 2019-09-24 06:00:00 | 0.26 |
| 2019-09-24 07:00:00 | 0 |
| 2019-09-24 08:00:00 | 0 |
| 2019-09-24 09:00:00 | 0.26 |
| 2019-09-24 10:00:00 | 0 |
| 2019-09-24 11:00:00 | 0.26 |
| 2019-09-24 12:00:00 | 0.26 |
| 2019-09-24 13:00:00 | 0 |
| 2019-09-24 14:00:00 | 0.26 |
| 2019-09-24 15:00:00 | 0 |
| 2019-09-24 16:00:00 | 0.26 |
| 2019-09-24 17:00:00 | 0 |
| 2019-09-24 18:00:00 | 0.26 |
| 2019-09-24 19:00:00 | 0 |
| 2019-09-24 20:00:00 | 0.26 |
| 2019-09-24 21:00:00 | 0 |
| 2019-09-24 22:00:00 | 0.26 |
| 2019-09-24 23:00:00 | 0 |
| 2019-09-25 | 0.26 |
| 2019-09-25 01:00:00 | 0 |
| 2019-09-25 02:00:00 | 0.26 |
| 2019-09-25 03:00:00 | 0 |
| 2019-09-25 04:00:00 | 0.26 |
| 2019-09-25 05:00:00 | 0 |
| 2019-09-25 06:00:00 | 0.26 |
| 2019-09-25 07:00:00 | 0 |
| 2019-09-25 08:00:00 | 0.26 |
| 2019-09-25 09:00:00 | 0 |
| 2019-09-25 10:00:00 | 0.26 |
| 2019-09-25 11:00:00 | 0 |
| 2019-09-25 12:00:00 | 0.26 |
| 2019-09-25 13:00:00 | 0.26 |
| 2019-09-25 14:00:00 | 0 |
| 2019-09-25 15:00:00 | 0.26 |
| 2019-09-25 16:00:00 | 0.26 |
| 2019-09-25 17:00:00 | 0.26 |
| 2019-09-25 18:00:00 | 0 |
| 2019-09-25 19:00:00 | 0.26 |
| 2019-09-25 20:00:00 | 0.26 |
| 2019-09-25 21:00:00 | 0.26 |
| 2019-09-25 22:00:00 | 0 |
| 2019-09-25 23:00:00 | 0.26 |
| 2019-09-26 | 0.26 |
| 2019-09-26 01:00:00 | 0.26 |
| 2019-09-26 02:00:00 | 0.26 |
| 2019-09-26 03:00:00 | 0 |
| 2019-09-26 04:00:00 | 0.26 |
| 2019-09-26 05:00:00 | 0.26 |
| 2019-09-26 06:00:00 | 0.26 |
| 2019-09-26 07:00:00 | 0.26 |
| 2019-09-26 08:00:00 | 0 |
| 2019-09-26 09:00:00 | 0.26 |
| 2019-09-26 10:00:00 | 0.26 |
| 2019-09-26 11:00:00 | 0.26 |
| 2019-09-26 12:00:00 | 1.04 |
| 2019-09-26 13:00:00 | 0 |
| 2019-09-26 14:00:00 | 0.26 |
| 2019-09-26 15:00:00 | 0.26 |
| 2019-09-26 16:00:00 | 0.26 |
| 2019-09-26 17:00:00 | 0 |
| 2019-09-26 18:00:00 | 0.26 |
| 2019-09-26 19:00:00 | 0.26 |
| 2019-09-26 20:00:00 | 0.26 |
| 2019-09-26 21:00:00 | 0 |
| 2019-09-26 22:00:00 | 10.66 |
| 2019-09-26 23:00:00 | 0 |
| 2019-09-27 | 0.26 |
| 2019-09-27 01:00:00 | 0.26 |
| 2019-09-27 02:00:00 | 0.26 |
| 2019-09-27 03:00:00 | 0.26 |
| 2019-09-27 04:00:00 | 0 |
| 2019-09-27 05:00:00 | 0.26 |
| 2019-09-27 06:00:00 | 0.26 |
| 2019-09-27 07:00:00 | 0.26 |
| 2019-09-27 08:00:00 | 0 |
| 2019-09-27 09:00:00 | 0.26 |
| 2019-09-27 10:00:00 | 0.26 |
| 2019-09-27 11:00:00 | 0.26 |
| 2019-09-27 12:00:00 | 0 |
| 2019-09-27 13:00:00 | 0.26 |
| 2019-09-27 14:00:00 | 0.26 |
| 2019-09-27 15:00:00 | 0 |
| 2019-09-27 16:00:00 | 0.26 |
| 2019-09-27 17:00:00 | 0.26 |
| 2019-09-27 18:00:00 | 0.26 |
| 2019-09-27 19:00:00 | 0 |
| 2019-09-27 20:00:00 | 0.26 |
| 2019-09-27 21:00:00 | 0.26 |
| 2019-09-27 22:00:00 | 0.26 |
| 2019-09-27 23:00:00 | 0 |
| 2019-09-28 | 0.26 |
| 2019-09-28 01:00:00 | 0.26 |
| 2019-09-28 02:00:00 | 0.26 |
| 2019-09-28 03:00:00 | 0.26 |
| 2019-09-28 04:00:00 | 0 |
| 2019-09-28 05:00:00 | 0.26 |
| 2019-09-28 06:00:00 | 0.26 |
| 2019-09-28 07:00:00 | 0.26 |
| 2019-09-28 08:00:00 | 0.26 |
| 2019-09-28 09:00:00 | 0 |
| 2019-09-28 10:00:00 | 0.26 |
| 2019-09-28 11:00:00 | 0.26 |
| 2019-09-28 12:00:00 | 0 |
| 2019-09-28 13:00:00 | 0.26 |
| 2019-09-28 14:00:00 | 0.26 |
| 2019-09-28 15:00:00 | 0.26 |
| 2019-09-28 16:00:00 | 0 |
| 2019-09-28 17:00:00 | 0.26 |
| 2019-09-28 18:00:00 | 0.26 |
| 2019-09-28 19:00:00 | 0 |
| 2019-09-28 20:00:00 | 0.26 |
| 2019-09-28 21:00:00 | 0.26 |
| 2019-09-28 22:00:00 | 0.26 |
| 2019-09-28 23:00:00 | 0 |
| 2019-09-29 | 0.26 |
| 2019-09-29 01:00:00 | 0.26 |
| 2019-09-29 02:00:00 | 0.26 |
| 2019-09-29 03:00:00 | 0 |
| 2019-09-29 04:00:00 | 0.26 |
| 2019-09-29 05:00:00 | 0.26 |
| 2019-09-29 06:00:00 | 0.26 |
| 2019-09-29 07:00:00 | 0.26 |
| 2019-09-29 08:00:00 | 0 |
| 2019-09-29 09:00:00 | 0.26 |
| 2019-09-29 10:00:00 | 0.26 |
| 2019-09-29 11:00:00 | 0 |
| 2019-09-29 12:00:00 | 0.26 |
| 2019-09-29 13:00:00 | 0.26 |
| 2019-09-29 14:00:00 | 0.26 |
| 2019-09-29 15:00:00 | 0.26 |
| 2019-09-29 16:00:00 | 0 |
| 2019-09-29 17:00:00 | 0.26 |
| 2019-09-29 18:00:00 | 0.26 |
| 2019-09-29 19:00:00 | 0 |
| 2019-09-29 20:00:00 | 0.26 |
| 2019-09-29 21:00:00 | 0.26 |
| 2019-09-29 22:00:00 | 0.26 |
| 2019-09-29 23:00:00 | 0.26 |
| 2019-09-30 | 0 |
| 2019-09-30 01:00:00 | 0.26 |
| 2019-09-30 02:00:00 | 0.26 |
| 2019-09-30 03:00:00 | 0.26 |
| 2019-09-30 04:00:00 | 0 |
| 2019-09-30 05:00:00 | 0.26 |
| 2019-09-30 06:00:00 | 0.26 |
| 2019-09-30 07:00:00 | 0.26 |
| 2019-09-30 08:00:00 | 0 |
| 2019-09-30 09:00:00 | 0.26 |
| 2019-09-30 10:00:00 | 0.26 |
| 2019-09-30 11:00:00 | 0.26 |
| 2019-09-30 12:00:00 | 0 |
| 2019-09-30 13:00:00 | 0.26 |
| 2019-09-30 14:00:00 | 0.26 |
| 2019-09-30 15:00:00 | 0.26 |
| 2019-09-30 16:00:00 | 0 |
| 2019-09-30 17:00:00 | 0.26 |
| 2019-09-30 18:00:00 | 10.92 |
| 2019-09-30 19:00:00 | 0.26 |
| 2019-09-30 20:00:00 | 0.26 |
| 2019-09-30 21:00:00 | 0 |
| 2019-09-30 22:00:00 | 0.26 |
| 2019-09-30 23:00:00 | 0.26 |
| 2019-10-01 | 0.26 |
| 2019-10-01 01:00:00 | 0 |
| 2019-10-01 02:00:00 | 0.26 |
| 2019-10-01 03:00:00 | 0.26 |
| 2019-10-01 04:00:00 | 0.26 |
| 2019-10-01 05:00:00 | 0 |
| 2019-10-01 06:00:00 | 0.26 |
| 2019-10-01 07:00:00 | 0.26 |
| 2019-10-01 08:00:00 | 0.26 |
| 2019-10-01 09:00:00 | 0 |
| 2019-10-01 10:00:00 | 0.26 |
| 2019-10-01 11:00:00 | 0.26 |
| 2019-10-01 12:00:00 | 0.26 |
| 2019-10-01 13:00:00 | 0.26 |
| 2019-10-01 14:00:00 | 0 |
| 2019-10-01 15:00:00 | 0.26 |
| 2019-10-01 16:00:00 | 0.26 |
| 2019-10-01 17:00:00 | 0.26 |
| 2019-10-01 18:00:00 | 0.26 |
| 2019-10-01 19:00:00 | 0 |
| 2019-10-01 20:00:00 | 0.26 |
| 2019-10-01 21:00:00 | 0.26 |
| 2019-10-01 22:00:00 | 0.26 |
| 2019-10-01 23:00:00 | 0 |
| 2019-10-02 | 0.26 |
| 2019-10-02 01:00:00 | 0.26 |
| 2019-10-02 02:00:00 | 0.26 |
| 2019-10-02 03:00:00 | 0.26 |
| 2019-10-02 04:00:00 | 0 |
| 2019-10-02 05:00:00 | 0.26 |
| 2019-10-02 06:00:00 | 0.26 |
| 2019-10-02 07:00:00 | 0.26 |
| 2019-10-02 08:00:00 | 0.26 |
| 2019-10-02 09:00:00 | 0 |
| 2019-10-02 10:00:00 | 0.26 |
| 2019-10-02 11:00:00 | 0.26 |
| 2019-10-02 12:00:00 | 0.78 |
| 2019-10-02 13:00:00 | 0 |
| 2019-10-02 14:00:00 | 0.26 |
| 2019-10-02 15:00:00 | 0.26 |
| 2019-10-02 16:00:00 | 0.26 |
| 2019-10-02 17:00:00 | 0 |
| 2019-10-02 18:00:00 | 0.26 |
| 2019-10-02 19:00:00 | 0.26 |
| 2019-10-02 20:00:00 | 0.26 |
| 2019-10-02 21:00:00 | 0 |
| 2019-10-02 22:00:00 | 0.26 |
| 2019-10-02 23:00:00 | 0.26 |
| 2019-10-03 | 0.26 |
| 2019-10-03 01:00:00 | 0 |
| 2019-10-03 02:00:00 | 0.26 |
| 2019-10-03 03:00:00 | 0.26 |
| 2019-10-03 04:00:00 | 0.26 |
| 2019-10-03 05:00:00 | 0.26 |
| 2019-10-03 06:00:00 | 0 |
| 2019-10-03 07:00:00 | 0.26 |
| 2019-10-03 08:00:00 | 0.26 |
| 2019-10-03 09:00:00 | 0.26 |
| 2019-10-03 10:00:00 | 0 |
| 2019-10-03 11:00:00 | 0.26 |
| 2019-10-03 12:00:00 | 0.26 |
| 2019-10-03 13:00:00 | 0.26 |
| 2019-10-03 14:00:00 | 0.26 |
| 2019-10-03 15:00:00 | 0 |
| 2019-10-03 16:00:00 | 0.26 |
| 2019-10-03 17:00:00 | 10.66 |
| 2019-10-03 18:00:00 | 0.26 |
| 2019-10-03 19:00:00 | 0 |
| 2019-10-03 20:00:00 | 0.26 |
| 2019-10-03 21:00:00 | 0.26 |
| 2019-10-03 22:00:00 | 0.26 |
| 2019-10-03 23:00:00 | 0 |
| 2019-10-04 | 0.26 |
| 2019-10-04 01:00:00 | 0.26 |
| 2019-10-04 02:00:00 | 0.26 |
| 2019-10-04 03:00:00 | 0.26 |
| 2019-10-04 04:00:00 | 0.26 |
| 2019-10-04 05:00:00 | 0 |
| 2019-10-04 06:00:00 | 0.26 |
| 2019-10-04 07:00:00 | 0.26 |
| 2019-10-04 08:00:00 | 0.26 |
| 2019-10-04 09:00:00 | 0.26 |
| 2019-10-04 10:00:00 | 0 |
| 2019-10-04 11:00:00 | 0.26 |
| 2019-10-04 12:00:00 | 0.26 |
| 2019-10-04 13:00:00 | 0.26 |
| 2019-10-04 14:00:00 | 0 |
| 2019-10-04 15:00:00 | 0.26 |
| 2019-10-04 16:00:00 | 0.26 |
| 2019-10-04 17:00:00 | 0.26 |
| 2019-10-04 18:00:00 | 0.26 |
| 2019-10-04 19:00:00 | 0 |
| 2019-10-04 20:00:00 | 0.26 |
| 2019-10-04 21:00:00 | 0.26 |
| 2019-10-04 22:00:00 | 0.26 |
| 2019-10-04 23:00:00 | 0.26 |
| 2019-10-05 | 0.26 |
| 2019-10-05 01:00:00 | 0 |
| 2019-10-05 02:00:00 | 0.26 |
| 2019-10-05 03:00:00 | 0.26 |
| 2019-10-05 04:00:00 | 0.26 |
| 2019-10-05 05:00:00 | 0.26 |
| 2019-10-05 06:00:00 | 0.26 |
| 2019-10-05 07:00:00 | 0.26 |
| 2019-10-05 08:00:00 | 0 |
| 2019-10-05 09:00:00 | 0.26 |
| 2019-10-05 10:00:00 | 0.26 |
| 2019-10-05 11:00:00 | 0.26 |
| 2019-10-05 12:00:00 | 0 |
| 2019-10-05 13:00:00 | 0.26 |
| 2019-10-05 14:00:00 | 0.26 |
| 2019-10-05 15:00:00 | 0.26 |
| 2019-10-05 16:00:00 | 0.26 |
| 2019-10-05 17:00:00 | 0 |
| 2019-10-05 18:00:00 | 0.26 |
| 2019-10-05 19:00:00 | 10.92 |
| 2019-10-05 20:00:00 | 0.26 |
| 2019-10-05 21:00:00 | 0.26 |
| 2019-10-05 22:00:00 | 0.26 |
| 2019-10-05 23:00:00 | 0.26 |
| 2019-10-06 | 0.26 |
| 2019-10-06 01:00:00 | 0.26 |
| 2019-10-06 02:00:00 | 0.26 |
| 2019-10-06 03:00:00 | 0 |
| 2019-10-06 04:00:00 | 0.52 |
| 2019-10-06 05:00:00 | 0 |
| 2019-10-06 06:00:00 | 0.26 |
| 2019-10-06 07:00:00 | 0.26 |
| 2019-10-06 08:00:00 | 0.26 |
| 2019-10-06 09:00:00 | 0.26 |
| 2019-10-06 10:00:00 | 0.26 |
| 2019-10-06 11:00:00 | 0.26 |
| 2019-10-06 12:00:00 | 0.26 |
| 2019-10-06 13:00:00 | 0 |
| 2019-10-06 14:00:00 | 0.26 |
| 2019-10-06 15:00:00 | 0.26 |
| 2019-10-06 16:00:00 | 0.26 |
| 2019-10-06 17:00:00 | 0.26 |
| 2019-10-06 18:00:00 | 0.26 |
| 2019-10-06 19:00:00 | 0.26 |
| 2019-10-06 20:00:00 | 0.26 |
| 2019-10-06 21:00:00 | 0.26 |
| 2019-10-06 22:00:00 | 0.26 |
| 2019-10-06 23:00:00 | 0.26 |
| 2019-10-07 | 0.26 |
| 2019-10-07 01:00:00 | 0.26 |
| 2019-10-07 02:00:00 | 0.26 |
| 2019-10-07 03:00:00 | 0.26 |
| 2019-10-07 04:00:00 | 0.26 |
| 2019-10-07 05:00:00 | 0.26 |
| 2019-10-07 06:00:00 | 0.26 |
| 2019-10-07 07:00:00 | 0.26 |
| 2019-10-07 08:00:00 | 0.26 |
| 2019-10-07 09:00:00 | 0.26 |
| 2019-10-07 10:00:00 | 0.26 |
| 2019-10-07 11:00:00 | 0.26 |
| 2019-10-07 12:00:00 | 0.26 |
| 2019-10-07 13:00:00 | 0.26 |
| 2019-10-07 14:00:00 | 0.26 |
| 2019-10-07 15:00:00 | 0.26 |
| 2019-10-07 16:00:00 | 0.26 |
| 2019-10-07 17:00:00 | 0.26 |
| 2019-10-07 18:00:00 | 0.26 |
| 2019-10-07 19:00:00 | 0.26 |
| 2019-10-07 20:00:00 | 0.26 |
| 2019-10-07 21:00:00 | 0.26 |
| 2019-10-07 22:00:00 | 0.26 |
| 2019-10-07 23:00:00 | 0.26 |
| 2019-10-08 | 0.26 |
| 2019-10-08 01:00:00 | 0.52 |
| 2019-10-08 02:00:00 | 0.26 |
| 2019-10-08 03:00:00 | 0.52 |
| 2019-10-08 04:00:00 | 0.52 |
| 2019-10-08 05:00:00 | 0.52 |
| 2019-10-08 06:00:00 | 0.52 |
| 2019-10-08 07:00:00 | 0.78 |
| 2019-10-08 08:00:00 | 0.78 |
| 2019-10-08 09:00:00 | 0.52 |
| 2019-10-08 10:00:00 | 0.52 |
| 2019-10-08 11:00:00 | 0.26 |
| 2019-10-08 12:00:00 | 0.26 |
| 2019-10-08 13:00:00 | 0.52 |
| 2019-10-08 14:00:00 | 5.2 |
| 2019-10-08 15:00:00 | 5.72 |
| 2019-10-08 16:00:00 | 0.26 |
| 2019-10-08 17:00:00 | 0.26 |
| 2019-10-08 18:00:00 | 0.26 |
| 2019-10-08 19:00:00 | 0.26 |
| 2019-10-08 20:00:00 | 0.26 |
| 2019-10-08 21:00:00 | 0.26 |
| 2019-10-08 22:00:00 | 0.26 |
| 2019-10-08 23:00:00 | 0.26 |
| 2019-10-09 | 0.26 |
| 2019-10-09 01:00:00 | 0.26 |
| 2019-10-09 02:00:00 | 0.26 |
| 2019-10-09 03:00:00 | 0.26 |
| 2019-10-09 04:00:00 | 0.52 |
| 2019-10-09 05:00:00 | 0.26 |
| 2019-10-09 06:00:00 | 0.26 |
| 2019-10-09 07:00:00 | 0.26 |
| 2019-10-09 08:00:00 | 0.26 |
| 2019-10-09 09:00:00 | 0.26 |
| 2019-10-09 10:00:00 | 0.26 |
| 2019-10-09 11:00:00 | 0.26 |
| 2019-10-09 12:00:00 | 3.12 |
| 2019-10-09 13:00:00 | 1.04 |
| 2019-10-09 14:00:00 | 0.52 |
| 2019-10-09 15:00:00 | 0.52 |
| 2019-10-09 16:00:00 | 0.52 |
| 2019-10-09 17:00:00 | 0.52 |
| 2019-10-09 18:00:00 | 0.52 |
| 2019-10-09 19:00:00 | 0.52 |
| 2019-10-09 20:00:00 | 0.52 |
| 2019-10-09 21:00:00 | 0.52 |
| 2019-10-09 22:00:00 | 0.52 |
| 2019-10-09 23:00:00 | 0.52 |
| 2019-10-10 | 0.26 |
| 2019-10-10 01:00:00 | 0.52 |
| 2019-10-10 02:00:00 | 0.52 |
| 2019-10-10 03:00:00 | 0.78 |
| 2019-10-10 04:00:00 | 0.52 |
| 2019-10-10 05:00:00 | 0.52 |
| 2019-10-10 06:00:00 | 0.52 |
| 2019-10-10 07:00:00 | 0.52 |
| 2019-10-10 08:00:00 | 0.78 |
| 2019-10-10 09:00:00 | 0.52 |
| 2019-10-10 10:00:00 | 0.52 |
| 2019-10-10 11:00:00 | 0.26 |
| 2019-10-10 12:00:00 | 0.26 |
| 2019-10-10 13:00:00 | 0.26 |
| 2019-10-10 14:00:00 | 0.26 |
| 2019-10-10 15:00:00 | 0.26 |
| 2019-10-10 16:00:00 | 0.26 |
| 2019-10-10 17:00:00 | 0.52 |
| 2019-10-10 18:00:00 | 0.26 |
| 2019-10-10 19:00:00 | 0.26 |
| 2019-10-10 20:00:00 | 0.26 |
| 2019-10-10 21:00:00 | 0.52 |
| 2019-10-10 22:00:00 | 0.26 |
| 2019-10-10 23:00:00 | 0.52 |
| 2019-10-11 | 1.82 |
| 2019-10-11 01:00:00 | 9.88 |
| 2019-10-11 02:00:00 | 0.26 |
| 2019-10-11 03:00:00 | 0.52 |
| 2019-10-11 04:00:00 | 0.52 |
| 2019-10-11 05:00:00 | 0.52 |
| 2019-10-11 06:00:00 | 0.78 |
| 2019-10-11 07:00:00 | 0.52 |
| 2019-10-11 08:00:00 | 0.78 |
| 2019-10-11 09:00:00 | 0.78 |
| 2019-10-11 10:00:00 | 0.52 |
| 2019-10-11 11:00:00 | 0.26 |
| 2019-10-11 12:00:00 | 0.52 |
| 2019-10-11 13:00:00 | 0 |
| 2019-10-11 14:00:00 | 0.26 |
| 2019-10-11 15:00:00 | 0.52 |
| 2019-10-11 16:00:00 | 0.26 |
| 2019-10-11 17:00:00 | 0.26 |
| 2019-10-11 18:00:00 | 0.26 |
| 2019-10-11 19:00:00 | 0.26 |
| 2019-10-11 20:00:00 | 0.26 |
| 2019-10-11 21:00:00 | 0.26 |
| 2019-10-11 22:00:00 | 0.26 |
| 2019-10-11 23:00:00 | 0.26 |
| 2019-10-12 | 0.52 |
| 2019-10-12 01:00:00 | 0.26 |
| 2019-10-12 02:00:00 | 0.26 |
| 2019-10-12 03:00:00 | 0.52 |
| 2019-10-12 04:00:00 | 0.26 |
| 2019-10-12 05:00:00 | 0.52 |
| 2019-10-12 06:00:00 | 0.26 |
| 2019-10-12 07:00:00 | 0.52 |
| 2019-10-12 08:00:00 | 0.26 |
| 2019-10-12 09:00:00 | 0.26 |
| 2019-10-12 10:00:00 | 0.26 |
| 2019-10-12 11:00:00 | 0.26 |
| 2019-10-12 12:00:00 | 0.26 |
| 2019-10-12 13:00:00 | 0.26 |
| 2019-10-12 14:00:00 | 0.26 |
| 2019-10-12 15:00:00 | 0.26 |
| 2019-10-12 16:00:00 | 0.26 |
| 2019-10-12 17:00:00 | 0.26 |
| 2019-10-12 18:00:00 | 0.26 |
| 2019-10-12 19:00:00 | 0.26 |
| 2019-10-12 20:00:00 | 0.26 |
| 2019-10-12 21:00:00 | 0.26 |
| 2019-10-12 22:00:00 | 0.26 |
| 2019-10-12 23:00:00 | 0.26 |
| 2019-10-13 | 0.26 |
| 2019-10-13 01:00:00 | 0.26 |
| 2019-10-13 02:00:00 | 0.26 |
| 2019-10-13 03:00:00 | 0.26 |
| 2019-10-13 04:00:00 | 0.26 |
| 2019-10-13 05:00:00 | 0.26 |
| 2019-10-13 06:00:00 | 0.26 |
| 2019-10-13 07:00:00 | 0.26 |
| 2019-10-13 08:00:00 | 0.26 |
| 2019-10-13 09:00:00 | 0.26 |
| 2019-10-13 10:00:00 | 0.26 |
| 2019-10-13 11:00:00 | 0.26 |
| 2019-10-13 12:00:00 | 0.26 |
| 2019-10-13 13:00:00 | 0.26 |
| 2019-10-13 14:00:00 | 0.26 |
| 2019-10-13 15:00:00 | 0 |
| 2019-10-13 16:00:00 | 0.26 |
| 2019-10-13 17:00:00 | 0.26 |
| 2019-10-13 18:00:00 | 0.26 |
| 2019-10-13 19:00:00 | 0.26 |
| 2019-10-13 20:00:00 | 0.26 |
| 2019-10-13 21:00:00 | 10.66 |
| 2019-10-13 22:00:00 | 0.26 |
| 2019-10-13 23:00:00 | 0 |
| 2019-10-14 | 0.26 |
| 2019-10-14 01:00:00 | 0.26 |
| 2019-10-14 02:00:00 | 0.26 |
| 2019-10-14 03:00:00 | 0.26 |
| 2019-10-14 04:00:00 | 0.26 |
| 2019-10-14 05:00:00 | 0.26 |
| 2019-10-14 06:00:00 | 0.26 |
| 2019-10-14 07:00:00 | 0.26 |
| 2019-10-14 08:00:00 | 0.26 |
| 2019-10-14 09:00:00 | 0.26 |
| 2019-10-14 10:00:00 | 0.26 |
| 2019-10-14 11:00:00 | 0.26 |
| 2019-10-14 12:00:00 | 0 |
| 2019-10-14 13:00:00 | 0.52 |
| 2019-10-14 14:00:00 | 0 |
| 2019-10-14 15:00:00 | 0.26 |
| 2019-10-14 16:00:00 | 0.26 |
| 2019-10-14 17:00:00 | 0.26 |
| 2019-10-14 18:00:00 | 0.26 |
| 2019-10-14 19:00:00 | 0.26 |
| 2019-10-14 20:00:00 | 0.26 |
| 2019-10-14 21:00:00 | 0 |
| 2019-10-14 22:00:00 | 0.26 |
| 2019-10-14 23:00:00 | 0.26 |
| 2019-10-15 | 0.26 |
| 2019-10-15 01:00:00 | 0.26 |
| 2019-10-15 02:00:00 | 0.26 |
| 2019-10-15 03:00:00 | 0.26 |
| 2019-10-15 04:00:00 | 0.26 |
| 2019-10-15 05:00:00 | 0.26 |
| 2019-10-15 06:00:00 | 0.26 |
| 2019-10-15 07:00:00 | 0.26 |
| 2019-10-15 08:00:00 | 0 |
| 2019-10-15 09:00:00 | 0.26 |
| 2019-10-15 10:00:00 | 0.26 |
| 2019-10-15 11:00:00 | 0.26 |
| 2019-10-15 12:00:00 | 0.26 |
| 2019-10-15 13:00:00 | 0.26 |
| 2019-10-15 14:00:00 | 0.26 |
| 2019-10-15 15:00:00 | 0 |
| 2019-10-15 16:00:00 | 0.26 |
| 2019-10-15 17:00:00 | 0.26 |
| 2019-10-15 18:00:00 | 0.26 |
| 2019-10-15 19:00:00 | 0.26 |
| 2019-10-15 20:00:00 | 0 |
| 2019-10-15 21:00:00 | 0.26 |
| 2019-10-15 22:00:00 | 0.26 |
| 2019-10-15 23:00:00 | 0.26 |
| 2019-10-16 | 0.26 |
| 2019-10-16 01:00:00 | 0.26 |
| 2019-10-16 02:00:00 | 0.26 |
| 2019-10-16 03:00:00 | 0 |
| 2019-10-16 04:00:00 | 0.26 |
| 2019-10-16 05:00:00 | 0.26 |
| 2019-10-16 06:00:00 | 0.26 |
| 2019-10-16 07:00:00 | 0.26 |
| 2019-10-16 08:00:00 | 0.26 |
| 2019-10-16 09:00:00 | 0.26 |
| 2019-10-16 10:00:00 | 0.26 |
| 2019-10-16 11:00:00 | 0.52 |
| 2019-10-16 12:00:00 | 1.56 |
| 2019-10-16 13:00:00 | 0.26 |
| 2019-10-16 14:00:00 | 0.52 |
| 2019-10-16 15:00:00 | 0.52 |
| 2019-10-16 16:00:00 | 0.26 |
| 2019-10-16 17:00:00 | 0.26 |
| 2019-10-16 18:00:00 | 0.52 |
| 2019-10-16 19:00:00 | 0.26 |
| 2019-10-16 20:00:00 | 0.52 |
| 2019-10-16 21:00:00 | 0.26 |
| 2019-10-16 22:00:00 | 0.52 |
| 2019-10-16 23:00:00 | 0.26 |
| 2019-10-17 | 0.26 |
| 2019-10-17 01:00:00 | 0.52 |
| 2019-10-17 02:00:00 | 0.26 |
| 2019-10-17 03:00:00 | 0.52 |
| 2019-10-17 04:00:00 | 0.52 |
| 2019-10-17 05:00:00 | 0.52 |
| 2019-10-17 06:00:00 | 0.26 |
| 2019-10-17 07:00:00 | 0.52 |
| 2019-10-17 08:00:00 | 0.78 |
| 2019-10-17 09:00:00 | 0.52 |
| 2019-10-17 10:00:00 | 11.44 |
| 2019-10-17 11:00:00 | 0.52 |
| 2019-10-17 12:00:00 | 0.26 |
| 2019-10-17 13:00:00 | 0.26 |
| 2019-10-17 14:00:00 | 0.52 |
| 2019-10-17 15:00:00 | 0.26 |
| 2019-10-17 16:00:00 | 0.26 |
| 2019-10-17 17:00:00 | 0.26 |
| 2019-10-17 18:00:00 | 0.52 |
| 2019-10-17 19:00:00 | 0.26 |
| 2019-10-17 20:00:00 | 0.26 |
| 2019-10-17 21:00:00 | 0.26 |
| 2019-10-17 22:00:00 | 0.52 |
| 2019-10-17 23:00:00 | 0.26 |
| 2019-10-18 | 0.52 |
| 2019-10-18 01:00:00 | 0.26 |
| 2019-10-18 02:00:00 | 0.52 |
| 2019-10-18 03:00:00 | 0.26 |
| 2019-10-18 04:00:00 | 0.52 |
| 2019-10-18 05:00:00 | 0.52 |
| 2019-10-18 06:00:00 | 0.52 |
| 2019-10-18 07:00:00 | 0.52 |
| 2019-10-18 08:00:00 | 0.78 |
| 2019-10-18 09:00:00 | 0.78 |
| 2019-10-18 10:00:00 | 0.52 |
| 2019-10-18 11:00:00 | 0.52 |
| 2019-10-18 12:00:00 | 0.26 |
| 2019-10-18 13:00:00 | 0.26 |
| 2019-10-18 14:00:00 | 0.52 |
| 2019-10-18 15:00:00 | 0.26 |
| 2019-10-18 16:00:00 | 0.26 |
| 2019-10-18 17:00:00 | 0.26 |
| 2019-10-18 18:00:00 | 0.52 |
| 2019-10-18 19:00:00 | 0.26 |
| 2019-10-18 20:00:00 | 0.26 |
| 2019-10-18 21:00:00 | 0.26 |
| 2019-10-18 22:00:00 | 0.52 |
| 2019-10-18 23:00:00 | 0.26 |
| 2019-10-19 | 0.26 |
| 2019-10-19 01:00:00 | 0.52 |
| 2019-10-19 02:00:00 | 0.26 |
| 2019-10-19 03:00:00 | 0.52 |
| 2019-10-19 04:00:00 | 0.52 |
| 2019-10-19 05:00:00 | 0.26 |
| 2019-10-19 06:00:00 | 0.52 |
| 2019-10-19 07:00:00 | 0.52 |
| 2019-10-19 08:00:00 | 0.52 |
| 2019-10-19 09:00:00 | 0.52 |
| 2019-10-19 10:00:00 | 0.52 |
| 2019-10-19 11:00:00 | 0.26 |
| 2019-10-19 12:00:00 | 0.52 |
| 2019-10-19 13:00:00 | 0.26 |
| 2019-10-19 14:00:00 | 0.26 |
| 2019-10-19 15:00:00 | 0.52 |
| 2019-10-19 16:00:00 | 0.26 |
| 2019-10-19 17:00:00 | 0.26 |
| 2019-10-19 18:00:00 | 0.26 |
| 2019-10-19 19:00:00 | 0.52 |
| 2019-10-19 20:00:00 | 0.26 |
| 2019-10-19 21:00:00 | 0.26 |
| 2019-10-19 22:00:00 | 0.26 |
| 2019-10-19 23:00:00 | 0.52 |
| 2019-10-20 | 0.26 |
| 2019-10-20 01:00:00 | 0.52 |
| 2019-10-20 02:00:00 | 0.26 |
| 2019-10-20 03:00:00 | 12.48 |
| 2019-10-20 04:00:00 | 0.52 |
| 2019-10-20 05:00:00 | 0.52 |
| 2019-10-20 06:00:00 | 0.52 |
| 2019-10-20 07:00:00 | 0.52 |
| 2019-10-20 08:00:00 | 0.52 |
| 2019-10-20 09:00:00 | 0.52 |
| 2019-10-20 10:00:00 | 0.52 |
| 2019-10-20 11:00:00 | 0.52 |
| 2019-10-20 12:00:00 | 0.26 |
| 2019-10-20 13:00:00 | 0.26 |
| 2019-10-20 14:00:00 | 0.52 |
| 2019-10-20 15:00:00 | 0.26 |
| 2019-10-20 16:00:00 | 0.26 |
| 2019-10-20 17:00:00 | 0.26 |
| 2019-10-20 18:00:00 | 0.52 |
| 2019-10-20 19:00:00 | 0.26 |
| 2019-10-20 20:00:00 | 0.26 |
| 2019-10-20 21:00:00 | 0.26 |
| 2019-10-20 22:00:00 | 0.52 |
| 2019-10-20 23:00:00 | 0.26 |
| 2019-10-21 | 0.26 |
| 2019-10-21 01:00:00 | 0.26 |
| 2019-10-21 02:00:00 | 0.52 |
| 2019-10-21 03:00:00 | 0.52 |
| 2019-10-21 04:00:00 | 0.26 |
| 2019-10-21 05:00:00 | 0.52 |
| 2019-10-21 06:00:00 | 0.26 |
| 2019-10-21 07:00:00 | 0.52 |
| 2019-10-21 08:00:00 | 0.52 |
| 2019-10-21 09:00:00 | 0.52 |
| 2019-10-21 10:00:00 | 0.52 |
| 2019-10-21 11:00:00 | 0.52 |
| 2019-10-21 12:00:00 | 0.26 |
| 2019-10-21 13:00:00 | 0.26 |
| 2019-10-21 14:00:00 | 0.26 |
| 2019-10-21 15:00:00 | 0.52 |
| 2019-10-21 16:00:00 | 0.26 |
| 2019-10-21 17:00:00 | 0.26 |
| 2019-10-21 18:00:00 | 0.26 |
| 2019-10-21 19:00:00 | 0.26 |
| 2019-10-21 20:00:00 | 0.52 |
| 2019-10-21 21:00:00 | 0.26 |
| 2019-10-21 22:00:00 | 0.26 |
| 2019-10-21 23:00:00 | 0.26 |
| 2019-10-22 | 0.52 |
| 2019-10-22 01:00:00 | 0.26 |
| 2019-10-22 02:00:00 | 0.26 |
| 2019-10-22 03:00:00 | 0.52 |
| 2019-10-22 04:00:00 | 0.26 |
| 2019-10-22 05:00:00 | 0.52 |
| 2019-10-22 06:00:00 | 0.26 |
| 2019-10-22 07:00:00 | 0.52 |
| 2019-10-22 08:00:00 | 0.26 |
| 2019-10-22 09:00:00 | 0.52 |
| 2019-10-22 10:00:00 | 0.52 |
| 2019-10-22 11:00:00 | 0.26 |
| 2019-10-22 12:00:00 | 0.26 |
| 2019-10-22 13:00:00 | 0.52 |
| 2019-10-22 14:00:00 | 0.26 |
| 2019-10-22 15:00:00 | 0.26 |
| 2019-10-22 16:00:00 | 0.26 |
| 2019-10-22 17:00:00 | 0.52 |
| 2019-10-22 18:00:00 | 0.26 |
| 2019-10-22 19:00:00 | 0.26 |
| 2019-10-22 20:00:00 | 0.26 |
| 2019-10-22 21:00:00 | 0.26 |
| 2019-10-22 22:00:00 | 0.52 |
| 2019-10-22 23:00:00 | 0.26 |
| 2019-10-23 | 0.26 |
| 2019-10-23 01:00:00 | 0.52 |
| 2019-10-23 02:00:00 | 0.26 |
| 2019-10-23 03:00:00 | 0.26 |
| 2019-10-23 04:00:00 | 0.52 |
| 2019-10-23 05:00:00 | 0.26 |
| 2019-10-23 06:00:00 | 0.52 |
| 2019-10-23 07:00:00 | 0.26 |
| 2019-10-23 08:00:00 | 0.26 |
| 2019-10-23 09:00:00 | 0.52 |
| 2019-10-23 10:00:00 | 4.94 |
| 2019-10-23 11:00:00 | 6.5 |
| 2019-10-23 12:00:00 | 0.26 |
| 2019-10-23 13:00:00 | 0.52 |
| 2019-10-23 14:00:00 | 0.26 |
| 2019-10-23 15:00:00 | 0.26 |
| 2019-10-23 16:00:00 | 0.26 |
| 2019-10-23 17:00:00 | 0.52 |
| 2019-10-23 18:00:00 | 0.26 |
| 2019-10-23 19:00:00 | 0.26 |
| 2019-10-23 20:00:00 | 0.26 |
| 2019-10-23 21:00:00 | 0.52 |
| 2019-10-23 22:00:00 | 0.26 |
| 2019-10-23 23:00:00 | 0.26 |
| 2019-10-24 | 0.52 |
| 2019-10-24 01:00:00 | 0.26 |
| 2019-10-24 02:00:00 | 0.52 |
| 2019-10-24 03:00:00 | 0.26 |
| 2019-10-24 04:00:00 | 0.52 |
| 2019-10-24 05:00:00 | 0.52 |
| 2019-10-24 06:00:00 | 0.52 |
| 2019-10-24 07:00:00 | 0.78 |
| 2019-10-24 08:00:00 | 0.78 |
| 2019-10-24 09:00:00 | 1.3 |
| 2019-10-24 10:00:00 | 0.78 |
| 2019-10-24 11:00:00 | 0.52 |
| 2019-10-24 12:00:00 | 0.26 |
| 2019-10-24 13:00:00 | 0.52 |
| 2019-10-24 14:00:00 | 0.26 |
| 2019-10-24 15:00:00 | 0.26 |
| 2019-10-24 16:00:00 | 0.26 |
| 2019-10-24 17:00:00 | 0.26 |
| 2019-10-24 18:00:00 | 0.52 |
| 2019-10-24 19:00:00 | 0.26 |
| 2019-10-24 20:00:00 | 0.26 |
| 2019-10-24 21:00:00 | 0.26 |
| 2019-10-24 22:00:00 | 0.52 |
| 2019-10-24 23:00:00 | 0.26 |
| 2019-10-25 | 0.52 |
| 2019-10-25 01:00:00 | 0.26 |
| 2019-10-25 02:00:00 | 0.26 |
| 2019-10-25 03:00:00 | 0.52 |
| 2019-10-25 04:00:00 | 0.26 |
| 2019-10-25 05:00:00 | 0.52 |
| 2019-10-25 06:00:00 | 0.52 |
| 2019-10-25 07:00:00 | 0.52 |
| 2019-10-25 08:00:00 | 0.52 |
| 2019-10-25 09:00:00 | 0.78 |
| 2019-10-25 10:00:00 | 0.52 |
| 2019-10-25 11:00:00 | 0.26 |
| 2019-10-25 12:00:00 | 0.52 |
| 2019-10-25 13:00:00 | 0.26 |
| 2019-10-25 14:00:00 | 0.26 |
| 2019-10-25 15:00:00 | 0.26 |
| 2019-10-25 16:00:00 | 0.26 |
| 2019-10-25 17:00:00 | 0.52 |
| 2019-10-25 18:00:00 | 0.26 |
| 2019-10-25 19:00:00 | 0.26 |
| 2019-10-25 20:00:00 | 0.26 |
| 2019-10-25 21:00:00 | 0.52 |
| 2019-10-25 22:00:00 | 0.26 |
| 2019-10-25 23:00:00 | 0.52 |
| 2019-10-26 | 0.26 |
| 2019-10-26 01:00:00 | 0.52 |
| 2019-10-26 02:00:00 | 0.52 |
| 2019-10-26 03:00:00 | 0.52 |
| 2019-10-26 04:00:00 | 0.52 |
| 2019-10-26 05:00:00 | 0.52 |
| 2019-10-26 06:00:00 | 0.78 |
| 2019-10-26 07:00:00 | 0.52 |
| 2019-10-26 08:00:00 | 0.78 |
| 2019-10-26 09:00:00 | 1.04 |
| 2019-10-26 10:00:00 | 0.52 |
| 2019-10-26 11:00:00 | 0.78 |
| 2019-10-26 12:00:00 | 0.52 |
| 2019-10-26 13:00:00 | 0.26 |
| 2019-10-26 14:00:00 | 0.26 |
| 2019-10-26 15:00:00 | 0.52 |
| 2019-10-26 16:00:00 | 0.26 |
| 2019-10-26 17:00:00 | 0.26 |
| 2019-10-26 18:00:00 | 0.26 |
| 2019-10-26 19:00:00 | 0.52 |
| 2019-10-26 20:00:00 | 0.26 |
| 2019-10-26 21:00:00 | 10.66 |
| 2019-10-26 22:00:00 | 0.26 |
| 2019-10-26 23:00:00 | 0.52 |
| 2019-10-27 | 0.26 |
| 2019-10-27 01:00:00 | 0.26 |
| 2019-10-27 02:00:00 | 0.52 |
| 2019-10-27 02:00:00 | 0.26 |
| 2019-10-27 03:00:00 | 0.52 |
| 2019-10-27 04:00:00 | 0.26 |
| 2019-10-27 05:00:00 | 0.52 |
| 2019-10-27 06:00:00 | 0.52 |
| 2019-10-27 07:00:00 | 0.52 |
| 2019-10-27 08:00:00 | 0.52 |
| 2019-10-27 09:00:00 | 0.52 |
| 2019-10-27 10:00:00 | 0.52 |
| 2019-10-27 11:00:00 | 0.26 |
| 2019-10-27 12:00:00 | 0.26 |
| 2019-10-27 13:00:00 | 0.26 |
| 2019-10-27 14:00:00 | 0.52 |
| 2019-10-27 15:00:00 | 0.26 |
| 2019-10-27 16:00:00 | 0.26 |
| 2019-10-27 17:00:00 | 0.26 |
| 2019-10-27 18:00:00 | 0.26 |
| 2019-10-27 19:00:00 | 0.52 |
| 2019-10-27 20:00:00 | 0.26 |
| 2019-10-27 21:00:00 | 0.26 |
| 2019-10-27 22:00:00 | 0.26 |
| 2019-10-27 23:00:00 | 0.52 |
| 2019-10-28 | 0.26 |
| 2019-10-28 01:00:00 | 0.26 |
| 2019-10-28 02:00:00 | 0.52 |
| 2019-10-28 03:00:00 | 0.26 |
| 2019-10-28 04:00:00 | 0.52 |
| 2019-10-28 05:00:00 | 0.26 |
| 2019-10-28 06:00:00 | 0.52 |
| 2019-10-28 07:00:00 | 0.52 |
| 2019-10-28 08:00:00 | 0.52 |
| 2019-10-28 09:00:00 | 0.26 |
| 2019-10-28 10:00:00 | 0.52 |
| 2019-10-28 11:00:00 | 0.52 |
| 2019-10-28 12:00:00 | 0.26 |
| 2019-10-28 13:00:00 | 0.52 |
| 2019-10-28 14:00:00 | 0.26 |
| 2019-10-28 15:00:00 | 0.52 |
| 2019-10-28 16:00:00 | 0.26 |
| 2019-10-28 17:00:00 | 0.26 |
| 2019-10-28 18:00:00 | 0.52 |
| 2019-10-28 19:00:00 | 0.52 |
| 2019-10-28 20:00:00 | 0.78 |
| 2019-10-28 21:00:00 | 0.78 |
| 2019-10-28 22:00:00 | 0.78 |
| 2019-10-28 23:00:00 | 1.04 |
| 2019-10-29 | 0.78 |
| 2019-10-29 01:00:00 | 1.04 |
| 2019-10-29 02:00:00 | 1.04 |
| 2019-10-29 03:00:00 | 1.04 |
| 2019-10-29 04:00:00 | 1.04 |
| 2019-10-29 05:00:00 | 1.3 |
| 2019-10-29 06:00:00 | 1.3 |
| 2019-10-29 07:00:00 | 1.04 |
| 2019-10-29 08:00:00 | 1.3 |
| 2019-10-29 09:00:00 | 1.04 |
| 2019-10-29 10:00:00 | 1.04 |
| 2019-10-29 11:00:00 | 1.04 |
| 2019-10-29 12:00:00 | 0.78 |
| 2019-10-29 13:00:00 | 0.78 |
| 2019-10-29 14:00:00 | 0.26 |
| 2019-10-29 15:00:00 | 0.52 |
| 2019-10-29 16:00:00 | 0.52 |
| 2019-10-29 17:00:00 | 0.52 |
| 2019-10-29 18:00:00 | 0.78 |
| 2019-10-29 19:00:00 | 0.78 |
| 2019-10-29 20:00:00 | 0.78 |
| 2019-10-29 21:00:00 | 0.78 |
| 2019-10-29 22:00:00 | 1.04 |
| 2019-10-29 23:00:00 | 1.3 |
| 2019-10-30 | 1.04 |
| 2019-10-30 01:00:00 | 1.3 |
| 2019-10-30 02:00:00 | 1.3 |
| 2019-10-30 03:00:00 | 1.82 |
| 2019-10-30 04:00:00 | 11.18 |
| 2019-10-30 05:00:00 | 1.3 |
| 2019-10-30 06:00:00 | 1.04 |
| 2019-10-30 07:00:00 | 1.3 |
| 2019-10-30 08:00:00 | 1.3 |
| 2019-10-30 09:00:00 | 1.3 |
| 2019-10-30 10:00:00 | 1.3 |
| 2019-10-30 11:00:00 | 1.3 |
| 2019-10-30 12:00:00 | 2.6 |
| 2019-10-30 13:00:00 | 2.34 |
| 2019-10-30 14:00:00 | 1.3 |
| 2019-10-30 15:00:00 | 1.04 |
| 2019-10-30 16:00:00 | 1.04 |
| 2019-10-30 17:00:00 | 1.04 |
| 2019-10-30 18:00:00 | 1.04 |
| 2019-10-30 19:00:00 | 1.04 |
| 2019-10-30 20:00:00 | 1.3 |
| 2019-10-30 21:00:00 | 1.04 |
| 2019-10-30 22:00:00 | 1.3 |
| 2019-10-30 23:00:00 | 1.56 |
| 2019-10-31 | 1.3 |
| 2019-10-31 01:00:00 | 1.56 |
| 2019-10-31 02:00:00 | 1.56 |
| 2019-10-31 03:00:00 | 1.56 |
| 2019-10-31 04:00:00 | 1.56 |
| 2019-10-31 05:00:00 | 1.56 |
| 2019-10-31 06:00:00 | 1.56 |
| 2019-10-31 07:00:00 | 1.56 |
| 2019-10-31 08:00:00 | 1.82 |
| 2019-10-31 09:00:00 | 1.56 |
| 2019-10-31 10:00:00 | 1.56 |
| 2019-10-31 11:00:00 | 1.56 |
| 2019-10-31 12:00:00 | 1.56 |
| 2019-10-31 13:00:00 | 1.3 |
| 2019-10-31 14:00:00 | 1.3 |
| 2019-10-31 15:00:00 | 1.04 |
| 2019-10-31 16:00:00 | 1.04 |
| 2019-10-31 17:00:00 | 1.04 |
| 2019-10-31 18:00:00 | 1.3 |
| 2019-10-31 19:00:00 | 1.56 |
| 2019-10-31 20:00:00 | 1.3 |
| 2019-10-31 21:00:00 | 1.82 |
| 2019-10-31 22:00:00 | 1.82 |
| 2019-10-31 23:00:00 | 1.82 |
| 2019-11-01 | 1.82 |
| 2019-11-01 01:00:00 | 1.82 |
| 2019-11-01 02:00:00 | 1.82 |
| 2019-11-01 03:00:00 | 1.82 |
| 2019-11-01 04:00:00 | 1.82 |
| 2019-11-01 05:00:00 | 1.82 |
| 2019-11-01 06:00:00 | 2.08 |
| 2019-11-01 07:00:00 | 1.82 |
| 2019-11-01 08:00:00 | 2.08 |
| 2019-11-01 09:00:00 | 1.82 |
| 2019-11-01 10:00:00 | 1.82 |
| 2019-11-01 11:00:00 | 1.82 |
| 2019-11-01 12:00:00 | 1.56 |
| 2019-11-01 13:00:00 | 1.04 |
| 2019-11-01 14:00:00 | 1.04 |
| 2019-11-01 15:00:00 | 0.78 |
| 2019-11-01 16:00:00 | 0.78 |
| 2019-11-01 17:00:00 | 1.04 |
| 2019-11-01 18:00:00 | 1.04 |
| 2019-11-01 19:00:00 | 1.3 |
| 2019-11-01 20:00:00 | 1.3 |
| 2019-11-01 21:00:00 | 1.56 |
| 2019-11-01 22:00:00 | 1.82 |
| 2019-11-01 23:00:00 | 1.56 |
| 2019-11-02 | 1.56 |
| 2019-11-02 01:00:00 | 1.56 |
| 2019-11-02 02:00:00 | 1.56 |
| 2019-11-02 03:00:00 | 1.82 |
| 2019-11-02 04:00:00 | 1.56 |
| 2019-11-02 05:00:00 | 1.56 |
| 2019-11-02 06:00:00 | 1.3 |
| 2019-11-02 07:00:00 | 1.56 |
| 2019-11-02 08:00:00 | 1.3 |
| 2019-11-02 09:00:00 | 1.56 |
| 2019-11-02 10:00:00 | 3.64 |
| 2019-11-02 11:00:00 | 9.36 |
| 2019-11-02 12:00:00 | 1.56 |
| 2019-11-02 13:00:00 | 1.3 |
| 2019-11-02 14:00:00 | 1.3 |
| 2019-11-02 15:00:00 | 1.04 |
| 2019-11-02 16:00:00 | 1.04 |
| 2019-11-02 17:00:00 | 1.3 |
| 2019-11-02 18:00:00 | 1.3 |
| 2019-11-02 19:00:00 | 1.04 |
| 2019-11-02 20:00:00 | 1.3 |
| 2019-11-02 21:00:00 | 1.3 |
| 2019-11-02 22:00:00 | 1.04 |
| 2019-11-02 23:00:00 | 1.3 |
| 2019-11-03 | 1.3 |
| 2019-11-03 01:00:00 | 1.04 |
| 2019-11-03 02:00:00 | 1.3 |
| 2019-11-03 03:00:00 | 1.3 |
| 2019-11-03 04:00:00 | 1.04 |
| 2019-11-03 05:00:00 | 1.04 |
| 2019-11-03 06:00:00 | 1.3 |
| 2019-11-03 07:00:00 | 1.3 |
| 2019-11-03 08:00:00 | 1.04 |
| 2019-11-03 09:00:00 | 1.04 |
| 2019-11-03 10:00:00 | 1.3 |
| 2019-11-03 11:00:00 | 0.52 |
| 2019-11-03 12:00:00 | 0.52 |
| 2019-11-03 13:00:00 | 0.52 |
| 2019-11-03 14:00:00 | 0.26 |
| 2019-11-03 15:00:00 | 0.52 |
| 2019-11-03 16:00:00 | 0.26 |
| 2019-11-03 17:00:00 | 0.52 |
| 2019-11-03 18:00:00 | 0.26 |
| 2019-11-03 19:00:00 | 0.52 |
| 2019-11-03 20:00:00 | 0.52 |
| 2019-11-03 21:00:00 | 0.52 |
| 2019-11-03 22:00:00 | 0.78 |
| 2019-11-03 23:00:00 | 0.52 |
| 2019-11-04 | 0.52 |
| 2019-11-04 01:00:00 | 0.78 |
| 2019-11-04 02:00:00 | 0.52 |
| 2019-11-04 03:00:00 | 0.52 |
| 2019-11-04 04:00:00 | 0.52 |
| 2019-11-04 05:00:00 | 0.26 |
| 2019-11-04 06:00:00 | 0.78 |
| 2019-11-04 07:00:00 | 0.52 |
| 2019-11-04 08:00:00 | 0.52 |
| 2019-11-04 09:00:00 | 0.52 |
| 2019-11-04 10:00:00 | 0.78 |
| 2019-11-04 11:00:00 | 0.52 |
| 2019-11-04 12:00:00 | 0.52 |
| 2019-11-04 13:00:00 | 0.52 |
| 2019-11-04 14:00:00 | 0.52 |
| 2019-11-04 15:00:00 | 0.78 |
| 2019-11-04 16:00:00 | 0.52 |
| 2019-11-04 17:00:00 | 0.52 |
| 2019-11-04 18:00:00 | 0.52 |
| 2019-11-04 19:00:00 | 0.78 |
| 2019-11-04 20:00:00 | 0.78 |
| 2019-11-04 21:00:00 | 1.04 |
| 2019-11-04 22:00:00 | 1.04 |
| 2019-11-04 23:00:00 | 1.04 |
| 2019-11-05 | 0.78 |
| 2019-11-05 01:00:00 | 1.04 |
| 2019-11-05 02:00:00 | 1.3 |
| 2019-11-05 03:00:00 | 1.04 |
| 2019-11-05 04:00:00 | 1.04 |
| 2019-11-05 05:00:00 | 1.04 |
| 2019-11-05 06:00:00 | 1.3 |
| 2019-11-05 07:00:00 | 1.04 |
| 2019-11-05 08:00:00 | 1.04 |
| 2019-11-05 09:00:00 | 1.04 |
| 2019-11-05 10:00:00 | 7.8 |
| 2019-11-05 11:00:00 | 4.94 |
| 2019-11-05 12:00:00 | 0.52 |
| 2019-11-05 13:00:00 | 0.78 |
| 2019-11-05 14:00:00 | 3.12 |
| 2019-11-05 15:00:00 | 1.04 |
| 2019-11-05 16:00:00 | 0.52 |
| 2019-11-05 17:00:00 | 0.26 |
| 2019-11-05 18:00:00 | 0.78 |
| 2019-11-05 19:00:00 | 0.52 |
| 2019-11-05 20:00:00 | 0.52 |
| 2019-11-05 21:00:00 | 0.52 |
| 2019-11-05 22:00:00 | 0.78 |
| 2019-11-05 23:00:00 | 0.78 |
| 2019-11-06 | 0.78 |
| 2019-11-06 01:00:00 | 0.78 |
| 2019-11-06 02:00:00 | 1.04 |
| 2019-11-06 03:00:00 | 1.04 |
| 2019-11-06 04:00:00 | 1.04 |
| 2019-11-06 05:00:00 | 1.04 |
| 2019-11-06 06:00:00 | 1.3 |
| 2019-11-06 07:00:00 | 1.3 |
| 2019-11-06 08:00:00 | 1.04 |
| 2019-11-06 09:00:00 | 1.3 |
| 2019-11-06 10:00:00 | 1.56 |
| 2019-11-06 11:00:00 | 1.04 |
| 2019-11-06 12:00:00 | 1.04 |
| 2019-11-06 13:00:00 | 2.86 |
| 2019-11-06 14:00:00 | 1.04 |
| 2019-11-06 15:00:00 | 0.52 |
| 2019-11-06 16:00:00 | 0.52 |
| 2019-11-06 17:00:00 | 0.52 |
| 2019-11-06 18:00:00 | 0.52 |
| 2019-11-06 19:00:00 | 0.78 |
| 2019-11-06 20:00:00 | 0.52 |
| 2019-11-06 21:00:00 | 0.78 |
| 2019-11-06 22:00:00 | 1.04 |
| 2019-11-06 23:00:00 | 0.78 |
| 2019-11-07 | 0.78 |
| 2019-11-07 01:00:00 | 1.04 |
| 2019-11-07 02:00:00 | 1.04 |
| 2019-11-07 03:00:00 | 1.04 |
| 2019-11-07 04:00:00 | 1.04 |
| 2019-11-07 05:00:00 | 1.04 |
| 2019-11-07 06:00:00 | 1.3 |
| 2019-11-07 07:00:00 | 1.04 |
| 2019-11-07 08:00:00 | 1.04 |
| 2019-11-07 09:00:00 | 1.04 |
| 2019-11-07 10:00:00 | 1.04 |
| 2019-11-07 11:00:00 | 1.04 |
| 2019-11-07 12:00:00 | 0.78 |
| 2019-11-07 13:00:00 | 0.52 |
| 2019-11-07 14:00:00 | 0.78 |
| 2019-11-07 15:00:00 | 0.52 |
| 2019-11-07 16:00:00 | 0.52 |
| 2019-11-07 17:00:00 | 0.78 |
| 2019-11-07 18:00:00 | 0.78 |
| 2019-11-07 19:00:00 | 0.78 |
| 2019-11-07 20:00:00 | 1.04 |
| 2019-11-07 21:00:00 | 1.3 |
| 2019-11-07 22:00:00 | 1.04 |
| 2019-11-07 23:00:00 | 1.56 |
| 2019-11-08 | 1.3 |
| 2019-11-08 01:00:00 | 1.3 |
| 2019-11-08 02:00:00 | 1.56 |
| 2019-11-08 03:00:00 | 1.3 |
| 2019-11-08 04:00:00 | 1.3 |
| 2019-11-08 05:00:00 | 1.3 |
| 2019-11-08 06:00:00 | 1.56 |
| 2019-11-08 07:00:00 | 1.3 |
| 2019-11-08 08:00:00 | 1.3 |
| 2019-11-08 09:00:00 | 1.3 |
| 2019-11-08 10:00:00 | 1.3 |
| 2019-11-08 11:00:00 | 1.3 |
| 2019-11-08 12:00:00 | 0.78 |
| 2019-11-08 13:00:00 | 0.52 |
| 2019-11-08 14:00:00 | 0.52 |
| 2019-11-08 15:00:00 | 0.26 |
| 2019-11-08 16:00:00 | 0.26 |
| 2019-11-08 17:00:00 | 0.52 |
| 2019-11-08 18:00:00 | 1.04 |
| 2019-11-08 19:00:00 | 10.92 |
| 2019-11-08 20:00:00 | 0.78 |
| 2019-11-08 21:00:00 | 1.04 |
| 2019-11-08 22:00:00 | 1.3 |
| 2019-11-08 23:00:00 | 1.3 |
| 2019-11-09 | 1.3 |
| 2019-11-09 01:00:00 | 1.56 |
| 2019-11-09 02:00:00 | 1.56 |
| 2019-11-09 03:00:00 | 1.3 |
| 2019-11-09 04:00:00 | 1.56 |
| 2019-11-09 05:00:00 | 1.3 |
| 2019-11-09 06:00:00 | 1.3 |
| 2019-11-09 07:00:00 | 1.56 |
| 2019-11-09 08:00:00 | 1.3 |
| 2019-11-09 09:00:00 | 1.3 |
| 2019-11-09 10:00:00 | 1.04 |
| 2019-11-09 11:00:00 | 1.3 |
| 2019-11-09 12:00:00 | 0.78 |
| 2019-11-09 13:00:00 | 0.78 |
| 2019-11-09 14:00:00 | 0.78 |
| 2019-11-09 15:00:00 | 0.52 |
| 2019-11-09 16:00:00 | 0.52 |
| 2019-11-09 17:00:00 | 0.78 |
| 2019-11-09 18:00:00 | 0.78 |
| 2019-11-09 19:00:00 | 0.78 |
| 2019-11-09 20:00:00 | 1.04 |
| 2019-11-09 21:00:00 | 1.3 |
| 2019-11-09 22:00:00 | 1.04 |
| 2019-11-09 23:00:00 | 1.3 |
| 2019-11-10 | 1.3 |
| 2019-11-10 01:00:00 | 1.3 |
| 2019-11-10 02:00:00 | 1.3 |
| 2019-11-10 03:00:00 | 1.56 |
| 2019-11-10 04:00:00 | 1.3 |
| 2019-11-10 05:00:00 | 1.56 |
| 2019-11-10 06:00:00 | 1.56 |
| 2019-11-10 07:00:00 | 1.56 |
| 2019-11-10 08:00:00 | 1.56 |
| 2019-11-10 09:00:00 | 1.56 |
| 2019-11-10 10:00:00 | 1.56 |
| 2019-11-10 11:00:00 | 1.3 |
| 2019-11-10 12:00:00 | 1.56 |
| 2019-11-10 13:00:00 | 1.3 |
| 2019-11-10 14:00:00 | 1.56 |
| 2019-11-10 15:00:00 | 1.3 |
| 2019-11-10 16:00:00 | 1.3 |
| 2019-11-10 17:00:00 | 1.3 |
| 2019-11-10 18:00:00 | 1.3 |
| 2019-11-10 19:00:00 | 1.3 |
| 2019-11-10 20:00:00 | 1.3 |
| 2019-11-10 21:00:00 | 1.56 |
| 2019-11-10 22:00:00 | 1.3 |
| 2019-11-10 23:00:00 | 1.3 |
| 2019-11-11 | 1.3 |
| 2019-11-11 01:00:00 | 1.3 |
| 2019-11-11 02:00:00 | 1.56 |
| 2019-11-11 03:00:00 | 1.3 |
| 2019-11-11 04:00:00 | 1.56 |
| 2019-11-11 05:00:00 | 1.3 |
| 2019-11-11 06:00:00 | 1.56 |
| 2019-11-11 07:00:00 | 1.3 |
| 2019-11-11 08:00:00 | 1.56 |
| 2019-11-11 09:00:00 | 1.3 |
| 2019-11-11 10:00:00 | 1.56 |
| 2019-11-11 11:00:00 | 1.3 |
| 2019-11-11 12:00:00 | 6.76 |
| 2019-11-11 13:00:00 | 5.98 |
| 2019-11-11 14:00:00 | 0.78 |
| 2019-11-11 15:00:00 | 0.78 |
| 2019-11-11 16:00:00 | 0.78 |
| 2019-11-11 17:00:00 | 0.78 |
| 2019-11-11 18:00:00 | 1.3 |
| 2019-11-11 19:00:00 | 1.04 |
| 2019-11-11 20:00:00 | 1.56 |
| 2019-11-11 21:00:00 | 1.3 |
| 2019-11-11 22:00:00 | 1.56 |
| 2019-11-11 23:00:00 | 1.3 |
| 2019-11-12 | 1.56 |
| 2019-11-12 01:00:00 | 1.56 |
| 2019-11-12 02:00:00 | 1.82 |
| 2019-11-12 03:00:00 | 1.56 |
| 2019-11-12 04:00:00 | 1.56 |
| 2019-11-12 05:00:00 | 1.82 |
| 2019-11-12 06:00:00 | 1.56 |
| 2019-11-12 07:00:00 | 1.56 |
| 2019-11-12 08:00:00 | 1.56 |
| 2019-11-12 09:00:00 | 1.56 |
| 2019-11-12 10:00:00 | 1.56 |
| 2019-11-12 11:00:00 | 1.3 |
| 2019-11-12 12:00:00 | 1.04 |
| 2019-11-12 13:00:00 | 0.78 |
| 2019-11-12 14:00:00 | 1.3 |
| 2019-11-12 15:00:00 | 1.04 |
| 2019-11-12 16:00:00 | 1.04 |
| 2019-11-12 17:00:00 | 0.78 |
| 2019-11-12 18:00:00 | 1.04 |
| 2019-11-12 19:00:00 | 1.04 |
| 2019-11-12 20:00:00 | 1.04 |
| 2019-11-12 21:00:00 | 1.04 |
| 2019-11-12 22:00:00 | 1.04 |
| 2019-11-12 23:00:00 | 1.04 |
| 2019-11-13 | 1.3 |
| 2019-11-13 01:00:00 | 1.04 |
| 2019-11-13 02:00:00 | 1.3 |
| 2019-11-13 03:00:00 | 1.3 |
| 2019-11-13 04:00:00 | 1.3 |
| 2019-11-13 05:00:00 | 1.3 |
| 2019-11-13 06:00:00 | 1.56 |
| 2019-11-13 07:00:00 | 1.3 |
| 2019-11-13 08:00:00 | 1.56 |
| 2019-11-13 09:00:00 | 1.3 |
| 2019-11-13 10:00:00 | 1.56 |
| 2019-11-13 11:00:00 | 1.82 |
| 2019-11-13 12:00:00 | 2.08 |
| 2019-11-13 13:00:00 | 3.38 |
| 2019-11-13 14:00:00 | 3.38 |
| 2019-11-13 15:00:00 | 1.82 |
| 2019-11-13 16:00:00 | 1.82 |
| 2019-11-13 17:00:00 | 1.56 |
| 2019-11-13 18:00:00 | 1.56 |
| 2019-11-13 19:00:00 | 8.32 |
| 2019-11-13 20:00:00 | 5.46 |
| 2019-11-13 21:00:00 | 1.56 |
| 2019-11-13 22:00:00 | 1.56 |
| 2019-11-13 23:00:00 | 1.56 |
| 2019-11-14 | 1.56 |
| 2019-11-14 01:00:00 | 1.56 |
| 2019-11-14 02:00:00 | 1.56 |
| 2019-11-14 03:00:00 | 1.56 |
| 2019-11-14 04:00:00 | 1.56 |
| 2019-11-14 05:00:00 | 1.56 |
| 2019-11-14 06:00:00 | 1.82 |
| 2019-11-14 07:00:00 | 1.56 |
| 2019-11-14 08:00:00 | 1.82 |
| 2019-11-14 09:00:00 | 1.56 |
| 2019-11-14 10:00:00 | 1.82 |
| 2019-11-14 11:00:00 | 1.56 |
| 2019-11-14 12:00:00 | 1.56 |
| 2019-11-14 13:00:00 | 1.3 |
| 2019-11-14 14:00:00 | 1.04 |
| 2019-11-14 15:00:00 | 1.3 |
| 2019-11-14 16:00:00 | 1.3 |
| 2019-11-14 17:00:00 | 1.56 |
| 2019-11-14 18:00:00 | 1.56 |
| 2019-11-14 19:00:00 | 1.56 |
| 2019-11-14 20:00:00 | 1.56 |
| 2019-11-14 21:00:00 | 1.56 |
| 2019-11-14 22:00:00 | 1.56 |
| 2019-11-14 23:00:00 | 1.56 |
| 2019-11-15 | 1.56 |
| 2019-11-15 01:00:00 | 1.3 |
| 2019-11-15 02:00:00 | 1.56 |
| 2019-11-15 03:00:00 | 1.56 |
| 2019-11-15 04:00:00 | 1.56 |
| 2019-11-15 05:00:00 | 1.56 |
| 2019-11-15 06:00:00 | 1.56 |
| 2019-11-15 07:00:00 | 1.56 |
| 2019-11-15 08:00:00 | 1.82 |
| 2019-11-15 09:00:00 | 1.56 |
| 2019-11-15 10:00:00 | 1.56 |
| 2019-11-15 11:00:00 | 12.22 |
| 2019-11-15 12:00:00 | 1.56 |
| 2019-11-15 13:00:00 | 1.04 |
| 2019-11-15 14:00:00 | 1.3 |
| 2019-11-15 15:00:00 | 1.04 |
| 2019-11-15 16:00:00 | 1.04 |
| 2019-11-15 17:00:00 | 1.04 |
| 2019-11-15 18:00:00 | 1.3 |
| 2019-11-15 19:00:00 | 1.3 |
| 2019-11-15 20:00:00 | 1.56 |
| 2019-11-15 21:00:00 | 1.3 |
| 2019-11-15 22:00:00 | 1.3 |
| 2019-11-15 23:00:00 | 1.56 |
| 2019-11-16 | 1.3 |
| 2019-11-16 01:00:00 | 1.56 |
| 2019-11-16 02:00:00 | 1.56 |
| 2019-11-16 03:00:00 | 1.56 |
| 2019-11-16 04:00:00 | 1.56 |
| 2019-11-16 05:00:00 | 1.56 |
| 2019-11-16 06:00:00 | 1.56 |
| 2019-11-16 07:00:00 | 1.56 |
| 2019-11-16 08:00:00 | 1.56 |
| 2019-11-16 09:00:00 | 1.3 |
| 2019-11-16 10:00:00 | 1.04 |
| 2019-11-16 11:00:00 | 1.04 |
| 2019-11-16 12:00:00 | 0.78 |
| 2019-11-16 13:00:00 | 0.78 |
| 2019-11-16 14:00:00 | 0.26 |
| 2019-11-16 15:00:00 | 0.52 |
| 2019-11-16 16:00:00 | 0.52 |
| 2019-11-16 17:00:00 | 0.78 |
| 2019-11-16 18:00:00 | 0.78 |
| 2019-11-16 19:00:00 | 1.04 |
| 2019-11-16 20:00:00 | 1.3 |
| 2019-11-16 21:00:00 | 1.3 |
| 2019-11-16 22:00:00 | 1.3 |
| 2019-11-16 23:00:00 | 1.56 |
| 2019-11-17 | 1.56 |
| 2019-11-17 01:00:00 | 1.56 |
| 2019-11-17 02:00:00 | 5.98 |
| 2019-11-17 03:00:00 | 7.02 |
| 2019-11-17 04:00:00 | 1.56 |
| 2019-11-17 05:00:00 | 1.3 |
| 2019-11-17 06:00:00 | 1.56 |
| 2019-11-17 07:00:00 | 1.56 |
| 2019-11-17 08:00:00 | 1.3 |
| 2019-11-17 09:00:00 | 1.56 |
| 2019-11-17 10:00:00 | 1.56 |
| 2019-11-17 11:00:00 | 1.3 |
| 2019-11-17 12:00:00 | 1.04 |
| 2019-11-17 13:00:00 | 0.78 |
| 2019-11-17 14:00:00 | 0.78 |
| 2019-11-17 15:00:00 | 0.26 |
| 2019-11-17 16:00:00 | 0.52 |
| 2019-11-17 17:00:00 | 0.52 |
| 2019-11-17 18:00:00 | 0.52 |
| 2019-11-17 19:00:00 | 0.78 |
| 2019-11-17 20:00:00 | 0.78 |
| 2019-11-17 21:00:00 | 1.04 |
| 2019-11-17 22:00:00 | 1.04 |
| 2019-11-17 23:00:00 | 1.04 |
| 2019-11-18 | 1.3 |
| 2019-11-18 01:00:00 | 1.04 |
| 2019-11-18 02:00:00 | 1.04 |
| 2019-11-18 03:00:00 | 1.04 |
| 2019-11-18 04:00:00 | 1.3 |
| 2019-11-18 05:00:00 | 1.04 |
| 2019-11-18 06:00:00 | 1.04 |
| 2019-11-18 07:00:00 | 1.04 |
| 2019-11-18 08:00:00 | 1.04 |
| 2019-11-18 09:00:00 | 1.04 |
| 2019-11-18 10:00:00 | 0.78 |
| 2019-11-18 11:00:00 | 0.78 |
| 2019-11-18 12:00:00 | 0.78 |
| 2019-11-18 13:00:00 | 0.52 |
| 2019-11-18 14:00:00 | 0.52 |
| 2019-11-18 15:00:00 | 0.52 |
| 2019-11-18 16:00:00 | 0.52 |
| 2019-11-18 17:00:00 | 0.52 |
| 2019-11-18 18:00:00 | 0.78 |
| 2019-11-18 19:00:00 | 0.78 |
| 2019-11-18 20:00:00 | 1.04 |
| 2019-11-18 21:00:00 | 1.04 |
| 2019-11-18 22:00:00 | 1.3 |
| 2019-11-18 23:00:00 | 1.3 |
| 2019-11-19 | 1.56 |
| 2019-11-19 01:00:00 | 1.56 |
| 2019-11-19 02:00:00 | 1.56 |
| 2019-11-19 03:00:00 | 1.82 |
| 2019-11-19 04:00:00 | 1.56 |
| 2019-11-19 05:00:00 | 1.82 |
| 2019-11-19 06:00:00 | 1.56 |
| 2019-11-19 07:00:00 | 2.08 |
| 2019-11-19 08:00:00 | 1.56 |
| 2019-11-19 09:00:00 | 1.82 |
| 2019-11-19 10:00:00 | 1.56 |
| 2019-11-19 11:00:00 | 1.3 |
| 2019-11-19 12:00:00 | 1.04 |
| 2019-11-19 13:00:00 | 0.78 |
| 2019-11-19 14:00:00 | 0.78 |
| 2019-11-19 15:00:00 | 0.52 |
| 2019-11-19 16:00:00 | 0.52 |
| 2019-11-19 17:00:00 | 0.78 |
| 2019-11-19 18:00:00 | 1.04 |
| 2019-11-19 19:00:00 | 1.3 |
| 2019-11-19 20:00:00 | 1.3 |
| 2019-11-19 21:00:00 | 1.56 |
| 2019-11-19 22:00:00 | 1.56 |
| 2019-11-19 23:00:00 | 1.82 |
| 2019-11-20 | 1.82 |
| 2019-11-20 01:00:00 | 1.56 |
| 2019-11-20 02:00:00 | 1.82 |
| 2019-11-20 03:00:00 | 1.82 |
| 2019-11-20 04:00:00 | 1.56 |
| 2019-11-20 05:00:00 | 1.82 |
| 2019-11-20 06:00:00 | 1.82 |
| 2019-11-20 07:00:00 | 1.82 |
| 2019-11-20 08:00:00 | 12.22 |
| 2019-11-20 09:00:00 | 1.82 |
| 2019-11-20 10:00:00 | 3.12 |
| 2019-11-20 11:00:00 | 2.86 |
| 2019-11-20 12:00:00 | 1.56 |
| 2019-11-20 13:00:00 | 1.56 |
| 2019-11-20 14:00:00 | 1.04 |
| 2019-11-20 15:00:00 | 1.04 |
| 2019-11-20 16:00:00 | 1.04 |
| 2019-11-20 17:00:00 | 1.04 |
| 2019-11-20 18:00:00 | 1.3 |
| 2019-11-20 19:00:00 | 1.3 |
| 2019-11-20 20:00:00 | 1.04 |
| 2019-11-20 21:00:00 | 1.3 |
| 2019-11-20 22:00:00 | 1.3 |
| 2019-11-20 23:00:00 | 1.3 |
| 2019-11-21 | 1.3 |
| 2019-11-21 01:00:00 | 1.3 |
| 2019-11-21 02:00:00 | 1.3 |
| 2019-11-21 03:00:00 | 1.3 |
| 2019-11-21 04:00:00 | 1.3 |
| 2019-11-21 05:00:00 | 1.3 |
| 2019-11-21 06:00:00 | 1.3 |
| 2019-11-21 07:00:00 | 1.56 |
| 2019-11-21 08:00:00 | 1.3 |
| 2019-11-21 09:00:00 | 1.3 |
| 2019-11-21 10:00:00 | 1.3 |
| 2019-11-21 11:00:00 | 1.3 |
| 2019-11-21 12:00:00 | 1.3 |
| 2019-11-21 13:00:00 | 1.3 |
| 2019-11-21 14:00:00 | 1.3 |
| 2019-11-21 15:00:00 | 1.3 |
| 2019-11-21 16:00:00 | 1.3 |
| 2019-11-21 17:00:00 | 1.3 |
| 2019-11-21 18:00:00 | 1.04 |
| 2019-11-21 19:00:00 | 1.3 |
| 2019-11-21 20:00:00 | 1.3 |
| 2019-11-21 21:00:00 | 1.3 |
| 2019-11-21 22:00:00 | 1.3 |
| 2019-11-21 23:00:00 | 1.56 |
| 2019-11-22 | 1.3 |
| 2019-11-22 01:00:00 | 1.56 |
| 2019-11-22 02:00:00 | 1.56 |
| 2019-11-22 03:00:00 | 1.56 |
| 2019-11-22 04:00:00 | 1.56 |
| 2019-11-22 05:00:00 | 1.56 |
| 2019-11-22 06:00:00 | 1.56 |
| 2019-11-22 07:00:00 | 1.56 |
| 2019-11-22 08:00:00 | 1.3 |
| 2019-11-22 09:00:00 | 1.56 |
| 2019-11-22 10:00:00 | 1.3 |
| 2019-11-22 11:00:00 | 1.3 |
| 2019-11-22 12:00:00 | 1.04 |
| 2019-11-22 13:00:00 | 0.78 |
| 2019-11-22 14:00:00 | 1.04 |
| 2019-11-22 15:00:00 | 1.04 |
| 2019-11-22 16:00:00 | 0.78 |
| 2019-11-22 17:00:00 | 0.78 |
| 2019-11-22 18:00:00 | 1.04 |
| 2019-11-22 19:00:00 | 1.04 |
| 2019-11-22 20:00:00 | 1.3 |
| 2019-11-22 21:00:00 | 1.3 |
| 2019-11-22 22:00:00 | 1.3 |
| 2019-11-22 23:00:00 | 1.3 |
| 2019-11-23 | 1.56 |
| 2019-11-23 01:00:00 | 1.56 |
| 2019-11-23 02:00:00 | 1.56 |
| 2019-11-23 03:00:00 | 1.82 |
| 2019-11-23 04:00:00 | 1.82 |
| 2019-11-23 05:00:00 | 2.08 |
| 2019-11-23 06:00:00 | 1.82 |
| 2019-11-23 07:00:00 | 2.08 |
| 2019-11-23 08:00:00 | 1.82 |
| 2019-11-23 09:00:00 | 1.82 |
| 2019-11-23 10:00:00 | 1.82 |
| 2019-11-23 11:00:00 | 1.56 |
| 2019-11-23 12:00:00 | 1.56 |
| 2019-11-23 13:00:00 | 1.04 |
| 2019-11-23 14:00:00 | 0.78 |
| 2019-11-23 15:00:00 | 1.04 |
| 2019-11-23 16:00:00 | 0.78 |
| 2019-11-23 17:00:00 | 0.78 |
| 2019-11-23 18:00:00 | 3.9 |
| 2019-11-23 19:00:00 | 8.84 |
| 2019-11-23 20:00:00 | 1.3 |
| 2019-11-23 21:00:00 | 1.56 |
| 2019-11-23 22:00:00 | 1.56 |
| 2019-11-23 23:00:00 | 1.56 |
| 2019-11-24 | 1.82 |
| 2019-11-24 01:00:00 | 1.82 |
| 2019-11-24 02:00:00 | 1.56 |
| 2019-11-24 03:00:00 | 1.82 |
| 2019-11-24 04:00:00 | 1.82 |
| 2019-11-24 05:00:00 | 1.82 |
| 2019-11-24 06:00:00 | 1.82 |
| 2019-11-24 07:00:00 | 1.82 |
| 2019-11-24 08:00:00 | 1.82 |
| 2019-11-24 09:00:00 | 1.82 |
| 2019-11-24 10:00:00 | 1.82 |
| 2019-11-24 11:00:00 | 1.56 |
| 2019-11-24 12:00:00 | 1.3 |
| 2019-11-24 13:00:00 | 1.04 |
| 2019-11-24 14:00:00 | 1.04 |
| 2019-11-24 15:00:00 | 0.78 |
| 2019-11-24 16:00:00 | 1.04 |
| 2019-11-24 17:00:00 | 0.78 |
| 2019-11-24 18:00:00 | 1.04 |
| 2019-11-24 19:00:00 | 1.04 |
| 2019-11-24 20:00:00 | 1.3 |
| 2019-11-24 21:00:00 | 1.56 |
| 2019-11-24 22:00:00 | 1.56 |
| 2019-11-24 23:00:00 | 1.56 |
| 2019-11-25 | 1.82 |
| 2019-11-25 01:00:00 | 1.82 |
| 2019-11-25 02:00:00 | 2.08 |
| 2019-11-25 03:00:00 | 1.82 |
| 2019-11-25 04:00:00 | 2.08 |
| 2019-11-25 05:00:00 | 1.82 |
| 2019-11-25 06:00:00 | 2.08 |
| 2019-11-25 07:00:00 | 2.08 |
| 2019-11-25 08:00:00 | 2.08 |
| 2019-11-25 09:00:00 | 2.08 |
| 2019-11-25 10:00:00 | 1.82 |
| 2019-11-25 11:00:00 | 1.82 |
| 2019-11-25 12:00:00 | 1.56 |
| 2019-11-25 13:00:00 | 1.56 |
| 2019-11-25 14:00:00 | 1.04 |
| 2019-11-25 15:00:00 | 1.3 |
| 2019-11-25 16:00:00 | 1.3 |
| 2019-11-25 17:00:00 | 1.56 |
| 2019-11-25 18:00:00 | 1.56 |
| 2019-11-25 19:00:00 | 1.82 |
| 2019-11-25 20:00:00 | 1.82 |
| 2019-11-25 21:00:00 | 1.82 |
| 2019-11-25 22:00:00 | 2.08 |
| 2019-11-25 23:00:00 | 2.08 |
| 2019-11-26 | 2.08 |
| 2019-11-26 01:00:00 | 2.08 |
| 2019-11-26 02:00:00 | 2.08 |
| 2019-11-26 03:00:00 | 1.82 |
| 2019-11-26 04:00:00 | 13 |
| 2019-11-26 05:00:00 | 1.82 |
| 2019-11-26 06:00:00 | 1.82 |
| 2019-11-26 07:00:00 | 1.82 |
| 2019-11-26 08:00:00 | 1.82 |
| 2019-11-26 09:00:00 | 1.82 |
| 2019-11-26 10:00:00 | 1.82 |
| 2019-11-26 11:00:00 | 2.08 |
| 2019-11-26 12:00:00 | 2.34 |
| 2019-11-26 13:00:00 | 1.82 |
| 2019-11-26 14:00:00 | 1.82 |
| 2019-11-26 15:00:00 | 1.56 |
| 2019-11-26 16:00:00 | 1.56 |
| 2019-11-26 17:00:00 | 1.82 |
| 2019-11-26 18:00:00 | 1.56 |
| 2019-11-26 19:00:00 | 1.56 |
| 2019-11-26 20:00:00 | 1.56 |
| 2019-11-26 21:00:00 | 1.82 |
| 2019-11-26 22:00:00 | 1.56 |
| 2019-11-26 23:00:00 | 1.56 |
| 2019-11-27 | 1.56 |
| 2019-11-27 01:00:00 | 1.56 |
| 2019-11-27 02:00:00 | 1.56 |
| 2019-11-27 03:00:00 | 1.56 |
| 2019-11-27 04:00:00 | 1.56 |
| 2019-11-27 05:00:00 | 1.56 |
| 2019-11-27 06:00:00 | 1.3 |
| 2019-11-27 07:00:00 | 1.56 |
| 2019-11-27 08:00:00 | 1.3 |
| 2019-11-27 09:00:00 | 1.3 |
| 2019-11-27 10:00:00 | 1.56 |
| 2019-11-27 11:00:00 | 1.3 |
| 2019-11-27 12:00:00 | 1.04 |
| 2019-11-27 13:00:00 | 1.3 |
| 2019-11-27 14:00:00 | 1.04 |
| 2019-11-27 15:00:00 | 1.04 |
| 2019-11-27 16:00:00 | 1.04 |
| 2019-11-27 17:00:00 | 1.3 |
| 2019-11-27 18:00:00 | 1.3 |
| 2019-11-27 19:00:00 | 1.3 |
| 2019-11-27 20:00:00 | 1.3 |
| 2019-11-27 21:00:00 | 1.56 |
| 2019-11-27 22:00:00 | 1.3 |
| 2019-11-27 23:00:00 | 1.56 |
| 2019-11-28 | 1.56 |
| 2019-11-28 01:00:00 | 1.82 |
| 2019-11-28 02:00:00 | 1.56 |
| 2019-11-28 03:00:00 | 1.56 |
| 2019-11-28 04:00:00 | 1.56 |
| 2019-11-28 05:00:00 | 1.56 |
| 2019-11-28 06:00:00 | 1.82 |
| 2019-11-28 07:00:00 | 1.56 |
| 2019-11-28 08:00:00 | 1.82 |
| 2019-11-28 09:00:00 | 1.56 |
| 2019-11-28 10:00:00 | 1.56 |
| 2019-11-28 11:00:00 | 1.3 |
| 2019-11-28 12:00:00 | 1.3 |
| 2019-11-28 13:00:00 | 1.04 |
| 2019-11-28 14:00:00 | 1.3 |
| 2019-11-28 15:00:00 | 1.04 |
| 2019-11-28 16:00:00 | 1.04 |
| 2019-11-28 17:00:00 | 1.04 |
| 2019-11-28 18:00:00 | 1.3 |
| 2019-11-28 19:00:00 | 1.3 |
| 2019-11-28 20:00:00 | 1.04 |
| 2019-11-28 21:00:00 | 1.3 |
| 2019-11-28 22:00:00 | 1.56 |
| 2019-11-28 23:00:00 | 1.3 |
| 2019-11-29 | 1.56 |
| 2019-11-29 01:00:00 | 1.3 |
| 2019-11-29 02:00:00 | 1.56 |
| 2019-11-29 03:00:00 | 1.56 |
| 2019-11-29 04:00:00 | 1.56 |
| 2019-11-29 05:00:00 | 1.56 |
| 2019-11-29 06:00:00 | 1.56 |
| 2019-11-29 07:00:00 | 1.56 |
| 2019-11-29 08:00:00 | 1.56 |
| 2019-11-29 09:00:00 | 1.56 |
| 2019-11-29 10:00:00 | 1.3 |
| 2019-11-29 11:00:00 | 1.56 |
| 2019-11-29 12:00:00 | 1.3 |
| 2019-11-29 13:00:00 | 1.3 |
| 2019-11-29 14:00:00 | 1.3 |
| 2019-11-29 15:00:00 | 1.3 |
| 2019-11-29 16:00:00 | 1.3 |
| 2019-11-29 17:00:00 | 1.56 |
| 2019-11-29 18:00:00 | 1.3 |
| 2019-11-29 19:00:00 | 1.56 |
| 2019-11-29 20:00:00 | 1.56 |
| 2019-11-29 21:00:00 | 11.96 |
| 2019-11-29 22:00:00 | 1.82 |
| 2019-11-29 23:00:00 | 1.56 |
| 2019-11-30 | 1.56 |
| 2019-11-30 01:00:00 | 1.56 |
| 2019-11-30 02:00:00 | 2.08 |
| 2019-11-30 03:00:00 | 1.82 |
| 2019-11-30 04:00:00 | 2.08 |
| 2019-11-30 05:00:00 | 1.82 |
| 2019-11-30 06:00:00 | 1.82 |
| 2019-11-30 07:00:00 | 2.08 |
| 2019-11-30 08:00:00 | 2.08 |
| 2019-11-30 09:00:00 | 1.82 |
| 2019-11-30 10:00:00 | 2.08 |
| 2019-11-30 11:00:00 | 1.82 |
| 2019-11-30 12:00:00 | 1.82 |
| 2019-11-30 13:00:00 | 1.82 |
| 2019-11-30 14:00:00 | 1.82 |
| 2019-11-30 15:00:00 | 1.56 |
| 2019-11-30 16:00:00 | 2.08 |
| 2019-11-30 17:00:00 | 1.82 |
| 2019-11-30 18:00:00 | 2.34 |
| 2019-11-30 19:00:00 | 2.08 |
| 2019-11-30 20:00:00 | 2.34 |
| 2019-11-30 21:00:00 | 2.34 |
| 2019-11-30 22:00:00 | 2.34 |
| 2019-11-30 23:00:00 | 2.6 |
| 2019-12-01 | 2.34 |
| 2019-12-01 01:00:00 | 2.34 |
| 2019-12-01 02:00:00 | 2.34 |
| 2019-12-01 03:00:00 | 2.34 |
| 2019-12-01 04:00:00 | 2.34 |
| 2019-12-01 05:00:00 | 2.34 |
| 2019-12-01 06:00:00 | 2.6 |
| 2019-12-01 07:00:00 | 2.34 |
| 2019-12-01 08:00:00 | 2.08 |
| 2019-12-01 09:00:00 | 2.34 |
| 2019-12-01 10:00:00 | 2.34 |
| 2019-12-01 11:00:00 | 2.08 |
| 2019-12-01 12:00:00 | 2.08 |
| 2019-12-01 13:00:00 | 1.82 |
| 2019-12-01 14:00:00 | 1.82 |
| 2019-12-01 15:00:00 | 2.08 |
| 2019-12-01 16:00:00 | 2.08 |
| 2019-12-01 17:00:00 | 2.08 |
| 2019-12-01 18:00:00 | 2.34 |
| 2019-12-01 19:00:00 | 2.34 |
| 2019-12-01 20:00:00 | 2.34 |
| 2019-12-01 21:00:00 | 2.34 |
| 2019-12-01 22:00:00 | 2.34 |
| 2019-12-01 23:00:00 | 2.34 |
| 2019-12-02 | 2.34 |
| 2019-12-02 01:00:00 | 2.34 |
| 2019-12-02 02:00:00 | 2.34 |
| 2019-12-02 03:00:00 | 2.34 |
| 2019-12-02 04:00:00 | 2.34 |
| 2019-12-02 05:00:00 | 2.34 |
| 2019-12-02 06:00:00 | 2.34 |
| 2019-12-02 07:00:00 | 2.34 |
| 2019-12-02 08:00:00 | 2.34 |
| 2019-12-02 09:00:00 | 2.08 |
| 2019-12-02 10:00:00 | 2.34 |
| 2019-12-02 11:00:00 | 2.34 |
| 2019-12-02 12:00:00 | 2.6 |
| 2019-12-02 13:00:00 | 2.08 |
| 2019-12-02 14:00:00 | 2.34 |
| 2019-12-02 15:00:00 | 2.08 |
| 2019-12-02 16:00:00 | 2.08 |
| 2019-12-02 17:00:00 | 2.08 |
| 2019-12-02 18:00:00 | 2.08 |
| 2019-12-02 19:00:00 | 2.08 |
| 2019-12-02 20:00:00 | 2.34 |
| 2019-12-02 21:00:00 | 2.08 |
| 2019-12-02 22:00:00 | 12.74 |
| 2019-12-02 23:00:00 | 2.34 |
| 2019-12-03 | 2.34 |
| 2019-12-03 01:00:00 | 2.08 |
| 2019-12-03 02:00:00 | 2.34 |
| 2019-12-03 03:00:00 | 2.34 |
| 2019-12-03 04:00:00 | 2.34 |
| 2019-12-03 05:00:00 | 2.34 |
| 2019-12-03 06:00:00 | 2.08 |
| 2019-12-03 07:00:00 | 2.34 |
| 2019-12-03 08:00:00 | 2.08 |
| 2019-12-03 09:00:00 | 2.34 |
| 2019-12-03 10:00:00 | 2.34 |
| 2019-12-03 11:00:00 | 3.12 |
| 2019-12-03 12:00:00 | 1.82 |
| 2019-12-03 13:00:00 | 1.04 |
| 2019-12-03 14:00:00 | 0.78 |
| 2019-12-03 15:00:00 | 0.78 |
| 2019-12-03 16:00:00 | 0.52 |
| 2019-12-03 17:00:00 | 1.04 |
| 2019-12-03 18:00:00 | 1.04 |
| 2019-12-03 19:00:00 | 1.3 |
| 2019-12-03 20:00:00 | 1.56 |
| 2019-12-03 21:00:00 | 1.82 |
| 2019-12-03 22:00:00 | 2.08 |
| 2019-12-03 23:00:00 | 2.08 |
| 2019-12-04 | 2.08 |
| 2019-12-04 01:00:00 | 2.08 |
| 2019-12-04 02:00:00 | 2.08 |
| 2019-12-04 03:00:00 | 2.34 |
| 2019-12-04 04:00:00 | 2.08 |
| 2019-12-04 05:00:00 | 2.34 |
| 2019-12-04 06:00:00 | 2.08 |
| 2019-12-04 07:00:00 | 2.34 |
| 2019-12-04 08:00:00 | 2.08 |
| 2019-12-04 09:00:00 | 2.34 |
| 2019-12-04 10:00:00 | 2.08 |
| 2019-12-04 11:00:00 | 2.08 |
| 2019-12-04 12:00:00 | 1.82 |
| 2019-12-04 13:00:00 | 1.82 |
| 2019-12-04 14:00:00 | 1.56 |
| 2019-12-04 15:00:00 | 1.56 |
| 2019-12-04 16:00:00 | 1.82 |
| 2019-12-04 17:00:00 | 1.82 |
| 2019-12-04 18:00:00 | 2.08 |
| 2019-12-04 19:00:00 | 2.08 |
| 2019-12-04 20:00:00 | 1.82 |
| 2019-12-04 21:00:00 | 2.08 |
| 2019-12-04 22:00:00 | 2.08 |
| 2019-12-04 23:00:00 | 2.08 |
| 2019-12-05 | 2.34 |
| 2019-12-05 01:00:00 | 2.08 |
| 2019-12-05 02:00:00 | 2.08 |
| 2019-12-05 03:00:00 | 2.08 |
| 2019-12-05 04:00:00 | 2.34 |
| 2019-12-05 05:00:00 | 2.08 |
| 2019-12-05 06:00:00 | 2.6 |
| 2019-12-05 07:00:00 | 2.34 |
| 2019-12-05 08:00:00 | 2.6 |
| 2019-12-05 09:00:00 | 2.6 |
| 2019-12-05 10:00:00 | 2.34 |
| 2019-12-05 11:00:00 | 2.08 |
| 2019-12-05 12:00:00 | 2.08 |
| 2019-12-05 13:00:00 | 2.08 |
| 2019-12-05 14:00:00 | 2.6 |
| 2019-12-05 15:00:00 | 3.64 |
| 2019-12-05 16:00:00 | 2.6 |
| 2019-12-05 17:00:00 | 2.08 |
| 2019-12-05 18:00:00 | 2.6 |
| 2019-12-05 19:00:00 | 2.34 |
| 2019-12-05 20:00:00 | 2.34 |
| 2019-12-05 21:00:00 | 2.34 |
| 2019-12-05 22:00:00 | 2.6 |
| 2019-12-05 23:00:00 | 2.6 |
| 2019-12-06 | 2.34 |
| 2019-12-06 01:00:00 | 2.6 |
| 2019-12-06 02:00:00 | 2.34 |
| 2019-12-06 03:00:00 | 2.6 |
| 2019-12-06 04:00:00 | 2.08 |
| 2019-12-06 05:00:00 | 2.6 |
| 2019-12-06 06:00:00 | 2.6 |
| 2019-12-06 07:00:00 | 2.34 |
| 2019-12-06 08:00:00 | 2.34 |
| 2019-12-06 09:00:00 | 2.6 |
| 2019-12-06 10:00:00 | 2.6 |
| 2019-12-06 11:00:00 | 2.34 |
| 2019-12-06 12:00:00 | 2.34 |
| 2019-12-06 13:00:00 | 2.34 |
| 2019-12-06 14:00:00 | 2.34 |
| 2019-12-06 15:00:00 | 2.34 |
| 2019-12-06 16:00:00 | 2.08 |
| 2019-12-06 17:00:00 | 2.34 |
| 2019-12-06 18:00:00 | 2.34 |
| 2019-12-06 19:00:00 | 2.34 |
| 2019-12-06 20:00:00 | 2.6 |
| 2019-12-06 21:00:00 | 12.74 |
| 2019-12-06 22:00:00 | 2.34 |
| 2019-12-06 23:00:00 | 2.34 |
| 2019-12-07 | 2.6 |
| 2019-12-07 01:00:00 | 2.34 |
| 2019-12-07 02:00:00 | 2.34 |
| 2019-12-07 03:00:00 | 2.6 |
| 2019-12-07 04:00:00 | 2.34 |
| 2019-12-07 05:00:00 | 2.6 |
| 2019-12-07 06:00:00 | 2.34 |
| 2019-12-07 07:00:00 | 2.34 |
| 2019-12-07 08:00:00 | 2.34 |
| 2019-12-07 09:00:00 | 2.08 |
| 2019-12-07 10:00:00 | 2.34 |
| 2019-12-07 11:00:00 | 1.82 |
| 2019-12-07 12:00:00 | 2.08 |
| 2019-12-07 13:00:00 | 1.56 |
| 2019-12-07 14:00:00 | 1.56 |
| 2019-12-07 15:00:00 | 1.56 |
| 2019-12-07 16:00:00 | 1.82 |
| 2019-12-07 17:00:00 | 1.56 |
| 2019-12-07 18:00:00 | 1.82 |
| 2019-12-07 19:00:00 | 2.08 |
| 2019-12-07 20:00:00 | 1.82 |
| 2019-12-07 21:00:00 | 2.08 |
| 2019-12-07 22:00:00 | 2.08 |
| 2019-12-07 23:00:00 | 1.82 |
| 2019-12-08 | 2.08 |
| 2019-12-08 01:00:00 | 2.08 |
| 2019-12-08 02:00:00 | 2.08 |
| 2019-12-08 03:00:00 | 2.08 |
| 2019-12-08 04:00:00 | 2.08 |
| 2019-12-08 05:00:00 | 2.08 |
| 2019-12-08 06:00:00 | 1.82 |
| 2019-12-08 07:00:00 | 2.08 |
| 2019-12-08 08:00:00 | 1.82 |
| 2019-12-08 09:00:00 | 2.08 |
| 2019-12-08 10:00:00 | 1.82 |
| 2019-12-08 11:00:00 | 1.82 |
| 2019-12-08 12:00:00 | 1.56 |
| 2019-12-08 13:00:00 | 1.56 |
| 2019-12-08 14:00:00 | 1.3 |
| 2019-12-08 15:00:00 | 1.3 |
| 2019-12-08 16:00:00 | 1.56 |
| 2019-12-08 17:00:00 | 1.3 |
| 2019-12-08 18:00:00 | 1.56 |
| 2019-12-08 19:00:00 | 1.82 |
| 2019-12-08 20:00:00 | 1.56 |
| 2019-12-08 21:00:00 | 1.82 |
| 2019-12-08 22:00:00 | 1.56 |
| 2019-12-08 23:00:00 | 2.08 |
| 2019-12-09 | 1.82 |
| 2019-12-09 01:00:00 | 1.56 |
| 2019-12-09 02:00:00 | 1.56 |
| 2019-12-09 03:00:00 | 1.82 |
| 2019-12-09 04:00:00 | 1.56 |
| 2019-12-09 05:00:00 | 1.82 |
| 2019-12-09 06:00:00 | 1.56 |
| 2019-12-09 07:00:00 | 1.82 |
| 2019-12-09 08:00:00 | 1.56 |
| 2019-12-09 09:00:00 | 1.56 |
| 2019-12-09 10:00:00 | 1.56 |
| 2019-12-09 11:00:00 | 1.82 |
| 2019-12-09 12:00:00 | 1.56 |
| 2019-12-09 13:00:00 | 1.3 |
| 2019-12-09 14:00:00 | 1.56 |
| 2019-12-09 15:00:00 | 1.56 |
| 2019-12-09 16:00:00 | 1.56 |
| 2019-12-09 17:00:00 | 1.56 |
| 2019-12-09 18:00:00 | 1.56 |
| 2019-12-09 19:00:00 | 1.56 |
| 2019-12-09 20:00:00 | 1.82 |
| 2019-12-09 21:00:00 | 1.56 |
| 2019-12-09 22:00:00 | 1.82 |
| 2019-12-09 23:00:00 | 1.56 |
| 2019-12-10 | 1.56 |
| 2019-12-10 01:00:00 | 1.82 |
| 2019-12-10 02:00:00 | 1.82 |
| 2019-12-10 03:00:00 | 12.48 |
| 2019-12-10 04:00:00 | 2.6 |
| 2019-12-10 05:00:00 | 2.08 |
| 2019-12-10 06:00:00 | 1.82 |
| 2019-12-10 07:00:00 | 1.82 |
| 2019-12-10 08:00:00 | 1.82 |
| 2019-12-10 09:00:00 | 1.82 |
| 2019-12-10 10:00:00 | 1.82 |
| 2019-12-10 11:00:00 | 1.82 |
| 2019-12-10 12:00:00 | 1.82 |
| 2019-12-10 13:00:00 | 1.82 |
| 2019-12-10 14:00:00 | 1.82 |
| 2019-12-10 15:00:00 | 1.82 |
| 2019-12-10 16:00:00 | 1.82 |
| 2019-12-10 17:00:00 | 1.82 |
| 2019-12-10 18:00:00 | 2.08 |
| 2019-12-10 19:00:00 | 1.82 |
| 2019-12-10 20:00:00 | 2.08 |
| 2019-12-10 21:00:00 | 2.08 |
| 2019-12-10 22:00:00 | 2.34 |
| 2019-12-10 23:00:00 | 2.34 |
| 2019-12-11 | 2.08 |
| 2019-12-11 01:00:00 | 2.6 |
| 2019-12-11 02:00:00 | 2.34 |
| 2019-12-11 03:00:00 | 2.6 |
| 2019-12-11 04:00:00 | 2.6 |
| 2019-12-11 05:00:00 | 2.6 |
| 2019-12-11 06:00:00 | 2.86 |
| 2019-12-11 07:00:00 | 2.86 |
| 2019-12-11 08:00:00 | 2.34 |
| 2019-12-11 09:00:00 | 2.86 |
| 2019-12-11 10:00:00 | 2.34 |
| 2019-12-11 11:00:00 | 2.34 |
| 2019-12-11 12:00:00 | 2.08 |
| 2019-12-11 13:00:00 | 2.08 |
| 2019-12-11 14:00:00 | 1.82 |
| 2019-12-11 15:00:00 | 2.08 |
| 2019-12-11 16:00:00 | 1.82 |
| 2019-12-11 17:00:00 | 2.08 |
| 2019-12-11 18:00:00 | 2.34 |
| 2019-12-11 19:00:00 | 2.34 |
| 2019-12-11 20:00:00 | 2.34 |
| 2019-12-11 21:00:00 | 2.34 |
| 2019-12-11 22:00:00 | 2.34 |
| 2019-12-11 23:00:00 | 2.34 |
| 2019-12-12 | 2.6 |
| 2019-12-12 01:00:00 | 2.34 |
| 2019-12-12 02:00:00 | 2.34 |
| 2019-12-12 03:00:00 | 2.34 |
| 2019-12-12 04:00:00 | 2.34 |
| 2019-12-12 05:00:00 | 2.34 |
| 2019-12-12 06:00:00 | 2.08 |
| 2019-12-12 07:00:00 | 2.34 |
| 2019-12-12 08:00:00 | 2.34 |
| 2019-12-12 09:00:00 | 2.08 |
| 2019-12-12 10:00:00 | 2.34 |
| 2019-12-12 11:00:00 | 2.08 |
| 2019-12-12 12:00:00 | 2.08 |
| 2019-12-12 13:00:00 | 2.08 |
| 2019-12-12 14:00:00 | 1.82 |
| 2019-12-12 15:00:00 | 2.08 |
| 2019-12-12 16:00:00 | 2.08 |
| 2019-12-12 17:00:00 | 1.82 |
| 2019-12-12 18:00:00 | 2.08 |
| 2019-12-12 19:00:00 | 1.82 |
| 2019-12-12 20:00:00 | 2.08 |
| 2019-12-12 21:00:00 | 2.08 |
| 2019-12-12 22:00:00 | 2.08 |
| 2019-12-12 23:00:00 | 2.08 |
| 2019-12-13 | 12.22 |
| 2019-12-13 01:00:00 | 2.08 |
| 2019-12-13 02:00:00 | 1.82 |
| 2019-12-13 03:00:00 | 2.08 |
| 2019-12-13 04:00:00 | 2.08 |
| 2019-12-13 05:00:00 | 1.82 |
| 2019-12-13 06:00:00 | 2.08 |
| 2019-12-13 07:00:00 | 2.08 |
| 2019-12-13 08:00:00 | 2.08 |
| 2019-12-13 09:00:00 | 1.82 |
| 2019-12-13 10:00:00 | 2.08 |
| 2019-12-13 11:00:00 | 1.82 |
| 2019-12-13 12:00:00 | 2.08 |
| 2019-12-13 13:00:00 | 1.82 |
| 2019-12-13 14:00:00 | 1.82 |
| 2019-12-13 15:00:00 | 1.82 |
| 2019-12-13 16:00:00 | 1.82 |
| 2019-12-13 17:00:00 | 1.82 |
| 2019-12-13 18:00:00 | 2.08 |
| 2019-12-13 19:00:00 | 1.82 |
| 2019-12-13 20:00:00 | 1.82 |
| 2019-12-13 21:00:00 | 2.08 |
| 2019-12-13 22:00:00 | 1.82 |
| 2019-12-13 23:00:00 | 2.08 |
| 2019-12-14 | 1.82 |
| 2019-12-14 01:00:00 | 2.08 |
| 2019-12-14 02:00:00 | 2.08 |
| 2019-12-14 03:00:00 | 2.08 |
| 2019-12-14 04:00:00 | 2.08 |
| 2019-12-14 05:00:00 | 2.08 |
| 2019-12-14 06:00:00 | 1.82 |
| 2019-12-14 07:00:00 | 2.08 |
| 2019-12-14 08:00:00 | 1.82 |
| 2019-12-14 09:00:00 | 2.08 |
| 2019-12-14 10:00:00 | 1.82 |
| 2019-12-14 11:00:00 | 1.82 |
| 2019-12-14 12:00:00 | 1.56 |
| 2019-12-14 13:00:00 | 1.56 |
| 2019-12-14 14:00:00 | 1.56 |
| 2019-12-14 15:00:00 | 1.56 |
| 2019-12-14 16:00:00 | 1.56 |
| 2019-12-14 17:00:00 | 1.82 |
| 2019-12-14 18:00:00 | 1.82 |
| 2019-12-14 19:00:00 | 1.82 |
| 2019-12-14 20:00:00 | 1.82 |
| 2019-12-14 21:00:00 | 1.82 |
| 2019-12-14 22:00:00 | 1.82 |
| 2019-12-14 23:00:00 | 1.82 |
| 2019-12-15 | 2.08 |
| 2019-12-15 01:00:00 | 1.82 |
| 2019-12-15 02:00:00 | 2.08 |
| 2019-12-15 03:00:00 | 1.56 |
| 2019-12-15 04:00:00 | 2.08 |
| 2019-12-15 05:00:00 | 1.82 |
| 2019-12-15 06:00:00 | 1.82 |
| 2019-12-15 07:00:00 | 1.82 |
| 2019-12-15 08:00:00 | 1.82 |
| 2019-12-15 09:00:00 | 1.82 |
| 2019-12-15 10:00:00 | 1.82 |
| 2019-12-15 11:00:00 | 1.56 |
| 2019-12-15 12:00:00 | 1.56 |
| 2019-12-15 13:00:00 | 1.3 |
| 2019-12-15 14:00:00 | 1.04 |
| 2019-12-15 15:00:00 | 0.78 |
| 2019-12-15 16:00:00 | 1.04 |
| 2019-12-15 17:00:00 | 1.04 |
| 2019-12-15 18:00:00 | 1.3 |
| 2019-12-15 19:00:00 | 1.3 |
| 2019-12-15 20:00:00 | 1.3 |
| 2019-12-15 21:00:00 | 1.3 |
| 2019-12-15 22:00:00 | 1.56 |
| 2019-12-15 23:00:00 | 1.56 |
| 2019-12-16 | 11.96 |
| 2019-12-16 01:00:00 | 1.56 |
| 2019-12-16 02:00:00 | 1.56 |
| 2019-12-16 03:00:00 | 1.56 |
| 2019-12-16 04:00:00 | 1.56 |
| 2019-12-16 05:00:00 | 1.82 |
| 2019-12-16 06:00:00 | 1.82 |
| 2019-12-16 07:00:00 | 1.82 |
| 2019-12-16 08:00:00 | 1.56 |
| 2019-12-16 09:00:00 | 1.82 |
| 2019-12-16 10:00:00 | 1.82 |
| 2019-12-16 11:00:00 | 1.3 |
| 2019-12-16 12:00:00 | 1.3 |
| 2019-12-16 13:00:00 | 1.3 |
| 2019-12-16 14:00:00 | 1.3 |
| 2019-12-16 15:00:00 | 1.3 |
| 2019-12-16 16:00:00 | 1.3 |
| 2019-12-16 17:00:00 | 1.3 |
| 2019-12-16 18:00:00 | 1.56 |
| 2019-12-16 19:00:00 | 1.56 |
| 2019-12-16 20:00:00 | 1.82 |
| 2019-12-16 21:00:00 | 1.56 |
| 2019-12-16 22:00:00 | 1.56 |
| 2019-12-16 23:00:00 | 1.56 |
| 2019-12-17 | 1.3 |
| 2019-12-17 01:00:00 | 1.56 |
| 2019-12-17 02:00:00 | 1.3 |
| 2019-12-17 03:00:00 | 1.56 |
| 2019-12-17 04:00:00 | 1.3 |
| 2019-12-17 05:00:00 | 1.82 |
| 2019-12-17 06:00:00 | 1.56 |
| 2019-12-17 07:00:00 | 1.82 |
| 2019-12-17 08:00:00 | 1.82 |
| 2019-12-17 09:00:00 | 1.56 |
| 2019-12-17 10:00:00 | 1.82 |
| 2019-12-17 11:00:00 | 1.82 |
| 2019-12-17 12:00:00 | 1.3 |
| 2019-12-17 13:00:00 | 1.04 |
| 2019-12-17 14:00:00 | 0.78 |
| 2019-12-17 15:00:00 | 0.78 |
| 2019-12-17 16:00:00 | 1.04 |
| 2019-12-17 17:00:00 | 0.78 |
| 2019-12-17 18:00:00 | 0.52 |
| 2019-12-17 19:00:00 | 0.78 |
| 2019-12-17 20:00:00 | 1.04 |
| 2019-12-17 21:00:00 | 1.04 |
| 2019-12-17 22:00:00 | 1.04 |
| 2019-12-17 23:00:00 | 1.04 |
| 2019-12-18 | 1.04 |
| 2019-12-18 01:00:00 | 1.04 |
| 2019-12-18 02:00:00 | 1.04 |
| 2019-12-18 03:00:00 | 1.04 |
| 2019-12-18 04:00:00 | 1.04 |
| 2019-12-18 05:00:00 | 0.78 |
| 2019-12-18 06:00:00 | 1.04 |
| 2019-12-18 07:00:00 | 1.04 |
| 2019-12-18 08:00:00 | 1.04 |
| 2019-12-18 09:00:00 | 0.78 |
| 2019-12-18 10:00:00 | 0.78 |
| 2019-12-18 11:00:00 | 1.04 |
| 2019-12-18 12:00:00 | 2.6 |
| 2019-12-18 13:00:00 | 1.04 |
| 2019-12-18 14:00:00 | 0.78 |
| 2019-12-18 15:00:00 | 0.78 |
| 2019-12-18 16:00:00 | 0.78 |
| 2019-12-18 17:00:00 | 0.78 |
| 2019-12-18 18:00:00 | 0.78 |
| 2019-12-18 19:00:00 | 1.04 |
| 2019-12-18 20:00:00 | 1.3 |
| 2019-12-18 21:00:00 | 1.3 |
| 2019-12-18 22:00:00 | 1.56 |
| 2019-12-18 23:00:00 | 1.56 |
| 2019-12-19 | 1.82 |
| 2019-12-19 01:00:00 | 2.08 |
| 2019-12-19 02:00:00 | 2.08 |
| 2019-12-19 03:00:00 | 2.08 |
| 2019-12-19 04:00:00 | 2.08 |
| 2019-12-19 05:00:00 | 2.08 |
| 2019-12-19 06:00:00 | 2.08 |
| 2019-12-19 07:00:00 | 2.08 |
| 2019-12-19 08:00:00 | 2.08 |
| 2019-12-19 09:00:00 | 2.08 |
| 2019-12-19 10:00:00 | 2.08 |
| 2019-12-19 11:00:00 | 2.08 |
| 2019-12-19 12:00:00 | 1.82 |
| 2019-12-19 13:00:00 | 1.56 |
| 2019-12-19 14:00:00 | 1.3 |
| 2019-12-19 15:00:00 | 1.04 |
| 2019-12-19 16:00:00 | 1.3 |
| 2019-12-19 17:00:00 | 1.3 |
| 2019-12-19 18:00:00 | 1.3 |
| 2019-12-19 19:00:00 | 1.3 |
| 2019-12-19 20:00:00 | 10.92 |
| 2019-12-19 21:00:00 | 1.56 |
| 2019-12-19 22:00:00 | 1.04 |
| 2019-12-19 23:00:00 | 0.78 |
| 2019-12-20 | 0.78 |
| 2019-12-20 01:00:00 | 0.78 |
| 2019-12-20 02:00:00 | 0.78 |
| 2019-12-20 03:00:00 | 1.04 |
| 2019-12-20 04:00:00 | 1.3 |
| 2019-12-20 05:00:00 | 1.3 |
| 2019-12-20 06:00:00 | 1.3 |
| 2019-12-20 07:00:00 | 1.3 |
| 2019-12-20 08:00:00 | 1.56 |
| 2019-12-20 09:00:00 | 1.3 |
| 2019-12-20 10:00:00 | 1.3 |
| 2019-12-20 11:00:00 | 1.04 |
| 2019-12-20 12:00:00 | 0.52 |
| 2019-12-20 13:00:00 | 0.52 |
| 2019-12-20 14:00:00 | 0.26 |
| 2019-12-20 15:00:00 | 0.26 |
| 2019-12-20 16:00:00 | 0.52 |
| 2019-12-20 17:00:00 | 0.52 |
| 2019-12-20 18:00:00 | 0.52 |
| 2019-12-20 19:00:00 | 0.78 |
| 2019-12-20 20:00:00 | 1.04 |
| 2019-12-20 21:00:00 | 1.04 |
| 2019-12-20 22:00:00 | 1.04 |
| 2019-12-20 23:00:00 | 1.04 |
| 2019-12-21 | 1.04 |
| 2019-12-21 01:00:00 | 1.04 |
| 2019-12-21 02:00:00 | 1.04 |
| 2019-12-21 03:00:00 | 1.04 |
| 2019-12-21 04:00:00 | 1.04 |
| 2019-12-21 05:00:00 | 1.04 |
| 2019-12-21 06:00:00 | 0.78 |
| 2019-12-21 07:00:00 | 1.04 |
| 2019-12-21 08:00:00 | 1.04 |
| 2019-12-21 09:00:00 | 0.78 |
| 2019-12-21 10:00:00 | 1.04 |
| 2019-12-21 11:00:00 | 1.04 |
| 2019-12-21 12:00:00 | 0.78 |
| 2019-12-21 13:00:00 | 0.78 |
| 2019-12-21 14:00:00 | 0.78 |
| 2019-12-21 15:00:00 | 1.04 |
| 2019-12-21 16:00:00 | 1.04 |
| 2019-12-21 17:00:00 | 1.04 |
| 2019-12-21 18:00:00 | 1.3 |
| 2019-12-21 19:00:00 | 1.3 |
| 2019-12-21 20:00:00 | 1.04 |
| 2019-12-21 21:00:00 | 12.48 |
| 2019-12-21 22:00:00 | 1.3 |
| 2019-12-21 23:00:00 | 1.3 |
| 2019-12-22 | 1.3 |
| 2019-12-22 01:00:00 | 1.3 |
| 2019-12-22 02:00:00 | 1.3 |
| 2019-12-22 03:00:00 | 1.3 |
| 2019-12-22 04:00:00 | 1.56 |
| 2019-12-22 05:00:00 | 1.3 |
| 2019-12-22 06:00:00 | 1.3 |
| 2019-12-22 07:00:00 | 1.3 |
| 2019-12-22 08:00:00 | 1.3 |
| 2019-12-22 09:00:00 | 1.3 |
| 2019-12-22 10:00:00 | 1.3 |
| 2019-12-22 11:00:00 | 1.3 |
| 2019-12-22 12:00:00 | 1.3 |
| 2019-12-22 13:00:00 | 1.3 |
| 2019-12-22 14:00:00 | 1.04 |
| 2019-12-22 15:00:00 | 1.3 |
| 2019-12-22 16:00:00 | 1.3 |
| 2019-12-22 17:00:00 | 1.04 |
| 2019-12-22 18:00:00 | 1.56 |
| 2019-12-22 19:00:00 | 1.3 |
| 2019-12-22 20:00:00 | 1.04 |
| 2019-12-22 21:00:00 | 1.56 |
| 2019-12-22 22:00:00 | 1.3 |
| 2019-12-22 23:00:00 | 1.3 |
| 2019-12-23 | 1.3 |
| 2019-12-23 01:00:00 | 1.3 |
| 2019-12-23 02:00:00 | 1.56 |
| 2019-12-23 03:00:00 | 1.56 |
| 2019-12-23 04:00:00 | 12.48 |
| 2019-12-23 05:00:00 | 1.3 |
| 2019-12-23 06:00:00 | 1.56 |
| 2019-12-23 07:00:00 | 1.56 |
| 2019-12-23 08:00:00 | 1.3 |
| 2019-12-23 09:00:00 | 1.56 |
| 2019-12-23 10:00:00 | 1.56 |
| 2019-12-23 11:00:00 | 1.56 |
| 2019-12-23 12:00:00 | 1.56 |
| 2019-12-23 13:00:00 | 1.3 |
| 2019-12-23 14:00:00 | 1.56 |
| 2019-12-23 15:00:00 | 1.56 |
| 2019-12-23 16:00:00 | 1.56 |
| 2019-12-23 17:00:00 | 1.56 |
| 2019-12-23 18:00:00 | 1.56 |
| 2019-12-23 19:00:00 | 1.56 |
| 2019-12-23 20:00:00 | 1.56 |
| 2019-12-23 21:00:00 | 1.82 |
| 2019-12-23 22:00:00 | 1.56 |
| 2019-12-23 23:00:00 | 12.74 |
| 2019-12-24 | 1.82 |
| 2019-12-24 01:00:00 | 1.56 |
| 2019-12-24 02:00:00 | 1.82 |
| 2019-12-24 03:00:00 | 1.56 |
| 2019-12-24 04:00:00 | 1.82 |
| 2019-12-24 05:00:00 | 1.82 |
| 2019-12-24 06:00:00 | 1.56 |
| 2019-12-24 07:00:00 | 1.82 |
| 2019-12-24 08:00:00 | 1.56 |
| 2019-12-24 09:00:00 | 1.56 |
| 2019-12-24 10:00:00 | 1.56 |
| 2019-12-24 11:00:00 | 1.56 |
| 2019-12-24 12:00:00 | 1.56 |
| 2019-12-24 13:00:00 | 1.56 |
| 2019-12-24 14:00:00 | 1.3 |
| 2019-12-24 15:00:00 | 1.56 |
| 2019-12-24 16:00:00 | 1.3 |
| 2019-12-24 17:00:00 | 1.56 |
| 2019-12-24 18:00:00 | 1.56 |
| 2019-12-24 19:00:00 | 1.56 |
| 2019-12-24 20:00:00 | 1.56 |
| 2019-12-24 21:00:00 | 1.56 |
| 2019-12-24 22:00:00 | 1.82 |
| 2019-12-24 23:00:00 | 1.56 |
| 2019-12-25 | 1.56 |
| 2019-12-25 01:00:00 | 1.82 |
| 2019-12-25 02:00:00 | 1.82 |
| 2019-12-25 03:00:00 | 1.56 |
| 2019-12-25 04:00:00 | 1.82 |
| 2019-12-25 05:00:00 | 1.56 |
| 2019-12-25 06:00:00 | 1.82 |
| 2019-12-25 07:00:00 | 1.56 |
| 2019-12-25 08:00:00 | 1.82 |
| 2019-12-25 09:00:00 | 1.56 |
| 2019-12-25 10:00:00 | 1.82 |
| 2019-12-25 11:00:00 | 1.56 |
| 2019-12-25 12:00:00 | 1.56 |
| 2019-12-25 13:00:00 | 1.3 |
| 2019-12-25 14:00:00 | 1.56 |
| 2019-12-25 15:00:00 | 1.56 |
| 2019-12-25 16:00:00 | 1.3 |
| 2019-12-25 17:00:00 | 1.56 |
| 2019-12-25 18:00:00 | 1.82 |
| 2019-12-25 19:00:00 | 1.56 |
| 2019-12-25 20:00:00 | 1.82 |
| 2019-12-25 21:00:00 | 1.82 |
| 2019-12-25 22:00:00 | 1.82 |
| 2019-12-25 23:00:00 | 1.82 |
| 2019-12-26 | 1.82 |
| 2019-12-26 01:00:00 | 1.82 |
| 2019-12-26 02:00:00 | 11.96 |
| 2019-12-26 03:00:00 | 2.08 |
| 2019-12-26 04:00:00 | 1.82 |
| 2019-12-26 05:00:00 | 1.56 |
| 2019-12-26 06:00:00 | 1.82 |
| 2019-12-26 07:00:00 | 1.56 |
| 2019-12-26 08:00:00 | 1.82 |
| 2019-12-26 09:00:00 | 1.56 |
| 2019-12-26 10:00:00 | 1.82 |
| 2019-12-26 11:00:00 | 1.82 |
| 2019-12-26 12:00:00 | 1.56 |
| 2019-12-26 13:00:00 | 1.82 |
| 2019-12-26 14:00:00 | 1.82 |
| 2019-12-26 15:00:00 | 1.56 |
| 2019-12-26 16:00:00 | 1.56 |
| 2019-12-26 17:00:00 | 1.82 |
| 2019-12-26 18:00:00 | 1.82 |
| 2019-12-26 19:00:00 | 1.56 |
| 2019-12-26 20:00:00 | 1.82 |
| 2019-12-26 21:00:00 | 1.82 |
| 2019-12-26 22:00:00 | 1.82 |
| 2019-12-26 23:00:00 | 1.82 |
| 2019-12-27 | 1.56 |
| 2019-12-27 01:00:00 | 2.08 |
| 2019-12-27 02:00:00 | 1.56 |
| 2019-12-27 03:00:00 | 1.82 |
| 2019-12-27 04:00:00 | 1.82 |
| 2019-12-27 05:00:00 | 1.82 |
| 2019-12-27 06:00:00 | 1.82 |
| 2019-12-27 07:00:00 | 1.82 |
| 2019-12-27 08:00:00 | 1.82 |
| 2019-12-27 09:00:00 | 2.08 |
| 2019-12-27 10:00:00 | 1.82 |
| 2019-12-27 11:00:00 | 2.08 |
| 2019-12-27 12:00:00 | 1.82 |
| 2019-12-27 13:00:00 | 2.08 |
| 2019-12-27 14:00:00 | 1.82 |
| 2019-12-27 15:00:00 | 2.08 |
| 2019-12-27 16:00:00 | 2.08 |
| 2019-12-27 17:00:00 | 2.08 |
| 2019-12-27 18:00:00 | 2.08 |
| 2019-12-27 19:00:00 | 2.08 |
| 2019-12-27 20:00:00 | 2.08 |
| 2019-12-27 21:00:00 | 2.08 |
| 2019-12-27 22:00:00 | 2.34 |
| 2019-12-27 23:00:00 | 2.08 |
| 2019-12-28 | 2.34 |
| 2019-12-28 01:00:00 | 2.08 |
| 2019-12-28 02:00:00 | 2.34 |
| 2019-12-28 03:00:00 | 2.34 |
| 2019-12-28 04:00:00 | 2.34 |
| 2019-12-28 05:00:00 | 2.34 |
| 2019-12-28 06:00:00 | 2.34 |
| 2019-12-28 07:00:00 | 2.6 |
| 2019-12-28 08:00:00 | 13.26 |
| 2019-12-28 09:00:00 | 2.34 |
| 2019-12-28 10:00:00 | 2.34 |
| 2019-12-28 11:00:00 | 2.34 |
| 2019-12-28 12:00:00 | 2.08 |
| 2019-12-28 13:00:00 | 2.34 |
| 2019-12-28 14:00:00 | 2.6 |
| 2019-12-28 15:00:00 | 2.34 |
| 2019-12-28 16:00:00 | 2.34 |
| 2019-12-28 17:00:00 | 2.34 |
| 2019-12-28 18:00:00 | 2.34 |
| 2019-12-28 19:00:00 | 2.34 |
| 2019-12-28 20:00:00 | 2.34 |
| 2019-12-28 21:00:00 | 2.34 |
| 2019-12-28 22:00:00 | 2.34 |
| 2019-12-28 23:00:00 | 2.08 |
| 2019-12-29 | 2.34 |
| 2019-12-29 01:00:00 | 2.34 |
| 2019-12-29 02:00:00 | 2.34 |
| 2019-12-29 03:00:00 | 2.08 |
| 2019-12-29 04:00:00 | 2.34 |
| 2019-12-29 05:00:00 | 2.34 |
| 2019-12-29 06:00:00 | 2.34 |
| 2019-12-29 07:00:00 | 2.34 |
| 2019-12-29 08:00:00 | 2.08 |
| 2019-12-29 09:00:00 | 2.34 |
| 2019-12-29 10:00:00 | 2.34 |
| 2019-12-29 11:00:00 | 2.34 |
| 2019-12-29 12:00:00 | 2.34 |
| 2019-12-29 13:00:00 | 2.34 |
| 2019-12-29 14:00:00 | 2.34 |
| 2019-12-29 15:00:00 | 2.34 |
| 2019-12-29 16:00:00 | 2.34 |
| 2019-12-29 17:00:00 | 2.08 |
| 2019-12-29 18:00:00 | 2.34 |
| 2019-12-29 19:00:00 | 2.34 |
| 2019-12-29 20:00:00 | 2.34 |
| 2019-12-29 21:00:00 | 2.34 |
| 2019-12-29 22:00:00 | 2.34 |
| 2019-12-29 23:00:00 | 2.34 |
| 2019-12-30 | 2.34 |
| 2019-12-30 01:00:00 | 2.6 |
| 2019-12-30 02:00:00 | 2.6 |
| 2019-12-30 03:00:00 | 2.34 |
| 2019-12-30 04:00:00 | 2.6 |
| 2019-12-30 05:00:00 | 2.6 |
| 2019-12-30 06:00:00 | 2.6 |
| 2019-12-30 07:00:00 | 2.6 |
| 2019-12-30 08:00:00 | 2.6 |
| 2019-12-30 09:00:00 | 2.6 |
| 2019-12-30 10:00:00 | 2.6 |
| 2019-12-30 11:00:00 | 2.34 |
| 2019-12-30 12:00:00 | 2.34 |
| 2019-12-30 13:00:00 | 2.34 |
| 2019-12-30 14:00:00 | 2.34 |
| 2019-12-30 15:00:00 | 2.34 |
| 2019-12-30 16:00:00 | 2.34 |
| 2019-12-30 17:00:00 | 2.34 |
| 2019-12-30 18:00:00 | 2.34 |
| 2019-12-30 19:00:00 | 2.34 |
| 2019-12-30 20:00:00 | 2.6 |
| 2019-12-30 21:00:00 | 2.34 |
| 2019-12-30 22:00:00 | 2.34 |
| 2019-12-30 23:00:00 | 2.34 |
| 2019-12-31 | 2.6 |
| 2019-12-31 01:00:00 | 2.34 |
| 2019-12-31 02:00:00 | 2.34 |
| 2019-12-31 03:00:00 | 2.34 |
| 2019-12-31 04:00:00 | 2.34 |
| 2019-12-31 05:00:00 | 2.34 |
| 2019-12-31 06:00:00 | 2.34 |
| 2019-12-31 07:00:00 | 2.34 |
| 2019-12-31 08:00:00 | 2.34 |
| 2019-12-31 09:00:00 | 2.34 |
| 2019-12-31 10:00:00 | 2.34 |
| 2019-12-31 11:00:00 | 12.48 |
| 2019-12-31 12:00:00 | 2.08 |
| 2019-12-31 13:00:00 | 2.08 |
| 2019-12-31 14:00:00 | 2.08 |
| 2019-12-31 15:00:00 | 2.08 |
| 2019-12-31 16:00:00 | 1.82 |
| 2019-12-31 17:00:00 | 2.08 |
| 2019-12-31 18:00:00 | 1.82 |
| 2019-12-31 19:00:00 | 2.08 |
| 2019-12-31 20:00:00 | 1.82 |
| 2019-12-31 21:00:00 | 2.08 |
| 2019-12-31 22:00:00 | 2.08 |
| 2019-12-31 23:00:00 | 2.08 |
| 2020-01-01 | 2.08 |